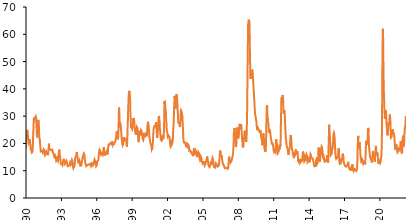
| Category | Series 0 |
|---|---|
| 1990-01-03 | 18.19 |
| 1990-01-04 | 18.705 |
| 1990-01-05 | 19.173 |
| 1990-01-06 | 19.173 |
| 1990-01-07 | 19.173 |
| 1990-01-08 | 19.445 |
| 1990-01-09 | 19.996 |
| 1990-01-10 | 20.403 |
| 1990-01-11 | 20.353 |
| 1990-01-12 | 20.889 |
| 1990-01-13 | 20.889 |
| 1990-01-14 | 20.889 |
| 1990-01-15 | 21.494 |
| 1990-01-16 | 21.763 |
| 1990-01-17 | 21.981 |
| 1990-01-18 | 22.178 |
| 1990-01-19 | 22.202 |
| 1990-01-20 | 22.202 |
| 1990-01-21 | 22.202 |
| 1990-01-22 | 22.524 |
| 1990-01-23 | 22.67 |
| 1990-01-24 | 22.84 |
| 1990-01-25 | 23.004 |
| 1990-01-26 | 23.186 |
| 1990-01-27 | 23.186 |
| 1990-01-28 | 23.186 |
| 1990-01-29 | 23.357 |
| 1990-01-30 | 23.552 |
| 1990-01-31 | 23.638 |
| 1990-02-01 | 23.694 |
| 1990-02-02 | 23.973 |
| 1990-02-03 | 24.199 |
| 1990-02-04 | 24.403 |
| 1990-02-05 | 24.41 |
| 1990-02-06 | 24.423 |
| 1990-02-07 | 24.606 |
| 1990-02-08 | 24.677 |
| 1990-02-09 | 24.734 |
| 1990-02-10 | 24.957 |
| 1990-02-11 | 24.973 |
| 1990-02-12 | 24.945 |
| 1990-02-13 | 24.891 |
| 1990-02-14 | 24.696 |
| 1990-02-15 | 24.493 |
| 1990-02-16 | 24.339 |
| 1990-02-17 | 24.339 |
| 1990-02-18 | 24.431 |
| 1990-02-19 | 24.431 |
| 1990-02-20 | 24.352 |
| 1990-02-21 | 24.219 |
| 1990-02-22 | 24.115 |
| 1990-02-23 | 24.034 |
| 1990-02-24 | 23.954 |
| 1990-02-25 | 23.832 |
| 1990-02-26 | 23.818 |
| 1990-02-27 | 23.764 |
| 1990-02-28 | 23.552 |
| 1990-03-01 | 23.298 |
| 1990-03-02 | 23.106 |
| 1990-03-03 | 23.018 |
| 1990-03-04 | 22.949 |
| 1990-03-05 | 22.904 |
| 1990-03-06 | 22.791 |
| 1990-03-07 | 22.532 |
| 1990-03-08 | 22.297 |
| 1990-03-09 | 22.107 |
| 1990-03-10 | 22.024 |
| 1990-03-11 | 21.936 |
| 1990-03-12 | 21.842 |
| 1990-03-13 | 21.805 |
| 1990-03-14 | 21.58 |
| 1990-03-15 | 21.344 |
| 1990-03-16 | 21.133 |
| 1990-03-17 | 21.204 |
| 1990-03-18 | 21.226 |
| 1990-03-19 | 21.08 |
| 1990-03-20 | 20.983 |
| 1990-03-21 | 20.943 |
| 1990-03-22 | 20.941 |
| 1990-03-23 | 20.785 |
| 1990-03-24 | 20.702 |
| 1990-03-25 | 20.553 |
| 1990-03-26 | 20.507 |
| 1990-03-27 | 20.53 |
| 1990-03-28 | 20.357 |
| 1990-03-29 | 20.165 |
| 1990-03-30 | 20.062 |
| 1990-03-31 | 19.975 |
| 1990-04-01 | 19.906 |
| 1990-04-02 | 20.046 |
| 1990-04-03 | 20.064 |
| 1990-04-04 | 20.064 |
| 1990-04-05 | 20.094 |
| 1990-04-06 | 20.215 |
| 1990-04-07 | 20.238 |
| 1990-04-08 | 20.234 |
| 1990-04-09 | 20.333 |
| 1990-04-10 | 20.395 |
| 1990-04-11 | 20.288 |
| 1990-04-12 | 20.231 |
| 1990-04-13 | 20.259 |
| 1990-04-14 | 20.332 |
| 1990-04-15 | 20.474 |
| 1990-04-16 | 20.488 |
| 1990-04-17 | 20.483 |
| 1990-04-18 | 20.691 |
| 1990-04-19 | 20.853 |
| 1990-04-20 | 21.007 |
| 1990-04-21 | 20.92 |
| 1990-04-22 | 20.945 |
| 1990-04-23 | 21.106 |
| 1990-04-24 | 21.134 |
| 1990-04-25 | 21.194 |
| 1990-04-26 | 21.158 |
| 1990-04-27 | 21.273 |
| 1990-04-28 | 21.414 |
| 1990-04-29 | 21.503 |
| 1990-04-30 | 21.404 |
| 1990-05-01 | 21.262 |
| 1990-05-02 | 21.094 |
| 1990-05-03 | 20.969 |
| 1990-05-04 | 20.743 |
| 1990-05-05 | 20.72 |
| 1990-05-06 | 20.665 |
| 1990-05-07 | 20.514 |
| 1990-05-08 | 20.418 |
| 1990-05-09 | 20.243 |
| 1990-05-10 | 20.096 |
| 1990-05-11 | 20.195 |
| 1990-05-12 | 20.214 |
| 1990-05-13 | 20.214 |
| 1990-05-14 | 20.211 |
| 1990-05-15 | 20.178 |
| 1990-05-16 | 20.04 |
| 1990-05-17 | 19.899 |
| 1990-05-18 | 19.65 |
| 1990-05-19 | 19.516 |
| 1990-05-20 | 19.325 |
| 1990-05-21 | 19.201 |
| 1990-05-22 | 19.14 |
| 1990-05-23 | 18.822 |
| 1990-05-24 | 18.64 |
| 1990-05-25 | 18.48 |
| 1990-05-26 | 18.395 |
| 1990-05-27 | 18.206 |
| 1990-05-28 | 18.206 |
| 1990-05-29 | 18.231 |
| 1990-05-30 | 18.132 |
| 1990-05-31 | 18.082 |
| 1990-06-01 | 17.976 |
| 1990-06-02 | 17.984 |
| 1990-06-03 | 18.021 |
| 1990-06-04 | 18.039 |
| 1990-06-05 | 18.084 |
| 1990-06-06 | 18.073 |
| 1990-06-07 | 17.996 |
| 1990-06-08 | 17.946 |
| 1990-06-09 | 17.914 |
| 1990-06-10 | 17.814 |
| 1990-06-11 | 17.74 |
| 1990-06-12 | 17.686 |
| 1990-06-13 | 17.554 |
| 1990-06-14 | 17.455 |
| 1990-06-15 | 17.369 |
| 1990-06-16 | 17.373 |
| 1990-06-17 | 17.383 |
| 1990-06-18 | 17.399 |
| 1990-06-19 | 17.296 |
| 1990-06-20 | 17.227 |
| 1990-06-21 | 17.078 |
| 1990-06-22 | 17.182 |
| 1990-06-23 | 17.156 |
| 1990-06-24 | 17.147 |
| 1990-06-25 | 17.143 |
| 1990-06-26 | 17.102 |
| 1990-06-27 | 17.052 |
| 1990-06-28 | 16.935 |
| 1990-06-29 | 16.847 |
| 1990-06-30 | 16.822 |
| 1990-07-01 | 16.809 |
| 1990-07-02 | 16.783 |
| 1990-07-03 | 16.752 |
| 1990-07-04 | 16.674 |
| 1990-07-05 | 16.592 |
| 1990-07-06 | 16.544 |
| 1990-07-07 | 16.528 |
| 1990-07-08 | 16.472 |
| 1990-07-09 | 16.482 |
| 1990-07-10 | 16.502 |
| 1990-07-11 | 16.519 |
| 1990-07-12 | 16.54 |
| 1990-07-13 | 16.527 |
| 1990-07-14 | 16.483 |
| 1990-07-15 | 16.514 |
| 1990-07-16 | 16.526 |
| 1990-07-17 | 16.532 |
| 1990-07-18 | 16.589 |
| 1990-07-19 | 16.747 |
| 1990-07-20 | 16.764 |
| 1990-07-21 | 16.867 |
| 1990-07-22 | 16.735 |
| 1990-07-23 | 17.082 |
| 1990-07-24 | 17.307 |
| 1990-07-25 | 17.456 |
| 1990-07-26 | 17.645 |
| 1990-07-27 | 17.889 |
| 1990-07-28 | 17.974 |
| 1990-07-29 | 18.104 |
| 1990-07-30 | 18.257 |
| 1990-07-31 | 18.393 |
| 1990-08-01 | 18.649 |
| 1990-08-02 | 18.855 |
| 1990-08-03 | 19.304 |
| 1990-08-04 | 19.402 |
| 1990-08-05 | 19.552 |
| 1990-08-06 | 20.33 |
| 1990-08-07 | 20.895 |
| 1990-08-08 | 21.423 |
| 1990-08-09 | 21.762 |
| 1990-08-10 | 22.175 |
| 1990-08-11 | 22.418 |
| 1990-08-12 | 22.684 |
| 1990-08-13 | 22.83 |
| 1990-08-14 | 22.891 |
| 1990-08-15 | 23.19 |
| 1990-08-16 | 23.667 |
| 1990-08-17 | 24.059 |
| 1990-08-18 | 24.321 |
| 1990-08-19 | 24.756 |
| 1990-08-20 | 24.837 |
| 1990-08-21 | 25.021 |
| 1990-08-22 | 25.334 |
| 1990-08-23 | 26.001 |
| 1990-08-24 | 26.625 |
| 1990-08-25 | 26.929 |
| 1990-08-26 | 27.219 |
| 1990-08-27 | 27.334 |
| 1990-08-28 | 27.415 |
| 1990-08-29 | 27.698 |
| 1990-08-30 | 28.097 |
| 1990-08-31 | 28.472 |
| 1990-09-01 | 28.855 |
| 1990-09-02 | 28.861 |
| 1990-09-03 | 28.861 |
| 1990-09-04 | 28.895 |
| 1990-09-05 | 28.543 |
| 1990-09-06 | 28.421 |
| 1990-09-07 | 28.443 |
| 1990-09-08 | 28.646 |
| 1990-09-09 | 28.798 |
| 1990-09-10 | 28.825 |
| 1990-09-11 | 28.804 |
| 1990-09-12 | 28.918 |
| 1990-09-13 | 29.163 |
| 1990-09-14 | 29.508 |
| 1990-09-15 | 29.625 |
| 1990-09-16 | 29.736 |
| 1990-09-17 | 29.726 |
| 1990-09-18 | 29.683 |
| 1990-09-19 | 29.751 |
| 1990-09-20 | 29.74 |
| 1990-09-21 | 29.715 |
| 1990-09-22 | 29.377 |
| 1990-09-23 | 29.138 |
| 1990-09-24 | 29.209 |
| 1990-09-25 | 29.19 |
| 1990-09-26 | 29.121 |
| 1990-09-27 | 29.1 |
| 1990-09-28 | 29.182 |
| 1990-09-29 | 29.147 |
| 1990-09-30 | 29.107 |
| 1990-10-01 | 29.055 |
| 1990-10-02 | 28.97 |
| 1990-10-03 | 28.922 |
| 1990-10-04 | 28.828 |
| 1990-10-05 | 28.797 |
| 1990-10-06 | 28.731 |
| 1990-10-07 | 28.731 |
| 1990-10-08 | 28.698 |
| 1990-10-09 | 28.79 |
| 1990-10-10 | 28.874 |
| 1990-10-11 | 29.128 |
| 1990-10-12 | 29.302 |
| 1990-10-13 | 29.3 |
| 1990-10-14 | 29.238 |
| 1990-10-15 | 29.352 |
| 1990-10-16 | 29.447 |
| 1990-10-17 | 29.53 |
| 1990-10-18 | 29.565 |
| 1990-10-19 | 29.565 |
| 1990-10-20 | 29.608 |
| 1990-10-21 | 29.586 |
| 1990-10-22 | 29.476 |
| 1990-10-23 | 29.389 |
| 1990-10-24 | 29.285 |
| 1990-10-25 | 29.296 |
| 1990-10-26 | 29.412 |
| 1990-10-27 | 29.448 |
| 1990-10-28 | 29.464 |
| 1990-10-29 | 29.563 |
| 1990-10-30 | 29.607 |
| 1990-10-31 | 29.697 |
| 1990-11-01 | 29.832 |
| 1990-11-02 | 29.929 |
| 1990-11-03 | 30.044 |
| 1990-11-04 | 30.153 |
| 1990-11-05 | 30.139 |
| 1990-11-06 | 30.092 |
| 1990-11-07 | 30.221 |
| 1990-11-08 | 30.225 |
| 1990-11-09 | 30.032 |
| 1990-11-10 | 29.844 |
| 1990-11-11 | 29.74 |
| 1990-11-12 | 29.542 |
| 1990-11-13 | 29.317 |
| 1990-11-14 | 28.919 |
| 1990-11-15 | 28.515 |
| 1990-11-16 | 28.06 |
| 1990-11-17 | 27.986 |
| 1990-11-18 | 27.993 |
| 1990-11-19 | 27.657 |
| 1990-11-20 | 27.313 |
| 1990-11-21 | 27.032 |
| 1990-11-22 | 27.007 |
| 1990-11-23 | 26.659 |
| 1990-11-24 | 26.54 |
| 1990-11-25 | 26.318 |
| 1990-11-26 | 26.14 |
| 1990-11-27 | 25.984 |
| 1990-11-28 | 25.576 |
| 1990-11-29 | 25.261 |
| 1990-11-30 | 24.886 |
| 1990-12-01 | 24.618 |
| 1990-12-02 | 24.333 |
| 1990-12-03 | 24.23 |
| 1990-12-04 | 24.126 |
| 1990-12-05 | 23.701 |
| 1990-12-06 | 23.392 |
| 1990-12-07 | 22.998 |
| 1990-12-08 | 22.608 |
| 1990-12-09 | 22.379 |
| 1990-12-10 | 22.44 |
| 1990-12-11 | 22.502 |
| 1990-12-12 | 22.296 |
| 1990-12-13 | 22.223 |
| 1990-12-14 | 22.269 |
| 1990-12-15 | 22.254 |
| 1990-12-16 | 22.302 |
| 1990-12-17 | 22.43 |
| 1990-12-18 | 22.462 |
| 1990-12-19 | 22.563 |
| 1990-12-20 | 22.708 |
| 1990-12-21 | 22.783 |
| 1990-12-22 | 22.783 |
| 1990-12-23 | 22.873 |
| 1990-12-24 | 22.928 |
| 1990-12-25 | 22.928 |
| 1990-12-26 | 22.996 |
| 1990-12-27 | 23.089 |
| 1990-12-28 | 23.188 |
| 1990-12-29 | 23.152 |
| 1990-12-30 | 23.204 |
| 1990-12-31 | 23.363 |
| 1991-01-01 | 23.363 |
| 1991-01-02 | 23.58 |
| 1991-01-03 | 23.874 |
| 1991-01-04 | 24.187 |
| 1991-01-05 | 24.269 |
| 1991-01-06 | 24.363 |
| 1991-01-07 | 24.604 |
| 1991-01-08 | 24.893 |
| 1991-01-09 | 25.379 |
| 1991-01-10 | 25.758 |
| 1991-01-11 | 26.325 |
| 1991-01-12 | 26.498 |
| 1991-01-13 | 26.645 |
| 1991-01-14 | 27.148 |
| 1991-01-15 | 27.598 |
| 1991-01-16 | 28.016 |
| 1991-01-17 | 28.233 |
| 1991-01-18 | 28.348 |
| 1991-01-19 | 28.623 |
| 1991-01-20 | 28.954 |
| 1991-01-21 | 28.711 |
| 1991-01-22 | 28.52 |
| 1991-01-23 | 28.515 |
| 1991-01-24 | 28.246 |
| 1991-01-25 | 28.151 |
| 1991-01-26 | 28.318 |
| 1991-01-27 | 28.491 |
| 1991-01-28 | 28.218 |
| 1991-01-29 | 27.978 |
| 1991-01-30 | 27.74 |
| 1991-01-31 | 27.429 |
| 1991-02-01 | 27.175 |
| 1991-02-02 | 27.14 |
| 1991-02-03 | 27.137 |
| 1991-02-04 | 26.886 |
| 1991-02-05 | 26.639 |
| 1991-02-06 | 26.354 |
| 1991-02-07 | 26.046 |
| 1991-02-08 | 25.595 |
| 1991-02-09 | 25.322 |
| 1991-02-10 | 24.957 |
| 1991-02-11 | 24.842 |
| 1991-02-12 | 24.725 |
| 1991-02-13 | 24.028 |
| 1991-02-14 | 23.36 |
| 1991-02-15 | 22.741 |
| 1991-02-16 | 22.517 |
| 1991-02-17 | 22.373 |
| 1991-02-18 | 22.373 |
| 1991-02-19 | 22.252 |
| 1991-02-20 | 22.154 |
| 1991-02-21 | 21.958 |
| 1991-02-22 | 21.819 |
| 1991-02-23 | 21.767 |
| 1991-02-24 | 21.744 |
| 1991-02-25 | 21.8 |
| 1991-02-26 | 21.732 |
| 1991-02-27 | 21.647 |
| 1991-02-28 | 21.555 |
| 1991-03-01 | 21.564 |
| 1991-03-02 | 21.598 |
| 1991-03-03 | 21.629 |
| 1991-03-04 | 21.589 |
| 1991-03-05 | 21.532 |
| 1991-03-06 | 21.467 |
| 1991-03-07 | 21.446 |
| 1991-03-08 | 21.352 |
| 1991-03-09 | 21.234 |
| 1991-03-10 | 21.115 |
| 1991-03-11 | 21.103 |
| 1991-03-12 | 20.989 |
| 1991-03-13 | 20.665 |
| 1991-03-14 | 20.299 |
| 1991-03-15 | 20.001 |
| 1991-03-16 | 19.923 |
| 1991-03-17 | 19.943 |
| 1991-03-18 | 19.724 |
| 1991-03-19 | 19.543 |
| 1991-03-20 | 19.377 |
| 1991-03-21 | 19.235 |
| 1991-03-22 | 18.96 |
| 1991-03-23 | 18.869 |
| 1991-03-24 | 18.756 |
| 1991-03-25 | 18.656 |
| 1991-03-26 | 18.545 |
| 1991-03-27 | 18.244 |
| 1991-03-28 | 18.078 |
| 1991-03-29 | 17.918 |
| 1991-03-30 | 17.744 |
| 1991-03-31 | 17.744 |
| 1991-04-01 | 17.728 |
| 1991-04-02 | 17.712 |
| 1991-04-03 | 17.558 |
| 1991-04-04 | 17.441 |
| 1991-04-05 | 17.302 |
| 1991-04-06 | 17.115 |
| 1991-04-07 | 16.921 |
| 1991-04-08 | 16.945 |
| 1991-04-09 | 17.096 |
| 1991-04-10 | 17.041 |
| 1991-04-11 | 16.966 |
| 1991-04-12 | 17.079 |
| 1991-04-13 | 17.186 |
| 1991-04-14 | 17.306 |
| 1991-04-15 | 17.265 |
| 1991-04-16 | 17.197 |
| 1991-04-17 | 17.181 |
| 1991-04-18 | 17.189 |
| 1991-04-19 | 17.171 |
| 1991-04-20 | 17.187 |
| 1991-04-21 | 17.224 |
| 1991-04-22 | 17.202 |
| 1991-04-23 | 17.193 |
| 1991-04-24 | 17.191 |
| 1991-04-25 | 17.231 |
| 1991-04-26 | 17.265 |
| 1991-04-27 | 17.284 |
| 1991-04-28 | 17.284 |
| 1991-04-29 | 17.331 |
| 1991-04-30 | 17.373 |
| 1991-05-01 | 17.389 |
| 1991-05-02 | 17.394 |
| 1991-05-03 | 17.377 |
| 1991-05-04 | 17.347 |
| 1991-05-05 | 17.333 |
| 1991-05-06 | 17.361 |
| 1991-05-07 | 17.365 |
| 1991-05-08 | 17.382 |
| 1991-05-09 | 17.248 |
| 1991-05-10 | 17.149 |
| 1991-05-11 | 17.144 |
| 1991-05-12 | 17.079 |
| 1991-05-13 | 17.107 |
| 1991-05-14 | 17.147 |
| 1991-05-15 | 17.233 |
| 1991-05-16 | 17.297 |
| 1991-05-17 | 17.35 |
| 1991-05-18 | 17.402 |
| 1991-05-19 | 17.489 |
| 1991-05-20 | 17.47 |
| 1991-05-21 | 17.406 |
| 1991-05-22 | 17.378 |
| 1991-05-23 | 17.337 |
| 1991-05-24 | 17.269 |
| 1991-05-25 | 17.275 |
| 1991-05-26 | 17.275 |
| 1991-05-27 | 17.275 |
| 1991-05-28 | 17.199 |
| 1991-05-29 | 17.086 |
| 1991-05-30 | 16.98 |
| 1991-05-31 | 16.892 |
| 1991-06-01 | 16.861 |
| 1991-06-02 | 16.841 |
| 1991-06-03 | 16.842 |
| 1991-06-04 | 16.81 |
| 1991-06-05 | 16.738 |
| 1991-06-06 | 16.713 |
| 1991-06-07 | 16.675 |
| 1991-06-08 | 16.65 |
| 1991-06-09 | 16.603 |
| 1991-06-10 | 16.646 |
| 1991-06-11 | 16.679 |
| 1991-06-12 | 16.681 |
| 1991-06-13 | 16.633 |
| 1991-06-14 | 16.519 |
| 1991-06-15 | 16.483 |
| 1991-06-16 | 16.475 |
| 1991-06-17 | 16.426 |
| 1991-06-18 | 16.412 |
| 1991-06-19 | 16.429 |
| 1991-06-20 | 16.461 |
| 1991-06-21 | 16.478 |
| 1991-06-22 | 16.496 |
| 1991-06-23 | 16.563 |
| 1991-06-24 | 16.649 |
| 1991-06-25 | 16.706 |
| 1991-06-26 | 16.764 |
| 1991-06-27 | 16.864 |
| 1991-06-28 | 17.03 |
| 1991-06-29 | 17.078 |
| 1991-06-30 | 17.135 |
| 1991-07-01 | 17.207 |
| 1991-07-02 | 17.226 |
| 1991-07-03 | 17.344 |
| 1991-07-04 | 17.4 |
| 1991-07-05 | 17.493 |
| 1991-07-06 | 17.521 |
| 1991-07-07 | 17.549 |
| 1991-07-08 | 17.686 |
| 1991-07-09 | 17.785 |
| 1991-07-10 | 17.867 |
| 1991-07-11 | 17.87 |
| 1991-07-12 | 17.898 |
| 1991-07-13 | 17.943 |
| 1991-07-14 | 18.046 |
| 1991-07-15 | 18.033 |
| 1991-07-16 | 18.007 |
| 1991-07-17 | 18.103 |
| 1991-07-18 | 18.086 |
| 1991-07-19 | 17.993 |
| 1991-07-20 | 18.056 |
| 1991-07-21 | 18.137 |
| 1991-07-22 | 18.075 |
| 1991-07-23 | 18.004 |
| 1991-07-24 | 17.915 |
| 1991-07-25 | 17.814 |
| 1991-07-26 | 17.694 |
| 1991-07-27 | 17.685 |
| 1991-07-28 | 17.587 |
| 1991-07-29 | 17.491 |
| 1991-07-30 | 17.395 |
| 1991-07-31 | 17.23 |
| 1991-08-01 | 17.127 |
| 1991-08-02 | 16.927 |
| 1991-08-03 | 16.927 |
| 1991-08-04 | 16.856 |
| 1991-08-05 | 16.811 |
| 1991-08-06 | 16.753 |
| 1991-08-07 | 16.538 |
| 1991-08-08 | 16.366 |
| 1991-08-09 | 16.196 |
| 1991-08-10 | 16.14 |
| 1991-08-11 | 16.032 |
| 1991-08-12 | 15.995 |
| 1991-08-13 | 15.938 |
| 1991-08-14 | 15.815 |
| 1991-08-15 | 15.711 |
| 1991-08-16 | 15.642 |
| 1991-08-17 | 15.636 |
| 1991-08-18 | 15.643 |
| 1991-08-19 | 15.907 |
| 1991-08-20 | 16.041 |
| 1991-08-21 | 15.983 |
| 1991-08-22 | 15.893 |
| 1991-08-23 | 15.802 |
| 1991-08-24 | 15.805 |
| 1991-08-25 | 15.822 |
| 1991-08-26 | 15.774 |
| 1991-08-27 | 15.76 |
| 1991-08-28 | 15.744 |
| 1991-08-29 | 15.714 |
| 1991-08-30 | 15.681 |
| 1991-08-31 | 15.691 |
| 1991-09-01 | 15.713 |
| 1991-09-02 | 15.713 |
| 1991-09-03 | 15.754 |
| 1991-09-04 | 15.814 |
| 1991-09-05 | 15.898 |
| 1991-09-06 | 15.955 |
| 1991-09-07 | 15.954 |
| 1991-09-08 | 15.981 |
| 1991-09-09 | 16.068 |
| 1991-09-10 | 16.17 |
| 1991-09-11 | 16.299 |
| 1991-09-12 | 16.37 |
| 1991-09-13 | 16.502 |
| 1991-09-14 | 16.568 |
| 1991-09-15 | 16.597 |
| 1991-09-16 | 16.658 |
| 1991-09-17 | 16.707 |
| 1991-09-18 | 16.534 |
| 1991-09-19 | 16.472 |
| 1991-09-20 | 16.542 |
| 1991-09-21 | 16.64 |
| 1991-09-22 | 16.757 |
| 1991-09-23 | 16.738 |
| 1991-09-24 | 16.705 |
| 1991-09-25 | 16.746 |
| 1991-09-26 | 16.741 |
| 1991-09-27 | 16.789 |
| 1991-09-28 | 16.887 |
| 1991-09-29 | 17.015 |
| 1991-09-30 | 16.957 |
| 1991-10-01 | 16.854 |
| 1991-10-02 | 16.807 |
| 1991-10-03 | 16.828 |
| 1991-10-04 | 16.758 |
| 1991-10-05 | 16.731 |
| 1991-10-06 | 16.73 |
| 1991-10-07 | 16.818 |
| 1991-10-08 | 16.863 |
| 1991-10-09 | 16.9 |
| 1991-10-10 | 16.881 |
| 1991-10-11 | 16.865 |
| 1991-10-12 | 16.896 |
| 1991-10-13 | 16.847 |
| 1991-10-14 | 16.84 |
| 1991-10-15 | 16.812 |
| 1991-10-16 | 16.677 |
| 1991-10-17 | 16.615 |
| 1991-10-18 | 16.538 |
| 1991-10-19 | 16.49 |
| 1991-10-20 | 16.46 |
| 1991-10-21 | 16.47 |
| 1991-10-22 | 16.473 |
| 1991-10-23 | 16.468 |
| 1991-10-24 | 16.449 |
| 1991-10-25 | 16.452 |
| 1991-10-26 | 16.504 |
| 1991-10-27 | 16.514 |
| 1991-10-28 | 16.463 |
| 1991-10-29 | 16.422 |
| 1991-10-30 | 16.404 |
| 1991-10-31 | 16.435 |
| 1991-11-01 | 16.425 |
| 1991-11-02 | 16.396 |
| 1991-11-03 | 16.434 |
| 1991-11-04 | 16.43 |
| 1991-11-05 | 16.432 |
| 1991-11-06 | 16.336 |
| 1991-11-07 | 16.253 |
| 1991-11-08 | 16.111 |
| 1991-11-09 | 16.031 |
| 1991-11-10 | 15.952 |
| 1991-11-11 | 15.902 |
| 1991-11-12 | 15.817 |
| 1991-11-13 | 15.692 |
| 1991-11-14 | 15.589 |
| 1991-11-15 | 15.877 |
| 1991-11-16 | 15.856 |
| 1991-11-17 | 15.855 |
| 1991-11-18 | 15.97 |
| 1991-11-19 | 16.169 |
| 1991-11-20 | 16.339 |
| 1991-11-21 | 16.455 |
| 1991-11-22 | 16.68 |
| 1991-11-23 | 16.73 |
| 1991-11-24 | 16.78 |
| 1991-11-25 | 17.024 |
| 1991-11-26 | 17.15 |
| 1991-11-27 | 17.35 |
| 1991-11-28 | 17.436 |
| 1991-11-29 | 17.664 |
| 1991-11-30 | 17.774 |
| 1991-12-01 | 17.888 |
| 1991-12-02 | 18.002 |
| 1991-12-03 | 18.083 |
| 1991-12-04 | 18.235 |
| 1991-12-05 | 18.412 |
| 1991-12-06 | 18.534 |
| 1991-12-07 | 18.663 |
| 1991-12-08 | 18.833 |
| 1991-12-09 | 18.878 |
| 1991-12-10 | 18.926 |
| 1991-12-11 | 19.197 |
| 1991-12-12 | 19.437 |
| 1991-12-13 | 19.624 |
| 1991-12-14 | 19.907 |
| 1991-12-15 | 19.84 |
| 1991-12-16 | 19.729 |
| 1991-12-17 | 19.652 |
| 1991-12-18 | 19.629 |
| 1991-12-19 | 19.515 |
| 1991-12-20 | 19.384 |
| 1991-12-21 | 19.398 |
| 1991-12-22 | 19.303 |
| 1991-12-23 | 19.168 |
| 1991-12-24 | 19.002 |
| 1991-12-25 | 18.856 |
| 1991-12-26 | 18.638 |
| 1991-12-27 | 18.431 |
| 1991-12-28 | 18.431 |
| 1991-12-29 | 18.335 |
| 1991-12-30 | 18.3 |
| 1991-12-31 | 18.348 |
| 1992-01-01 | 18.256 |
| 1992-01-02 | 18.218 |
| 1992-01-03 | 18.179 |
| 1992-01-04 | 18.073 |
| 1992-01-05 | 18.019 |
| 1992-01-06 | 18.069 |
| 1992-01-07 | 18.127 |
| 1992-01-08 | 18.076 |
| 1992-01-09 | 18.03 |
| 1992-01-10 | 17.923 |
| 1992-01-11 | 17.863 |
| 1992-01-12 | 17.862 |
| 1992-01-13 | 17.869 |
| 1992-01-14 | 17.826 |
| 1992-01-15 | 17.815 |
| 1992-01-16 | 17.791 |
| 1992-01-17 | 17.718 |
| 1992-01-18 | 17.705 |
| 1992-01-19 | 17.708 |
| 1992-01-20 | 17.641 |
| 1992-01-21 | 17.654 |
| 1992-01-22 | 17.661 |
| 1992-01-23 | 17.701 |
| 1992-01-24 | 17.631 |
| 1992-01-25 | 17.741 |
| 1992-01-26 | 17.848 |
| 1992-01-27 | 17.79 |
| 1992-01-28 | 17.784 |
| 1992-01-29 | 17.783 |
| 1992-01-30 | 17.697 |
| 1992-01-31 | 17.683 |
| 1992-02-01 | 17.623 |
| 1992-02-02 | 17.566 |
| 1992-02-03 | 17.597 |
| 1992-02-04 | 17.613 |
| 1992-02-05 | 17.58 |
| 1992-02-06 | 17.56 |
| 1992-02-07 | 17.55 |
| 1992-02-08 | 17.483 |
| 1992-02-09 | 17.434 |
| 1992-02-10 | 17.488 |
| 1992-02-11 | 17.498 |
| 1992-02-12 | 17.469 |
| 1992-02-13 | 17.489 |
| 1992-02-14 | 17.472 |
| 1992-02-15 | 17.464 |
| 1992-02-16 | 17.521 |
| 1992-02-17 | 17.521 |
| 1992-02-18 | 17.555 |
| 1992-02-19 | 17.59 |
| 1992-02-20 | 17.533 |
| 1992-02-21 | 17.539 |
| 1992-02-22 | 17.592 |
| 1992-02-23 | 17.664 |
| 1992-02-24 | 17.637 |
| 1992-02-25 | 17.576 |
| 1992-02-26 | 17.574 |
| 1992-02-27 | 17.519 |
| 1992-02-28 | 17.474 |
| 1992-02-29 | 17.473 |
| 1992-03-01 | 17.477 |
| 1992-03-02 | 17.447 |
| 1992-03-03 | 17.439 |
| 1992-03-04 | 17.424 |
| 1992-03-05 | 17.448 |
| 1992-03-06 | 17.521 |
| 1992-03-07 | 17.458 |
| 1992-03-08 | 17.402 |
| 1992-03-09 | 17.516 |
| 1992-03-10 | 17.571 |
| 1992-03-11 | 17.63 |
| 1992-03-12 | 17.726 |
| 1992-03-13 | 17.773 |
| 1992-03-14 | 17.789 |
| 1992-03-15 | 17.829 |
| 1992-03-16 | 17.86 |
| 1992-03-17 | 17.81 |
| 1992-03-18 | 17.759 |
| 1992-03-19 | 17.681 |
| 1992-03-20 | 17.666 |
| 1992-03-21 | 17.711 |
| 1992-03-22 | 17.753 |
| 1992-03-23 | 17.704 |
| 1992-03-24 | 17.641 |
| 1992-03-25 | 17.599 |
| 1992-03-26 | 17.596 |
| 1992-03-27 | 17.568 |
| 1992-03-28 | 17.618 |
| 1992-03-29 | 17.665 |
| 1992-03-30 | 17.584 |
| 1992-03-31 | 17.52 |
| 1992-04-01 | 17.502 |
| 1992-04-02 | 17.493 |
| 1992-04-03 | 17.44 |
| 1992-04-04 | 17.391 |
| 1992-04-05 | 17.273 |
| 1992-04-06 | 17.247 |
| 1992-04-07 | 17.318 |
| 1992-04-08 | 17.339 |
| 1992-04-09 | 17.303 |
| 1992-04-10 | 17.17 |
| 1992-04-11 | 17.048 |
| 1992-04-12 | 16.983 |
| 1992-04-13 | 16.983 |
| 1992-04-14 | 16.938 |
| 1992-04-15 | 16.787 |
| 1992-04-16 | 16.699 |
| 1992-04-17 | 16.7 |
| 1992-04-18 | 16.708 |
| 1992-04-19 | 16.703 |
| 1992-04-20 | 16.664 |
| 1992-04-21 | 16.658 |
| 1992-04-22 | 16.621 |
| 1992-04-23 | 16.598 |
| 1992-04-24 | 16.575 |
| 1992-04-25 | 16.589 |
| 1992-04-26 | 16.619 |
| 1992-04-27 | 16.612 |
| 1992-04-28 | 16.595 |
| 1992-04-29 | 16.594 |
| 1992-04-30 | 16.563 |
| 1992-05-01 | 16.569 |
| 1992-05-02 | 16.545 |
| 1992-05-03 | 16.535 |
| 1992-05-04 | 16.554 |
| 1992-05-05 | 16.56 |
| 1992-05-06 | 16.564 |
| 1992-05-07 | 16.456 |
| 1992-05-08 | 16.241 |
| 1992-05-09 | 16.159 |
| 1992-05-10 | 16.123 |
| 1992-05-11 | 16.075 |
| 1992-05-12 | 16.056 |
| 1992-05-13 | 15.97 |
| 1992-05-14 | 15.947 |
| 1992-05-15 | 15.931 |
| 1992-05-16 | 15.985 |
| 1992-05-17 | 15.985 |
| 1992-05-18 | 15.92 |
| 1992-05-19 | 15.814 |
| 1992-05-20 | 15.709 |
| 1992-05-21 | 15.59 |
| 1992-05-22 | 15.489 |
| 1992-05-23 | 15.472 |
| 1992-05-24 | 15.461 |
| 1992-05-25 | 15.461 |
| 1992-05-26 | 15.435 |
| 1992-05-27 | 15.316 |
| 1992-05-28 | 15.198 |
| 1992-05-29 | 15.099 |
| 1992-05-30 | 15.077 |
| 1992-05-31 | 14.996 |
| 1992-06-01 | 14.968 |
| 1992-06-02 | 14.949 |
| 1992-06-03 | 14.827 |
| 1992-06-04 | 14.684 |
| 1992-06-05 | 14.581 |
| 1992-06-06 | 14.483 |
| 1992-06-07 | 14.422 |
| 1992-06-08 | 14.46 |
| 1992-06-09 | 14.532 |
| 1992-06-10 | 14.601 |
| 1992-06-11 | 14.63 |
| 1992-06-12 | 14.619 |
| 1992-06-13 | 14.575 |
| 1992-06-14 | 14.562 |
| 1992-06-15 | 14.572 |
| 1992-06-16 | 14.603 |
| 1992-06-17 | 14.768 |
| 1992-06-18 | 14.988 |
| 1992-06-19 | 15.116 |
| 1992-06-20 | 15.176 |
| 1992-06-21 | 15.252 |
| 1992-06-22 | 15.322 |
| 1992-06-23 | 15.285 |
| 1992-06-24 | 15.245 |
| 1992-06-25 | 15.221 |
| 1992-06-26 | 15.252 |
| 1992-06-27 | 15.322 |
| 1992-06-28 | 15.395 |
| 1992-06-29 | 15.291 |
| 1992-06-30 | 15.203 |
| 1992-07-01 | 15.154 |
| 1992-07-02 | 15.122 |
| 1992-07-03 | 15.159 |
| 1992-07-04 | 15.234 |
| 1992-07-05 | 15.265 |
| 1992-07-06 | 15.245 |
| 1992-07-07 | 15.273 |
| 1992-07-08 | 15.289 |
| 1992-07-09 | 15.224 |
| 1992-07-10 | 15.085 |
| 1992-07-11 | 15.024 |
| 1992-07-12 | 15.028 |
| 1992-07-13 | 14.978 |
| 1992-07-14 | 14.907 |
| 1992-07-15 | 14.8 |
| 1992-07-16 | 14.66 |
| 1992-07-17 | 14.399 |
| 1992-07-18 | 14.209 |
| 1992-07-19 | 14.098 |
| 1992-07-20 | 14.027 |
| 1992-07-21 | 13.959 |
| 1992-07-22 | 13.811 |
| 1992-07-23 | 13.754 |
| 1992-07-24 | 13.705 |
| 1992-07-25 | 13.67 |
| 1992-07-26 | 13.618 |
| 1992-07-27 | 13.632 |
| 1992-07-28 | 13.604 |
| 1992-07-29 | 13.615 |
| 1992-07-30 | 13.622 |
| 1992-07-31 | 13.614 |
| 1992-08-01 | 13.601 |
| 1992-08-02 | 13.601 |
| 1992-08-03 | 13.612 |
| 1992-08-04 | 13.61 |
| 1992-08-05 | 13.563 |
| 1992-08-06 | 13.49 |
| 1992-08-07 | 13.418 |
| 1992-08-08 | 13.361 |
| 1992-08-09 | 13.344 |
| 1992-08-10 | 13.4 |
| 1992-08-11 | 13.477 |
| 1992-08-12 | 13.516 |
| 1992-08-13 | 13.6 |
| 1992-08-14 | 13.697 |
| 1992-08-15 | 13.765 |
| 1992-08-16 | 13.824 |
| 1992-08-17 | 13.861 |
| 1992-08-18 | 13.86 |
| 1992-08-19 | 13.937 |
| 1992-08-20 | 14.022 |
| 1992-08-21 | 14.088 |
| 1992-08-22 | 14.124 |
| 1992-08-23 | 14.162 |
| 1992-08-24 | 14.258 |
| 1992-08-25 | 14.32 |
| 1992-08-26 | 14.347 |
| 1992-08-27 | 14.375 |
| 1992-08-28 | 14.361 |
| 1992-08-29 | 14.402 |
| 1992-08-30 | 14.464 |
| 1992-08-31 | 14.422 |
| 1992-09-01 | 14.375 |
| 1992-09-02 | 14.325 |
| 1992-09-03 | 14.294 |
| 1992-09-04 | 14.255 |
| 1992-09-05 | 14.257 |
| 1992-09-06 | 14.273 |
| 1992-09-07 | 14.273 |
| 1992-09-08 | 14.243 |
| 1992-09-09 | 14.188 |
| 1992-09-10 | 14.085 |
| 1992-09-11 | 13.97 |
| 1992-09-12 | 13.902 |
| 1992-09-13 | 13.862 |
| 1992-09-14 | 13.818 |
| 1992-09-15 | 13.81 |
| 1992-09-16 | 13.815 |
| 1992-09-17 | 13.837 |
| 1992-09-18 | 13.808 |
| 1992-09-19 | 13.774 |
| 1992-09-20 | 13.709 |
| 1992-09-21 | 13.696 |
| 1992-09-22 | 13.705 |
| 1992-09-23 | 13.593 |
| 1992-09-24 | 13.489 |
| 1992-09-25 | 13.503 |
| 1992-09-26 | 13.496 |
| 1992-09-27 | 13.514 |
| 1992-09-28 | 13.598 |
| 1992-09-29 | 13.663 |
| 1992-09-30 | 13.697 |
| 1992-10-01 | 13.835 |
| 1992-10-02 | 14.076 |
| 1992-10-03 | 14.136 |
| 1992-10-04 | 14.197 |
| 1992-10-05 | 14.488 |
| 1992-10-06 | 14.748 |
| 1992-10-07 | 15.033 |
| 1992-10-08 | 15.288 |
| 1992-10-09 | 15.613 |
| 1992-10-10 | 15.741 |
| 1992-10-11 | 15.904 |
| 1992-10-12 | 16.075 |
| 1992-10-13 | 16.158 |
| 1992-10-14 | 16.405 |
| 1992-10-15 | 16.563 |
| 1992-10-16 | 16.667 |
| 1992-10-17 | 16.779 |
| 1992-10-18 | 16.931 |
| 1992-10-19 | 16.949 |
| 1992-10-20 | 16.945 |
| 1992-10-21 | 17.09 |
| 1992-10-22 | 17.179 |
| 1992-10-23 | 17.298 |
| 1992-10-24 | 17.482 |
| 1992-10-25 | 17.616 |
| 1992-10-26 | 17.554 |
| 1992-10-27 | 17.495 |
| 1992-10-28 | 17.529 |
| 1992-10-29 | 17.552 |
| 1992-10-30 | 17.637 |
| 1992-10-31 | 17.7 |
| 1992-11-01 | 17.696 |
| 1992-11-02 | 17.647 |
| 1992-11-03 | 17.632 |
| 1992-11-04 | 17.463 |
| 1992-11-05 | 17.255 |
| 1992-11-06 | 16.967 |
| 1992-11-07 | 16.858 |
| 1992-11-08 | 16.676 |
| 1992-11-09 | 16.559 |
| 1992-11-10 | 16.46 |
| 1992-11-11 | 16.21 |
| 1992-11-12 | 16.049 |
| 1992-11-13 | 15.876 |
| 1992-11-14 | 15.817 |
| 1992-11-15 | 15.757 |
| 1992-11-16 | 15.715 |
| 1992-11-17 | 15.683 |
| 1992-11-18 | 15.557 |
| 1992-11-19 | 15.442 |
| 1992-11-20 | 15.308 |
| 1992-11-21 | 15.282 |
| 1992-11-22 | 15.224 |
| 1992-11-23 | 15.137 |
| 1992-11-24 | 15.024 |
| 1992-11-25 | 14.85 |
| 1992-11-26 | 14.784 |
| 1992-11-27 | 14.624 |
| 1992-11-28 | 14.582 |
| 1992-11-29 | 14.499 |
| 1992-11-30 | 14.424 |
| 1992-12-01 | 14.347 |
| 1992-12-02 | 14.151 |
| 1992-12-03 | 13.899 |
| 1992-12-04 | 13.686 |
| 1992-12-05 | 13.602 |
| 1992-12-06 | 13.544 |
| 1992-12-07 | 13.467 |
| 1992-12-08 | 13.384 |
| 1992-12-09 | 13.306 |
| 1992-12-10 | 13.229 |
| 1992-12-11 | 13.15 |
| 1992-12-12 | 13.089 |
| 1992-12-13 | 13.009 |
| 1992-12-14 | 12.992 |
| 1992-12-15 | 12.964 |
| 1992-12-16 | 12.855 |
| 1992-12-17 | 12.719 |
| 1992-12-18 | 12.581 |
| 1992-12-19 | 12.494 |
| 1992-12-20 | 12.432 |
| 1992-12-21 | 12.393 |
| 1992-12-22 | 12.362 |
| 1992-12-23 | 12.272 |
| 1992-12-24 | 12.22 |
| 1992-12-25 | 12.206 |
| 1992-12-26 | 12.206 |
| 1992-12-27 | 12.186 |
| 1992-12-28 | 12.188 |
| 1992-12-29 | 12.193 |
| 1992-12-30 | 12.173 |
| 1992-12-31 | 12.162 |
| 1993-01-01 | 12.142 |
| 1993-01-02 | 12.148 |
| 1993-01-03 | 12.167 |
| 1993-01-04 | 12.23 |
| 1993-01-05 | 12.286 |
| 1993-01-06 | 12.354 |
| 1993-01-07 | 12.504 |
| 1993-01-08 | 12.564 |
| 1993-01-09 | 12.554 |
| 1993-01-10 | 12.566 |
| 1993-01-11 | 12.581 |
| 1993-01-12 | 12.591 |
| 1993-01-13 | 12.579 |
| 1993-01-14 | 12.558 |
| 1993-01-15 | 12.507 |
| 1993-01-16 | 12.527 |
| 1993-01-17 | 12.575 |
| 1993-01-18 | 12.518 |
| 1993-01-19 | 12.495 |
| 1993-01-20 | 12.52 |
| 1993-01-21 | 12.517 |
| 1993-01-22 | 12.506 |
| 1993-01-23 | 12.556 |
| 1993-01-24 | 12.556 |
| 1993-01-25 | 12.497 |
| 1993-01-26 | 12.447 |
| 1993-01-27 | 12.437 |
| 1993-01-28 | 12.425 |
| 1993-01-29 | 12.417 |
| 1993-01-30 | 12.409 |
| 1993-01-31 | 12.409 |
| 1993-02-01 | 12.405 |
| 1993-02-02 | 12.398 |
| 1993-02-03 | 12.342 |
| 1993-02-04 | 12.294 |
| 1993-02-05 | 12.272 |
| 1993-02-06 | 12.156 |
| 1993-02-07 | 12.075 |
| 1993-02-08 | 12.13 |
| 1993-02-09 | 12.191 |
| 1993-02-10 | 12.217 |
| 1993-02-11 | 12.213 |
| 1993-02-12 | 12.211 |
| 1993-02-13 | 12.221 |
| 1993-02-14 | 12.254 |
| 1993-02-15 | 12.254 |
| 1993-02-16 | 12.421 |
| 1993-02-17 | 12.631 |
| 1993-02-18 | 12.798 |
| 1993-02-19 | 12.934 |
| 1993-02-20 | 12.997 |
| 1993-02-21 | 13.086 |
| 1993-02-22 | 13.166 |
| 1993-02-23 | 13.256 |
| 1993-02-24 | 13.415 |
| 1993-02-25 | 13.525 |
| 1993-02-26 | 13.58 |
| 1993-02-27 | 13.656 |
| 1993-02-28 | 13.722 |
| 1993-03-01 | 13.716 |
| 1993-03-02 | 13.657 |
| 1993-03-03 | 13.695 |
| 1993-03-04 | 13.752 |
| 1993-03-05 | 13.845 |
| 1993-03-06 | 13.923 |
| 1993-03-07 | 13.977 |
| 1993-03-08 | 14.089 |
| 1993-03-09 | 14.093 |
| 1993-03-10 | 14.126 |
| 1993-03-11 | 14.163 |
| 1993-03-12 | 14.269 |
| 1993-03-13 | 14.348 |
| 1993-03-14 | 14.452 |
| 1993-03-15 | 14.466 |
| 1993-03-16 | 14.468 |
| 1993-03-17 | 14.471 |
| 1993-03-18 | 14.399 |
| 1993-03-19 | 14.277 |
| 1993-03-20 | 14.216 |
| 1993-03-21 | 14.176 |
| 1993-03-22 | 14.151 |
| 1993-03-23 | 14.1 |
| 1993-03-24 | 13.997 |
| 1993-03-25 | 13.863 |
| 1993-03-26 | 13.749 |
| 1993-03-27 | 13.748 |
| 1993-03-28 | 13.777 |
| 1993-03-29 | 13.723 |
| 1993-03-30 | 13.655 |
| 1993-03-31 | 13.606 |
| 1993-04-01 | 13.63 |
| 1993-04-02 | 13.693 |
| 1993-04-03 | 13.705 |
| 1993-04-04 | 13.686 |
| 1993-04-05 | 13.707 |
| 1993-04-06 | 13.731 |
| 1993-04-07 | 13.614 |
| 1993-04-08 | 13.553 |
| 1993-04-09 | 13.536 |
| 1993-04-10 | 13.5 |
| 1993-04-11 | 13.386 |
| 1993-04-12 | 13.313 |
| 1993-04-13 | 13.236 |
| 1993-04-14 | 13.094 |
| 1993-04-15 | 12.925 |
| 1993-04-16 | 12.771 |
| 1993-04-17 | 12.701 |
| 1993-04-18 | 12.673 |
| 1993-04-19 | 12.642 |
| 1993-04-20 | 12.609 |
| 1993-04-21 | 12.535 |
| 1993-04-22 | 12.519 |
| 1993-04-23 | 12.563 |
| 1993-04-24 | 12.587 |
| 1993-04-25 | 12.607 |
| 1993-04-26 | 12.739 |
| 1993-04-27 | 12.796 |
| 1993-04-28 | 12.819 |
| 1993-04-29 | 12.846 |
| 1993-04-30 | 12.841 |
| 1993-05-01 | 12.832 |
| 1993-05-02 | 12.744 |
| 1993-05-03 | 12.752 |
| 1993-05-04 | 12.723 |
| 1993-05-05 | 12.64 |
| 1993-05-06 | 12.591 |
| 1993-05-07 | 12.561 |
| 1993-05-08 | 12.548 |
| 1993-05-09 | 12.548 |
| 1993-05-10 | 12.604 |
| 1993-05-11 | 12.638 |
| 1993-05-12 | 12.712 |
| 1993-05-13 | 12.851 |
| 1993-05-14 | 12.97 |
| 1993-05-15 | 13.066 |
| 1993-05-16 | 13.155 |
| 1993-05-17 | 13.201 |
| 1993-05-18 | 13.246 |
| 1993-05-19 | 13.348 |
| 1993-05-20 | 13.44 |
| 1993-05-21 | 13.55 |
| 1993-05-22 | 13.591 |
| 1993-05-23 | 13.602 |
| 1993-05-24 | 13.626 |
| 1993-05-25 | 13.645 |
| 1993-05-26 | 13.537 |
| 1993-05-27 | 13.5 |
| 1993-05-28 | 13.515 |
| 1993-05-29 | 13.55 |
| 1993-05-30 | 13.606 |
| 1993-05-31 | 13.606 |
| 1993-06-01 | 13.609 |
| 1993-06-02 | 13.637 |
| 1993-06-03 | 13.703 |
| 1993-06-04 | 13.726 |
| 1993-06-05 | 13.751 |
| 1993-06-06 | 13.791 |
| 1993-06-07 | 13.804 |
| 1993-06-08 | 13.849 |
| 1993-06-09 | 13.86 |
| 1993-06-10 | 13.859 |
| 1993-06-11 | 13.818 |
| 1993-06-12 | 13.771 |
| 1993-06-13 | 13.738 |
| 1993-06-14 | 13.668 |
| 1993-06-15 | 13.588 |
| 1993-06-16 | 13.48 |
| 1993-06-17 | 13.36 |
| 1993-06-18 | 13.262 |
| 1993-06-19 | 13.227 |
| 1993-06-20 | 13.159 |
| 1993-06-21 | 13.114 |
| 1993-06-22 | 13.044 |
| 1993-06-23 | 12.946 |
| 1993-06-24 | 12.86 |
| 1993-06-25 | 12.783 |
| 1993-06-26 | 12.767 |
| 1993-06-27 | 12.73 |
| 1993-06-28 | 12.649 |
| 1993-06-29 | 12.584 |
| 1993-06-30 | 12.524 |
| 1993-07-01 | 12.426 |
| 1993-07-02 | 12.328 |
| 1993-07-03 | 12.27 |
| 1993-07-04 | 12.241 |
| 1993-07-05 | 12.241 |
| 1993-07-06 | 12.319 |
| 1993-07-07 | 12.27 |
| 1993-07-08 | 12.151 |
| 1993-07-09 | 12 |
| 1993-07-10 | 11.935 |
| 1993-07-11 | 11.894 |
| 1993-07-12 | 11.842 |
| 1993-07-13 | 11.803 |
| 1993-07-14 | 11.729 |
| 1993-07-15 | 11.663 |
| 1993-07-16 | 11.62 |
| 1993-07-17 | 11.618 |
| 1993-07-18 | 11.585 |
| 1993-07-19 | 11.579 |
| 1993-07-20 | 11.553 |
| 1993-07-21 | 11.54 |
| 1993-07-22 | 11.542 |
| 1993-07-23 | 11.508 |
| 1993-07-24 | 11.471 |
| 1993-07-25 | 11.482 |
| 1993-07-26 | 11.474 |
| 1993-07-27 | 11.468 |
| 1993-07-28 | 11.48 |
| 1993-07-29 | 11.478 |
| 1993-07-30 | 11.5 |
| 1993-07-31 | 11.5 |
| 1993-08-01 | 11.509 |
| 1993-08-02 | 11.507 |
| 1993-08-03 | 11.506 |
| 1993-08-04 | 11.515 |
| 1993-08-05 | 11.432 |
| 1993-08-06 | 11.399 |
| 1993-08-07 | 11.359 |
| 1993-08-08 | 11.387 |
| 1993-08-09 | 11.435 |
| 1993-08-10 | 11.475 |
| 1993-08-11 | 11.53 |
| 1993-08-12 | 11.592 |
| 1993-08-13 | 11.656 |
| 1993-08-14 | 11.706 |
| 1993-08-15 | 11.744 |
| 1993-08-16 | 11.756 |
| 1993-08-17 | 11.749 |
| 1993-08-18 | 11.751 |
| 1993-08-19 | 11.778 |
| 1993-08-20 | 11.762 |
| 1993-08-21 | 11.765 |
| 1993-08-22 | 11.788 |
| 1993-08-23 | 11.805 |
| 1993-08-24 | 11.805 |
| 1993-08-25 | 11.84 |
| 1993-08-26 | 11.876 |
| 1993-08-27 | 11.901 |
| 1993-08-28 | 11.932 |
| 1993-08-29 | 11.942 |
| 1993-08-30 | 11.932 |
| 1993-08-31 | 11.929 |
| 1993-09-01 | 11.929 |
| 1993-09-02 | 11.946 |
| 1993-09-03 | 11.921 |
| 1993-09-04 | 11.916 |
| 1993-09-05 | 11.896 |
| 1993-09-06 | 11.896 |
| 1993-09-07 | 11.943 |
| 1993-09-08 | 11.984 |
| 1993-09-09 | 12.001 |
| 1993-09-10 | 11.983 |
| 1993-09-11 | 11.964 |
| 1993-09-12 | 11.952 |
| 1993-09-13 | 11.962 |
| 1993-09-14 | 12.019 |
| 1993-09-15 | 12.051 |
| 1993-09-16 | 12.136 |
| 1993-09-17 | 12.225 |
| 1993-09-18 | 12.254 |
| 1993-09-19 | 12.288 |
| 1993-09-20 | 12.403 |
| 1993-09-21 | 12.637 |
| 1993-09-22 | 12.713 |
| 1993-09-23 | 12.787 |
| 1993-09-24 | 12.805 |
| 1993-09-25 | 12.838 |
| 1993-09-26 | 12.887 |
| 1993-09-27 | 12.867 |
| 1993-09-28 | 12.835 |
| 1993-09-29 | 12.877 |
| 1993-09-30 | 12.931 |
| 1993-10-01 | 12.948 |
| 1993-10-02 | 13.002 |
| 1993-10-03 | 13.099 |
| 1993-10-04 | 13.087 |
| 1993-10-05 | 13.081 |
| 1993-10-06 | 13.063 |
| 1993-10-07 | 13.074 |
| 1993-10-08 | 13.019 |
| 1993-10-09 | 13.036 |
| 1993-10-10 | 13.103 |
| 1993-10-11 | 13.062 |
| 1993-10-12 | 13.033 |
| 1993-10-13 | 12.997 |
| 1993-10-14 | 12.9 |
| 1993-10-15 | 12.816 |
| 1993-10-16 | 12.79 |
| 1993-10-17 | 12.76 |
| 1993-10-18 | 12.692 |
| 1993-10-19 | 12.643 |
| 1993-10-20 | 12.494 |
| 1993-10-21 | 12.217 |
| 1993-10-22 | 12.114 |
| 1993-10-23 | 12.054 |
| 1993-10-24 | 12.034 |
| 1993-10-25 | 12.024 |
| 1993-10-26 | 12.015 |
| 1993-10-27 | 11.993 |
| 1993-10-28 | 11.979 |
| 1993-10-29 | 11.926 |
| 1993-10-30 | 11.875 |
| 1993-10-31 | 11.878 |
| 1993-11-01 | 11.873 |
| 1993-11-02 | 11.867 |
| 1993-11-03 | 11.885 |
| 1993-11-04 | 11.963 |
| 1993-11-05 | 12.067 |
| 1993-11-06 | 12.016 |
| 1993-11-07 | 12.015 |
| 1993-11-08 | 12.124 |
| 1993-11-09 | 12.207 |
| 1993-11-10 | 12.273 |
| 1993-11-11 | 12.34 |
| 1993-11-12 | 12.429 |
| 1993-11-13 | 12.497 |
| 1993-11-14 | 12.578 |
| 1993-11-15 | 12.668 |
| 1993-11-16 | 12.779 |
| 1993-11-17 | 12.971 |
| 1993-11-18 | 13.11 |
| 1993-11-19 | 13.278 |
| 1993-11-20 | 13.377 |
| 1993-11-21 | 13.472 |
| 1993-11-22 | 13.588 |
| 1993-11-23 | 13.619 |
| 1993-11-24 | 13.695 |
| 1993-11-25 | 13.784 |
| 1993-11-26 | 13.868 |
| 1993-11-27 | 13.967 |
| 1993-11-28 | 14.099 |
| 1993-11-29 | 14.1 |
| 1993-11-30 | 14.084 |
| 1993-12-01 | 14.181 |
| 1993-12-02 | 14.266 |
| 1993-12-03 | 14.239 |
| 1993-12-04 | 14.216 |
| 1993-12-05 | 14.177 |
| 1993-12-06 | 14.11 |
| 1993-12-07 | 14.029 |
| 1993-12-08 | 13.941 |
| 1993-12-09 | 13.869 |
| 1993-12-10 | 13.816 |
| 1993-12-11 | 13.813 |
| 1993-12-12 | 13.838 |
| 1993-12-13 | 13.695 |
| 1993-12-14 | 13.573 |
| 1993-12-15 | 13.41 |
| 1993-12-16 | 13.209 |
| 1993-12-17 | 12.995 |
| 1993-12-18 | 12.912 |
| 1993-12-19 | 12.801 |
| 1993-12-20 | 12.699 |
| 1993-12-21 | 12.574 |
| 1993-12-22 | 12.26 |
| 1993-12-23 | 12.032 |
| 1993-12-24 | 11.958 |
| 1993-12-25 | 11.958 |
| 1993-12-26 | 11.863 |
| 1993-12-27 | 11.754 |
| 1993-12-28 | 11.662 |
| 1993-12-29 | 11.488 |
| 1993-12-30 | 11.342 |
| 1993-12-31 | 11.239 |
| 1994-01-01 | 11.125 |
| 1994-01-02 | 11.043 |
| 1994-01-03 | 11.119 |
| 1994-01-04 | 11.157 |
| 1994-01-05 | 11.066 |
| 1994-01-06 | 11.012 |
| 1994-01-07 | 10.94 |
| 1994-01-08 | 10.866 |
| 1994-01-09 | 10.775 |
| 1994-01-10 | 10.773 |
| 1994-01-11 | 10.798 |
| 1994-01-12 | 10.83 |
| 1994-01-13 | 10.875 |
| 1994-01-14 | 10.88 |
| 1994-01-15 | 10.88 |
| 1994-01-16 | 10.869 |
| 1994-01-17 | 10.92 |
| 1994-01-18 | 10.953 |
| 1994-01-19 | 11.001 |
| 1994-01-20 | 11.053 |
| 1994-01-21 | 11.138 |
| 1994-01-22 | 11.22 |
| 1994-01-23 | 11.22 |
| 1994-01-24 | 11.239 |
| 1994-01-25 | 11.245 |
| 1994-01-26 | 11.312 |
| 1994-01-27 | 11.334 |
| 1994-01-28 | 11.31 |
| 1994-01-29 | 11.34 |
| 1994-01-30 | 11.324 |
| 1994-01-31 | 11.29 |
| 1994-02-01 | 11.261 |
| 1994-02-02 | 11.172 |
| 1994-02-03 | 11.12 |
| 1994-02-04 | 11.315 |
| 1994-02-05 | 11.318 |
| 1994-02-06 | 11.336 |
| 1994-02-07 | 11.46 |
| 1994-02-08 | 11.56 |
| 1994-02-09 | 11.677 |
| 1994-02-10 | 11.811 |
| 1994-02-11 | 11.939 |
| 1994-02-12 | 11.932 |
| 1994-02-13 | 11.971 |
| 1994-02-14 | 12.081 |
| 1994-02-15 | 12.141 |
| 1994-02-16 | 12.198 |
| 1994-02-17 | 12.296 |
| 1994-02-18 | 12.43 |
| 1994-02-19 | 12.49 |
| 1994-02-20 | 12.56 |
| 1994-02-21 | 12.56 |
| 1994-02-22 | 12.606 |
| 1994-02-23 | 12.716 |
| 1994-02-24 | 12.934 |
| 1994-02-25 | 13.107 |
| 1994-02-26 | 13.247 |
| 1994-02-27 | 13.421 |
| 1994-02-28 | 13.494 |
| 1994-03-01 | 13.605 |
| 1994-03-02 | 13.864 |
| 1994-03-03 | 14.136 |
| 1994-03-04 | 14.393 |
| 1994-03-05 | 14.575 |
| 1994-03-06 | 14.539 |
| 1994-03-07 | 14.526 |
| 1994-03-08 | 14.607 |
| 1994-03-09 | 14.628 |
| 1994-03-10 | 14.766 |
| 1994-03-11 | 14.84 |
| 1994-03-12 | 14.871 |
| 1994-03-13 | 14.892 |
| 1994-03-14 | 14.978 |
| 1994-03-15 | 14.969 |
| 1994-03-16 | 14.98 |
| 1994-03-17 | 14.949 |
| 1994-03-18 | 14.958 |
| 1994-03-19 | 15.016 |
| 1994-03-20 | 15.033 |
| 1994-03-21 | 14.998 |
| 1994-03-22 | 14.922 |
| 1994-03-23 | 14.803 |
| 1994-03-24 | 14.799 |
| 1994-03-25 | 14.788 |
| 1994-03-26 | 14.732 |
| 1994-03-27 | 14.729 |
| 1994-03-28 | 14.737 |
| 1994-03-29 | 14.817 |
| 1994-03-30 | 14.986 |
| 1994-03-31 | 15.196 |
| 1994-04-01 | 15.154 |
| 1994-04-02 | 15.093 |
| 1994-04-03 | 15.046 |
| 1994-04-04 | 15.487 |
| 1994-04-05 | 15.613 |
| 1994-04-06 | 15.761 |
| 1994-04-07 | 15.797 |
| 1994-04-08 | 15.917 |
| 1994-04-09 | 15.885 |
| 1994-04-10 | 15.938 |
| 1994-04-11 | 15.972 |
| 1994-04-12 | 15.993 |
| 1994-04-13 | 16.013 |
| 1994-04-14 | 16.084 |
| 1994-04-15 | 16.154 |
| 1994-04-16 | 16.324 |
| 1994-04-17 | 16.482 |
| 1994-04-18 | 16.518 |
| 1994-04-19 | 16.538 |
| 1994-04-20 | 16.665 |
| 1994-04-21 | 16.739 |
| 1994-04-22 | 16.864 |
| 1994-04-23 | 17.036 |
| 1994-04-24 | 17.213 |
| 1994-04-25 | 17.065 |
| 1994-04-26 | 16.91 |
| 1994-04-27 | 17.01 |
| 1994-04-28 | 16.911 |
| 1994-04-29 | 16.67 |
| 1994-04-30 | 16.471 |
| 1994-05-01 | 16.471 |
| 1994-05-02 | 16.353 |
| 1994-05-03 | 16.232 |
| 1994-05-04 | 15.776 |
| 1994-05-05 | 15.606 |
| 1994-05-06 | 15.496 |
| 1994-05-07 | 15.422 |
| 1994-05-08 | 15.343 |
| 1994-05-09 | 15.384 |
| 1994-05-10 | 15.375 |
| 1994-05-11 | 15.324 |
| 1994-05-12 | 15.279 |
| 1994-05-13 | 15.16 |
| 1994-05-14 | 15.105 |
| 1994-05-15 | 15.059 |
| 1994-05-16 | 15.04 |
| 1994-05-17 | 14.994 |
| 1994-05-18 | 14.771 |
| 1994-05-19 | 14.552 |
| 1994-05-20 | 14.351 |
| 1994-05-21 | 14.323 |
| 1994-05-22 | 14.29 |
| 1994-05-23 | 14.25 |
| 1994-05-24 | 14.178 |
| 1994-05-25 | 14.09 |
| 1994-05-26 | 14.029 |
| 1994-05-27 | 13.959 |
| 1994-05-28 | 13.932 |
| 1994-05-29 | 13.941 |
| 1994-05-30 | 13.941 |
| 1994-05-31 | 13.897 |
| 1994-06-01 | 13.831 |
| 1994-06-02 | 13.78 |
| 1994-06-03 | 13.68 |
| 1994-06-04 | 13.636 |
| 1994-06-05 | 13.559 |
| 1994-06-06 | 13.533 |
| 1994-06-07 | 13.51 |
| 1994-06-08 | 13.375 |
| 1994-06-09 | 13.28 |
| 1994-06-10 | 13.144 |
| 1994-06-11 | 13.029 |
| 1994-06-12 | 12.949 |
| 1994-06-13 | 12.897 |
| 1994-06-14 | 12.836 |
| 1994-06-15 | 12.686 |
| 1994-06-16 | 12.55 |
| 1994-06-17 | 12.538 |
| 1994-06-18 | 12.548 |
| 1994-06-19 | 12.536 |
| 1994-06-20 | 12.607 |
| 1994-06-21 | 12.707 |
| 1994-06-22 | 12.732 |
| 1994-06-23 | 12.798 |
| 1994-06-24 | 13.002 |
| 1994-06-25 | 13.028 |
| 1994-06-26 | 13.056 |
| 1994-06-27 | 13.18 |
| 1994-06-28 | 13.268 |
| 1994-06-29 | 13.32 |
| 1994-06-30 | 13.409 |
| 1994-07-01 | 13.483 |
| 1994-07-02 | 13.519 |
| 1994-07-03 | 13.586 |
| 1994-07-04 | 13.586 |
| 1994-07-05 | 13.649 |
| 1994-07-06 | 13.729 |
| 1994-07-07 | 13.774 |
| 1994-07-08 | 13.771 |
| 1994-07-09 | 13.799 |
| 1994-07-10 | 13.858 |
| 1994-07-11 | 13.856 |
| 1994-07-12 | 13.835 |
| 1994-07-13 | 13.859 |
| 1994-07-14 | 13.86 |
| 1994-07-15 | 13.849 |
| 1994-07-16 | 13.98 |
| 1994-07-17 | 14.068 |
| 1994-07-18 | 13.937 |
| 1994-07-19 | 13.828 |
| 1994-07-20 | 13.72 |
| 1994-07-21 | 13.575 |
| 1994-07-22 | 13.442 |
| 1994-07-23 | 13.408 |
| 1994-07-24 | 13.234 |
| 1994-07-25 | 13.145 |
| 1994-07-26 | 13.074 |
| 1994-07-27 | 12.903 |
| 1994-07-28 | 12.76 |
| 1994-07-29 | 12.603 |
| 1994-07-30 | 12.484 |
| 1994-07-31 | 12.386 |
| 1994-08-01 | 12.325 |
| 1994-08-02 | 12.275 |
| 1994-08-03 | 12.233 |
| 1994-08-04 | 12.108 |
| 1994-08-05 | 12.001 |
| 1994-08-06 | 11.905 |
| 1994-08-07 | 11.838 |
| 1994-08-08 | 11.865 |
| 1994-08-09 | 11.895 |
| 1994-08-10 | 11.808 |
| 1994-08-11 | 11.75 |
| 1994-08-12 | 11.69 |
| 1994-08-13 | 11.692 |
| 1994-08-14 | 11.713 |
| 1994-08-15 | 11.73 |
| 1994-08-16 | 11.714 |
| 1994-08-17 | 11.719 |
| 1994-08-18 | 11.738 |
| 1994-08-19 | 11.789 |
| 1994-08-20 | 11.796 |
| 1994-08-21 | 11.824 |
| 1994-08-22 | 11.862 |
| 1994-08-23 | 11.857 |
| 1994-08-24 | 11.862 |
| 1994-08-25 | 11.879 |
| 1994-08-26 | 11.89 |
| 1994-08-27 | 11.884 |
| 1994-08-28 | 11.921 |
| 1994-08-29 | 11.917 |
| 1994-08-30 | 11.885 |
| 1994-08-31 | 11.922 |
| 1994-09-01 | 11.949 |
| 1994-09-02 | 11.951 |
| 1994-09-03 | 11.94 |
| 1994-09-04 | 11.92 |
| 1994-09-05 | 11.92 |
| 1994-09-06 | 11.909 |
| 1994-09-07 | 11.88 |
| 1994-09-08 | 11.848 |
| 1994-09-09 | 11.906 |
| 1994-09-10 | 11.894 |
| 1994-09-11 | 11.937 |
| 1994-09-12 | 12.04 |
| 1994-09-13 | 12.123 |
| 1994-09-14 | 12.172 |
| 1994-09-15 | 12.195 |
| 1994-09-16 | 12.255 |
| 1994-09-17 | 12.265 |
| 1994-09-18 | 12.235 |
| 1994-09-19 | 12.276 |
| 1994-09-20 | 12.38 |
| 1994-09-21 | 12.469 |
| 1994-09-22 | 12.57 |
| 1994-09-23 | 12.711 |
| 1994-09-24 | 12.746 |
| 1994-09-25 | 12.775 |
| 1994-09-26 | 12.865 |
| 1994-09-27 | 12.925 |
| 1994-09-28 | 12.993 |
| 1994-09-29 | 13.123 |
| 1994-09-30 | 13.233 |
| 1994-10-01 | 13.302 |
| 1994-10-02 | 13.402 |
| 1994-10-03 | 13.504 |
| 1994-10-04 | 13.654 |
| 1994-10-05 | 13.757 |
| 1994-10-06 | 13.964 |
| 1994-10-07 | 14.105 |
| 1994-10-08 | 14.212 |
| 1994-10-09 | 14.267 |
| 1994-10-10 | 14.289 |
| 1994-10-11 | 14.255 |
| 1994-10-12 | 14.278 |
| 1994-10-13 | 14.329 |
| 1994-10-14 | 14.34 |
| 1994-10-15 | 14.457 |
| 1994-10-16 | 14.539 |
| 1994-10-17 | 14.55 |
| 1994-10-18 | 14.552 |
| 1994-10-19 | 14.646 |
| 1994-10-20 | 14.716 |
| 1994-10-21 | 14.78 |
| 1994-10-22 | 14.823 |
| 1994-10-23 | 14.838 |
| 1994-10-24 | 14.939 |
| 1994-10-25 | 14.993 |
| 1994-10-26 | 15.045 |
| 1994-10-27 | 15.115 |
| 1994-10-28 | 15.175 |
| 1994-10-29 | 15.232 |
| 1994-10-30 | 15.28 |
| 1994-10-31 | 15.245 |
| 1994-11-01 | 15.227 |
| 1994-11-02 | 15.222 |
| 1994-11-03 | 15.173 |
| 1994-11-04 | 15.211 |
| 1994-11-05 | 15.162 |
| 1994-11-06 | 15.174 |
| 1994-11-07 | 15.279 |
| 1994-11-08 | 15.325 |
| 1994-11-09 | 15.402 |
| 1994-11-10 | 15.514 |
| 1994-11-11 | 15.604 |
| 1994-11-12 | 15.638 |
| 1994-11-13 | 15.754 |
| 1994-11-14 | 15.798 |
| 1994-11-15 | 15.837 |
| 1994-11-16 | 15.873 |
| 1994-11-17 | 15.933 |
| 1994-11-18 | 15.973 |
| 1994-11-19 | 15.972 |
| 1994-11-20 | 15.975 |
| 1994-11-21 | 15.982 |
| 1994-11-22 | 16.04 |
| 1994-11-23 | 16.105 |
| 1994-11-24 | 16.104 |
| 1994-11-25 | 16.187 |
| 1994-11-26 | 16.213 |
| 1994-11-27 | 16.299 |
| 1994-11-28 | 16.326 |
| 1994-11-29 | 16.318 |
| 1994-11-30 | 16.384 |
| 1994-12-01 | 16.472 |
| 1994-12-02 | 16.53 |
| 1994-12-03 | 16.577 |
| 1994-12-04 | 16.568 |
| 1994-12-05 | 16.544 |
| 1994-12-06 | 16.521 |
| 1994-12-07 | 16.469 |
| 1994-12-08 | 16.557 |
| 1994-12-09 | 16.539 |
| 1994-12-10 | 16.566 |
| 1994-12-11 | 16.569 |
| 1994-12-12 | 16.514 |
| 1994-12-13 | 16.417 |
| 1994-12-14 | 16.243 |
| 1994-12-15 | 16.063 |
| 1994-12-16 | 15.931 |
| 1994-12-17 | 15.932 |
| 1994-12-18 | 15.928 |
| 1994-12-19 | 15.783 |
| 1994-12-20 | 15.65 |
| 1994-12-21 | 15.455 |
| 1994-12-22 | 15.226 |
| 1994-12-23 | 14.912 |
| 1994-12-24 | 14.912 |
| 1994-12-25 | 14.785 |
| 1994-12-26 | 14.785 |
| 1994-12-27 | 14.656 |
| 1994-12-28 | 14.465 |
| 1994-12-29 | 14.308 |
| 1994-12-30 | 14.177 |
| 1994-12-31 | 14.051 |
| 1995-01-01 | 13.92 |
| 1995-01-02 | 13.92 |
| 1995-01-03 | 13.936 |
| 1995-01-04 | 13.808 |
| 1995-01-05 | 13.68 |
| 1995-01-06 | 13.523 |
| 1995-01-07 | 13.279 |
| 1995-01-08 | 13.126 |
| 1995-01-09 | 13.137 |
| 1995-01-10 | 13.106 |
| 1995-01-11 | 12.94 |
| 1995-01-12 | 12.858 |
| 1995-01-13 | 12.762 |
| 1995-01-14 | 12.756 |
| 1995-01-15 | 12.754 |
| 1995-01-16 | 12.669 |
| 1995-01-17 | 12.625 |
| 1995-01-18 | 12.553 |
| 1995-01-19 | 12.497 |
| 1995-01-20 | 12.502 |
| 1995-01-21 | 12.506 |
| 1995-01-22 | 12.544 |
| 1995-01-23 | 12.557 |
| 1995-01-24 | 12.526 |
| 1995-01-25 | 12.475 |
| 1995-01-26 | 12.436 |
| 1995-01-27 | 12.362 |
| 1995-01-28 | 12.337 |
| 1995-01-29 | 12.292 |
| 1995-01-30 | 12.29 |
| 1995-01-31 | 12.274 |
| 1995-02-01 | 12.25 |
| 1995-02-02 | 12.108 |
| 1995-02-03 | 11.992 |
| 1995-02-04 | 11.92 |
| 1995-02-05 | 11.859 |
| 1995-02-06 | 11.829 |
| 1995-02-07 | 11.799 |
| 1995-02-08 | 11.712 |
| 1995-02-09 | 11.672 |
| 1995-02-10 | 11.632 |
| 1995-02-11 | 11.575 |
| 1995-02-12 | 11.599 |
| 1995-02-13 | 11.59 |
| 1995-02-14 | 11.583 |
| 1995-02-15 | 11.6 |
| 1995-02-16 | 11.592 |
| 1995-02-17 | 11.598 |
| 1995-02-18 | 11.586 |
| 1995-02-19 | 11.558 |
| 1995-02-20 | 11.558 |
| 1995-02-21 | 11.581 |
| 1995-02-22 | 11.514 |
| 1995-02-23 | 11.477 |
| 1995-02-24 | 11.447 |
| 1995-02-25 | 11.457 |
| 1995-02-26 | 11.468 |
| 1995-02-27 | 11.52 |
| 1995-02-28 | 11.531 |
| 1995-03-01 | 11.502 |
| 1995-03-02 | 11.505 |
| 1995-03-03 | 11.491 |
| 1995-03-04 | 11.51 |
| 1995-03-05 | 11.537 |
| 1995-03-06 | 11.569 |
| 1995-03-07 | 11.695 |
| 1995-03-08 | 11.814 |
| 1995-03-09 | 11.919 |
| 1995-03-10 | 11.964 |
| 1995-03-11 | 11.981 |
| 1995-03-12 | 12.018 |
| 1995-03-13 | 12.024 |
| 1995-03-14 | 12.028 |
| 1995-03-15 | 12.076 |
| 1995-03-16 | 12.101 |
| 1995-03-17 | 12.114 |
| 1995-03-18 | 12.14 |
| 1995-03-19 | 12.162 |
| 1995-03-20 | 12.121 |
| 1995-03-21 | 12.093 |
| 1995-03-22 | 12.056 |
| 1995-03-23 | 12.028 |
| 1995-03-24 | 12.019 |
| 1995-03-25 | 12.06 |
| 1995-03-26 | 12.122 |
| 1995-03-27 | 12.108 |
| 1995-03-28 | 12.072 |
| 1995-03-29 | 12.072 |
| 1995-03-30 | 12.112 |
| 1995-03-31 | 12.19 |
| 1995-04-01 | 12.198 |
| 1995-04-02 | 12.236 |
| 1995-04-03 | 12.296 |
| 1995-04-04 | 12.31 |
| 1995-04-05 | 12.346 |
| 1995-04-06 | 12.282 |
| 1995-04-07 | 12.243 |
| 1995-04-08 | 12.19 |
| 1995-04-09 | 12.18 |
| 1995-04-10 | 12.209 |
| 1995-04-11 | 12.233 |
| 1995-04-12 | 12.228 |
| 1995-04-13 | 12.2 |
| 1995-04-14 | 12.189 |
| 1995-04-15 | 12.201 |
| 1995-04-16 | 12.222 |
| 1995-04-17 | 12.228 |
| 1995-04-18 | 12.262 |
| 1995-04-19 | 12.346 |
| 1995-04-20 | 12.373 |
| 1995-04-21 | 12.4 |
| 1995-04-22 | 12.448 |
| 1995-04-23 | 12.515 |
| 1995-04-24 | 12.485 |
| 1995-04-25 | 12.481 |
| 1995-04-26 | 12.503 |
| 1995-04-27 | 12.531 |
| 1995-04-28 | 12.495 |
| 1995-04-29 | 12.489 |
| 1995-04-30 | 12.443 |
| 1995-05-01 | 12.428 |
| 1995-05-02 | 12.401 |
| 1995-05-03 | 12.315 |
| 1995-05-04 | 12.316 |
| 1995-05-05 | 12.273 |
| 1995-05-06 | 12.247 |
| 1995-05-07 | 12.215 |
| 1995-05-08 | 12.215 |
| 1995-05-09 | 12.24 |
| 1995-05-10 | 12.254 |
| 1995-05-11 | 12.266 |
| 1995-05-12 | 12.257 |
| 1995-05-13 | 12.295 |
| 1995-05-14 | 12.295 |
| 1995-05-15 | 12.3 |
| 1995-05-16 | 12.295 |
| 1995-05-17 | 12.296 |
| 1995-05-18 | 12.304 |
| 1995-05-19 | 12.291 |
| 1995-05-20 | 12.3 |
| 1995-05-21 | 12.322 |
| 1995-05-22 | 12.292 |
| 1995-05-23 | 12.258 |
| 1995-05-24 | 12.228 |
| 1995-05-25 | 12.193 |
| 1995-05-26 | 12.189 |
| 1995-05-27 | 12.201 |
| 1995-05-28 | 12.224 |
| 1995-05-29 | 12.224 |
| 1995-05-30 | 12.238 |
| 1995-05-31 | 12.272 |
| 1995-06-01 | 12.288 |
| 1995-06-02 | 12.349 |
| 1995-06-03 | 12.334 |
| 1995-06-04 | 12.349 |
| 1995-06-05 | 12.404 |
| 1995-06-06 | 12.432 |
| 1995-06-07 | 12.462 |
| 1995-06-08 | 12.469 |
| 1995-06-09 | 12.453 |
| 1995-06-10 | 12.427 |
| 1995-06-11 | 12.458 |
| 1995-06-12 | 12.43 |
| 1995-06-13 | 12.376 |
| 1995-06-14 | 12.324 |
| 1995-06-15 | 12.278 |
| 1995-06-16 | 12.201 |
| 1995-06-17 | 12.155 |
| 1995-06-18 | 12.121 |
| 1995-06-19 | 12.075 |
| 1995-06-20 | 12.031 |
| 1995-06-21 | 12.014 |
| 1995-06-22 | 12.009 |
| 1995-06-23 | 12.002 |
| 1995-06-24 | 12.021 |
| 1995-06-25 | 12.012 |
| 1995-06-26 | 12.001 |
| 1995-06-27 | 12.019 |
| 1995-06-28 | 12.006 |
| 1995-06-29 | 11.964 |
| 1995-06-30 | 11.897 |
| 1995-07-01 | 11.882 |
| 1995-07-02 | 11.827 |
| 1995-07-03 | 11.815 |
| 1995-07-04 | 11.815 |
| 1995-07-05 | 11.75 |
| 1995-07-06 | 11.68 |
| 1995-07-07 | 11.629 |
| 1995-07-08 | 11.566 |
| 1995-07-09 | 11.503 |
| 1995-07-10 | 11.538 |
| 1995-07-11 | 11.571 |
| 1995-07-12 | 11.59 |
| 1995-07-13 | 11.651 |
| 1995-07-14 | 11.689 |
| 1995-07-15 | 11.712 |
| 1995-07-16 | 11.762 |
| 1995-07-17 | 11.787 |
| 1995-07-18 | 11.83 |
| 1995-07-19 | 11.938 |
| 1995-07-20 | 12.015 |
| 1995-07-21 | 12.065 |
| 1995-07-22 | 12.096 |
| 1995-07-23 | 12.148 |
| 1995-07-24 | 12.168 |
| 1995-07-25 | 12.197 |
| 1995-07-26 | 12.262 |
| 1995-07-27 | 12.301 |
| 1995-07-28 | 12.37 |
| 1995-07-29 | 12.409 |
| 1995-07-30 | 12.463 |
| 1995-07-31 | 12.514 |
| 1995-08-01 | 12.564 |
| 1995-08-02 | 12.663 |
| 1995-08-03 | 12.714 |
| 1995-08-04 | 12.765 |
| 1995-08-05 | 12.824 |
| 1995-08-06 | 12.877 |
| 1995-08-07 | 12.887 |
| 1995-08-08 | 12.895 |
| 1995-08-09 | 12.92 |
| 1995-08-10 | 12.955 |
| 1995-08-11 | 12.981 |
| 1995-08-12 | 13.001 |
| 1995-08-13 | 13.048 |
| 1995-08-14 | 13.057 |
| 1995-08-15 | 13.025 |
| 1995-08-16 | 13.033 |
| 1995-08-17 | 13.008 |
| 1995-08-18 | 12.942 |
| 1995-08-19 | 12.95 |
| 1995-08-20 | 12.978 |
| 1995-08-21 | 13 |
| 1995-08-22 | 12.981 |
| 1995-08-23 | 13.01 |
| 1995-08-24 | 13.017 |
| 1995-08-25 | 12.979 |
| 1995-08-26 | 12.969 |
| 1995-08-27 | 12.958 |
| 1995-08-28 | 12.936 |
| 1995-08-29 | 12.923 |
| 1995-08-30 | 12.856 |
| 1995-08-31 | 12.764 |
| 1995-09-01 | 12.656 |
| 1995-09-02 | 12.602 |
| 1995-09-03 | 12.572 |
| 1995-09-04 | 12.572 |
| 1995-09-05 | 12.528 |
| 1995-09-06 | 12.459 |
| 1995-09-07 | 12.401 |
| 1995-09-08 | 12.326 |
| 1995-09-09 | 12.292 |
| 1995-09-10 | 12.26 |
| 1995-09-11 | 12.222 |
| 1995-09-12 | 12.186 |
| 1995-09-13 | 12.096 |
| 1995-09-14 | 12.037 |
| 1995-09-15 | 11.995 |
| 1995-09-16 | 11.988 |
| 1995-09-17 | 11.986 |
| 1995-09-18 | 12.004 |
| 1995-09-19 | 12.036 |
| 1995-09-20 | 11.985 |
| 1995-09-21 | 11.98 |
| 1995-09-22 | 11.946 |
| 1995-09-23 | 11.896 |
| 1995-09-24 | 11.874 |
| 1995-09-25 | 11.941 |
| 1995-09-26 | 11.987 |
| 1995-09-27 | 12.007 |
| 1995-09-28 | 11.998 |
| 1995-09-29 | 12.031 |
| 1995-09-30 | 12.057 |
| 1995-10-01 | 12.097 |
| 1995-10-02 | 12.19 |
| 1995-10-03 | 12.3 |
| 1995-10-04 | 12.416 |
| 1995-10-05 | 12.602 |
| 1995-10-06 | 12.708 |
| 1995-10-07 | 12.749 |
| 1995-10-08 | 12.829 |
| 1995-10-09 | 12.925 |
| 1995-10-10 | 13.018 |
| 1995-10-11 | 13.157 |
| 1995-10-12 | 13.283 |
| 1995-10-13 | 13.389 |
| 1995-10-14 | 13.498 |
| 1995-10-15 | 13.594 |
| 1995-10-16 | 13.642 |
| 1995-10-17 | 13.66 |
| 1995-10-18 | 13.738 |
| 1995-10-19 | 13.778 |
| 1995-10-20 | 13.828 |
| 1995-10-21 | 13.891 |
| 1995-10-22 | 13.963 |
| 1995-10-23 | 13.973 |
| 1995-10-24 | 13.967 |
| 1995-10-25 | 14.025 |
| 1995-10-26 | 14.147 |
| 1995-10-27 | 14.226 |
| 1995-10-28 | 14.31 |
| 1995-10-29 | 14.388 |
| 1995-10-30 | 14.382 |
| 1995-10-31 | 14.357 |
| 1995-11-01 | 14.333 |
| 1995-11-02 | 14.273 |
| 1995-11-03 | 14.155 |
| 1995-11-04 | 14.08 |
| 1995-11-05 | 14.084 |
| 1995-11-06 | 14.02 |
| 1995-11-07 | 13.976 |
| 1995-11-08 | 13.854 |
| 1995-11-09 | 13.74 |
| 1995-11-10 | 13.667 |
| 1995-11-11 | 13.64 |
| 1995-11-12 | 13.639 |
| 1995-11-13 | 13.618 |
| 1995-11-14 | 13.607 |
| 1995-11-15 | 13.531 |
| 1995-11-16 | 13.465 |
| 1995-11-17 | 13.394 |
| 1995-11-18 | 13.386 |
| 1995-11-19 | 13.382 |
| 1995-11-20 | 13.334 |
| 1995-11-21 | 13.262 |
| 1995-11-22 | 13.155 |
| 1995-11-23 | 13.121 |
| 1995-11-24 | 12.997 |
| 1995-11-25 | 12.867 |
| 1995-11-26 | 12.774 |
| 1995-11-27 | 12.757 |
| 1995-11-28 | 12.7 |
| 1995-11-29 | 12.576 |
| 1995-11-30 | 12.469 |
| 1995-12-01 | 12.36 |
| 1995-12-02 | 12.318 |
| 1995-12-03 | 12.321 |
| 1995-12-04 | 12.238 |
| 1995-12-05 | 12.21 |
| 1995-12-06 | 12.208 |
| 1995-12-07 | 12.193 |
| 1995-12-08 | 12.144 |
| 1995-12-09 | 12.128 |
| 1995-12-10 | 12.084 |
| 1995-12-11 | 12.033 |
| 1995-12-12 | 11.966 |
| 1995-12-13 | 11.83 |
| 1995-12-14 | 11.72 |
| 1995-12-15 | 11.649 |
| 1995-12-16 | 11.603 |
| 1995-12-17 | 11.556 |
| 1995-12-18 | 11.706 |
| 1995-12-19 | 11.775 |
| 1995-12-20 | 11.767 |
| 1995-12-21 | 11.72 |
| 1995-12-22 | 11.706 |
| 1995-12-23 | 11.706 |
| 1995-12-24 | 11.698 |
| 1995-12-25 | 11.698 |
| 1995-12-26 | 11.688 |
| 1995-12-27 | 11.667 |
| 1995-12-28 | 11.699 |
| 1995-12-29 | 11.74 |
| 1995-12-30 | 11.748 |
| 1995-12-31 | 11.782 |
| 1996-01-01 | 11.782 |
| 1996-01-02 | 11.802 |
| 1996-01-03 | 11.875 |
| 1996-01-04 | 11.981 |
| 1996-01-05 | 12.025 |
| 1996-01-06 | 11.987 |
| 1996-01-07 | 12.036 |
| 1996-01-08 | 12.092 |
| 1996-01-09 | 12.248 |
| 1996-01-10 | 12.515 |
| 1996-01-11 | 12.718 |
| 1996-01-12 | 12.912 |
| 1996-01-13 | 13.008 |
| 1996-01-14 | 13.096 |
| 1996-01-15 | 13.195 |
| 1996-01-16 | 13.24 |
| 1996-01-17 | 13.225 |
| 1996-01-18 | 13.246 |
| 1996-01-19 | 13.271 |
| 1996-01-20 | 13.403 |
| 1996-01-21 | 13.508 |
| 1996-01-22 | 13.499 |
| 1996-01-23 | 13.502 |
| 1996-01-24 | 13.456 |
| 1996-01-25 | 13.525 |
| 1996-01-26 | 13.526 |
| 1996-01-27 | 13.59 |
| 1996-01-28 | 13.646 |
| 1996-01-29 | 13.574 |
| 1996-01-30 | 13.519 |
| 1996-01-31 | 13.474 |
| 1996-02-01 | 13.495 |
| 1996-02-02 | 13.546 |
| 1996-02-03 | 13.535 |
| 1996-02-04 | 13.532 |
| 1996-02-05 | 13.529 |
| 1996-02-06 | 13.577 |
| 1996-02-07 | 13.623 |
| 1996-02-08 | 13.563 |
| 1996-02-09 | 13.482 |
| 1996-02-10 | 13.425 |
| 1996-02-11 | 13.384 |
| 1996-02-12 | 13.447 |
| 1996-02-13 | 13.515 |
| 1996-02-14 | 13.542 |
| 1996-02-15 | 13.635 |
| 1996-02-16 | 13.685 |
| 1996-02-17 | 13.69 |
| 1996-02-18 | 13.74 |
| 1996-02-19 | 13.74 |
| 1996-02-20 | 13.886 |
| 1996-02-21 | 13.94 |
| 1996-02-22 | 13.987 |
| 1996-02-23 | 14.094 |
| 1996-02-24 | 14.151 |
| 1996-02-25 | 14.265 |
| 1996-02-26 | 14.37 |
| 1996-02-27 | 14.478 |
| 1996-02-28 | 14.694 |
| 1996-02-29 | 14.914 |
| 1996-03-01 | 15.113 |
| 1996-03-02 | 15.237 |
| 1996-03-03 | 15.342 |
| 1996-03-04 | 15.408 |
| 1996-03-05 | 15.441 |
| 1996-03-06 | 15.589 |
| 1996-03-07 | 15.68 |
| 1996-03-08 | 15.993 |
| 1996-03-09 | 16.098 |
| 1996-03-10 | 16.176 |
| 1996-03-11 | 16.337 |
| 1996-03-12 | 16.468 |
| 1996-03-13 | 16.632 |
| 1996-03-14 | 16.727 |
| 1996-03-15 | 16.772 |
| 1996-03-16 | 16.804 |
| 1996-03-17 | 16.879 |
| 1996-03-18 | 16.901 |
| 1996-03-19 | 16.97 |
| 1996-03-20 | 17.047 |
| 1996-03-21 | 17.09 |
| 1996-03-22 | 17.207 |
| 1996-03-23 | 17.333 |
| 1996-03-24 | 17.461 |
| 1996-03-25 | 17.479 |
| 1996-03-26 | 17.493 |
| 1996-03-27 | 17.562 |
| 1996-03-28 | 17.631 |
| 1996-03-29 | 17.73 |
| 1996-03-30 | 17.762 |
| 1996-03-31 | 17.814 |
| 1996-04-01 | 17.819 |
| 1996-04-02 | 17.756 |
| 1996-04-03 | 17.741 |
| 1996-04-04 | 17.745 |
| 1996-04-05 | 17.801 |
| 1996-04-06 | 17.866 |
| 1996-04-07 | 17.717 |
| 1996-04-08 | 17.768 |
| 1996-04-09 | 17.746 |
| 1996-04-10 | 17.785 |
| 1996-04-11 | 17.812 |
| 1996-04-12 | 17.776 |
| 1996-04-13 | 17.818 |
| 1996-04-14 | 17.886 |
| 1996-04-15 | 17.833 |
| 1996-04-16 | 17.767 |
| 1996-04-17 | 17.756 |
| 1996-04-18 | 17.663 |
| 1996-04-19 | 17.495 |
| 1996-04-20 | 17.482 |
| 1996-04-21 | 17.505 |
| 1996-04-22 | 17.399 |
| 1996-04-23 | 17.285 |
| 1996-04-24 | 17.146 |
| 1996-04-25 | 16.999 |
| 1996-04-26 | 16.85 |
| 1996-04-27 | 16.784 |
| 1996-04-28 | 16.674 |
| 1996-04-29 | 16.612 |
| 1996-04-30 | 16.575 |
| 1996-05-01 | 16.488 |
| 1996-05-02 | 16.591 |
| 1996-05-03 | 16.609 |
| 1996-05-04 | 16.63 |
| 1996-05-05 | 16.63 |
| 1996-05-06 | 16.644 |
| 1996-05-07 | 16.655 |
| 1996-05-08 | 16.521 |
| 1996-05-09 | 16.506 |
| 1996-05-10 | 16.296 |
| 1996-05-11 | 16.137 |
| 1996-05-12 | 16.074 |
| 1996-05-13 | 16.031 |
| 1996-05-14 | 15.98 |
| 1996-05-15 | 15.923 |
| 1996-05-16 | 15.89 |
| 1996-05-17 | 15.801 |
| 1996-05-18 | 15.772 |
| 1996-05-19 | 15.805 |
| 1996-05-20 | 15.805 |
| 1996-05-21 | 15.814 |
| 1996-05-22 | 15.819 |
| 1996-05-23 | 15.872 |
| 1996-05-24 | 15.9 |
| 1996-05-25 | 15.957 |
| 1996-05-26 | 16.017 |
| 1996-05-27 | 16.017 |
| 1996-05-28 | 16.06 |
| 1996-05-29 | 16.141 |
| 1996-05-30 | 16.15 |
| 1996-05-31 | 16.15 |
| 1996-06-01 | 16.026 |
| 1996-06-02 | 15.991 |
| 1996-06-03 | 16.034 |
| 1996-06-04 | 16.041 |
| 1996-06-05 | 16 |
| 1996-06-06 | 15.998 |
| 1996-06-07 | 16.013 |
| 1996-06-08 | 15.965 |
| 1996-06-09 | 15.983 |
| 1996-06-10 | 16.023 |
| 1996-06-11 | 16.054 |
| 1996-06-12 | 16.142 |
| 1996-06-13 | 16.248 |
| 1996-06-14 | 16.393 |
| 1996-06-15 | 16.427 |
| 1996-06-16 | 16.495 |
| 1996-06-17 | 16.543 |
| 1996-06-18 | 16.587 |
| 1996-06-19 | 16.67 |
| 1996-06-20 | 16.716 |
| 1996-06-21 | 16.73 |
| 1996-06-22 | 16.758 |
| 1996-06-23 | 16.822 |
| 1996-06-24 | 16.777 |
| 1996-06-25 | 16.712 |
| 1996-06-26 | 16.645 |
| 1996-06-27 | 16.521 |
| 1996-06-28 | 16.363 |
| 1996-06-29 | 16.38 |
| 1996-06-30 | 16.395 |
| 1996-07-01 | 16.27 |
| 1996-07-02 | 16.176 |
| 1996-07-03 | 16.055 |
| 1996-07-04 | 16.05 |
| 1996-07-05 | 16.052 |
| 1996-07-06 | 16.012 |
| 1996-07-07 | 16.008 |
| 1996-07-08 | 16.029 |
| 1996-07-09 | 16.003 |
| 1996-07-10 | 15.942 |
| 1996-07-11 | 15.996 |
| 1996-07-12 | 16 |
| 1996-07-13 | 15.944 |
| 1996-07-14 | 15.803 |
| 1996-07-15 | 16.018 |
| 1996-07-16 | 16.212 |
| 1996-07-17 | 16.296 |
| 1996-07-18 | 16.319 |
| 1996-07-19 | 16.306 |
| 1996-07-20 | 16.272 |
| 1996-07-21 | 16.297 |
| 1996-07-22 | 16.503 |
| 1996-07-23 | 16.743 |
| 1996-07-24 | 17.007 |
| 1996-07-25 | 17.195 |
| 1996-07-26 | 17.301 |
| 1996-07-27 | 17.456 |
| 1996-07-28 | 17.655 |
| 1996-07-29 | 17.777 |
| 1996-07-30 | 17.908 |
| 1996-07-31 | 18.179 |
| 1996-08-01 | 18.396 |
| 1996-08-02 | 18.49 |
| 1996-08-03 | 18.49 |
| 1996-08-04 | 18.61 |
| 1996-08-05 | 18.551 |
| 1996-08-06 | 18.477 |
| 1996-08-07 | 18.469 |
| 1996-08-08 | 18.494 |
| 1996-08-09 | 18.506 |
| 1996-08-10 | 18.539 |
| 1996-08-11 | 18.612 |
| 1996-08-12 | 18.467 |
| 1996-08-13 | 18.373 |
| 1996-08-14 | 18.185 |
| 1996-08-15 | 17.974 |
| 1996-08-16 | 17.773 |
| 1996-08-17 | 17.766 |
| 1996-08-18 | 17.791 |
| 1996-08-19 | 17.671 |
| 1996-08-20 | 17.537 |
| 1996-08-21 | 17.27 |
| 1996-08-22 | 16.913 |
| 1996-08-23 | 16.583 |
| 1996-08-24 | 16.45 |
| 1996-08-25 | 16.4 |
| 1996-08-26 | 16.351 |
| 1996-08-27 | 16.295 |
| 1996-08-28 | 16.068 |
| 1996-08-29 | 15.872 |
| 1996-08-30 | 15.76 |
| 1996-08-31 | 15.618 |
| 1996-09-01 | 15.589 |
| 1996-09-02 | 15.589 |
| 1996-09-03 | 15.726 |
| 1996-09-04 | 15.787 |
| 1996-09-05 | 15.958 |
| 1996-09-06 | 15.999 |
| 1996-09-07 | 15.996 |
| 1996-09-08 | 16.008 |
| 1996-09-09 | 16.026 |
| 1996-09-10 | 16.037 |
| 1996-09-11 | 16.06 |
| 1996-09-12 | 16.039 |
| 1996-09-13 | 16.003 |
| 1996-09-14 | 16.03 |
| 1996-09-15 | 16.094 |
| 1996-09-16 | 16.061 |
| 1996-09-17 | 16.046 |
| 1996-09-18 | 16.074 |
| 1996-09-19 | 16.136 |
| 1996-09-20 | 16.19 |
| 1996-09-21 | 16.313 |
| 1996-09-22 | 16.426 |
| 1996-09-23 | 16.427 |
| 1996-09-24 | 16.429 |
| 1996-09-25 | 16.469 |
| 1996-09-26 | 16.516 |
| 1996-09-27 | 16.564 |
| 1996-09-28 | 16.581 |
| 1996-09-29 | 16.558 |
| 1996-09-30 | 16.578 |
| 1996-10-01 | 16.6 |
| 1996-10-02 | 16.609 |
| 1996-10-03 | 16.531 |
| 1996-10-04 | 16.357 |
| 1996-10-05 | 16.159 |
| 1996-10-06 | 16.112 |
| 1996-10-07 | 16.064 |
| 1996-10-08 | 16.042 |
| 1996-10-09 | 16.03 |
| 1996-10-10 | 16.03 |
| 1996-10-11 | 15.985 |
| 1996-10-12 | 15.986 |
| 1996-10-13 | 16.026 |
| 1996-10-14 | 15.983 |
| 1996-10-15 | 15.976 |
| 1996-10-16 | 15.984 |
| 1996-10-17 | 15.969 |
| 1996-10-18 | 15.933 |
| 1996-10-19 | 15.929 |
| 1996-10-20 | 15.942 |
| 1996-10-21 | 15.944 |
| 1996-10-22 | 15.965 |
| 1996-10-23 | 15.965 |
| 1996-10-24 | 15.985 |
| 1996-10-25 | 16.033 |
| 1996-10-26 | 16.03 |
| 1996-10-27 | 16.026 |
| 1996-10-28 | 16.136 |
| 1996-10-29 | 16.234 |
| 1996-10-30 | 16.303 |
| 1996-10-31 | 16.351 |
| 1996-11-01 | 16.402 |
| 1996-11-02 | 16.384 |
| 1996-11-03 | 16.464 |
| 1996-11-04 | 16.539 |
| 1996-11-05 | 16.589 |
| 1996-11-06 | 16.674 |
| 1996-11-07 | 16.748 |
| 1996-11-08 | 16.734 |
| 1996-11-09 | 16.756 |
| 1996-11-10 | 16.84 |
| 1996-11-11 | 16.707 |
| 1996-11-12 | 16.646 |
| 1996-11-13 | 16.635 |
| 1996-11-14 | 16.542 |
| 1996-11-15 | 16.486 |
| 1996-11-16 | 16.537 |
| 1996-11-17 | 16.61 |
| 1996-11-18 | 16.539 |
| 1996-11-19 | 16.48 |
| 1996-11-20 | 16.478 |
| 1996-11-21 | 16.449 |
| 1996-11-22 | 16.38 |
| 1996-11-23 | 16.355 |
| 1996-11-24 | 16.309 |
| 1996-11-25 | 16.29 |
| 1996-11-26 | 16.32 |
| 1996-11-27 | 16.258 |
| 1996-11-28 | 16.161 |
| 1996-11-29 | 16.098 |
| 1996-11-30 | 15.997 |
| 1996-12-01 | 15.897 |
| 1996-12-02 | 15.999 |
| 1996-12-03 | 16.127 |
| 1996-12-04 | 16.121 |
| 1996-12-05 | 16.145 |
| 1996-12-06 | 16.233 |
| 1996-12-07 | 16.184 |
| 1996-12-08 | 16.205 |
| 1996-12-09 | 16.282 |
| 1996-12-10 | 16.359 |
| 1996-12-11 | 16.627 |
| 1996-12-12 | 16.87 |
| 1996-12-13 | 17.165 |
| 1996-12-14 | 17.333 |
| 1996-12-15 | 17.49 |
| 1996-12-16 | 17.715 |
| 1996-12-17 | 17.86 |
| 1996-12-18 | 18.065 |
| 1996-12-19 | 18.234 |
| 1996-12-20 | 18.372 |
| 1996-12-21 | 18.502 |
| 1996-12-22 | 18.691 |
| 1996-12-23 | 18.732 |
| 1996-12-24 | 18.729 |
| 1996-12-25 | 18.87 |
| 1996-12-26 | 18.951 |
| 1996-12-27 | 19.06 |
| 1996-12-28 | 19.06 |
| 1996-12-29 | 19.161 |
| 1996-12-30 | 19.178 |
| 1996-12-31 | 19.261 |
| 1997-01-01 | 19.328 |
| 1997-01-02 | 19.45 |
| 1997-01-03 | 19.51 |
| 1997-01-04 | 19.583 |
| 1997-01-05 | 19.625 |
| 1997-01-06 | 19.639 |
| 1997-01-07 | 19.624 |
| 1997-01-08 | 19.749 |
| 1997-01-09 | 19.9 |
| 1997-01-10 | 19.898 |
| 1997-01-11 | 19.869 |
| 1997-01-12 | 19.801 |
| 1997-01-13 | 19.803 |
| 1997-01-14 | 19.776 |
| 1997-01-15 | 19.647 |
| 1997-01-16 | 19.589 |
| 1997-01-17 | 19.549 |
| 1997-01-18 | 19.591 |
| 1997-01-19 | 19.632 |
| 1997-01-20 | 19.577 |
| 1997-01-21 | 19.489 |
| 1997-01-22 | 19.368 |
| 1997-01-23 | 19.358 |
| 1997-01-24 | 19.357 |
| 1997-01-25 | 19.395 |
| 1997-01-26 | 19.409 |
| 1997-01-27 | 19.447 |
| 1997-01-28 | 19.508 |
| 1997-01-29 | 19.542 |
| 1997-01-30 | 19.473 |
| 1997-01-31 | 19.473 |
| 1997-02-01 | 19.39 |
| 1997-02-02 | 19.404 |
| 1997-02-03 | 19.412 |
| 1997-02-04 | 19.413 |
| 1997-02-05 | 19.469 |
| 1997-02-06 | 19.508 |
| 1997-02-07 | 19.444 |
| 1997-02-08 | 19.37 |
| 1997-02-09 | 19.357 |
| 1997-02-10 | 19.422 |
| 1997-02-11 | 19.448 |
| 1997-02-12 | 19.43 |
| 1997-02-13 | 19.429 |
| 1997-02-14 | 19.418 |
| 1997-02-15 | 19.408 |
| 1997-02-16 | 19.449 |
| 1997-02-17 | 19.449 |
| 1997-02-18 | 19.462 |
| 1997-02-19 | 19.562 |
| 1997-02-20 | 19.743 |
| 1997-02-21 | 19.916 |
| 1997-02-22 | 19.992 |
| 1997-02-23 | 20.028 |
| 1997-02-24 | 20.018 |
| 1997-02-25 | 20.016 |
| 1997-02-26 | 20.046 |
| 1997-02-27 | 20.063 |
| 1997-02-28 | 20.106 |
| 1997-03-01 | 20.139 |
| 1997-03-02 | 20.139 |
| 1997-03-03 | 20.177 |
| 1997-03-04 | 20.198 |
| 1997-03-05 | 20.194 |
| 1997-03-06 | 20.244 |
| 1997-03-07 | 20.161 |
| 1997-03-08 | 20.161 |
| 1997-03-09 | 20.227 |
| 1997-03-10 | 20.166 |
| 1997-03-11 | 20.122 |
| 1997-03-12 | 20.073 |
| 1997-03-13 | 20.064 |
| 1997-03-14 | 20.08 |
| 1997-03-15 | 20.123 |
| 1997-03-16 | 20.172 |
| 1997-03-17 | 20.211 |
| 1997-03-18 | 20.261 |
| 1997-03-19 | 20.328 |
| 1997-03-20 | 20.397 |
| 1997-03-21 | 20.355 |
| 1997-03-22 | 20.305 |
| 1997-03-23 | 20.293 |
| 1997-03-24 | 20.282 |
| 1997-03-25 | 20.235 |
| 1997-03-26 | 20.166 |
| 1997-03-27 | 20.19 |
| 1997-03-28 | 20.164 |
| 1997-03-29 | 20.118 |
| 1997-03-30 | 20.066 |
| 1997-03-31 | 20.17 |
| 1997-04-01 | 20.202 |
| 1997-04-02 | 20.221 |
| 1997-04-03 | 20.249 |
| 1997-04-04 | 20.236 |
| 1997-04-05 | 20.224 |
| 1997-04-06 | 20.272 |
| 1997-04-07 | 20.184 |
| 1997-04-08 | 20.1 |
| 1997-04-09 | 20.08 |
| 1997-04-10 | 20.068 |
| 1997-04-11 | 20.075 |
| 1997-04-12 | 20.089 |
| 1997-04-13 | 20.104 |
| 1997-04-14 | 20.054 |
| 1997-04-15 | 19.968 |
| 1997-04-16 | 19.81 |
| 1997-04-17 | 19.689 |
| 1997-04-18 | 19.546 |
| 1997-04-19 | 19.462 |
| 1997-04-20 | 19.451 |
| 1997-04-21 | 19.483 |
| 1997-04-22 | 19.485 |
| 1997-04-23 | 19.505 |
| 1997-04-24 | 19.58 |
| 1997-04-25 | 19.714 |
| 1997-04-26 | 19.675 |
| 1997-04-27 | 19.675 |
| 1997-04-28 | 19.754 |
| 1997-04-29 | 19.757 |
| 1997-04-30 | 19.662 |
| 1997-05-01 | 19.618 |
| 1997-05-02 | 19.446 |
| 1997-05-03 | 19.363 |
| 1997-05-04 | 19.369 |
| 1997-05-05 | 19.406 |
| 1997-05-06 | 19.471 |
| 1997-05-07 | 19.6 |
| 1997-05-08 | 19.728 |
| 1997-05-09 | 19.799 |
| 1997-05-10 | 19.836 |
| 1997-05-11 | 19.84 |
| 1997-05-12 | 19.86 |
| 1997-05-13 | 19.903 |
| 1997-05-14 | 19.994 |
| 1997-05-15 | 20.069 |
| 1997-05-16 | 20.248 |
| 1997-05-17 | 20.321 |
| 1997-05-18 | 20.4 |
| 1997-05-19 | 20.451 |
| 1997-05-20 | 20.397 |
| 1997-05-21 | 20.36 |
| 1997-05-22 | 20.325 |
| 1997-05-23 | 20.216 |
| 1997-05-24 | 20.187 |
| 1997-05-25 | 20.139 |
| 1997-05-26 | 20.139 |
| 1997-05-27 | 20.102 |
| 1997-05-28 | 20.004 |
| 1997-05-29 | 19.966 |
| 1997-05-30 | 19.925 |
| 1997-05-31 | 19.928 |
| 1997-06-01 | 20.055 |
| 1997-06-02 | 20.094 |
| 1997-06-03 | 20.09 |
| 1997-06-04 | 20.089 |
| 1997-06-05 | 20.066 |
| 1997-06-06 | 19.951 |
| 1997-06-07 | 19.886 |
| 1997-06-08 | 19.874 |
| 1997-06-09 | 19.854 |
| 1997-06-10 | 19.815 |
| 1997-06-11 | 19.748 |
| 1997-06-12 | 19.639 |
| 1997-06-13 | 19.552 |
| 1997-06-14 | 19.534 |
| 1997-06-15 | 19.427 |
| 1997-06-16 | 19.444 |
| 1997-06-17 | 19.479 |
| 1997-06-18 | 19.43 |
| 1997-06-19 | 19.47 |
| 1997-06-20 | 19.513 |
| 1997-06-21 | 19.55 |
| 1997-06-22 | 19.628 |
| 1997-06-23 | 19.706 |
| 1997-06-24 | 19.755 |
| 1997-06-25 | 19.835 |
| 1997-06-26 | 19.946 |
| 1997-06-27 | 20.035 |
| 1997-06-28 | 20.083 |
| 1997-06-29 | 20.127 |
| 1997-06-30 | 20.194 |
| 1997-07-01 | 20.231 |
| 1997-07-02 | 20.179 |
| 1997-07-03 | 20.079 |
| 1997-07-04 | 20.078 |
| 1997-07-05 | 20.064 |
| 1997-07-06 | 20.123 |
| 1997-07-07 | 20.073 |
| 1997-07-08 | 20.011 |
| 1997-07-09 | 20.056 |
| 1997-07-10 | 20.098 |
| 1997-07-11 | 20.108 |
| 1997-07-12 | 20.188 |
| 1997-07-13 | 20.236 |
| 1997-07-14 | 20.203 |
| 1997-07-15 | 20.146 |
| 1997-07-16 | 20.126 |
| 1997-07-17 | 20.144 |
| 1997-07-18 | 20.231 |
| 1997-07-19 | 20.238 |
| 1997-07-20 | 20.239 |
| 1997-07-21 | 20.403 |
| 1997-07-22 | 20.468 |
| 1997-07-23 | 20.473 |
| 1997-07-24 | 20.484 |
| 1997-07-25 | 20.451 |
| 1997-07-26 | 20.383 |
| 1997-07-27 | 20.339 |
| 1997-07-28 | 20.414 |
| 1997-07-29 | 20.49 |
| 1997-07-30 | 20.484 |
| 1997-07-31 | 20.507 |
| 1997-08-01 | 20.63 |
| 1997-08-02 | 20.77 |
| 1997-08-03 | 20.77 |
| 1997-08-04 | 20.826 |
| 1997-08-05 | 20.818 |
| 1997-08-06 | 20.86 |
| 1997-08-07 | 20.905 |
| 1997-08-08 | 20.999 |
| 1997-08-09 | 21.05 |
| 1997-08-10 | 21.15 |
| 1997-08-11 | 21.227 |
| 1997-08-12 | 21.342 |
| 1997-08-13 | 21.566 |
| 1997-08-14 | 21.753 |
| 1997-08-15 | 21.985 |
| 1997-08-16 | 22.053 |
| 1997-08-17 | 22.042 |
| 1997-08-18 | 22.153 |
| 1997-08-19 | 22.175 |
| 1997-08-20 | 22.065 |
| 1997-08-21 | 22.159 |
| 1997-08-22 | 22.315 |
| 1997-08-23 | 22.38 |
| 1997-08-24 | 22.458 |
| 1997-08-25 | 22.536 |
| 1997-08-26 | 22.635 |
| 1997-08-27 | 22.745 |
| 1997-08-28 | 22.859 |
| 1997-08-29 | 23.012 |
| 1997-08-30 | 23.085 |
| 1997-08-31 | 23.124 |
| 1997-09-01 | 23.124 |
| 1997-09-02 | 23.191 |
| 1997-09-03 | 23.335 |
| 1997-09-04 | 23.555 |
| 1997-09-05 | 23.758 |
| 1997-09-06 | 23.958 |
| 1997-09-07 | 24.036 |
| 1997-09-08 | 24.054 |
| 1997-09-09 | 24.047 |
| 1997-09-10 | 24.136 |
| 1997-09-11 | 24.242 |
| 1997-09-12 | 24.273 |
| 1997-09-13 | 24.332 |
| 1997-09-14 | 24.325 |
| 1997-09-15 | 24.396 |
| 1997-09-16 | 24.366 |
| 1997-09-17 | 24.353 |
| 1997-09-18 | 24.393 |
| 1997-09-19 | 24.472 |
| 1997-09-20 | 24.504 |
| 1997-09-21 | 24.492 |
| 1997-09-22 | 24.371 |
| 1997-09-23 | 24.258 |
| 1997-09-24 | 24.189 |
| 1997-09-25 | 24.104 |
| 1997-09-26 | 24.009 |
| 1997-09-27 | 23.984 |
| 1997-09-28 | 23.943 |
| 1997-09-29 | 23.858 |
| 1997-09-30 | 23.812 |
| 1997-10-01 | 23.745 |
| 1997-10-02 | 23.642 |
| 1997-10-03 | 23.487 |
| 1997-10-04 | 23.402 |
| 1997-10-05 | 23.356 |
| 1997-10-06 | 23.273 |
| 1997-10-07 | 23.138 |
| 1997-10-08 | 22.973 |
| 1997-10-09 | 22.901 |
| 1997-10-10 | 22.679 |
| 1997-10-11 | 22.521 |
| 1997-10-12 | 22.388 |
| 1997-10-13 | 22.287 |
| 1997-10-14 | 22.183 |
| 1997-10-15 | 21.924 |
| 1997-10-16 | 21.777 |
| 1997-10-17 | 21.667 |
| 1997-10-18 | 21.581 |
| 1997-10-19 | 21.523 |
| 1997-10-20 | 21.485 |
| 1997-10-21 | 21.396 |
| 1997-10-22 | 21.295 |
| 1997-10-23 | 21.34 |
| 1997-10-24 | 21.364 |
| 1997-10-25 | 21.288 |
| 1997-10-26 | 21.24 |
| 1997-10-27 | 21.71 |
| 1997-10-28 | 22.142 |
| 1997-10-29 | 22.666 |
| 1997-10-30 | 23.361 |
| 1997-10-31 | 23.941 |
| 1997-11-01 | 24.021 |
| 1997-11-02 | 24.145 |
| 1997-11-03 | 24.523 |
| 1997-11-04 | 24.874 |
| 1997-11-05 | 25.355 |
| 1997-11-06 | 25.913 |
| 1997-11-07 | 26.617 |
| 1997-11-08 | 26.822 |
| 1997-11-09 | 27.176 |
| 1997-11-10 | 27.626 |
| 1997-11-11 | 28.024 |
| 1997-11-12 | 28.823 |
| 1997-11-13 | 29.58 |
| 1997-11-14 | 30.199 |
| 1997-11-15 | 30.659 |
| 1997-11-16 | 31.107 |
| 1997-11-17 | 31.13 |
| 1997-11-18 | 31.149 |
| 1997-11-19 | 31.568 |
| 1997-11-20 | 31.922 |
| 1997-11-21 | 32.23 |
| 1997-11-22 | 32.67 |
| 1997-11-23 | 33.146 |
| 1997-11-24 | 32.986 |
| 1997-11-25 | 32.803 |
| 1997-11-26 | 32.883 |
| 1997-11-27 | 32.966 |
| 1997-11-28 | 32.65 |
| 1997-11-29 | 32.358 |
| 1997-11-30 | 32.206 |
| 1997-12-01 | 31.88 |
| 1997-12-02 | 31.569 |
| 1997-12-03 | 31.16 |
| 1997-12-04 | 30.74 |
| 1997-12-05 | 30.264 |
| 1997-12-06 | 30.143 |
| 1997-12-07 | 29.802 |
| 1997-12-08 | 29.456 |
| 1997-12-09 | 29.151 |
| 1997-12-10 | 28.547 |
| 1997-12-11 | 28.109 |
| 1997-12-12 | 27.614 |
| 1997-12-13 | 27.138 |
| 1997-12-14 | 26.776 |
| 1997-12-15 | 26.807 |
| 1997-12-16 | 26.772 |
| 1997-12-17 | 26.51 |
| 1997-12-18 | 26.292 |
| 1997-12-19 | 26.254 |
| 1997-12-20 | 26.198 |
| 1997-12-21 | 26.173 |
| 1997-12-22 | 26.299 |
| 1997-12-23 | 26.477 |
| 1997-12-24 | 26.501 |
| 1997-12-25 | 26.372 |
| 1997-12-26 | 26.516 |
| 1997-12-27 | 26.516 |
| 1997-12-28 | 26.468 |
| 1997-12-29 | 26.485 |
| 1997-12-30 | 26.384 |
| 1997-12-31 | 26.289 |
| 1998-01-01 | 26.32 |
| 1998-01-02 | 26.295 |
| 1998-01-03 | 26.425 |
| 1998-01-04 | 26.634 |
| 1998-01-05 | 26.515 |
| 1998-01-06 | 26.472 |
| 1998-01-07 | 26.565 |
| 1998-01-08 | 26.697 |
| 1998-01-09 | 26.904 |
| 1998-01-10 | 26.866 |
| 1998-01-11 | 26.807 |
| 1998-01-12 | 26.871 |
| 1998-01-13 | 26.786 |
| 1998-01-14 | 26.605 |
| 1998-01-15 | 26.472 |
| 1998-01-16 | 26.238 |
| 1998-01-17 | 26.188 |
| 1998-01-18 | 26.022 |
| 1998-01-19 | 26.022 |
| 1998-01-20 | 25.792 |
| 1998-01-21 | 25.474 |
| 1998-01-22 | 25.122 |
| 1998-01-23 | 24.756 |
| 1998-01-24 | 24.756 |
| 1998-01-25 | 24.505 |
| 1998-01-26 | 24.477 |
| 1998-01-27 | 24.366 |
| 1998-01-28 | 24.13 |
| 1998-01-29 | 23.993 |
| 1998-01-30 | 23.866 |
| 1998-01-31 | 23.866 |
| 1998-02-01 | 23.89 |
| 1998-02-02 | 23.764 |
| 1998-02-03 | 23.616 |
| 1998-02-04 | 23.435 |
| 1998-02-05 | 23.227 |
| 1998-02-06 | 23.01 |
| 1998-02-07 | 22.86 |
| 1998-02-08 | 22.553 |
| 1998-02-09 | 22.503 |
| 1998-02-10 | 22.415 |
| 1998-02-11 | 22.051 |
| 1998-02-12 | 21.792 |
| 1998-02-13 | 21.606 |
| 1998-02-14 | 21.514 |
| 1998-02-15 | 21.506 |
| 1998-02-16 | 21.506 |
| 1998-02-17 | 21.469 |
| 1998-02-18 | 21.383 |
| 1998-02-19 | 21.299 |
| 1998-02-20 | 21.13 |
| 1998-02-21 | 21.029 |
| 1998-02-22 | 20.908 |
| 1998-02-23 | 20.812 |
| 1998-02-24 | 20.743 |
| 1998-02-25 | 20.488 |
| 1998-02-26 | 20.315 |
| 1998-02-27 | 20.148 |
| 1998-02-28 | 20.072 |
| 1998-03-01 | 19.999 |
| 1998-03-02 | 19.958 |
| 1998-03-03 | 19.915 |
| 1998-03-04 | 19.83 |
| 1998-03-05 | 19.842 |
| 1998-03-06 | 19.775 |
| 1998-03-07 | 19.7 |
| 1998-03-08 | 19.657 |
| 1998-03-09 | 19.686 |
| 1998-03-10 | 19.673 |
| 1998-03-11 | 19.547 |
| 1998-03-12 | 19.432 |
| 1998-03-13 | 19.352 |
| 1998-03-14 | 19.333 |
| 1998-03-15 | 19.307 |
| 1998-03-16 | 19.267 |
| 1998-03-17 | 19.238 |
| 1998-03-18 | 19.195 |
| 1998-03-19 | 19.059 |
| 1998-03-20 | 19.015 |
| 1998-03-21 | 18.973 |
| 1998-03-22 | 18.972 |
| 1998-03-23 | 19.02 |
| 1998-03-24 | 19.088 |
| 1998-03-25 | 19.249 |
| 1998-03-26 | 19.406 |
| 1998-03-27 | 19.627 |
| 1998-03-28 | 19.674 |
| 1998-03-29 | 19.73 |
| 1998-03-30 | 19.965 |
| 1998-03-31 | 20.159 |
| 1998-04-01 | 20.349 |
| 1998-04-02 | 20.482 |
| 1998-04-03 | 20.584 |
| 1998-04-04 | 20.568 |
| 1998-04-05 | 20.639 |
| 1998-04-06 | 20.726 |
| 1998-04-07 | 20.86 |
| 1998-04-08 | 20.993 |
| 1998-04-09 | 21.088 |
| 1998-04-10 | 21.192 |
| 1998-04-11 | 21.339 |
| 1998-04-12 | 21.478 |
| 1998-04-13 | 21.542 |
| 1998-04-14 | 21.546 |
| 1998-04-15 | 21.659 |
| 1998-04-16 | 21.821 |
| 1998-04-17 | 21.939 |
| 1998-04-18 | 22.148 |
| 1998-04-19 | 22.329 |
| 1998-04-20 | 22.232 |
| 1998-04-21 | 22.122 |
| 1998-04-22 | 22.096 |
| 1998-04-23 | 22.1 |
| 1998-04-24 | 22.073 |
| 1998-04-25 | 22.036 |
| 1998-04-26 | 21.961 |
| 1998-04-27 | 22.167 |
| 1998-04-28 | 22.263 |
| 1998-04-29 | 22.173 |
| 1998-04-30 | 22.029 |
| 1998-05-01 | 21.837 |
| 1998-05-02 | 21.829 |
| 1998-05-03 | 21.83 |
| 1998-05-04 | 21.754 |
| 1998-05-05 | 21.74 |
| 1998-05-06 | 21.756 |
| 1998-05-07 | 21.743 |
| 1998-05-08 | 21.619 |
| 1998-05-09 | 21.624 |
| 1998-05-10 | 21.624 |
| 1998-05-11 | 21.597 |
| 1998-05-12 | 21.569 |
| 1998-05-13 | 21.463 |
| 1998-05-14 | 21.374 |
| 1998-05-15 | 21.353 |
| 1998-05-16 | 21.32 |
| 1998-05-17 | 21.348 |
| 1998-05-18 | 21.364 |
| 1998-05-19 | 21.32 |
| 1998-05-20 | 21.297 |
| 1998-05-21 | 21.273 |
| 1998-05-22 | 21.252 |
| 1998-05-23 | 21.283 |
| 1998-05-24 | 21.249 |
| 1998-05-25 | 21.249 |
| 1998-05-26 | 21.288 |
| 1998-05-27 | 21.121 |
| 1998-05-28 | 20.958 |
| 1998-05-29 | 20.889 |
| 1998-05-30 | 20.874 |
| 1998-05-31 | 20.955 |
| 1998-06-01 | 21.048 |
| 1998-06-02 | 21.094 |
| 1998-06-03 | 21.214 |
| 1998-06-04 | 21.203 |
| 1998-06-05 | 21.06 |
| 1998-06-06 | 20.943 |
| 1998-06-07 | 20.963 |
| 1998-06-08 | 20.943 |
| 1998-06-09 | 20.923 |
| 1998-06-10 | 20.944 |
| 1998-06-11 | 21.067 |
| 1998-06-12 | 21.179 |
| 1998-06-13 | 21.255 |
| 1998-06-14 | 21.298 |
| 1998-06-15 | 21.53 |
| 1998-06-16 | 21.686 |
| 1998-06-17 | 21.743 |
| 1998-06-18 | 21.839 |
| 1998-06-19 | 21.936 |
| 1998-06-20 | 22.064 |
| 1998-06-21 | 22.225 |
| 1998-06-22 | 22.211 |
| 1998-06-23 | 22.114 |
| 1998-06-24 | 22.019 |
| 1998-06-25 | 21.936 |
| 1998-06-26 | 21.789 |
| 1998-06-27 | 21.839 |
| 1998-06-28 | 21.865 |
| 1998-06-29 | 21.756 |
| 1998-06-30 | 21.663 |
| 1998-07-01 | 21.443 |
| 1998-07-02 | 21.246 |
| 1998-07-03 | 21.17 |
| 1998-07-04 | 21.168 |
| 1998-07-05 | 21.241 |
| 1998-07-06 | 21.11 |
| 1998-07-07 | 20.991 |
| 1998-07-08 | 20.86 |
| 1998-07-09 | 20.748 |
| 1998-07-10 | 20.578 |
| 1998-07-11 | 20.429 |
| 1998-07-12 | 20.305 |
| 1998-07-13 | 20.202 |
| 1998-07-14 | 20.092 |
| 1998-07-15 | 19.709 |
| 1998-07-16 | 19.336 |
| 1998-07-17 | 19.019 |
| 1998-07-18 | 18.85 |
| 1998-07-19 | 18.688 |
| 1998-07-20 | 18.62 |
| 1998-07-21 | 18.691 |
| 1998-07-22 | 18.614 |
| 1998-07-23 | 18.749 |
| 1998-07-24 | 18.891 |
| 1998-07-25 | 18.823 |
| 1998-07-26 | 18.795 |
| 1998-07-27 | 19.012 |
| 1998-07-28 | 19.309 |
| 1998-07-29 | 19.558 |
| 1998-07-30 | 19.698 |
| 1998-07-31 | 20.022 |
| 1998-08-01 | 20.14 |
| 1998-08-02 | 20.14 |
| 1998-08-03 | 20.418 |
| 1998-08-04 | 20.901 |
| 1998-08-05 | 21.41 |
| 1998-08-06 | 21.846 |
| 1998-08-07 | 22.264 |
| 1998-08-08 | 22.46 |
| 1998-08-09 | 22.687 |
| 1998-08-10 | 22.975 |
| 1998-08-11 | 23.381 |
| 1998-08-12 | 23.849 |
| 1998-08-13 | 24.396 |
| 1998-08-14 | 25.144 |
| 1998-08-15 | 25.533 |
| 1998-08-16 | 25.998 |
| 1998-08-17 | 26.278 |
| 1998-08-18 | 26.374 |
| 1998-08-19 | 26.89 |
| 1998-08-20 | 27.34 |
| 1998-08-21 | 27.923 |
| 1998-08-22 | 28.157 |
| 1998-08-23 | 28.414 |
| 1998-08-24 | 28.575 |
| 1998-08-25 | 28.655 |
| 1998-08-26 | 29.019 |
| 1998-08-27 | 29.624 |
| 1998-08-28 | 30.297 |
| 1998-08-29 | 30.66 |
| 1998-08-30 | 30.954 |
| 1998-08-31 | 31.588 |
| 1998-09-01 | 31.81 |
| 1998-09-02 | 32.3 |
| 1998-09-03 | 32.772 |
| 1998-09-04 | 33.385 |
| 1998-09-05 | 33.631 |
| 1998-09-06 | 33.962 |
| 1998-09-07 | 33.962 |
| 1998-09-08 | 34.15 |
| 1998-09-09 | 34.669 |
| 1998-09-10 | 35.306 |
| 1998-09-11 | 36.03 |
| 1998-09-12 | 36.335 |
| 1998-09-13 | 36.44 |
| 1998-09-14 | 36.546 |
| 1998-09-15 | 36.548 |
| 1998-09-16 | 36.742 |
| 1998-09-17 | 37.258 |
| 1998-09-18 | 37.731 |
| 1998-09-19 | 38.118 |
| 1998-09-20 | 38.38 |
| 1998-09-21 | 38.39 |
| 1998-09-22 | 38.306 |
| 1998-09-23 | 38.338 |
| 1998-09-24 | 38.544 |
| 1998-09-25 | 38.706 |
| 1998-09-26 | 38.714 |
| 1998-09-27 | 38.667 |
| 1998-09-28 | 38.478 |
| 1998-09-29 | 38.363 |
| 1998-09-30 | 38.205 |
| 1998-10-01 | 38.538 |
| 1998-10-02 | 38.715 |
| 1998-10-03 | 38.579 |
| 1998-10-04 | 38.33 |
| 1998-10-05 | 38.554 |
| 1998-10-06 | 38.68 |
| 1998-10-07 | 38.9 |
| 1998-10-08 | 39.256 |
| 1998-10-09 | 39.371 |
| 1998-10-10 | 39.09 |
| 1998-10-11 | 38.857 |
| 1998-10-12 | 38.915 |
| 1998-10-13 | 38.975 |
| 1998-10-14 | 38.992 |
| 1998-10-15 | 38.845 |
| 1998-10-16 | 38.794 |
| 1998-10-17 | 38.773 |
| 1998-10-18 | 38.781 |
| 1998-10-19 | 38.511 |
| 1998-10-20 | 38.266 |
| 1998-10-21 | 38.022 |
| 1998-10-22 | 37.79 |
| 1998-10-23 | 37.781 |
| 1998-10-24 | 37.93 |
| 1998-10-25 | 38.099 |
| 1998-10-26 | 37.827 |
| 1998-10-27 | 37.605 |
| 1998-10-28 | 37.494 |
| 1998-10-29 | 37.195 |
| 1998-10-30 | 36.608 |
| 1998-10-31 | 36.281 |
| 1998-11-01 | 36.072 |
| 1998-11-02 | 35.652 |
| 1998-11-03 | 35.293 |
| 1998-11-04 | 34.591 |
| 1998-11-05 | 33.901 |
| 1998-11-06 | 33.091 |
| 1998-11-07 | 32.489 |
| 1998-11-08 | 32.004 |
| 1998-11-09 | 31.817 |
| 1998-11-10 | 31.651 |
| 1998-11-11 | 31.124 |
| 1998-11-12 | 30.626 |
| 1998-11-13 | 30.175 |
| 1998-11-14 | 30.024 |
| 1998-11-15 | 29.784 |
| 1998-11-16 | 29.742 |
| 1998-11-17 | 29.661 |
| 1998-11-18 | 29.388 |
| 1998-11-19 | 29.042 |
| 1998-11-20 | 28.554 |
| 1998-11-21 | 28.412 |
| 1998-11-22 | 28.22 |
| 1998-11-23 | 27.916 |
| 1998-11-24 | 27.705 |
| 1998-11-25 | 27.24 |
| 1998-11-26 | 26.968 |
| 1998-11-27 | 26.476 |
| 1998-11-28 | 26.325 |
| 1998-11-29 | 26.234 |
| 1998-11-30 | 26.223 |
| 1998-12-01 | 26.163 |
| 1998-12-02 | 26.076 |
| 1998-12-03 | 26.121 |
| 1998-12-04 | 26.023 |
| 1998-12-05 | 26.023 |
| 1998-12-06 | 26.041 |
| 1998-12-07 | 25.984 |
| 1998-12-08 | 25.964 |
| 1998-12-09 | 25.849 |
| 1998-12-10 | 25.784 |
| 1998-12-11 | 25.748 |
| 1998-12-12 | 25.572 |
| 1998-12-13 | 25.389 |
| 1998-12-14 | 25.685 |
| 1998-12-15 | 25.863 |
| 1998-12-16 | 25.914 |
| 1998-12-17 | 25.914 |
| 1998-12-18 | 25.815 |
| 1998-12-19 | 25.83 |
| 1998-12-20 | 26.007 |
| 1998-12-21 | 25.9 |
| 1998-12-22 | 25.751 |
| 1998-12-23 | 25.674 |
| 1998-12-24 | 25.588 |
| 1998-12-25 | 25.76 |
| 1998-12-26 | 25.76 |
| 1998-12-27 | 25.953 |
| 1998-12-28 | 25.83 |
| 1998-12-29 | 25.657 |
| 1998-12-30 | 25.53 |
| 1998-12-31 | 25.503 |
| 1999-01-01 | 25.507 |
| 1999-01-02 | 25.339 |
| 1999-01-03 | 25.341 |
| 1999-01-04 | 25.384 |
| 1999-01-05 | 25.338 |
| 1999-01-06 | 25.26 |
| 1999-01-07 | 25.199 |
| 1999-01-08 | 25.08 |
| 1999-01-09 | 24.989 |
| 1999-01-10 | 24.838 |
| 1999-01-11 | 24.871 |
| 1999-01-12 | 25.032 |
| 1999-01-13 | 24.972 |
| 1999-01-14 | 25.15 |
| 1999-01-15 | 25.114 |
| 1999-01-16 | 24.964 |
| 1999-01-17 | 24.96 |
| 1999-01-18 | 24.96 |
| 1999-01-19 | 25.185 |
| 1999-01-20 | 25.435 |
| 1999-01-21 | 25.863 |
| 1999-01-22 | 26.481 |
| 1999-01-23 | 26.759 |
| 1999-01-24 | 26.759 |
| 1999-01-25 | 26.989 |
| 1999-01-26 | 27.101 |
| 1999-01-27 | 27.413 |
| 1999-01-28 | 27.709 |
| 1999-01-29 | 27.855 |
| 1999-01-30 | 28.035 |
| 1999-01-31 | 28.035 |
| 1999-02-01 | 28.017 |
| 1999-02-02 | 28.024 |
| 1999-02-03 | 28.105 |
| 1999-02-04 | 28.344 |
| 1999-02-05 | 28.646 |
| 1999-02-06 | 28.86 |
| 1999-02-07 | 29.153 |
| 1999-02-08 | 29.209 |
| 1999-02-09 | 29.311 |
| 1999-02-10 | 29.549 |
| 1999-02-11 | 29.517 |
| 1999-02-12 | 29.5 |
| 1999-02-13 | 29.326 |
| 1999-02-14 | 29.331 |
| 1999-02-15 | 29.331 |
| 1999-02-16 | 29.346 |
| 1999-02-17 | 29.409 |
| 1999-02-18 | 29.466 |
| 1999-02-19 | 29.5 |
| 1999-02-20 | 29.429 |
| 1999-02-21 | 29.296 |
| 1999-02-22 | 29.124 |
| 1999-02-23 | 28.999 |
| 1999-02-24 | 28.812 |
| 1999-02-25 | 28.754 |
| 1999-02-26 | 28.666 |
| 1999-02-27 | 28.694 |
| 1999-02-28 | 28.823 |
| 1999-03-01 | 28.8 |
| 1999-03-02 | 28.82 |
| 1999-03-03 | 28.885 |
| 1999-03-04 | 28.814 |
| 1999-03-05 | 28.633 |
| 1999-03-06 | 28.591 |
| 1999-03-07 | 28.534 |
| 1999-03-08 | 28.335 |
| 1999-03-09 | 28.177 |
| 1999-03-10 | 27.916 |
| 1999-03-11 | 27.583 |
| 1999-03-12 | 27.316 |
| 1999-03-13 | 27.31 |
| 1999-03-14 | 27.182 |
| 1999-03-15 | 27.085 |
| 1999-03-16 | 26.992 |
| 1999-03-17 | 26.928 |
| 1999-03-18 | 26.677 |
| 1999-03-19 | 26.389 |
| 1999-03-20 | 26.196 |
| 1999-03-21 | 26.04 |
| 1999-03-22 | 25.991 |
| 1999-03-23 | 26.049 |
| 1999-03-24 | 26.082 |
| 1999-03-25 | 25.984 |
| 1999-03-26 | 25.84 |
| 1999-03-27 | 25.737 |
| 1999-03-28 | 25.629 |
| 1999-03-29 | 25.53 |
| 1999-03-30 | 25.403 |
| 1999-03-31 | 25.17 |
| 1999-04-01 | 24.845 |
| 1999-04-02 | 24.645 |
| 1999-04-03 | 24.544 |
| 1999-04-04 | 24.568 |
| 1999-04-05 | 24.45 |
| 1999-04-06 | 24.364 |
| 1999-04-07 | 24.281 |
| 1999-04-08 | 24.166 |
| 1999-04-09 | 24.022 |
| 1999-04-10 | 24.004 |
| 1999-04-11 | 23.961 |
| 1999-04-12 | 23.859 |
| 1999-04-13 | 23.805 |
| 1999-04-14 | 23.791 |
| 1999-04-15 | 23.733 |
| 1999-04-16 | 23.653 |
| 1999-04-17 | 23.629 |
| 1999-04-18 | 23.593 |
| 1999-04-19 | 23.734 |
| 1999-04-20 | 23.796 |
| 1999-04-21 | 23.715 |
| 1999-04-22 | 23.494 |
| 1999-04-23 | 23.311 |
| 1999-04-24 | 23.26 |
| 1999-04-25 | 23.219 |
| 1999-04-26 | 23.235 |
| 1999-04-27 | 23.24 |
| 1999-04-28 | 23.281 |
| 1999-04-29 | 23.392 |
| 1999-04-30 | 23.479 |
| 1999-05-01 | 23.55 |
| 1999-05-02 | 23.55 |
| 1999-05-03 | 23.578 |
| 1999-05-04 | 23.671 |
| 1999-05-05 | 23.807 |
| 1999-05-06 | 24.025 |
| 1999-05-07 | 24.141 |
| 1999-05-08 | 24.215 |
| 1999-05-09 | 24.337 |
| 1999-05-10 | 24.446 |
| 1999-05-11 | 24.499 |
| 1999-05-12 | 24.69 |
| 1999-05-13 | 24.794 |
| 1999-05-14 | 24.881 |
| 1999-05-15 | 24.927 |
| 1999-05-16 | 24.978 |
| 1999-05-17 | 25.088 |
| 1999-05-18 | 25.186 |
| 1999-05-19 | 25.125 |
| 1999-05-20 | 25.1 |
| 1999-05-21 | 25.15 |
| 1999-05-22 | 25.27 |
| 1999-05-23 | 25.396 |
| 1999-05-24 | 25.501 |
| 1999-05-25 | 25.656 |
| 1999-05-26 | 25.84 |
| 1999-05-27 | 26.056 |
| 1999-05-28 | 26.101 |
| 1999-05-29 | 26.15 |
| 1999-05-30 | 26.204 |
| 1999-05-31 | 26.204 |
| 1999-06-01 | 26.224 |
| 1999-06-02 | 26.322 |
| 1999-06-03 | 26.35 |
| 1999-06-04 | 26.266 |
| 1999-06-05 | 26.207 |
| 1999-06-06 | 26.252 |
| 1999-06-07 | 26.128 |
| 1999-06-08 | 26.028 |
| 1999-06-09 | 25.899 |
| 1999-06-10 | 25.884 |
| 1999-06-11 | 25.873 |
| 1999-06-12 | 25.916 |
| 1999-06-13 | 25.866 |
| 1999-06-14 | 25.899 |
| 1999-06-15 | 25.899 |
| 1999-06-16 | 25.667 |
| 1999-06-17 | 25.414 |
| 1999-06-18 | 25.255 |
| 1999-06-19 | 25.295 |
| 1999-06-20 | 25.342 |
| 1999-06-21 | 25.165 |
| 1999-06-22 | 25 |
| 1999-06-23 | 24.7 |
| 1999-06-24 | 24.422 |
| 1999-06-25 | 24.146 |
| 1999-06-26 | 23.947 |
| 1999-06-27 | 23.871 |
| 1999-06-28 | 23.809 |
| 1999-06-29 | 23.747 |
| 1999-06-30 | 23.626 |
| 1999-07-01 | 23.311 |
| 1999-07-02 | 22.968 |
| 1999-07-03 | 22.814 |
| 1999-07-04 | 22.783 |
| 1999-07-05 | 22.783 |
| 1999-07-06 | 22.686 |
| 1999-07-07 | 22.522 |
| 1999-07-08 | 22.342 |
| 1999-07-09 | 22.06 |
| 1999-07-10 | 21.896 |
| 1999-07-11 | 21.686 |
| 1999-07-12 | 21.588 |
| 1999-07-13 | 21.51 |
| 1999-07-14 | 21.186 |
| 1999-07-15 | 20.842 |
| 1999-07-16 | 20.605 |
| 1999-07-17 | 20.538 |
| 1999-07-18 | 20.474 |
| 1999-07-19 | 20.403 |
| 1999-07-20 | 20.47 |
| 1999-07-21 | 20.453 |
| 1999-07-22 | 20.517 |
| 1999-07-23 | 20.612 |
| 1999-07-24 | 20.49 |
| 1999-07-25 | 20.423 |
| 1999-07-26 | 20.651 |
| 1999-07-27 | 20.774 |
| 1999-07-28 | 20.784 |
| 1999-07-29 | 20.88 |
| 1999-07-30 | 21.049 |
| 1999-07-31 | 21.117 |
| 1999-08-01 | 21.246 |
| 1999-08-02 | 21.464 |
| 1999-08-03 | 21.692 |
| 1999-08-04 | 21.952 |
| 1999-08-05 | 22.237 |
| 1999-08-06 | 22.521 |
| 1999-08-07 | 22.63 |
| 1999-08-08 | 22.863 |
| 1999-08-09 | 23.092 |
| 1999-08-10 | 23.335 |
| 1999-08-11 | 23.593 |
| 1999-08-12 | 23.824 |
| 1999-08-13 | 23.942 |
| 1999-08-14 | 24.192 |
| 1999-08-15 | 24.531 |
| 1999-08-16 | 24.461 |
| 1999-08-17 | 24.335 |
| 1999-08-18 | 24.527 |
| 1999-08-19 | 24.645 |
| 1999-08-20 | 24.713 |
| 1999-08-21 | 24.792 |
| 1999-08-22 | 24.866 |
| 1999-08-23 | 24.755 |
| 1999-08-24 | 24.648 |
| 1999-08-25 | 24.465 |
| 1999-08-26 | 24.374 |
| 1999-08-27 | 24.327 |
| 1999-08-28 | 24.318 |
| 1999-08-29 | 24.302 |
| 1999-08-30 | 24.318 |
| 1999-08-31 | 24.324 |
| 1999-09-01 | 24.203 |
| 1999-09-02 | 24.124 |
| 1999-09-03 | 23.832 |
| 1999-09-04 | 23.68 |
| 1999-09-05 | 23.534 |
| 1999-09-06 | 23.534 |
| 1999-09-07 | 23.53 |
| 1999-09-08 | 23.347 |
| 1999-09-09 | 23.088 |
| 1999-09-10 | 22.928 |
| 1999-09-11 | 22.823 |
| 1999-09-12 | 22.85 |
| 1999-09-13 | 22.852 |
| 1999-09-14 | 22.896 |
| 1999-09-15 | 22.967 |
| 1999-09-16 | 23.137 |
| 1999-09-17 | 23.137 |
| 1999-09-18 | 23.074 |
| 1999-09-19 | 23.081 |
| 1999-09-20 | 23.128 |
| 1999-09-21 | 23.249 |
| 1999-09-22 | 23.374 |
| 1999-09-23 | 23.633 |
| 1999-09-24 | 23.959 |
| 1999-09-25 | 24.096 |
| 1999-09-26 | 24.215 |
| 1999-09-27 | 24.324 |
| 1999-09-28 | 24.407 |
| 1999-09-29 | 24.496 |
| 1999-09-30 | 24.541 |
| 1999-10-01 | 24.637 |
| 1999-10-02 | 24.642 |
| 1999-10-03 | 24.835 |
| 1999-10-04 | 24.816 |
| 1999-10-05 | 24.815 |
| 1999-10-06 | 24.69 |
| 1999-10-07 | 24.696 |
| 1999-10-08 | 24.545 |
| 1999-10-09 | 24.618 |
| 1999-10-10 | 24.747 |
| 1999-10-11 | 24.551 |
| 1999-10-12 | 24.473 |
| 1999-10-13 | 24.613 |
| 1999-10-14 | 24.716 |
| 1999-10-15 | 24.907 |
| 1999-10-16 | 24.89 |
| 1999-10-17 | 24.97 |
| 1999-10-18 | 25.123 |
| 1999-10-19 | 25.189 |
| 1999-10-20 | 25.183 |
| 1999-10-21 | 25.109 |
| 1999-10-22 | 24.947 |
| 1999-10-23 | 24.81 |
| 1999-10-24 | 24.66 |
| 1999-10-25 | 24.61 |
| 1999-10-26 | 24.594 |
| 1999-10-27 | 24.494 |
| 1999-10-28 | 24.28 |
| 1999-10-29 | 24.085 |
| 1999-10-30 | 24.021 |
| 1999-10-31 | 23.976 |
| 1999-11-01 | 23.886 |
| 1999-11-02 | 23.85 |
| 1999-11-03 | 23.791 |
| 1999-11-04 | 23.71 |
| 1999-11-05 | 23.692 |
| 1999-11-06 | 23.697 |
| 1999-11-07 | 23.858 |
| 1999-11-08 | 23.763 |
| 1999-11-09 | 23.715 |
| 1999-11-10 | 23.789 |
| 1999-11-11 | 23.754 |
| 1999-11-12 | 23.558 |
| 1999-11-13 | 23.439 |
| 1999-11-14 | 23.173 |
| 1999-11-15 | 23.153 |
| 1999-11-16 | 23.043 |
| 1999-11-17 | 22.714 |
| 1999-11-18 | 22.405 |
| 1999-11-19 | 22.187 |
| 1999-11-20 | 22.1 |
| 1999-11-21 | 22.123 |
| 1999-11-22 | 22.021 |
| 1999-11-23 | 21.975 |
| 1999-11-24 | 21.823 |
| 1999-11-25 | 21.707 |
| 1999-11-26 | 21.618 |
| 1999-11-27 | 21.632 |
| 1999-11-28 | 21.602 |
| 1999-11-29 | 21.7 |
| 1999-11-30 | 21.818 |
| 1999-12-01 | 21.825 |
| 1999-12-02 | 21.761 |
| 1999-12-03 | 21.579 |
| 1999-12-04 | 21.508 |
| 1999-12-05 | 21.499 |
| 1999-12-06 | 21.454 |
| 1999-12-07 | 21.436 |
| 1999-12-08 | 21.407 |
| 1999-12-09 | 21.335 |
| 1999-12-10 | 21.298 |
| 1999-12-11 | 21.259 |
| 1999-12-12 | 21.238 |
| 1999-12-13 | 21.262 |
| 1999-12-14 | 21.348 |
| 1999-12-15 | 21.314 |
| 1999-12-16 | 21.37 |
| 1999-12-17 | 21.389 |
| 1999-12-18 | 21.47 |
| 1999-12-19 | 21.595 |
| 1999-12-20 | 21.704 |
| 1999-12-21 | 21.75 |
| 1999-12-22 | 21.866 |
| 1999-12-23 | 21.872 |
| 1999-12-24 | 21.953 |
| 1999-12-25 | 21.953 |
| 1999-12-26 | 21.933 |
| 1999-12-27 | 21.99 |
| 1999-12-28 | 22.036 |
| 1999-12-29 | 22.013 |
| 1999-12-30 | 22.041 |
| 1999-12-31 | 22.156 |
| 2000-01-01 | 22.175 |
| 2000-01-02 | 22.325 |
| 2000-01-03 | 22.42 |
| 2000-01-04 | 22.638 |
| 2000-01-05 | 22.916 |
| 2000-01-06 | 23.137 |
| 2000-01-07 | 23.159 |
| 2000-01-08 | 23.258 |
| 2000-01-09 | 23.351 |
| 2000-01-10 | 23.269 |
| 2000-01-11 | 23.232 |
| 2000-01-12 | 23.286 |
| 2000-01-13 | 23.221 |
| 2000-01-14 | 23.109 |
| 2000-01-15 | 23.168 |
| 2000-01-16 | 23.264 |
| 2000-01-17 | 23.264 |
| 2000-01-18 | 23.176 |
| 2000-01-19 | 23.073 |
| 2000-01-20 | 23.027 |
| 2000-01-21 | 22.947 |
| 2000-01-22 | 23.043 |
| 2000-01-23 | 23.043 |
| 2000-01-24 | 23.094 |
| 2000-01-25 | 23.091 |
| 2000-01-26 | 23.089 |
| 2000-01-27 | 23.116 |
| 2000-01-28 | 23.261 |
| 2000-01-29 | 23.186 |
| 2000-01-30 | 23.11 |
| 2000-01-31 | 23.202 |
| 2000-02-01 | 23.214 |
| 2000-02-02 | 23.162 |
| 2000-02-03 | 22.924 |
| 2000-02-04 | 22.692 |
| 2000-02-05 | 22.54 |
| 2000-02-06 | 22.583 |
| 2000-02-07 | 22.594 |
| 2000-02-08 | 22.53 |
| 2000-02-09 | 22.586 |
| 2000-02-10 | 22.613 |
| 2000-02-11 | 22.689 |
| 2000-02-12 | 22.738 |
| 2000-02-13 | 22.899 |
| 2000-02-14 | 22.973 |
| 2000-02-15 | 22.971 |
| 2000-02-16 | 22.995 |
| 2000-02-17 | 23.071 |
| 2000-02-18 | 23.266 |
| 2000-02-19 | 23.338 |
| 2000-02-20 | 23.464 |
| 2000-02-21 | 23.464 |
| 2000-02-22 | 23.578 |
| 2000-02-23 | 23.57 |
| 2000-02-24 | 23.634 |
| 2000-02-25 | 23.738 |
| 2000-02-26 | 23.748 |
| 2000-02-27 | 23.622 |
| 2000-02-28 | 23.675 |
| 2000-02-29 | 23.66 |
| 2000-03-01 | 23.502 |
| 2000-03-02 | 23.389 |
| 2000-03-03 | 23.202 |
| 2000-03-04 | 23.262 |
| 2000-03-05 | 23.353 |
| 2000-03-06 | 23.26 |
| 2000-03-07 | 23.31 |
| 2000-03-08 | 23.359 |
| 2000-03-09 | 23.405 |
| 2000-03-10 | 23.326 |
| 2000-03-11 | 23.338 |
| 2000-03-12 | 23.282 |
| 2000-03-13 | 23.26 |
| 2000-03-14 | 23.315 |
| 2000-03-15 | 23.218 |
| 2000-03-16 | 23.115 |
| 2000-03-17 | 23.061 |
| 2000-03-18 | 23.056 |
| 2000-03-19 | 22.901 |
| 2000-03-20 | 22.904 |
| 2000-03-21 | 22.846 |
| 2000-03-22 | 22.785 |
| 2000-03-23 | 22.621 |
| 2000-03-24 | 22.595 |
| 2000-03-25 | 22.51 |
| 2000-03-26 | 22.375 |
| 2000-03-27 | 22.478 |
| 2000-03-28 | 22.586 |
| 2000-03-29 | 22.56 |
| 2000-03-30 | 22.655 |
| 2000-03-31 | 22.767 |
| 2000-04-01 | 22.849 |
| 2000-04-02 | 23.031 |
| 2000-04-03 | 23.078 |
| 2000-04-04 | 23.262 |
| 2000-04-05 | 23.576 |
| 2000-04-06 | 23.705 |
| 2000-04-07 | 23.731 |
| 2000-04-08 | 23.803 |
| 2000-04-09 | 23.932 |
| 2000-04-10 | 24.03 |
| 2000-04-11 | 24.176 |
| 2000-04-12 | 24.455 |
| 2000-04-13 | 24.681 |
| 2000-04-14 | 25.188 |
| 2000-04-15 | 25.399 |
| 2000-04-16 | 25.55 |
| 2000-04-17 | 25.712 |
| 2000-04-18 | 25.73 |
| 2000-04-19 | 25.915 |
| 2000-04-20 | 26.104 |
| 2000-04-21 | 26.323 |
| 2000-04-22 | 26.526 |
| 2000-04-23 | 26.696 |
| 2000-04-24 | 26.73 |
| 2000-04-25 | 26.659 |
| 2000-04-26 | 26.775 |
| 2000-04-27 | 26.838 |
| 2000-04-28 | 26.938 |
| 2000-04-29 | 27.012 |
| 2000-04-30 | 27.164 |
| 2000-05-01 | 27.1 |
| 2000-05-02 | 27.167 |
| 2000-05-03 | 27.529 |
| 2000-05-04 | 27.702 |
| 2000-05-05 | 27.66 |
| 2000-05-06 | 27.686 |
| 2000-05-07 | 27.859 |
| 2000-05-08 | 27.876 |
| 2000-05-09 | 27.927 |
| 2000-05-10 | 28.111 |
| 2000-05-11 | 28.136 |
| 2000-05-12 | 27.996 |
| 2000-05-13 | 27.926 |
| 2000-05-14 | 27.633 |
| 2000-05-15 | 27.494 |
| 2000-05-16 | 27.344 |
| 2000-05-17 | 27.108 |
| 2000-05-18 | 27.005 |
| 2000-05-19 | 26.93 |
| 2000-05-20 | 26.984 |
| 2000-05-21 | 26.984 |
| 2000-05-22 | 26.937 |
| 2000-05-23 | 26.888 |
| 2000-05-24 | 26.75 |
| 2000-05-25 | 26.72 |
| 2000-05-26 | 26.606 |
| 2000-05-27 | 26.626 |
| 2000-05-28 | 26.647 |
| 2000-05-29 | 26.647 |
| 2000-05-30 | 26.503 |
| 2000-05-31 | 26.397 |
| 2000-06-01 | 26.104 |
| 2000-06-02 | 25.621 |
| 2000-06-03 | 25.364 |
| 2000-06-04 | 25.249 |
| 2000-06-05 | 25.122 |
| 2000-06-06 | 25.024 |
| 2000-06-07 | 24.751 |
| 2000-06-08 | 24.458 |
| 2000-06-09 | 24.09 |
| 2000-06-10 | 23.906 |
| 2000-06-11 | 23.794 |
| 2000-06-12 | 23.72 |
| 2000-06-13 | 23.622 |
| 2000-06-14 | 23.461 |
| 2000-06-15 | 23.287 |
| 2000-06-16 | 23.121 |
| 2000-06-17 | 23.08 |
| 2000-06-18 | 22.955 |
| 2000-06-19 | 22.839 |
| 2000-06-20 | 22.746 |
| 2000-06-21 | 22.489 |
| 2000-06-22 | 22.305 |
| 2000-06-23 | 22.21 |
| 2000-06-24 | 22.092 |
| 2000-06-25 | 21.967 |
| 2000-06-26 | 21.991 |
| 2000-06-27 | 21.982 |
| 2000-06-28 | 21.905 |
| 2000-06-29 | 21.727 |
| 2000-06-30 | 21.54 |
| 2000-07-01 | 21.501 |
| 2000-07-02 | 21.502 |
| 2000-07-03 | 21.422 |
| 2000-07-04 | 21.422 |
| 2000-07-05 | 21.349 |
| 2000-07-06 | 21.248 |
| 2000-07-07 | 21.093 |
| 2000-07-08 | 21.009 |
| 2000-07-09 | 20.949 |
| 2000-07-10 | 20.918 |
| 2000-07-11 | 20.88 |
| 2000-07-12 | 20.771 |
| 2000-07-13 | 20.693 |
| 2000-07-14 | 20.59 |
| 2000-07-15 | 20.586 |
| 2000-07-16 | 20.59 |
| 2000-07-17 | 20.533 |
| 2000-07-18 | 20.496 |
| 2000-07-19 | 20.449 |
| 2000-07-20 | 20.357 |
| 2000-07-21 | 20.277 |
| 2000-07-22 | 20.191 |
| 2000-07-23 | 20.078 |
| 2000-07-24 | 20.07 |
| 2000-07-25 | 20.038 |
| 2000-07-26 | 19.905 |
| 2000-07-27 | 19.8 |
| 2000-07-28 | 19.827 |
| 2000-07-29 | 19.833 |
| 2000-07-30 | 19.848 |
| 2000-07-31 | 19.893 |
| 2000-08-01 | 19.924 |
| 2000-08-02 | 19.932 |
| 2000-08-03 | 19.935 |
| 2000-08-04 | 19.82 |
| 2000-08-05 | 19.766 |
| 2000-08-06 | 19.794 |
| 2000-08-07 | 19.757 |
| 2000-08-08 | 19.713 |
| 2000-08-09 | 19.661 |
| 2000-08-10 | 19.619 |
| 2000-08-11 | 19.552 |
| 2000-08-12 | 19.529 |
| 2000-08-13 | 19.54 |
| 2000-08-14 | 19.46 |
| 2000-08-15 | 19.393 |
| 2000-08-16 | 19.328 |
| 2000-08-17 | 19.225 |
| 2000-08-18 | 19.107 |
| 2000-08-19 | 19.115 |
| 2000-08-20 | 19.124 |
| 2000-08-21 | 19.039 |
| 2000-08-22 | 18.968 |
| 2000-08-23 | 18.852 |
| 2000-08-24 | 18.745 |
| 2000-08-25 | 18.603 |
| 2000-08-26 | 18.555 |
| 2000-08-27 | 18.441 |
| 2000-08-28 | 18.35 |
| 2000-08-29 | 18.284 |
| 2000-08-30 | 18.145 |
| 2000-08-31 | 17.977 |
| 2000-09-01 | 17.865 |
| 2000-09-02 | 17.763 |
| 2000-09-03 | 17.72 |
| 2000-09-04 | 17.72 |
| 2000-09-05 | 17.82 |
| 2000-09-06 | 17.904 |
| 2000-09-07 | 17.934 |
| 2000-09-08 | 17.9 |
| 2000-09-09 | 17.835 |
| 2000-09-10 | 17.798 |
| 2000-09-11 | 17.828 |
| 2000-09-12 | 17.864 |
| 2000-09-13 | 17.885 |
| 2000-09-14 | 17.899 |
| 2000-09-15 | 17.922 |
| 2000-09-16 | 17.944 |
| 2000-09-17 | 17.992 |
| 2000-09-18 | 18.104 |
| 2000-09-19 | 18.173 |
| 2000-09-20 | 18.296 |
| 2000-09-21 | 18.425 |
| 2000-09-22 | 18.585 |
| 2000-09-23 | 18.662 |
| 2000-09-24 | 18.774 |
| 2000-09-25 | 18.906 |
| 2000-09-26 | 19.048 |
| 2000-09-27 | 19.292 |
| 2000-09-28 | 19.415 |
| 2000-09-29 | 19.552 |
| 2000-09-30 | 19.688 |
| 2000-10-01 | 19.801 |
| 2000-10-02 | 19.873 |
| 2000-10-03 | 19.967 |
| 2000-10-04 | 20.038 |
| 2000-10-05 | 20.093 |
| 2000-10-06 | 20.18 |
| 2000-10-07 | 20.217 |
| 2000-10-08 | 20.304 |
| 2000-10-09 | 20.481 |
| 2000-10-10 | 20.68 |
| 2000-10-11 | 21.052 |
| 2000-10-12 | 21.594 |
| 2000-10-13 | 22.015 |
| 2000-10-14 | 22.194 |
| 2000-10-15 | 22.378 |
| 2000-10-16 | 22.588 |
| 2000-10-17 | 22.827 |
| 2000-10-18 | 23.212 |
| 2000-10-19 | 23.464 |
| 2000-10-20 | 23.66 |
| 2000-10-21 | 23.826 |
| 2000-10-22 | 23.98 |
| 2000-10-23 | 24.014 |
| 2000-10-24 | 24.026 |
| 2000-10-25 | 24.264 |
| 2000-10-26 | 24.57 |
| 2000-10-27 | 24.789 |
| 2000-10-28 | 25.042 |
| 2000-10-29 | 25.265 |
| 2000-10-30 | 25.275 |
| 2000-10-31 | 25.2 |
| 2000-11-01 | 25.339 |
| 2000-11-02 | 25.433 |
| 2000-11-03 | 25.53 |
| 2000-11-04 | 25.744 |
| 2000-11-05 | 25.896 |
| 2000-11-06 | 25.83 |
| 2000-11-07 | 25.788 |
| 2000-11-08 | 25.863 |
| 2000-11-09 | 25.969 |
| 2000-11-10 | 26.058 |
| 2000-11-11 | 25.846 |
| 2000-11-12 | 25.759 |
| 2000-11-13 | 25.916 |
| 2000-11-14 | 25.956 |
| 2000-11-15 | 25.927 |
| 2000-11-16 | 25.8 |
| 2000-11-17 | 25.623 |
| 2000-11-18 | 25.648 |
| 2000-11-19 | 25.718 |
| 2000-11-20 | 25.8 |
| 2000-11-21 | 25.837 |
| 2000-11-22 | 25.975 |
| 2000-11-23 | 26.055 |
| 2000-11-24 | 26.024 |
| 2000-11-25 | 25.894 |
| 2000-11-26 | 25.864 |
| 2000-11-27 | 25.917 |
| 2000-11-28 | 26 |
| 2000-11-29 | 26.096 |
| 2000-11-30 | 26.383 |
| 2000-12-01 | 26.535 |
| 2000-12-02 | 26.666 |
| 2000-12-03 | 26.824 |
| 2000-12-04 | 26.871 |
| 2000-12-05 | 26.782 |
| 2000-12-06 | 26.808 |
| 2000-12-07 | 26.829 |
| 2000-12-08 | 26.674 |
| 2000-12-09 | 26.648 |
| 2000-12-10 | 26.548 |
| 2000-12-11 | 26.397 |
| 2000-12-12 | 26.324 |
| 2000-12-13 | 26.066 |
| 2000-12-14 | 25.973 |
| 2000-12-15 | 25.992 |
| 2000-12-16 | 26.039 |
| 2000-12-17 | 26.104 |
| 2000-12-18 | 26.184 |
| 2000-12-19 | 26.23 |
| 2000-12-20 | 26.436 |
| 2000-12-21 | 26.58 |
| 2000-12-22 | 26.573 |
| 2000-12-23 | 26.573 |
| 2000-12-24 | 26.602 |
| 2000-12-25 | 26.602 |
| 2000-12-26 | 26.703 |
| 2000-12-27 | 26.76 |
| 2000-12-28 | 26.71 |
| 2000-12-29 | 26.679 |
| 2000-12-30 | 26.53 |
| 2000-12-31 | 26.481 |
| 2001-01-01 | 26.481 |
| 2001-01-02 | 26.656 |
| 2001-01-03 | 26.597 |
| 2001-01-04 | 26.696 |
| 2001-01-05 | 26.876 |
| 2001-01-06 | 26.957 |
| 2001-01-07 | 27.209 |
| 2001-01-08 | 27.348 |
| 2001-01-09 | 27.38 |
| 2001-01-10 | 27.544 |
| 2001-01-11 | 27.59 |
| 2001-01-12 | 27.636 |
| 2001-01-13 | 27.783 |
| 2001-01-14 | 27.851 |
| 2001-01-15 | 27.851 |
| 2001-01-16 | 27.716 |
| 2001-01-17 | 27.57 |
| 2001-01-18 | 27.37 |
| 2001-01-19 | 26.923 |
| 2001-01-20 | 26.771 |
| 2001-01-21 | 26.725 |
| 2001-01-22 | 26.532 |
| 2001-01-23 | 26.271 |
| 2001-01-24 | 26.058 |
| 2001-01-25 | 25.754 |
| 2001-01-26 | 25.475 |
| 2001-01-27 | 25.418 |
| 2001-01-28 | 25.338 |
| 2001-01-29 | 25.195 |
| 2001-01-30 | 25.063 |
| 2001-01-31 | 24.919 |
| 2001-02-01 | 24.522 |
| 2001-02-02 | 24.3 |
| 2001-02-03 | 24.167 |
| 2001-02-04 | 23.93 |
| 2001-02-05 | 23.843 |
| 2001-02-06 | 23.754 |
| 2001-02-07 | 23.365 |
| 2001-02-08 | 23.054 |
| 2001-02-09 | 22.827 |
| 2001-02-10 | 22.679 |
| 2001-02-11 | 22.58 |
| 2001-02-12 | 22.547 |
| 2001-02-13 | 22.491 |
| 2001-02-14 | 22.447 |
| 2001-02-15 | 22.219 |
| 2001-02-16 | 22.091 |
| 2001-02-17 | 22.03 |
| 2001-02-18 | 21.97 |
| 2001-02-19 | 21.97 |
| 2001-02-20 | 22.1 |
| 2001-02-21 | 22.219 |
| 2001-02-22 | 22.466 |
| 2001-02-23 | 22.712 |
| 2001-02-24 | 22.716 |
| 2001-02-25 | 22.724 |
| 2001-02-26 | 22.859 |
| 2001-02-27 | 23.032 |
| 2001-02-28 | 23.305 |
| 2001-03-01 | 23.568 |
| 2001-03-02 | 23.825 |
| 2001-03-03 | 23.934 |
| 2001-03-04 | 24.038 |
| 2001-03-05 | 24.192 |
| 2001-03-06 | 24.273 |
| 2001-03-07 | 24.365 |
| 2001-03-08 | 24.475 |
| 2001-03-09 | 24.663 |
| 2001-03-10 | 24.823 |
| 2001-03-11 | 24.97 |
| 2001-03-12 | 25.238 |
| 2001-03-13 | 25.348 |
| 2001-03-14 | 25.714 |
| 2001-03-15 | 26.056 |
| 2001-03-16 | 26.456 |
| 2001-03-17 | 26.765 |
| 2001-03-18 | 27.009 |
| 2001-03-19 | 27.148 |
| 2001-03-20 | 27.33 |
| 2001-03-21 | 27.539 |
| 2001-03-22 | 27.909 |
| 2001-03-23 | 28.123 |
| 2001-03-24 | 28.188 |
| 2001-03-25 | 28.237 |
| 2001-03-26 | 28.275 |
| 2001-03-27 | 28.219 |
| 2001-03-28 | 28.362 |
| 2001-03-29 | 28.484 |
| 2001-03-30 | 28.497 |
| 2001-03-31 | 28.517 |
| 2001-04-01 | 28.571 |
| 2001-04-02 | 28.697 |
| 2001-04-03 | 28.97 |
| 2001-04-04 | 29.286 |
| 2001-04-05 | 29.47 |
| 2001-04-06 | 29.815 |
| 2001-04-07 | 30.078 |
| 2001-04-08 | 30.301 |
| 2001-04-09 | 30.377 |
| 2001-04-10 | 30.335 |
| 2001-04-11 | 30.25 |
| 2001-04-12 | 30.185 |
| 2001-04-13 | 30.212 |
| 2001-04-14 | 30.295 |
| 2001-04-15 | 30.315 |
| 2001-04-16 | 30.116 |
| 2001-04-17 | 29.901 |
| 2001-04-18 | 29.632 |
| 2001-04-19 | 29.309 |
| 2001-04-20 | 28.997 |
| 2001-04-21 | 28.804 |
| 2001-04-22 | 28.718 |
| 2001-04-23 | 28.69 |
| 2001-04-24 | 28.68 |
| 2001-04-25 | 28.602 |
| 2001-04-26 | 28.551 |
| 2001-04-27 | 28.334 |
| 2001-04-28 | 28.292 |
| 2001-04-29 | 28.274 |
| 2001-04-30 | 28.134 |
| 2001-05-01 | 27.947 |
| 2001-05-02 | 27.614 |
| 2001-05-03 | 27.189 |
| 2001-05-04 | 26.705 |
| 2001-05-05 | 26.543 |
| 2001-05-06 | 26.272 |
| 2001-05-07 | 26.202 |
| 2001-05-08 | 26.118 |
| 2001-05-09 | 25.758 |
| 2001-05-10 | 25.499 |
| 2001-05-11 | 25.264 |
| 2001-05-12 | 25.222 |
| 2001-05-13 | 25.222 |
| 2001-05-14 | 25.176 |
| 2001-05-15 | 25.109 |
| 2001-05-16 | 24.907 |
| 2001-05-17 | 24.719 |
| 2001-05-18 | 24.587 |
| 2001-05-19 | 24.608 |
| 2001-05-20 | 24.569 |
| 2001-05-21 | 24.388 |
| 2001-05-22 | 24.25 |
| 2001-05-23 | 23.973 |
| 2001-05-24 | 23.613 |
| 2001-05-25 | 23.304 |
| 2001-05-26 | 23.178 |
| 2001-05-27 | 23.135 |
| 2001-05-28 | 23.135 |
| 2001-05-29 | 23.088 |
| 2001-05-30 | 22.959 |
| 2001-05-31 | 22.884 |
| 2001-06-01 | 22.759 |
| 2001-06-02 | 22.607 |
| 2001-06-03 | 22.539 |
| 2001-06-04 | 22.481 |
| 2001-06-05 | 22.343 |
| 2001-06-06 | 22.13 |
| 2001-06-07 | 21.903 |
| 2001-06-08 | 21.692 |
| 2001-06-09 | 21.576 |
| 2001-06-10 | 21.473 |
| 2001-06-11 | 21.434 |
| 2001-06-12 | 21.4 |
| 2001-06-13 | 21.266 |
| 2001-06-14 | 21.238 |
| 2001-06-15 | 21.281 |
| 2001-06-16 | 21.272 |
| 2001-06-17 | 21.274 |
| 2001-06-18 | 21.369 |
| 2001-06-19 | 21.415 |
| 2001-06-20 | 21.46 |
| 2001-06-21 | 21.367 |
| 2001-06-22 | 21.269 |
| 2001-06-23 | 21.303 |
| 2001-06-24 | 21.341 |
| 2001-06-25 | 21.307 |
| 2001-06-26 | 21.302 |
| 2001-06-27 | 21.283 |
| 2001-06-28 | 21.186 |
| 2001-06-29 | 21.018 |
| 2001-06-30 | 20.94 |
| 2001-07-01 | 20.908 |
| 2001-07-02 | 20.806 |
| 2001-07-03 | 20.72 |
| 2001-07-04 | 20.689 |
| 2001-07-05 | 20.713 |
| 2001-07-06 | 20.772 |
| 2001-07-07 | 20.827 |
| 2001-07-08 | 20.875 |
| 2001-07-09 | 20.955 |
| 2001-07-10 | 21.064 |
| 2001-07-11 | 21.222 |
| 2001-07-12 | 21.288 |
| 2001-07-13 | 21.273 |
| 2001-07-14 | 21.181 |
| 2001-07-15 | 21.095 |
| 2001-07-16 | 21.186 |
| 2001-07-17 | 21.254 |
| 2001-07-18 | 21.274 |
| 2001-07-19 | 21.282 |
| 2001-07-20 | 21.312 |
| 2001-07-21 | 21.409 |
| 2001-07-22 | 21.482 |
| 2001-07-23 | 21.595 |
| 2001-07-24 | 21.769 |
| 2001-07-25 | 21.927 |
| 2001-07-26 | 22.013 |
| 2001-07-27 | 22.067 |
| 2001-07-28 | 22.17 |
| 2001-07-29 | 22.333 |
| 2001-07-30 | 22.351 |
| 2001-07-31 | 22.316 |
| 2001-08-01 | 22.402 |
| 2001-08-02 | 22.458 |
| 2001-08-03 | 22.341 |
| 2001-08-04 | 22.448 |
| 2001-08-05 | 22.489 |
| 2001-08-06 | 22.46 |
| 2001-08-07 | 22.395 |
| 2001-08-08 | 22.387 |
| 2001-08-09 | 22.319 |
| 2001-08-10 | 22.162 |
| 2001-08-11 | 22.165 |
| 2001-08-12 | 22.216 |
| 2001-08-13 | 22.131 |
| 2001-08-14 | 22.056 |
| 2001-08-15 | 21.965 |
| 2001-08-16 | 21.916 |
| 2001-08-17 | 21.927 |
| 2001-08-18 | 21.9 |
| 2001-08-19 | 21.878 |
| 2001-08-20 | 21.925 |
| 2001-08-21 | 22.037 |
| 2001-08-22 | 21.978 |
| 2001-08-23 | 21.841 |
| 2001-08-24 | 21.646 |
| 2001-08-25 | 21.581 |
| 2001-08-26 | 21.56 |
| 2001-08-27 | 21.513 |
| 2001-08-28 | 21.535 |
| 2001-08-29 | 21.55 |
| 2001-08-30 | 21.723 |
| 2001-08-31 | 21.921 |
| 2001-09-01 | 22.008 |
| 2001-09-02 | 22.114 |
| 2001-09-03 | 22.114 |
| 2001-09-04 | 22.292 |
| 2001-09-05 | 22.504 |
| 2001-09-06 | 22.866 |
| 2001-09-07 | 23.279 |
| 2001-09-08 | 23.356 |
| 2001-09-09 | 23.503 |
| 2001-09-10 | 23.92 |
| 2001-09-11 | 23.92 |
| 2001-09-12 | 24.104 |
| 2001-09-13 | 24.306 |
| 2001-09-14 | 24.505 |
| 2001-09-15 | 24.691 |
| 2001-09-16 | 24.747 |
| 2001-09-17 | 25.811 |
| 2001-09-18 | 26.579 |
| 2001-09-19 | 27.619 |
| 2001-09-20 | 28.757 |
| 2001-09-21 | 29.946 |
| 2001-09-22 | 30.429 |
| 2001-09-23 | 31.143 |
| 2001-09-24 | 31.556 |
| 2001-09-25 | 31.806 |
| 2001-09-26 | 32.671 |
| 2001-09-27 | 33.377 |
| 2001-09-28 | 33.901 |
| 2001-09-29 | 34.431 |
| 2001-09-30 | 35.065 |
| 2001-10-01 | 34.894 |
| 2001-10-02 | 34.675 |
| 2001-10-03 | 34.49 |
| 2001-10-04 | 34.83 |
| 2001-10-05 | 35.221 |
| 2001-10-06 | 35.61 |
| 2001-10-07 | 35.899 |
| 2001-10-08 | 35.853 |
| 2001-10-09 | 35.796 |
| 2001-10-10 | 35.783 |
| 2001-10-11 | 35.557 |
| 2001-10-12 | 35.543 |
| 2001-10-13 | 35.543 |
| 2001-10-14 | 35.543 |
| 2001-10-15 | 35.532 |
| 2001-10-16 | 35.411 |
| 2001-10-17 | 35.108 |
| 2001-10-18 | 34.93 |
| 2001-10-19 | 34.636 |
| 2001-10-20 | 34.203 |
| 2001-10-21 | 33.78 |
| 2001-10-22 | 33.707 |
| 2001-10-23 | 33.63 |
| 2001-10-24 | 33.32 |
| 2001-10-25 | 33.032 |
| 2001-10-26 | 32.721 |
| 2001-10-27 | 32.66 |
| 2001-10-28 | 32.696 |
| 2001-10-29 | 32.646 |
| 2001-10-30 | 32.683 |
| 2001-10-31 | 32.74 |
| 2001-11-01 | 32.791 |
| 2001-11-02 | 32.762 |
| 2001-11-03 | 32.8 |
| 2001-11-04 | 32.771 |
| 2001-11-05 | 32.662 |
| 2001-11-06 | 32.487 |
| 2001-11-07 | 32.215 |
| 2001-11-08 | 31.932 |
| 2001-11-09 | 31.743 |
| 2001-11-10 | 31.755 |
| 2001-11-11 | 31.579 |
| 2001-11-12 | 31.473 |
| 2001-11-13 | 31.245 |
| 2001-11-14 | 30.848 |
| 2001-11-15 | 30.515 |
| 2001-11-16 | 30.06 |
| 2001-11-17 | 29.827 |
| 2001-11-18 | 29.613 |
| 2001-11-19 | 29.368 |
| 2001-11-20 | 29.129 |
| 2001-11-21 | 28.763 |
| 2001-11-22 | 28.609 |
| 2001-11-23 | 28.242 |
| 2001-11-24 | 28.181 |
| 2001-11-25 | 28.168 |
| 2001-11-26 | 27.95 |
| 2001-11-27 | 27.761 |
| 2001-11-28 | 27.488 |
| 2001-11-29 | 27.094 |
| 2001-11-30 | 26.631 |
| 2001-12-01 | 26.347 |
| 2001-12-02 | 26.117 |
| 2001-12-03 | 26.1 |
| 2001-12-04 | 26.004 |
| 2001-12-05 | 25.648 |
| 2001-12-06 | 25.405 |
| 2001-12-07 | 25.137 |
| 2001-12-08 | 24.962 |
| 2001-12-09 | 24.832 |
| 2001-12-10 | 24.871 |
| 2001-12-11 | 24.892 |
| 2001-12-12 | 24.679 |
| 2001-12-13 | 24.652 |
| 2001-12-14 | 24.56 |
| 2001-12-15 | 24.51 |
| 2001-12-16 | 24.481 |
| 2001-12-17 | 24.47 |
| 2001-12-18 | 24.413 |
| 2001-12-19 | 24.324 |
| 2001-12-20 | 24.302 |
| 2001-12-21 | 24.222 |
| 2001-12-22 | 24.222 |
| 2001-12-23 | 24.271 |
| 2001-12-24 | 24.192 |
| 2001-12-25 | 24.192 |
| 2001-12-26 | 24.12 |
| 2001-12-27 | 24.006 |
| 2001-12-28 | 23.791 |
| 2001-12-29 | 23.722 |
| 2001-12-30 | 23.716 |
| 2001-12-31 | 23.72 |
| 2002-01-01 | 23.72 |
| 2002-01-02 | 23.567 |
| 2002-01-03 | 23.43 |
| 2002-01-04 | 23.301 |
| 2002-01-05 | 23.28 |
| 2002-01-06 | 23.268 |
| 2002-01-07 | 23.198 |
| 2002-01-08 | 23.13 |
| 2002-01-09 | 22.955 |
| 2002-01-10 | 22.808 |
| 2002-01-11 | 22.695 |
| 2002-01-12 | 22.526 |
| 2002-01-13 | 22.409 |
| 2002-01-14 | 22.471 |
| 2002-01-15 | 22.482 |
| 2002-01-16 | 22.441 |
| 2002-01-17 | 22.39 |
| 2002-01-18 | 22.386 |
| 2002-01-19 | 22.319 |
| 2002-01-20 | 22.309 |
| 2002-01-21 | 22.309 |
| 2002-01-22 | 22.377 |
| 2002-01-23 | 22.338 |
| 2002-01-24 | 22.279 |
| 2002-01-25 | 22.215 |
| 2002-01-26 | 22.248 |
| 2002-01-27 | 22.295 |
| 2002-01-28 | 22.234 |
| 2002-01-29 | 22.34 |
| 2002-01-30 | 22.311 |
| 2002-01-31 | 22.253 |
| 2002-02-01 | 22.177 |
| 2002-02-02 | 22.219 |
| 2002-02-03 | 22.312 |
| 2002-02-04 | 22.44 |
| 2002-02-05 | 22.583 |
| 2002-02-06 | 22.781 |
| 2002-02-07 | 22.937 |
| 2002-02-08 | 22.991 |
| 2002-02-09 | 23.022 |
| 2002-02-10 | 23.045 |
| 2002-02-11 | 22.982 |
| 2002-02-12 | 22.917 |
| 2002-02-13 | 22.787 |
| 2002-02-14 | 22.742 |
| 2002-02-15 | 22.691 |
| 2002-02-16 | 22.713 |
| 2002-02-17 | 22.723 |
| 2002-02-18 | 22.723 |
| 2002-02-19 | 22.809 |
| 2002-02-20 | 22.801 |
| 2002-02-21 | 22.81 |
| 2002-02-22 | 22.857 |
| 2002-02-23 | 22.943 |
| 2002-02-24 | 23.044 |
| 2002-02-25 | 22.984 |
| 2002-02-26 | 22.922 |
| 2002-02-27 | 22.939 |
| 2002-02-28 | 22.807 |
| 2002-03-01 | 22.652 |
| 2002-03-02 | 22.73 |
| 2002-03-03 | 22.815 |
| 2002-03-04 | 22.699 |
| 2002-03-05 | 22.585 |
| 2002-03-06 | 22.35 |
| 2002-03-07 | 22.092 |
| 2002-03-08 | 21.768 |
| 2002-03-09 | 21.6 |
| 2002-03-10 | 21.513 |
| 2002-03-11 | 21.429 |
| 2002-03-12 | 21.342 |
| 2002-03-13 | 21.231 |
| 2002-03-14 | 21.116 |
| 2002-03-15 | 21 |
| 2002-03-16 | 20.962 |
| 2002-03-17 | 20.888 |
| 2002-03-18 | 20.79 |
| 2002-03-19 | 20.665 |
| 2002-03-20 | 20.565 |
| 2002-03-21 | 20.279 |
| 2002-03-22 | 20.057 |
| 2002-03-23 | 19.879 |
| 2002-03-24 | 19.729 |
| 2002-03-25 | 19.67 |
| 2002-03-26 | 19.6 |
| 2002-03-27 | 19.412 |
| 2002-03-28 | 19.217 |
| 2002-03-29 | 19.109 |
| 2002-03-30 | 18.985 |
| 2002-03-31 | 18.934 |
| 2002-04-01 | 18.923 |
| 2002-04-02 | 18.935 |
| 2002-04-03 | 18.92 |
| 2002-04-04 | 18.896 |
| 2002-04-05 | 18.857 |
| 2002-04-06 | 18.798 |
| 2002-04-07 | 18.773 |
| 2002-04-08 | 18.815 |
| 2002-04-09 | 18.846 |
| 2002-04-10 | 18.768 |
| 2002-04-11 | 18.801 |
| 2002-04-12 | 18.8 |
| 2002-04-13 | 18.78 |
| 2002-04-14 | 18.798 |
| 2002-04-15 | 18.85 |
| 2002-04-16 | 18.814 |
| 2002-04-17 | 18.79 |
| 2002-04-18 | 18.844 |
| 2002-04-19 | 18.837 |
| 2002-04-20 | 18.871 |
| 2002-04-21 | 18.929 |
| 2002-04-22 | 18.971 |
| 2002-04-23 | 19.033 |
| 2002-04-24 | 19.142 |
| 2002-04-25 | 19.277 |
| 2002-04-26 | 19.488 |
| 2002-04-27 | 19.592 |
| 2002-04-28 | 19.592 |
| 2002-04-29 | 19.805 |
| 2002-04-30 | 19.9 |
| 2002-05-01 | 19.961 |
| 2002-05-02 | 20.002 |
| 2002-05-03 | 20.002 |
| 2002-05-04 | 20.012 |
| 2002-05-05 | 20.057 |
| 2002-05-06 | 20.176 |
| 2002-05-07 | 20.256 |
| 2002-05-08 | 20.291 |
| 2002-05-09 | 20.386 |
| 2002-05-10 | 20.578 |
| 2002-05-11 | 20.591 |
| 2002-05-12 | 20.65 |
| 2002-05-13 | 20.653 |
| 2002-05-14 | 20.594 |
| 2002-05-15 | 20.565 |
| 2002-05-16 | 20.583 |
| 2002-05-17 | 20.55 |
| 2002-05-18 | 20.61 |
| 2002-05-19 | 20.726 |
| 2002-05-20 | 20.655 |
| 2002-05-21 | 20.627 |
| 2002-05-22 | 20.619 |
| 2002-05-23 | 20.525 |
| 2002-05-24 | 20.44 |
| 2002-05-25 | 20.416 |
| 2002-05-26 | 20.33 |
| 2002-05-27 | 20.33 |
| 2002-05-28 | 20.329 |
| 2002-05-29 | 20.155 |
| 2002-05-30 | 20.093 |
| 2002-05-31 | 20.089 |
| 2002-06-01 | 20.09 |
| 2002-06-02 | 20.085 |
| 2002-06-03 | 20.249 |
| 2002-06-04 | 20.422 |
| 2002-06-05 | 20.425 |
| 2002-06-06 | 20.53 |
| 2002-06-07 | 20.679 |
| 2002-06-08 | 20.635 |
| 2002-06-09 | 20.542 |
| 2002-06-10 | 20.7 |
| 2002-06-11 | 20.879 |
| 2002-06-12 | 21.042 |
| 2002-06-13 | 21.312 |
| 2002-06-14 | 21.635 |
| 2002-06-15 | 21.791 |
| 2002-06-16 | 22.007 |
| 2002-06-17 | 22.138 |
| 2002-06-18 | 22.239 |
| 2002-06-19 | 22.563 |
| 2002-06-20 | 22.917 |
| 2002-06-21 | 23.281 |
| 2002-06-22 | 23.534 |
| 2002-06-23 | 23.778 |
| 2002-06-24 | 23.938 |
| 2002-06-25 | 24.124 |
| 2002-06-26 | 24.319 |
| 2002-06-27 | 24.591 |
| 2002-06-28 | 24.819 |
| 2002-06-29 | 25.019 |
| 2002-06-30 | 25.271 |
| 2002-07-01 | 25.359 |
| 2002-07-02 | 25.522 |
| 2002-07-03 | 25.797 |
| 2002-07-04 | 25.888 |
| 2002-07-05 | 26.102 |
| 2002-07-06 | 26.2 |
| 2002-07-07 | 26.341 |
| 2002-07-08 | 26.437 |
| 2002-07-09 | 26.617 |
| 2002-07-10 | 27.111 |
| 2002-07-11 | 27.559 |
| 2002-07-12 | 27.977 |
| 2002-07-13 | 28.125 |
| 2002-07-14 | 28.239 |
| 2002-07-15 | 28.578 |
| 2002-07-16 | 28.963 |
| 2002-07-17 | 29.478 |
| 2002-07-18 | 29.996 |
| 2002-07-19 | 30.572 |
| 2002-07-20 | 30.727 |
| 2002-07-21 | 30.911 |
| 2002-07-22 | 31.459 |
| 2002-07-23 | 32.1 |
| 2002-07-24 | 32.713 |
| 2002-07-25 | 33.258 |
| 2002-07-26 | 33.595 |
| 2002-07-27 | 33.96 |
| 2002-07-28 | 34.411 |
| 2002-07-29 | 34.257 |
| 2002-07-30 | 34.146 |
| 2002-07-31 | 34.38 |
| 2002-08-01 | 34.76 |
| 2002-08-02 | 35.326 |
| 2002-08-03 | 35.326 |
| 2002-08-04 | 35.736 |
| 2002-08-05 | 36.181 |
| 2002-08-06 | 36.447 |
| 2002-08-07 | 36.924 |
| 2002-08-08 | 37.201 |
| 2002-08-09 | 37.257 |
| 2002-08-10 | 37.42 |
| 2002-08-11 | 37.644 |
| 2002-08-12 | 37.615 |
| 2002-08-13 | 37.534 |
| 2002-08-14 | 37.412 |
| 2002-08-15 | 37.084 |
| 2002-08-16 | 36.782 |
| 2002-08-17 | 36.861 |
| 2002-08-18 | 36.796 |
| 2002-08-19 | 36.406 |
| 2002-08-20 | 36.096 |
| 2002-08-21 | 35.476 |
| 2002-08-22 | 34.696 |
| 2002-08-23 | 34.217 |
| 2002-08-24 | 33.976 |
| 2002-08-25 | 33.9 |
| 2002-08-26 | 33.709 |
| 2002-08-27 | 33.545 |
| 2002-08-28 | 33.635 |
| 2002-08-29 | 33.715 |
| 2002-08-30 | 33.743 |
| 2002-08-31 | 33.59 |
| 2002-09-01 | 33.205 |
| 2002-09-02 | 33.205 |
| 2002-09-03 | 33.527 |
| 2002-09-04 | 33.163 |
| 2002-09-05 | 33.012 |
| 2002-09-06 | 32.898 |
| 2002-09-07 | 32.726 |
| 2002-09-08 | 32.589 |
| 2002-09-09 | 32.783 |
| 2002-09-10 | 32.892 |
| 2002-09-11 | 32.785 |
| 2002-09-12 | 32.865 |
| 2002-09-13 | 33.03 |
| 2002-09-14 | 33.21 |
| 2002-09-15 | 33.442 |
| 2002-09-16 | 33.606 |
| 2002-09-17 | 33.816 |
| 2002-09-18 | 34.24 |
| 2002-09-19 | 34.767 |
| 2002-09-20 | 35.279 |
| 2002-09-21 | 35.656 |
| 2002-09-22 | 35.989 |
| 2002-09-23 | 36.173 |
| 2002-09-24 | 36.38 |
| 2002-09-25 | 36.735 |
| 2002-09-26 | 36.949 |
| 2002-09-27 | 37.122 |
| 2002-09-28 | 37.295 |
| 2002-09-29 | 37.54 |
| 2002-09-30 | 37.648 |
| 2002-10-01 | 37.48 |
| 2002-10-02 | 37.45 |
| 2002-10-03 | 37.329 |
| 2002-10-04 | 37.421 |
| 2002-10-05 | 37.352 |
| 2002-10-06 | 37.403 |
| 2002-10-07 | 37.653 |
| 2002-10-08 | 37.806 |
| 2002-10-09 | 38.064 |
| 2002-10-10 | 38.176 |
| 2002-10-11 | 38.217 |
| 2002-10-12 | 38.251 |
| 2002-10-13 | 38.372 |
| 2002-10-14 | 38.261 |
| 2002-10-15 | 38.069 |
| 2002-10-16 | 38.035 |
| 2002-10-17 | 37.857 |
| 2002-10-18 | 37.676 |
| 2002-10-19 | 37.534 |
| 2002-10-20 | 37.462 |
| 2002-10-21 | 37.255 |
| 2002-10-22 | 37.111 |
| 2002-10-23 | 36.816 |
| 2002-10-24 | 36.521 |
| 2002-10-25 | 36.188 |
| 2002-10-26 | 36.264 |
| 2002-10-27 | 36.229 |
| 2002-10-28 | 35.983 |
| 2002-10-29 | 35.814 |
| 2002-10-30 | 35.43 |
| 2002-10-31 | 35.294 |
| 2002-11-01 | 34.952 |
| 2002-11-02 | 34.84 |
| 2002-11-03 | 34.609 |
| 2002-11-04 | 34.428 |
| 2002-11-05 | 34.283 |
| 2002-11-06 | 33.741 |
| 2002-11-07 | 33.305 |
| 2002-11-08 | 32.727 |
| 2002-11-09 | 32.497 |
| 2002-11-10 | 32.337 |
| 2002-11-11 | 32.288 |
| 2002-11-12 | 32.21 |
| 2002-11-13 | 31.992 |
| 2002-11-14 | 31.749 |
| 2002-11-15 | 31.324 |
| 2002-11-16 | 31.191 |
| 2002-11-17 | 31.074 |
| 2002-11-18 | 30.912 |
| 2002-11-19 | 30.753 |
| 2002-11-20 | 30.399 |
| 2002-11-21 | 29.931 |
| 2002-11-22 | 29.475 |
| 2002-11-23 | 29.258 |
| 2002-11-24 | 29.221 |
| 2002-11-25 | 28.976 |
| 2002-11-26 | 28.839 |
| 2002-11-27 | 28.665 |
| 2002-11-28 | 28.494 |
| 2002-11-29 | 28.316 |
| 2002-11-30 | 28.175 |
| 2002-12-01 | 28.116 |
| 2002-12-02 | 28.083 |
| 2002-12-03 | 28.095 |
| 2002-12-04 | 28.004 |
| 2002-12-05 | 27.95 |
| 2002-12-06 | 27.862 |
| 2002-12-07 | 27.684 |
| 2002-12-08 | 27.594 |
| 2002-12-09 | 27.753 |
| 2002-12-10 | 27.801 |
| 2002-12-11 | 27.632 |
| 2002-12-12 | 27.476 |
| 2002-12-13 | 27.33 |
| 2002-12-14 | 27.263 |
| 2002-12-15 | 27.295 |
| 2002-12-16 | 27.242 |
| 2002-12-17 | 27.215 |
| 2002-12-18 | 27.245 |
| 2002-12-19 | 27.378 |
| 2002-12-20 | 27.444 |
| 2002-12-21 | 27.626 |
| 2002-12-22 | 27.861 |
| 2002-12-23 | 27.778 |
| 2002-12-24 | 27.717 |
| 2002-12-25 | 27.899 |
| 2002-12-26 | 27.969 |
| 2002-12-27 | 28.084 |
| 2002-12-28 | 28.084 |
| 2002-12-29 | 28.115 |
| 2002-12-30 | 28.19 |
| 2002-12-31 | 28.21 |
| 2003-01-01 | 28.248 |
| 2003-01-02 | 28.101 |
| 2003-01-03 | 27.889 |
| 2003-01-04 | 27.773 |
| 2003-01-05 | 27.711 |
| 2003-01-06 | 27.564 |
| 2003-01-07 | 27.442 |
| 2003-01-08 | 27.18 |
| 2003-01-09 | 26.954 |
| 2003-01-10 | 26.782 |
| 2003-01-11 | 26.755 |
| 2003-01-12 | 26.676 |
| 2003-01-13 | 26.583 |
| 2003-01-14 | 26.482 |
| 2003-01-15 | 26.446 |
| 2003-01-16 | 26.363 |
| 2003-01-17 | 26.234 |
| 2003-01-18 | 26.024 |
| 2003-01-19 | 25.986 |
| 2003-01-20 | 25.986 |
| 2003-01-21 | 26.071 |
| 2003-01-22 | 26.218 |
| 2003-01-23 | 26.273 |
| 2003-01-24 | 26.535 |
| 2003-01-25 | 26.491 |
| 2003-01-26 | 26.321 |
| 2003-01-27 | 26.762 |
| 2003-01-28 | 27.02 |
| 2003-01-29 | 27.102 |
| 2003-01-30 | 27.237 |
| 2003-01-31 | 27.424 |
| 2003-02-01 | 27.526 |
| 2003-02-02 | 27.676 |
| 2003-02-03 | 27.843 |
| 2003-02-04 | 28.077 |
| 2003-02-05 | 28.464 |
| 2003-02-06 | 28.856 |
| 2003-02-07 | 29.26 |
| 2003-02-08 | 29.51 |
| 2003-02-09 | 29.783 |
| 2003-02-10 | 29.994 |
| 2003-02-11 | 30.169 |
| 2003-02-12 | 30.618 |
| 2003-02-13 | 31.053 |
| 2003-02-14 | 31.391 |
| 2003-02-15 | 31.711 |
| 2003-02-16 | 32.027 |
| 2003-02-17 | 32.027 |
| 2003-02-18 | 31.981 |
| 2003-02-19 | 31.949 |
| 2003-02-20 | 32.119 |
| 2003-02-21 | 32.178 |
| 2003-02-22 | 32.41 |
| 2003-02-23 | 32.458 |
| 2003-02-24 | 32.434 |
| 2003-02-25 | 32.401 |
| 2003-02-26 | 32.27 |
| 2003-02-27 | 32.203 |
| 2003-02-28 | 32.126 |
| 2003-03-01 | 32.166 |
| 2003-03-02 | 32.218 |
| 2003-03-03 | 32.129 |
| 2003-03-04 | 32.115 |
| 2003-03-05 | 32.084 |
| 2003-03-06 | 32.018 |
| 2003-03-07 | 31.925 |
| 2003-03-08 | 31.854 |
| 2003-03-09 | 31.74 |
| 2003-03-10 | 31.819 |
| 2003-03-11 | 31.904 |
| 2003-03-12 | 31.881 |
| 2003-03-13 | 31.79 |
| 2003-03-14 | 31.63 |
| 2003-03-15 | 31.526 |
| 2003-03-16 | 31.469 |
| 2003-03-17 | 31.483 |
| 2003-03-18 | 31.433 |
| 2003-03-19 | 31.438 |
| 2003-03-20 | 31.407 |
| 2003-03-21 | 31.287 |
| 2003-03-22 | 31.293 |
| 2003-03-23 | 31.345 |
| 2003-03-24 | 31.3 |
| 2003-03-25 | 31.184 |
| 2003-03-26 | 31.014 |
| 2003-03-27 | 30.842 |
| 2003-03-28 | 30.651 |
| 2003-03-29 | 30.657 |
| 2003-03-30 | 30.709 |
| 2003-03-31 | 30.634 |
| 2003-04-01 | 30.531 |
| 2003-04-02 | 30.421 |
| 2003-04-03 | 30.257 |
| 2003-04-04 | 30.2 |
| 2003-04-05 | 30.144 |
| 2003-04-06 | 30.097 |
| 2003-04-07 | 30.019 |
| 2003-04-08 | 29.888 |
| 2003-04-09 | 29.606 |
| 2003-04-10 | 29.242 |
| 2003-04-11 | 28.83 |
| 2003-04-12 | 28.69 |
| 2003-04-13 | 28.575 |
| 2003-04-14 | 28.33 |
| 2003-04-15 | 28.067 |
| 2003-04-16 | 27.648 |
| 2003-04-17 | 27.242 |
| 2003-04-18 | 27.037 |
| 2003-04-19 | 26.867 |
| 2003-04-20 | 26.772 |
| 2003-04-21 | 26.531 |
| 2003-04-22 | 26.253 |
| 2003-04-23 | 25.797 |
| 2003-04-24 | 25.396 |
| 2003-04-25 | 25.042 |
| 2003-04-26 | 24.896 |
| 2003-04-27 | 24.746 |
| 2003-04-28 | 24.55 |
| 2003-04-29 | 24.37 |
| 2003-04-30 | 23.992 |
| 2003-05-01 | 23.67 |
| 2003-05-02 | 23.318 |
| 2003-05-03 | 23.073 |
| 2003-05-04 | 22.754 |
| 2003-05-05 | 22.673 |
| 2003-05-06 | 22.584 |
| 2003-05-07 | 22.229 |
| 2003-05-08 | 21.949 |
| 2003-05-09 | 21.595 |
| 2003-05-10 | 21.395 |
| 2003-05-11 | 21.235 |
| 2003-05-12 | 21.149 |
| 2003-05-13 | 21.09 |
| 2003-05-14 | 20.928 |
| 2003-05-15 | 20.77 |
| 2003-05-16 | 20.573 |
| 2003-05-17 | 20.527 |
| 2003-05-18 | 20.527 |
| 2003-05-19 | 20.526 |
| 2003-05-20 | 20.561 |
| 2003-05-21 | 20.527 |
| 2003-05-22 | 20.485 |
| 2003-05-23 | 20.411 |
| 2003-05-24 | 20.415 |
| 2003-05-25 | 20.396 |
| 2003-05-26 | 20.396 |
| 2003-05-27 | 20.377 |
| 2003-05-28 | 20.338 |
| 2003-05-29 | 20.322 |
| 2003-05-30 | 20.24 |
| 2003-05-31 | 20.172 |
| 2003-06-01 | 20.148 |
| 2003-06-02 | 20.183 |
| 2003-06-03 | 20.214 |
| 2003-06-04 | 20.19 |
| 2003-06-05 | 20.191 |
| 2003-06-06 | 20.203 |
| 2003-06-07 | 20.152 |
| 2003-06-08 | 20.176 |
| 2003-06-09 | 20.274 |
| 2003-06-10 | 20.292 |
| 2003-06-11 | 20.325 |
| 2003-06-12 | 20.349 |
| 2003-06-13 | 20.38 |
| 2003-06-14 | 20.437 |
| 2003-06-15 | 20.544 |
| 2003-06-16 | 20.528 |
| 2003-06-17 | 20.503 |
| 2003-06-18 | 20.468 |
| 2003-06-19 | 20.397 |
| 2003-06-20 | 20.298 |
| 2003-06-21 | 20.324 |
| 2003-06-22 | 20.385 |
| 2003-06-23 | 20.394 |
| 2003-06-24 | 20.411 |
| 2003-06-25 | 20.43 |
| 2003-06-26 | 20.403 |
| 2003-06-27 | 20.363 |
| 2003-06-28 | 20.36 |
| 2003-06-29 | 20.404 |
| 2003-06-30 | 20.362 |
| 2003-07-01 | 20.321 |
| 2003-07-02 | 20.239 |
| 2003-07-03 | 20.173 |
| 2003-07-04 | 20.151 |
| 2003-07-05 | 20.117 |
| 2003-07-06 | 20.058 |
| 2003-07-07 | 20.058 |
| 2003-07-08 | 20.03 |
| 2003-07-09 | 19.877 |
| 2003-07-10 | 19.808 |
| 2003-07-11 | 19.725 |
| 2003-07-12 | 19.691 |
| 2003-07-13 | 19.64 |
| 2003-07-14 | 19.637 |
| 2003-07-15 | 19.633 |
| 2003-07-16 | 19.611 |
| 2003-07-17 | 19.621 |
| 2003-07-18 | 19.59 |
| 2003-07-19 | 19.58 |
| 2003-07-20 | 19.603 |
| 2003-07-21 | 19.612 |
| 2003-07-22 | 19.591 |
| 2003-07-23 | 19.499 |
| 2003-07-24 | 19.396 |
| 2003-07-25 | 19.25 |
| 2003-07-26 | 19.243 |
| 2003-07-27 | 19.247 |
| 2003-07-28 | 19.203 |
| 2003-07-29 | 19.178 |
| 2003-07-30 | 19.146 |
| 2003-07-31 | 19.147 |
| 2003-08-01 | 19.229 |
| 2003-08-02 | 19.221 |
| 2003-08-03 | 19.221 |
| 2003-08-04 | 19.319 |
| 2003-08-05 | 19.471 |
| 2003-08-06 | 19.537 |
| 2003-08-07 | 19.572 |
| 2003-08-08 | 19.602 |
| 2003-08-09 | 19.622 |
| 2003-08-10 | 19.679 |
| 2003-08-11 | 19.683 |
| 2003-08-12 | 19.604 |
| 2003-08-13 | 19.566 |
| 2003-08-14 | 19.517 |
| 2003-08-15 | 19.45 |
| 2003-08-16 | 19.413 |
| 2003-08-17 | 19.428 |
| 2003-08-18 | 19.369 |
| 2003-08-19 | 19.3 |
| 2003-08-20 | 19.211 |
| 2003-08-21 | 19.15 |
| 2003-08-22 | 19.146 |
| 2003-08-23 | 19.172 |
| 2003-08-24 | 19.244 |
| 2003-08-25 | 19.257 |
| 2003-08-26 | 19.268 |
| 2003-08-27 | 19.303 |
| 2003-08-28 | 19.294 |
| 2003-08-29 | 19.284 |
| 2003-08-30 | 19.274 |
| 2003-08-31 | 19.2 |
| 2003-09-01 | 19.2 |
| 2003-09-02 | 19.192 |
| 2003-09-03 | 19.105 |
| 2003-09-04 | 18.916 |
| 2003-09-05 | 18.757 |
| 2003-09-06 | 18.682 |
| 2003-09-07 | 18.634 |
| 2003-09-08 | 18.616 |
| 2003-09-09 | 18.627 |
| 2003-09-10 | 18.639 |
| 2003-09-11 | 18.701 |
| 2003-09-12 | 18.697 |
| 2003-09-13 | 18.708 |
| 2003-09-14 | 18.732 |
| 2003-09-15 | 18.759 |
| 2003-09-16 | 18.724 |
| 2003-09-17 | 18.723 |
| 2003-09-18 | 18.709 |
| 2003-09-19 | 18.696 |
| 2003-09-20 | 18.738 |
| 2003-09-21 | 18.748 |
| 2003-09-22 | 18.793 |
| 2003-09-23 | 18.826 |
| 2003-09-24 | 18.906 |
| 2003-09-25 | 19.038 |
| 2003-09-26 | 19.186 |
| 2003-09-27 | 19.221 |
| 2003-09-28 | 19.252 |
| 2003-09-29 | 19.373 |
| 2003-09-30 | 19.532 |
| 2003-10-01 | 19.602 |
| 2003-10-02 | 19.683 |
| 2003-10-03 | 19.686 |
| 2003-10-04 | 19.732 |
| 2003-10-05 | 19.81 |
| 2003-10-06 | 19.796 |
| 2003-10-07 | 19.779 |
| 2003-10-08 | 19.82 |
| 2003-10-09 | 19.819 |
| 2003-10-10 | 19.748 |
| 2003-10-11 | 19.772 |
| 2003-10-12 | 19.827 |
| 2003-10-13 | 19.718 |
| 2003-10-14 | 19.611 |
| 2003-10-15 | 19.539 |
| 2003-10-16 | 19.501 |
| 2003-10-17 | 19.477 |
| 2003-10-18 | 19.568 |
| 2003-10-19 | 19.669 |
| 2003-10-20 | 19.544 |
| 2003-10-21 | 19.408 |
| 2003-10-22 | 19.318 |
| 2003-10-23 | 19.236 |
| 2003-10-24 | 19.077 |
| 2003-10-25 | 18.925 |
| 2003-10-26 | 18.76 |
| 2003-10-27 | 18.726 |
| 2003-10-28 | 18.64 |
| 2003-10-29 | 18.401 |
| 2003-10-30 | 18.111 |
| 2003-10-31 | 17.885 |
| 2003-11-01 | 17.746 |
| 2003-11-02 | 17.658 |
| 2003-11-03 | 17.606 |
| 2003-11-04 | 17.558 |
| 2003-11-05 | 17.437 |
| 2003-11-06 | 17.316 |
| 2003-11-07 | 17.214 |
| 2003-11-08 | 17.137 |
| 2003-11-09 | 17.072 |
| 2003-11-10 | 17.098 |
| 2003-11-11 | 17.118 |
| 2003-11-12 | 17.081 |
| 2003-11-13 | 17.04 |
| 2003-11-14 | 17.006 |
| 2003-11-15 | 16.998 |
| 2003-11-16 | 16.967 |
| 2003-11-17 | 17.044 |
| 2003-11-18 | 17.138 |
| 2003-11-19 | 17.218 |
| 2003-11-20 | 17.351 |
| 2003-11-21 | 17.411 |
| 2003-11-22 | 17.398 |
| 2003-11-23 | 17.383 |
| 2003-11-24 | 17.385 |
| 2003-11-25 | 17.355 |
| 2003-11-26 | 17.272 |
| 2003-11-27 | 17.293 |
| 2003-11-28 | 17.288 |
| 2003-11-29 | 17.336 |
| 2003-11-30 | 17.401 |
| 2003-12-01 | 17.369 |
| 2003-12-02 | 17.317 |
| 2003-12-03 | 17.321 |
| 2003-12-04 | 17.309 |
| 2003-12-05 | 17.32 |
| 2003-12-06 | 17.349 |
| 2003-12-07 | 17.371 |
| 2003-12-08 | 17.329 |
| 2003-12-09 | 17.344 |
| 2003-12-10 | 17.356 |
| 2003-12-11 | 17.317 |
| 2003-12-12 | 17.301 |
| 2003-12-13 | 17.343 |
| 2003-12-14 | 17.364 |
| 2003-12-15 | 17.357 |
| 2003-12-16 | 17.289 |
| 2003-12-17 | 17.145 |
| 2003-12-18 | 17.005 |
| 2003-12-19 | 16.891 |
| 2003-12-20 | 16.762 |
| 2003-12-21 | 16.645 |
| 2003-12-22 | 16.66 |
| 2003-12-23 | 16.652 |
| 2003-12-24 | 16.615 |
| 2003-12-25 | 16.61 |
| 2003-12-26 | 16.671 |
| 2003-12-27 | 16.671 |
| 2003-12-28 | 16.689 |
| 2003-12-29 | 16.71 |
| 2003-12-30 | 16.756 |
| 2003-12-31 | 16.829 |
| 2004-01-01 | 16.857 |
| 2004-01-02 | 16.937 |
| 2004-01-03 | 16.97 |
| 2004-01-04 | 16.963 |
| 2004-01-05 | 16.991 |
| 2004-01-06 | 16.978 |
| 2004-01-07 | 16.926 |
| 2004-01-08 | 16.825 |
| 2004-01-09 | 16.769 |
| 2004-01-10 | 16.771 |
| 2004-01-11 | 16.791 |
| 2004-01-12 | 16.793 |
| 2004-01-13 | 16.855 |
| 2004-01-14 | 16.831 |
| 2004-01-15 | 16.812 |
| 2004-01-16 | 16.784 |
| 2004-01-17 | 16.816 |
| 2004-01-18 | 16.838 |
| 2004-01-19 | 16.838 |
| 2004-01-20 | 16.753 |
| 2004-01-21 | 16.616 |
| 2004-01-22 | 16.522 |
| 2004-01-23 | 16.426 |
| 2004-01-24 | 16.426 |
| 2004-01-25 | 16.369 |
| 2004-01-26 | 16.274 |
| 2004-01-27 | 16.228 |
| 2004-01-28 | 16.212 |
| 2004-01-29 | 16.185 |
| 2004-01-30 | 16.101 |
| 2004-01-31 | 16.101 |
| 2004-02-01 | 15.989 |
| 2004-02-02 | 16.046 |
| 2004-02-03 | 16.107 |
| 2004-02-04 | 16.125 |
| 2004-02-05 | 16.172 |
| 2004-02-06 | 16.196 |
| 2004-02-07 | 16.225 |
| 2004-02-08 | 16.197 |
| 2004-02-09 | 16.207 |
| 2004-02-10 | 16.194 |
| 2004-02-11 | 16.126 |
| 2004-02-12 | 15.996 |
| 2004-02-13 | 15.94 |
| 2004-02-14 | 15.959 |
| 2004-02-15 | 16.01 |
| 2004-02-16 | 16.01 |
| 2004-02-17 | 15.979 |
| 2004-02-18 | 15.961 |
| 2004-02-19 | 15.989 |
| 2004-02-20 | 16.07 |
| 2004-02-21 | 16.138 |
| 2004-02-22 | 16.206 |
| 2004-02-23 | 16.211 |
| 2004-02-24 | 16.196 |
| 2004-02-25 | 16.214 |
| 2004-02-26 | 16.189 |
| 2004-02-27 | 16.083 |
| 2004-02-28 | 16.03 |
| 2004-02-29 | 15.998 |
| 2004-03-01 | 15.92 |
| 2004-03-02 | 15.87 |
| 2004-03-03 | 15.748 |
| 2004-03-04 | 15.608 |
| 2004-03-05 | 15.447 |
| 2004-03-06 | 15.334 |
| 2004-03-07 | 15.298 |
| 2004-03-08 | 15.323 |
| 2004-03-09 | 15.384 |
| 2004-03-10 | 15.492 |
| 2004-03-11 | 15.718 |
| 2004-03-12 | 15.856 |
| 2004-03-13 | 15.884 |
| 2004-03-14 | 15.899 |
| 2004-03-15 | 16.161 |
| 2004-03-16 | 16.36 |
| 2004-03-17 | 16.44 |
| 2004-03-18 | 16.582 |
| 2004-03-19 | 16.744 |
| 2004-03-20 | 16.789 |
| 2004-03-21 | 16.826 |
| 2004-03-22 | 17.052 |
| 2004-03-23 | 17.217 |
| 2004-03-24 | 17.377 |
| 2004-03-25 | 17.467 |
| 2004-03-26 | 17.576 |
| 2004-03-27 | 17.707 |
| 2004-03-28 | 17.864 |
| 2004-03-29 | 17.8 |
| 2004-03-30 | 17.73 |
| 2004-03-31 | 17.835 |
| 2004-04-01 | 17.916 |
| 2004-04-02 | 17.966 |
| 2004-04-03 | 18.136 |
| 2004-04-04 | 18.318 |
| 2004-04-05 | 18.159 |
| 2004-04-06 | 18.03 |
| 2004-04-07 | 18.029 |
| 2004-04-08 | 18.013 |
| 2004-04-09 | 17.982 |
| 2004-04-10 | 17.847 |
| 2004-04-11 | 17.824 |
| 2004-04-12 | 17.696 |
| 2004-04-13 | 17.676 |
| 2004-04-14 | 17.413 |
| 2004-04-15 | 17.194 |
| 2004-04-16 | 17.043 |
| 2004-04-17 | 16.969 |
| 2004-04-18 | 16.854 |
| 2004-04-19 | 16.783 |
| 2004-04-20 | 16.777 |
| 2004-04-21 | 16.492 |
| 2004-04-22 | 16.204 |
| 2004-04-23 | 15.928 |
| 2004-04-24 | 15.83 |
| 2004-04-25 | 15.751 |
| 2004-04-26 | 15.702 |
| 2004-04-27 | 15.672 |
| 2004-04-28 | 15.662 |
| 2004-04-29 | 15.677 |
| 2004-04-30 | 15.699 |
| 2004-05-01 | 15.651 |
| 2004-05-02 | 15.652 |
| 2004-05-03 | 15.7 |
| 2004-05-04 | 15.74 |
| 2004-05-05 | 15.779 |
| 2004-05-06 | 15.861 |
| 2004-05-07 | 15.974 |
| 2004-05-08 | 15.959 |
| 2004-05-09 | 15.959 |
| 2004-05-10 | 16.141 |
| 2004-05-11 | 16.251 |
| 2004-05-12 | 16.381 |
| 2004-05-13 | 16.454 |
| 2004-05-14 | 16.584 |
| 2004-05-15 | 16.624 |
| 2004-05-16 | 16.708 |
| 2004-05-17 | 16.863 |
| 2004-05-18 | 16.975 |
| 2004-05-19 | 17.135 |
| 2004-05-20 | 17.225 |
| 2004-05-21 | 17.357 |
| 2004-05-22 | 17.488 |
| 2004-05-23 | 17.662 |
| 2004-05-24 | 17.681 |
| 2004-05-25 | 17.603 |
| 2004-05-26 | 17.658 |
| 2004-05-27 | 17.667 |
| 2004-05-28 | 17.631 |
| 2004-05-29 | 17.68 |
| 2004-05-30 | 17.705 |
| 2004-05-31 | 17.705 |
| 2004-06-01 | 17.638 |
| 2004-06-02 | 17.612 |
| 2004-06-03 | 17.635 |
| 2004-06-04 | 17.683 |
| 2004-06-05 | 17.715 |
| 2004-06-06 | 17.693 |
| 2004-06-07 | 17.578 |
| 2004-06-08 | 17.456 |
| 2004-06-09 | 17.247 |
| 2004-06-10 | 17.079 |
| 2004-06-11 | 17.026 |
| 2004-06-12 | 16.929 |
| 2004-06-13 | 16.844 |
| 2004-06-14 | 16.803 |
| 2004-06-15 | 16.716 |
| 2004-06-16 | 16.457 |
| 2004-06-17 | 16.248 |
| 2004-06-18 | 16.051 |
| 2004-06-19 | 15.913 |
| 2004-06-20 | 15.77 |
| 2004-06-21 | 15.743 |
| 2004-06-22 | 15.671 |
| 2004-06-23 | 15.466 |
| 2004-06-24 | 15.409 |
| 2004-06-25 | 15.37 |
| 2004-06-26 | 15.375 |
| 2004-06-27 | 15.368 |
| 2004-06-28 | 15.405 |
| 2004-06-29 | 15.408 |
| 2004-06-30 | 15.357 |
| 2004-07-01 | 15.305 |
| 2004-07-02 | 15.257 |
| 2004-07-03 | 15.168 |
| 2004-07-04 | 15.084 |
| 2004-07-05 | 15.084 |
| 2004-07-06 | 15.142 |
| 2004-07-07 | 15.163 |
| 2004-07-08 | 15.222 |
| 2004-07-09 | 15.242 |
| 2004-07-10 | 15.253 |
| 2004-07-11 | 15.253 |
| 2004-07-12 | 15.238 |
| 2004-07-13 | 15.201 |
| 2004-07-14 | 15.091 |
| 2004-07-15 | 15.075 |
| 2004-07-16 | 15.053 |
| 2004-07-17 | 15.048 |
| 2004-07-18 | 15.052 |
| 2004-07-19 | 15.058 |
| 2004-07-20 | 15.015 |
| 2004-07-21 | 15.07 |
| 2004-07-22 | 15.139 |
| 2004-07-23 | 15.259 |
| 2004-07-24 | 15.281 |
| 2004-07-25 | 15.286 |
| 2004-07-26 | 15.387 |
| 2004-07-27 | 15.442 |
| 2004-07-28 | 15.446 |
| 2004-07-29 | 15.456 |
| 2004-07-30 | 15.502 |
| 2004-07-31 | 15.517 |
| 2004-08-01 | 15.541 |
| 2004-08-02 | 15.532 |
| 2004-08-03 | 15.556 |
| 2004-08-04 | 15.585 |
| 2004-08-05 | 15.68 |
| 2004-08-06 | 15.84 |
| 2004-08-07 | 15.823 |
| 2004-08-08 | 15.825 |
| 2004-08-09 | 15.971 |
| 2004-08-10 | 16.039 |
| 2004-08-11 | 16.179 |
| 2004-08-12 | 16.389 |
| 2004-08-13 | 16.581 |
| 2004-08-14 | 16.67 |
| 2004-08-15 | 16.786 |
| 2004-08-16 | 16.824 |
| 2004-08-17 | 16.833 |
| 2004-08-18 | 16.881 |
| 2004-08-19 | 17.008 |
| 2004-08-20 | 16.989 |
| 2004-08-21 | 17.048 |
| 2004-08-22 | 17.075 |
| 2004-08-23 | 17.019 |
| 2004-08-24 | 16.942 |
| 2004-08-25 | 16.836 |
| 2004-08-26 | 16.762 |
| 2004-08-27 | 16.696 |
| 2004-08-28 | 16.745 |
| 2004-08-29 | 16.816 |
| 2004-08-30 | 16.75 |
| 2004-08-31 | 16.684 |
| 2004-09-01 | 16.663 |
| 2004-09-02 | 16.584 |
| 2004-09-03 | 16.479 |
| 2004-09-04 | 16.391 |
| 2004-09-05 | 16.244 |
| 2004-09-06 | 16.244 |
| 2004-09-07 | 16.14 |
| 2004-09-08 | 15.91 |
| 2004-09-09 | 15.746 |
| 2004-09-10 | 15.542 |
| 2004-09-11 | 15.365 |
| 2004-09-12 | 15.227 |
| 2004-09-13 | 15.124 |
| 2004-09-14 | 15.05 |
| 2004-09-15 | 14.91 |
| 2004-09-16 | 14.785 |
| 2004-09-17 | 14.68 |
| 2004-09-18 | 14.566 |
| 2004-09-19 | 14.491 |
| 2004-09-20 | 14.488 |
| 2004-09-21 | 14.449 |
| 2004-09-22 | 14.394 |
| 2004-09-23 | 14.369 |
| 2004-09-24 | 14.336 |
| 2004-09-25 | 14.307 |
| 2004-09-26 | 14.286 |
| 2004-09-27 | 14.302 |
| 2004-09-28 | 14.28 |
| 2004-09-29 | 14.174 |
| 2004-09-30 | 14.081 |
| 2004-10-01 | 13.978 |
| 2004-10-02 | 13.963 |
| 2004-10-03 | 13.966 |
| 2004-10-04 | 13.938 |
| 2004-10-05 | 13.939 |
| 2004-10-06 | 13.909 |
| 2004-10-07 | 13.928 |
| 2004-10-08 | 13.973 |
| 2004-10-09 | 13.971 |
| 2004-10-10 | 13.982 |
| 2004-10-11 | 14.017 |
| 2004-10-12 | 14.064 |
| 2004-10-13 | 14.166 |
| 2004-10-14 | 14.296 |
| 2004-10-15 | 14.315 |
| 2004-10-16 | 14.311 |
| 2004-10-17 | 14.325 |
| 2004-10-18 | 14.343 |
| 2004-10-19 | 14.379 |
| 2004-10-20 | 14.398 |
| 2004-10-21 | 14.438 |
| 2004-10-22 | 14.463 |
| 2004-10-23 | 14.447 |
| 2004-10-24 | 14.455 |
| 2004-10-25 | 14.556 |
| 2004-10-26 | 14.64 |
| 2004-10-27 | 14.69 |
| 2004-10-28 | 14.76 |
| 2004-10-29 | 14.9 |
| 2004-10-30 | 14.974 |
| 2004-10-31 | 15.085 |
| 2004-11-01 | 15.141 |
| 2004-11-02 | 15.189 |
| 2004-11-03 | 15.217 |
| 2004-11-04 | 15.218 |
| 2004-11-05 | 15.244 |
| 2004-11-06 | 15.279 |
| 2004-11-07 | 15.291 |
| 2004-11-08 | 15.22 |
| 2004-11-09 | 15.146 |
| 2004-11-10 | 15.072 |
| 2004-11-11 | 14.981 |
| 2004-11-12 | 14.886 |
| 2004-11-13 | 14.812 |
| 2004-11-14 | 14.801 |
| 2004-11-15 | 14.733 |
| 2004-11-16 | 14.664 |
| 2004-11-17 | 14.596 |
| 2004-11-18 | 14.498 |
| 2004-11-19 | 14.437 |
| 2004-11-20 | 14.432 |
| 2004-11-21 | 14.39 |
| 2004-11-22 | 14.322 |
| 2004-11-23 | 14.247 |
| 2004-11-24 | 14.071 |
| 2004-11-25 | 13.961 |
| 2004-11-26 | 13.821 |
| 2004-11-27 | 13.742 |
| 2004-11-28 | 13.609 |
| 2004-11-29 | 13.594 |
| 2004-11-30 | 13.577 |
| 2004-12-01 | 13.42 |
| 2004-12-02 | 13.268 |
| 2004-12-03 | 13.216 |
| 2004-12-04 | 13.178 |
| 2004-12-05 | 13.144 |
| 2004-12-06 | 13.146 |
| 2004-12-07 | 13.171 |
| 2004-12-08 | 13.142 |
| 2004-12-09 | 13.107 |
| 2004-12-10 | 13.092 |
| 2004-12-11 | 13.094 |
| 2004-12-12 | 13.082 |
| 2004-12-13 | 13.055 |
| 2004-12-14 | 13.04 |
| 2004-12-15 | 12.99 |
| 2004-12-16 | 12.946 |
| 2004-12-17 | 12.886 |
| 2004-12-18 | 12.881 |
| 2004-12-19 | 12.848 |
| 2004-12-20 | 12.797 |
| 2004-12-21 | 12.738 |
| 2004-12-22 | 12.666 |
| 2004-12-23 | 12.597 |
| 2004-12-24 | 12.591 |
| 2004-12-25 | 12.591 |
| 2004-12-26 | 12.581 |
| 2004-12-27 | 12.559 |
| 2004-12-28 | 12.532 |
| 2004-12-29 | 12.452 |
| 2004-12-30 | 12.42 |
| 2004-12-31 | 12.435 |
| 2005-01-01 | 12.408 |
| 2005-01-02 | 12.379 |
| 2005-01-03 | 12.464 |
| 2005-01-04 | 12.536 |
| 2005-01-05 | 12.579 |
| 2005-01-06 | 12.575 |
| 2005-01-07 | 12.589 |
| 2005-01-08 | 12.575 |
| 2005-01-09 | 12.565 |
| 2005-01-10 | 12.598 |
| 2005-01-11 | 12.626 |
| 2005-01-12 | 12.627 |
| 2005-01-13 | 12.632 |
| 2005-01-14 | 12.636 |
| 2005-01-15 | 12.655 |
| 2005-01-16 | 12.692 |
| 2005-01-17 | 12.692 |
| 2005-01-18 | 12.681 |
| 2005-01-19 | 12.748 |
| 2005-01-20 | 12.862 |
| 2005-01-21 | 13.008 |
| 2005-01-22 | 13.101 |
| 2005-01-23 | 13.101 |
| 2005-01-24 | 13.178 |
| 2005-01-25 | 13.22 |
| 2005-01-26 | 13.282 |
| 2005-01-27 | 13.341 |
| 2005-01-28 | 13.419 |
| 2005-01-29 | 13.462 |
| 2005-01-30 | 13.471 |
| 2005-01-31 | 13.438 |
| 2005-02-01 | 13.371 |
| 2005-02-02 | 13.256 |
| 2005-02-03 | 13.151 |
| 2005-02-04 | 13.014 |
| 2005-02-05 | 12.986 |
| 2005-02-06 | 12.959 |
| 2005-02-07 | 12.898 |
| 2005-02-08 | 12.836 |
| 2005-02-09 | 12.778 |
| 2005-02-10 | 12.698 |
| 2005-02-11 | 12.644 |
| 2005-02-12 | 12.634 |
| 2005-02-13 | 12.645 |
| 2005-02-14 | 12.588 |
| 2005-02-15 | 12.526 |
| 2005-02-16 | 12.461 |
| 2005-02-17 | 12.429 |
| 2005-02-18 | 12.338 |
| 2005-02-19 | 12.267 |
| 2005-02-20 | 12.162 |
| 2005-02-21 | 12.162 |
| 2005-02-22 | 12.209 |
| 2005-02-23 | 12.101 |
| 2005-02-24 | 11.983 |
| 2005-02-25 | 11.89 |
| 2005-02-26 | 11.823 |
| 2005-02-27 | 11.748 |
| 2005-02-28 | 11.765 |
| 2005-03-01 | 11.778 |
| 2005-03-02 | 11.762 |
| 2005-03-03 | 11.805 |
| 2005-03-04 | 11.819 |
| 2005-03-05 | 11.82 |
| 2005-03-06 | 11.852 |
| 2005-03-07 | 11.872 |
| 2005-03-08 | 11.898 |
| 2005-03-09 | 11.944 |
| 2005-03-10 | 11.986 |
| 2005-03-11 | 12.024 |
| 2005-03-12 | 12.05 |
| 2005-03-13 | 12.083 |
| 2005-03-14 | 12.098 |
| 2005-03-15 | 12.148 |
| 2005-03-16 | 12.242 |
| 2005-03-17 | 12.338 |
| 2005-03-18 | 12.435 |
| 2005-03-19 | 12.468 |
| 2005-03-20 | 12.536 |
| 2005-03-21 | 12.59 |
| 2005-03-22 | 12.67 |
| 2005-03-23 | 12.733 |
| 2005-03-24 | 12.746 |
| 2005-03-25 | 12.763 |
| 2005-03-26 | 12.823 |
| 2005-03-27 | 12.893 |
| 2005-03-28 | 12.936 |
| 2005-03-29 | 13.01 |
| 2005-03-30 | 13.084 |
| 2005-03-31 | 13.178 |
| 2005-04-01 | 13.254 |
| 2005-04-02 | 13.27 |
| 2005-04-03 | 13.34 |
| 2005-04-04 | 13.379 |
| 2005-04-05 | 13.393 |
| 2005-04-06 | 13.435 |
| 2005-04-07 | 13.432 |
| 2005-04-08 | 13.428 |
| 2005-04-09 | 13.475 |
| 2005-04-10 | 13.511 |
| 2005-04-11 | 13.434 |
| 2005-04-12 | 13.332 |
| 2005-04-13 | 13.376 |
| 2005-04-14 | 13.442 |
| 2005-04-15 | 13.644 |
| 2005-04-16 | 13.662 |
| 2005-04-17 | 13.689 |
| 2005-04-18 | 13.833 |
| 2005-04-19 | 13.887 |
| 2005-04-20 | 14.044 |
| 2005-04-21 | 14.051 |
| 2005-04-22 | 14.114 |
| 2005-04-23 | 14.149 |
| 2005-04-24 | 14.149 |
| 2005-04-25 | 14.171 |
| 2005-04-26 | 14.205 |
| 2005-04-27 | 14.255 |
| 2005-04-28 | 14.363 |
| 2005-04-29 | 14.439 |
| 2005-04-30 | 14.459 |
| 2005-05-01 | 14.478 |
| 2005-05-02 | 14.508 |
| 2005-05-03 | 14.509 |
| 2005-05-04 | 14.497 |
| 2005-05-05 | 14.511 |
| 2005-05-06 | 14.552 |
| 2005-05-07 | 14.658 |
| 2005-05-08 | 14.76 |
| 2005-05-09 | 14.711 |
| 2005-05-10 | 14.72 |
| 2005-05-11 | 14.833 |
| 2005-05-12 | 15.052 |
| 2005-05-13 | 15.189 |
| 2005-05-14 | 15.22 |
| 2005-05-15 | 15.094 |
| 2005-05-16 | 15.122 |
| 2005-05-17 | 15.097 |
| 2005-05-18 | 14.964 |
| 2005-05-19 | 14.889 |
| 2005-05-20 | 14.717 |
| 2005-05-21 | 14.732 |
| 2005-05-22 | 14.699 |
| 2005-05-23 | 14.616 |
| 2005-05-24 | 14.529 |
| 2005-05-25 | 14.436 |
| 2005-05-26 | 14.315 |
| 2005-05-27 | 14.191 |
| 2005-05-28 | 14.064 |
| 2005-05-29 | 14.001 |
| 2005-05-30 | 14.001 |
| 2005-05-31 | 13.968 |
| 2005-06-01 | 13.836 |
| 2005-06-02 | 13.708 |
| 2005-06-03 | 13.627 |
| 2005-06-04 | 13.609 |
| 2005-06-05 | 13.586 |
| 2005-06-06 | 13.521 |
| 2005-06-07 | 13.467 |
| 2005-06-08 | 13.417 |
| 2005-06-09 | 13.282 |
| 2005-06-10 | 13.164 |
| 2005-06-11 | 13.016 |
| 2005-06-12 | 12.842 |
| 2005-06-13 | 12.782 |
| 2005-06-14 | 12.735 |
| 2005-06-15 | 12.534 |
| 2005-06-16 | 12.371 |
| 2005-06-17 | 12.269 |
| 2005-06-18 | 12.216 |
| 2005-06-19 | 12.168 |
| 2005-06-20 | 12.133 |
| 2005-06-21 | 12.083 |
| 2005-06-22 | 11.992 |
| 2005-06-23 | 11.966 |
| 2005-06-24 | 11.947 |
| 2005-06-25 | 11.932 |
| 2005-06-26 | 11.921 |
| 2005-06-27 | 11.951 |
| 2005-06-28 | 11.933 |
| 2005-06-29 | 11.925 |
| 2005-06-30 | 11.869 |
| 2005-07-01 | 11.825 |
| 2005-07-02 | 11.824 |
| 2005-07-03 | 11.808 |
| 2005-07-04 | 11.808 |
| 2005-07-05 | 11.802 |
| 2005-07-06 | 11.801 |
| 2005-07-07 | 11.806 |
| 2005-07-08 | 11.747 |
| 2005-07-09 | 11.73 |
| 2005-07-10 | 11.718 |
| 2005-07-11 | 11.696 |
| 2005-07-12 | 11.66 |
| 2005-07-13 | 11.622 |
| 2005-07-14 | 11.575 |
| 2005-07-15 | 11.521 |
| 2005-07-16 | 11.54 |
| 2005-07-17 | 11.543 |
| 2005-07-18 | 11.505 |
| 2005-07-19 | 11.454 |
| 2005-07-20 | 11.395 |
| 2005-07-21 | 11.39 |
| 2005-07-22 | 11.365 |
| 2005-07-23 | 11.326 |
| 2005-07-24 | 11.282 |
| 2005-07-25 | 11.272 |
| 2005-07-26 | 11.259 |
| 2005-07-27 | 11.156 |
| 2005-07-28 | 11.106 |
| 2005-07-29 | 11.096 |
| 2005-07-30 | 11.049 |
| 2005-07-31 | 11.031 |
| 2005-08-01 | 11.083 |
| 2005-08-02 | 11.115 |
| 2005-08-03 | 11.147 |
| 2005-08-04 | 11.185 |
| 2005-08-05 | 11.195 |
| 2005-08-06 | 11.133 |
| 2005-08-07 | 11.118 |
| 2005-08-08 | 11.217 |
| 2005-08-09 | 11.271 |
| 2005-08-10 | 11.321 |
| 2005-08-11 | 11.388 |
| 2005-08-12 | 11.474 |
| 2005-08-13 | 11.506 |
| 2005-08-14 | 11.564 |
| 2005-08-15 | 11.598 |
| 2005-08-16 | 11.685 |
| 2005-08-17 | 11.8 |
| 2005-08-18 | 11.935 |
| 2005-08-19 | 12.08 |
| 2005-08-20 | 12.133 |
| 2005-08-21 | 12.214 |
| 2005-08-22 | 12.271 |
| 2005-08-23 | 12.32 |
| 2005-08-24 | 12.459 |
| 2005-08-25 | 12.584 |
| 2005-08-26 | 12.736 |
| 2005-08-27 | 12.842 |
| 2005-08-28 | 12.905 |
| 2005-08-29 | 12.935 |
| 2005-08-30 | 12.967 |
| 2005-08-31 | 12.991 |
| 2005-09-01 | 13.055 |
| 2005-09-02 | 13.134 |
| 2005-09-03 | 13.163 |
| 2005-09-04 | 13.197 |
| 2005-09-05 | 13.197 |
| 2005-09-06 | 13.184 |
| 2005-09-07 | 13.151 |
| 2005-09-08 | 13.177 |
| 2005-09-09 | 13.158 |
| 2005-09-10 | 13.195 |
| 2005-09-11 | 13.218 |
| 2005-09-12 | 13.14 |
| 2005-09-13 | 13.104 |
| 2005-09-14 | 13.135 |
| 2005-09-15 | 13.086 |
| 2005-09-16 | 12.987 |
| 2005-09-17 | 12.966 |
| 2005-09-18 | 12.942 |
| 2005-09-19 | 12.902 |
| 2005-09-20 | 12.889 |
| 2005-09-21 | 12.907 |
| 2005-09-22 | 12.906 |
| 2005-09-23 | 12.849 |
| 2005-09-24 | 12.804 |
| 2005-09-25 | 12.756 |
| 2005-09-26 | 12.77 |
| 2005-09-27 | 12.77 |
| 2005-09-28 | 12.728 |
| 2005-09-29 | 12.66 |
| 2005-09-30 | 12.628 |
| 2005-10-01 | 12.602 |
| 2005-10-02 | 12.551 |
| 2005-10-03 | 12.546 |
| 2005-10-04 | 12.578 |
| 2005-10-05 | 12.667 |
| 2005-10-06 | 12.76 |
| 2005-10-07 | 12.854 |
| 2005-10-08 | 12.85 |
| 2005-10-09 | 12.894 |
| 2005-10-10 | 13.02 |
| 2005-10-11 | 13.139 |
| 2005-10-12 | 13.346 |
| 2005-10-13 | 13.532 |
| 2005-10-14 | 13.621 |
| 2005-10-15 | 13.675 |
| 2005-10-16 | 13.798 |
| 2005-10-17 | 13.839 |
| 2005-10-18 | 13.907 |
| 2005-10-19 | 13.969 |
| 2005-10-20 | 14.126 |
| 2005-10-21 | 14.233 |
| 2005-10-22 | 14.276 |
| 2005-10-23 | 14.342 |
| 2005-10-24 | 14.36 |
| 2005-10-25 | 14.368 |
| 2005-10-26 | 14.439 |
| 2005-10-27 | 14.587 |
| 2005-10-28 | 14.66 |
| 2005-10-29 | 14.776 |
| 2005-10-30 | 14.918 |
| 2005-10-31 | 14.938 |
| 2005-11-01 | 14.934 |
| 2005-11-02 | 14.98 |
| 2005-11-03 | 14.971 |
| 2005-11-04 | 14.908 |
| 2005-11-05 | 14.906 |
| 2005-11-06 | 14.922 |
| 2005-11-07 | 14.835 |
| 2005-11-08 | 14.755 |
| 2005-11-09 | 14.63 |
| 2005-11-10 | 14.46 |
| 2005-11-11 | 14.252 |
| 2005-11-12 | 14.146 |
| 2005-11-13 | 14.11 |
| 2005-11-14 | 14.018 |
| 2005-11-15 | 13.937 |
| 2005-11-16 | 13.827 |
| 2005-11-17 | 13.642 |
| 2005-11-18 | 13.534 |
| 2005-11-19 | 13.411 |
| 2005-11-20 | 13.275 |
| 2005-11-21 | 13.158 |
| 2005-11-22 | 13.042 |
| 2005-11-23 | 12.87 |
| 2005-11-24 | 12.791 |
| 2005-11-25 | 12.614 |
| 2005-11-26 | 12.444 |
| 2005-11-27 | 12.349 |
| 2005-11-28 | 12.324 |
| 2005-11-29 | 12.303 |
| 2005-11-30 | 12.148 |
| 2005-12-01 | 11.976 |
| 2005-12-02 | 11.858 |
| 2005-12-03 | 11.801 |
| 2005-12-04 | 11.729 |
| 2005-12-05 | 11.722 |
| 2005-12-06 | 11.713 |
| 2005-12-07 | 11.669 |
| 2005-12-08 | 11.628 |
| 2005-12-09 | 11.575 |
| 2005-12-10 | 11.559 |
| 2005-12-11 | 11.555 |
| 2005-12-12 | 11.55 |
| 2005-12-13 | 11.53 |
| 2005-12-14 | 11.449 |
| 2005-12-15 | 11.377 |
| 2005-12-16 | 11.302 |
| 2005-12-17 | 11.304 |
| 2005-12-18 | 11.314 |
| 2005-12-19 | 11.317 |
| 2005-12-20 | 11.311 |
| 2005-12-21 | 11.311 |
| 2005-12-22 | 11.296 |
| 2005-12-23 | 11.263 |
| 2005-12-24 | 11.263 |
| 2005-12-25 | 11.282 |
| 2005-12-26 | 11.282 |
| 2005-12-27 | 11.296 |
| 2005-12-28 | 11.273 |
| 2005-12-29 | 11.26 |
| 2005-12-30 | 11.26 |
| 2005-12-31 | 11.261 |
| 2006-01-01 | 11.274 |
| 2006-01-02 | 11.274 |
| 2006-01-03 | 11.267 |
| 2006-01-04 | 11.256 |
| 2006-01-05 | 11.245 |
| 2006-01-06 | 11.186 |
| 2006-01-07 | 11.133 |
| 2006-01-08 | 11.102 |
| 2006-01-09 | 11.103 |
| 2006-01-10 | 11.091 |
| 2006-01-11 | 11.064 |
| 2006-01-12 | 11.069 |
| 2006-01-13 | 11.106 |
| 2006-01-14 | 11.126 |
| 2006-01-15 | 11.151 |
| 2006-01-16 | 11.151 |
| 2006-01-17 | 11.191 |
| 2006-01-18 | 11.237 |
| 2006-01-19 | 11.278 |
| 2006-01-20 | 11.476 |
| 2006-01-21 | 11.542 |
| 2006-01-22 | 11.616 |
| 2006-01-23 | 11.745 |
| 2006-01-24 | 11.827 |
| 2006-01-25 | 11.879 |
| 2006-01-26 | 11.922 |
| 2006-01-27 | 11.953 |
| 2006-01-28 | 11.971 |
| 2006-01-29 | 11.966 |
| 2006-01-30 | 11.988 |
| 2006-01-31 | 12.036 |
| 2006-02-01 | 12.051 |
| 2006-02-02 | 12.151 |
| 2006-02-03 | 12.227 |
| 2006-02-04 | 12.272 |
| 2006-02-05 | 12.339 |
| 2006-02-06 | 12.374 |
| 2006-02-07 | 12.432 |
| 2006-02-08 | 12.513 |
| 2006-02-09 | 12.621 |
| 2006-02-10 | 12.713 |
| 2006-02-11 | 12.788 |
| 2006-02-12 | 12.871 |
| 2006-02-13 | 12.894 |
| 2006-02-14 | 12.864 |
| 2006-02-15 | 12.839 |
| 2006-02-16 | 12.819 |
| 2006-02-17 | 12.808 |
| 2006-02-18 | 12.848 |
| 2006-02-19 | 12.762 |
| 2006-02-20 | 12.762 |
| 2006-02-21 | 12.745 |
| 2006-02-22 | 12.648 |
| 2006-02-23 | 12.579 |
| 2006-02-24 | 12.512 |
| 2006-02-25 | 12.516 |
| 2006-02-26 | 12.545 |
| 2006-02-27 | 12.497 |
| 2006-02-28 | 12.49 |
| 2006-03-01 | 12.45 |
| 2006-03-02 | 12.391 |
| 2006-03-03 | 12.372 |
| 2006-03-04 | 12.329 |
| 2006-03-05 | 12.296 |
| 2006-03-06 | 12.318 |
| 2006-03-07 | 12.334 |
| 2006-03-08 | 12.3 |
| 2006-03-09 | 12.257 |
| 2006-03-10 | 12.21 |
| 2006-03-11 | 12.164 |
| 2006-03-12 | 12.127 |
| 2006-03-13 | 12.09 |
| 2006-03-14 | 12.025 |
| 2006-03-15 | 11.93 |
| 2006-03-16 | 11.917 |
| 2006-03-17 | 11.908 |
| 2006-03-18 | 11.93 |
| 2006-03-19 | 11.925 |
| 2006-03-20 | 11.918 |
| 2006-03-21 | 11.904 |
| 2006-03-22 | 11.873 |
| 2006-03-23 | 11.816 |
| 2006-03-24 | 11.785 |
| 2006-03-25 | 11.781 |
| 2006-03-26 | 11.797 |
| 2006-03-27 | 11.781 |
| 2006-03-28 | 11.772 |
| 2006-03-29 | 11.743 |
| 2006-03-30 | 11.708 |
| 2006-03-31 | 11.701 |
| 2006-04-01 | 11.7 |
| 2006-04-02 | 11.687 |
| 2006-04-03 | 11.681 |
| 2006-04-04 | 11.657 |
| 2006-04-05 | 11.584 |
| 2006-04-06 | 11.529 |
| 2006-04-07 | 11.526 |
| 2006-04-08 | 11.471 |
| 2006-04-09 | 11.452 |
| 2006-04-10 | 11.487 |
| 2006-04-11 | 11.556 |
| 2006-04-12 | 11.619 |
| 2006-04-13 | 11.694 |
| 2006-04-14 | 11.71 |
| 2006-04-15 | 11.696 |
| 2006-04-16 | 11.674 |
| 2006-04-17 | 11.719 |
| 2006-04-18 | 11.704 |
| 2006-04-19 | 11.682 |
| 2006-04-20 | 11.683 |
| 2006-04-21 | 11.701 |
| 2006-04-22 | 11.728 |
| 2006-04-23 | 11.756 |
| 2006-04-24 | 11.756 |
| 2006-04-25 | 11.755 |
| 2006-04-26 | 11.77 |
| 2006-04-27 | 11.782 |
| 2006-04-28 | 11.812 |
| 2006-04-29 | 11.825 |
| 2006-04-30 | 11.847 |
| 2006-05-01 | 11.882 |
| 2006-05-02 | 11.887 |
| 2006-05-03 | 11.907 |
| 2006-05-04 | 11.941 |
| 2006-05-05 | 11.965 |
| 2006-05-06 | 11.99 |
| 2006-05-07 | 11.976 |
| 2006-05-08 | 11.978 |
| 2006-05-09 | 11.978 |
| 2006-05-10 | 11.959 |
| 2006-05-11 | 11.934 |
| 2006-05-12 | 12.002 |
| 2006-05-13 | 11.984 |
| 2006-05-14 | 11.984 |
| 2006-05-15 | 12.059 |
| 2006-05-16 | 12.118 |
| 2006-05-17 | 12.285 |
| 2006-05-18 | 12.539 |
| 2006-05-19 | 12.805 |
| 2006-05-20 | 12.861 |
| 2006-05-21 | 12.924 |
| 2006-05-22 | 13.153 |
| 2006-05-23 | 13.385 |
| 2006-05-24 | 13.64 |
| 2006-05-25 | 13.81 |
| 2006-05-26 | 13.924 |
| 2006-05-27 | 14.023 |
| 2006-05-28 | 14.145 |
| 2006-05-29 | 14.145 |
| 2006-05-30 | 14.36 |
| 2006-05-31 | 14.546 |
| 2006-06-01 | 14.666 |
| 2006-06-02 | 14.777 |
| 2006-06-03 | 14.923 |
| 2006-06-04 | 15.097 |
| 2006-06-05 | 15.174 |
| 2006-06-06 | 15.278 |
| 2006-06-07 | 15.554 |
| 2006-06-08 | 15.857 |
| 2006-06-09 | 16.159 |
| 2006-06-10 | 16.342 |
| 2006-06-11 | 16.455 |
| 2006-06-12 | 16.681 |
| 2006-06-13 | 17.02 |
| 2006-06-14 | 17.396 |
| 2006-06-15 | 17.517 |
| 2006-06-16 | 17.564 |
| 2006-06-17 | 17.593 |
| 2006-06-18 | 17.615 |
| 2006-06-19 | 17.625 |
| 2006-06-20 | 17.581 |
| 2006-06-21 | 17.476 |
| 2006-06-22 | 17.363 |
| 2006-06-23 | 17.293 |
| 2006-06-24 | 17.382 |
| 2006-06-25 | 17.547 |
| 2006-06-26 | 17.45 |
| 2006-06-27 | 17.4 |
| 2006-06-28 | 17.327 |
| 2006-06-29 | 17.071 |
| 2006-06-30 | 16.919 |
| 2006-07-01 | 17.033 |
| 2006-07-02 | 17.168 |
| 2006-07-03 | 16.972 |
| 2006-07-04 | 16.972 |
| 2006-07-05 | 16.853 |
| 2006-07-06 | 16.678 |
| 2006-07-07 | 16.495 |
| 2006-07-08 | 16.402 |
| 2006-07-09 | 16.312 |
| 2006-07-10 | 16.197 |
| 2006-07-11 | 16.052 |
| 2006-07-12 | 15.744 |
| 2006-07-13 | 15.457 |
| 2006-07-14 | 15.295 |
| 2006-07-15 | 15.265 |
| 2006-07-16 | 15.16 |
| 2006-07-17 | 15.334 |
| 2006-07-18 | 15.449 |
| 2006-07-19 | 15.34 |
| 2006-07-20 | 15.317 |
| 2006-07-21 | 15.407 |
| 2006-07-22 | 15.383 |
| 2006-07-23 | 15.356 |
| 2006-07-24 | 15.338 |
| 2006-07-25 | 15.314 |
| 2006-07-26 | 15.267 |
| 2006-07-27 | 15.197 |
| 2006-07-28 | 15.128 |
| 2006-07-29 | 15.233 |
| 2006-07-30 | 15.346 |
| 2006-07-31 | 15.326 |
| 2006-08-01 | 15.313 |
| 2006-08-02 | 15.374 |
| 2006-08-03 | 15.333 |
| 2006-08-04 | 15.341 |
| 2006-08-05 | 15.422 |
| 2006-08-06 | 15.494 |
| 2006-08-07 | 15.482 |
| 2006-08-08 | 15.47 |
| 2006-08-09 | 15.524 |
| 2006-08-10 | 15.584 |
| 2006-08-11 | 15.575 |
| 2006-08-12 | 15.47 |
| 2006-08-13 | 15.341 |
| 2006-08-14 | 15.29 |
| 2006-08-15 | 15.205 |
| 2006-08-16 | 14.921 |
| 2006-08-17 | 14.671 |
| 2006-08-18 | 14.494 |
| 2006-08-19 | 14.412 |
| 2006-08-20 | 14.262 |
| 2006-08-21 | 14.165 |
| 2006-08-22 | 14.075 |
| 2006-08-23 | 13.958 |
| 2006-08-24 | 13.847 |
| 2006-08-25 | 13.742 |
| 2006-08-26 | 13.685 |
| 2006-08-27 | 13.652 |
| 2006-08-28 | 13.582 |
| 2006-08-29 | 13.523 |
| 2006-08-30 | 13.399 |
| 2006-08-31 | 13.275 |
| 2006-09-01 | 13.166 |
| 2006-09-02 | 13.105 |
| 2006-09-03 | 13.043 |
| 2006-09-04 | 13.043 |
| 2006-09-05 | 13.023 |
| 2006-09-06 | 12.952 |
| 2006-09-07 | 12.888 |
| 2006-09-08 | 12.791 |
| 2006-09-09 | 12.708 |
| 2006-09-10 | 12.624 |
| 2006-09-11 | 12.642 |
| 2006-09-12 | 12.608 |
| 2006-09-13 | 12.461 |
| 2006-09-14 | 12.372 |
| 2006-09-15 | 12.341 |
| 2006-09-16 | 12.346 |
| 2006-09-17 | 12.383 |
| 2006-09-18 | 12.353 |
| 2006-09-19 | 12.335 |
| 2006-09-20 | 12.296 |
| 2006-09-21 | 12.299 |
| 2006-09-22 | 12.308 |
| 2006-09-23 | 12.303 |
| 2006-09-24 | 12.303 |
| 2006-09-25 | 12.293 |
| 2006-09-26 | 12.257 |
| 2006-09-27 | 12.229 |
| 2006-09-28 | 12.202 |
| 2006-09-29 | 12.19 |
| 2006-09-30 | 12.185 |
| 2006-10-01 | 12.196 |
| 2006-10-02 | 12.215 |
| 2006-10-03 | 12.216 |
| 2006-10-04 | 12.2 |
| 2006-10-05 | 12.17 |
| 2006-10-06 | 12.071 |
| 2006-10-07 | 11.985 |
| 2006-10-08 | 11.926 |
| 2006-10-09 | 11.915 |
| 2006-10-10 | 11.897 |
| 2006-10-11 | 11.835 |
| 2006-10-12 | 11.797 |
| 2006-10-13 | 11.777 |
| 2006-10-14 | 11.788 |
| 2006-10-15 | 11.79 |
| 2006-10-16 | 11.756 |
| 2006-10-17 | 11.755 |
| 2006-10-18 | 11.735 |
| 2006-10-19 | 11.686 |
| 2006-10-20 | 11.651 |
| 2006-10-21 | 11.623 |
| 2006-10-22 | 11.574 |
| 2006-10-23 | 11.551 |
| 2006-10-24 | 11.516 |
| 2006-10-25 | 11.45 |
| 2006-10-26 | 11.405 |
| 2006-10-27 | 11.37 |
| 2006-10-28 | 11.353 |
| 2006-10-29 | 11.322 |
| 2006-10-30 | 11.316 |
| 2006-10-31 | 11.306 |
| 2006-11-01 | 11.258 |
| 2006-11-02 | 11.221 |
| 2006-11-03 | 11.189 |
| 2006-11-04 | 11.151 |
| 2006-11-05 | 11.131 |
| 2006-11-06 | 11.132 |
| 2006-11-07 | 11.13 |
| 2006-11-08 | 11.088 |
| 2006-11-09 | 11.065 |
| 2006-11-10 | 11.027 |
| 2006-11-11 | 11.024 |
| 2006-11-12 | 11.038 |
| 2006-11-13 | 11.03 |
| 2006-11-14 | 11.005 |
| 2006-11-15 | 10.97 |
| 2006-11-16 | 10.899 |
| 2006-11-17 | 10.84 |
| 2006-11-18 | 10.837 |
| 2006-11-19 | 10.847 |
| 2006-11-20 | 10.806 |
| 2006-11-21 | 10.765 |
| 2006-11-22 | 10.722 |
| 2006-11-23 | 10.719 |
| 2006-11-24 | 10.722 |
| 2006-11-25 | 10.731 |
| 2006-11-26 | 10.727 |
| 2006-11-27 | 10.806 |
| 2006-11-28 | 10.844 |
| 2006-11-29 | 10.827 |
| 2006-11-30 | 10.818 |
| 2006-12-01 | 10.825 |
| 2006-12-02 | 10.795 |
| 2006-12-03 | 10.776 |
| 2006-12-04 | 10.798 |
| 2006-12-05 | 10.821 |
| 2006-12-06 | 10.829 |
| 2006-12-07 | 10.904 |
| 2006-12-08 | 10.967 |
| 2006-12-09 | 10.965 |
| 2006-12-10 | 10.974 |
| 2006-12-11 | 10.961 |
| 2006-12-12 | 10.946 |
| 2006-12-13 | 10.914 |
| 2006-12-14 | 10.889 |
| 2006-12-15 | 10.876 |
| 2006-12-16 | 10.912 |
| 2006-12-17 | 10.957 |
| 2006-12-18 | 10.94 |
| 2006-12-19 | 10.909 |
| 2006-12-20 | 10.923 |
| 2006-12-21 | 10.953 |
| 2006-12-22 | 11.011 |
| 2006-12-23 | 11.011 |
| 2006-12-24 | 11.025 |
| 2006-12-25 | 11.025 |
| 2006-12-26 | 11.036 |
| 2006-12-27 | 10.957 |
| 2006-12-28 | 10.927 |
| 2006-12-29 | 10.962 |
| 2006-12-30 | 10.965 |
| 2006-12-31 | 10.928 |
| 2007-01-01 | 10.928 |
| 2007-01-02 | 10.928 |
| 2007-01-03 | 10.971 |
| 2007-01-04 | 10.983 |
| 2007-01-05 | 11.026 |
| 2007-01-06 | 10.934 |
| 2007-01-07 | 10.868 |
| 2007-01-08 | 10.931 |
| 2007-01-09 | 10.982 |
| 2007-01-10 | 11.022 |
| 2007-01-11 | 11.034 |
| 2007-01-12 | 11.032 |
| 2007-01-13 | 11.091 |
| 2007-01-14 | 11.152 |
| 2007-01-15 | 11.152 |
| 2007-01-16 | 11.129 |
| 2007-01-17 | 11.129 |
| 2007-01-18 | 11.159 |
| 2007-01-19 | 11.167 |
| 2007-01-20 | 11.205 |
| 2007-01-21 | 11.195 |
| 2007-01-22 | 11.17 |
| 2007-01-23 | 11.124 |
| 2007-01-24 | 11.059 |
| 2007-01-25 | 11.057 |
| 2007-01-26 | 11.083 |
| 2007-01-27 | 11.088 |
| 2007-01-28 | 11.06 |
| 2007-01-29 | 11.082 |
| 2007-01-30 | 11.075 |
| 2007-01-31 | 11.042 |
| 2007-02-01 | 11.008 |
| 2007-02-02 | 10.914 |
| 2007-02-03 | 10.884 |
| 2007-02-04 | 10.818 |
| 2007-02-05 | 10.805 |
| 2007-02-06 | 10.798 |
| 2007-02-07 | 10.718 |
| 2007-02-08 | 10.648 |
| 2007-02-09 | 10.63 |
| 2007-02-10 | 10.618 |
| 2007-02-11 | 10.643 |
| 2007-02-12 | 10.691 |
| 2007-02-13 | 10.674 |
| 2007-02-14 | 10.654 |
| 2007-02-15 | 10.63 |
| 2007-02-16 | 10.605 |
| 2007-02-17 | 10.593 |
| 2007-02-18 | 10.603 |
| 2007-02-19 | 10.603 |
| 2007-02-20 | 10.585 |
| 2007-02-21 | 10.558 |
| 2007-02-22 | 10.55 |
| 2007-02-23 | 10.583 |
| 2007-02-24 | 10.552 |
| 2007-02-25 | 10.521 |
| 2007-02-26 | 10.552 |
| 2007-02-27 | 10.922 |
| 2007-02-28 | 11.111 |
| 2007-03-01 | 11.342 |
| 2007-03-02 | 11.732 |
| 2007-03-03 | 11.804 |
| 2007-03-04 | 11.894 |
| 2007-03-05 | 12.281 |
| 2007-03-06 | 12.456 |
| 2007-03-07 | 12.68 |
| 2007-03-08 | 12.853 |
| 2007-03-09 | 13.032 |
| 2007-03-10 | 13.162 |
| 2007-03-11 | 13.271 |
| 2007-03-12 | 13.306 |
| 2007-03-13 | 13.536 |
| 2007-03-14 | 13.806 |
| 2007-03-15 | 14.096 |
| 2007-03-16 | 14.408 |
| 2007-03-17 | 14.618 |
| 2007-03-18 | 14.859 |
| 2007-03-19 | 14.846 |
| 2007-03-20 | 14.771 |
| 2007-03-21 | 14.654 |
| 2007-03-22 | 14.776 |
| 2007-03-23 | 14.901 |
| 2007-03-24 | 15.126 |
| 2007-03-25 | 15.353 |
| 2007-03-26 | 15.249 |
| 2007-03-27 | 15.168 |
| 2007-03-28 | 15.342 |
| 2007-03-29 | 15.198 |
| 2007-03-30 | 15.163 |
| 2007-03-31 | 15.131 |
| 2007-04-01 | 14.958 |
| 2007-04-02 | 14.937 |
| 2007-04-03 | 14.87 |
| 2007-04-04 | 14.58 |
| 2007-04-05 | 14.455 |
| 2007-04-06 | 14.418 |
| 2007-04-07 | 14.424 |
| 2007-04-08 | 14.442 |
| 2007-04-09 | 14.377 |
| 2007-04-10 | 14.296 |
| 2007-04-11 | 14.272 |
| 2007-04-12 | 14.014 |
| 2007-04-13 | 13.773 |
| 2007-04-14 | 13.64 |
| 2007-04-15 | 13.474 |
| 2007-04-16 | 13.4 |
| 2007-04-17 | 13.34 |
| 2007-04-18 | 13.236 |
| 2007-04-19 | 13.201 |
| 2007-04-20 | 13.196 |
| 2007-04-21 | 13.209 |
| 2007-04-22 | 13.223 |
| 2007-04-23 | 13.214 |
| 2007-04-24 | 13.209 |
| 2007-04-25 | 13.211 |
| 2007-04-26 | 13.179 |
| 2007-04-27 | 13.058 |
| 2007-04-28 | 12.954 |
| 2007-04-29 | 12.865 |
| 2007-04-30 | 12.933 |
| 2007-05-01 | 12.96 |
| 2007-05-02 | 12.891 |
| 2007-05-03 | 12.874 |
| 2007-05-04 | 12.858 |
| 2007-05-05 | 12.84 |
| 2007-05-06 | 12.84 |
| 2007-05-07 | 12.854 |
| 2007-05-08 | 12.87 |
| 2007-05-09 | 12.859 |
| 2007-05-10 | 12.9 |
| 2007-05-11 | 12.876 |
| 2007-05-12 | 12.884 |
| 2007-05-13 | 12.918 |
| 2007-05-14 | 12.968 |
| 2007-05-15 | 13.015 |
| 2007-05-16 | 13.084 |
| 2007-05-17 | 13.146 |
| 2007-05-18 | 13.162 |
| 2007-05-19 | 13.191 |
| 2007-05-20 | 13.247 |
| 2007-05-21 | 13.25 |
| 2007-05-22 | 13.241 |
| 2007-05-23 | 13.25 |
| 2007-05-24 | 13.294 |
| 2007-05-25 | 13.3 |
| 2007-05-26 | 13.324 |
| 2007-05-27 | 13.368 |
| 2007-05-28 | 13.368 |
| 2007-05-29 | 13.376 |
| 2007-05-30 | 13.31 |
| 2007-05-31 | 13.288 |
| 2007-06-01 | 13.273 |
| 2007-06-02 | 13.283 |
| 2007-06-03 | 13.302 |
| 2007-06-04 | 13.302 |
| 2007-06-05 | 13.317 |
| 2007-06-06 | 13.399 |
| 2007-06-07 | 13.582 |
| 2007-06-08 | 13.676 |
| 2007-06-09 | 13.68 |
| 2007-06-10 | 13.718 |
| 2007-06-11 | 13.767 |
| 2007-06-12 | 13.906 |
| 2007-06-13 | 13.942 |
| 2007-06-14 | 13.925 |
| 2007-06-15 | 13.946 |
| 2007-06-16 | 13.968 |
| 2007-06-17 | 14.031 |
| 2007-06-18 | 14.001 |
| 2007-06-19 | 13.946 |
| 2007-06-20 | 14.011 |
| 2007-06-21 | 14.066 |
| 2007-06-22 | 14.185 |
| 2007-06-23 | 14.19 |
| 2007-06-24 | 14.235 |
| 2007-06-25 | 14.356 |
| 2007-06-26 | 14.572 |
| 2007-06-27 | 14.615 |
| 2007-06-28 | 14.707 |
| 2007-06-29 | 14.861 |
| 2007-06-30 | 14.948 |
| 2007-07-01 | 15.056 |
| 2007-07-02 | 15.072 |
| 2007-07-03 | 15.065 |
| 2007-07-04 | 15.15 |
| 2007-07-05 | 15.238 |
| 2007-07-06 | 15.231 |
| 2007-07-07 | 15.14 |
| 2007-07-08 | 15.155 |
| 2007-07-09 | 15.156 |
| 2007-07-10 | 15.27 |
| 2007-07-11 | 15.362 |
| 2007-07-12 | 15.309 |
| 2007-07-13 | 15.329 |
| 2007-07-14 | 15.413 |
| 2007-07-15 | 15.491 |
| 2007-07-16 | 15.495 |
| 2007-07-17 | 15.502 |
| 2007-07-18 | 15.625 |
| 2007-07-19 | 15.738 |
| 2007-07-20 | 15.847 |
| 2007-07-21 | 15.928 |
| 2007-07-22 | 15.938 |
| 2007-07-23 | 15.982 |
| 2007-07-24 | 16.104 |
| 2007-07-25 | 16.173 |
| 2007-07-26 | 16.261 |
| 2007-07-27 | 16.672 |
| 2007-07-28 | 16.729 |
| 2007-07-29 | 16.755 |
| 2007-07-30 | 16.961 |
| 2007-07-31 | 17.273 |
| 2007-08-01 | 17.667 |
| 2007-08-02 | 17.967 |
| 2007-08-03 | 18.294 |
| 2007-08-04 | 18.428 |
| 2007-08-05 | 18.614 |
| 2007-08-06 | 18.82 |
| 2007-08-07 | 18.944 |
| 2007-08-08 | 19.23 |
| 2007-08-09 | 19.635 |
| 2007-08-10 | 20.165 |
| 2007-08-11 | 20.385 |
| 2007-08-12 | 20.647 |
| 2007-08-13 | 20.929 |
| 2007-08-14 | 21.236 |
| 2007-08-15 | 21.921 |
| 2007-08-16 | 22.612 |
| 2007-08-17 | 23.248 |
| 2007-08-18 | 23.63 |
| 2007-08-19 | 23.964 |
| 2007-08-20 | 24.077 |
| 2007-08-21 | 24.13 |
| 2007-08-22 | 24.406 |
| 2007-08-23 | 24.591 |
| 2007-08-24 | 24.71 |
| 2007-08-25 | 24.9 |
| 2007-08-26 | 24.936 |
| 2007-08-27 | 24.83 |
| 2007-08-28 | 24.897 |
| 2007-08-29 | 25.031 |
| 2007-08-30 | 25.101 |
| 2007-08-31 | 25.088 |
| 2007-09-01 | 25.272 |
| 2007-09-02 | 25.278 |
| 2007-09-03 | 25.278 |
| 2007-09-04 | 25.159 |
| 2007-09-05 | 25.237 |
| 2007-09-06 | 25.352 |
| 2007-09-07 | 25.58 |
| 2007-09-08 | 25.535 |
| 2007-09-09 | 25.389 |
| 2007-09-10 | 25.489 |
| 2007-09-11 | 25.479 |
| 2007-09-12 | 25.402 |
| 2007-09-13 | 25.263 |
| 2007-09-14 | 24.989 |
| 2007-09-15 | 24.697 |
| 2007-09-16 | 24.418 |
| 2007-09-17 | 24.522 |
| 2007-09-18 | 24.323 |
| 2007-09-19 | 24.023 |
| 2007-09-20 | 23.794 |
| 2007-09-21 | 23.609 |
| 2007-09-22 | 23.658 |
| 2007-09-23 | 23.813 |
| 2007-09-24 | 23.591 |
| 2007-09-25 | 23.353 |
| 2007-09-26 | 23.111 |
| 2007-09-27 | 22.668 |
| 2007-09-28 | 22.391 |
| 2007-09-29 | 22.258 |
| 2007-09-30 | 22.199 |
| 2007-10-01 | 21.981 |
| 2007-10-02 | 21.815 |
| 2007-10-03 | 21.678 |
| 2007-10-04 | 21.48 |
| 2007-10-05 | 21.132 |
| 2007-10-06 | 20.996 |
| 2007-10-07 | 20.734 |
| 2007-10-08 | 20.578 |
| 2007-10-09 | 20.375 |
| 2007-10-10 | 19.889 |
| 2007-10-11 | 19.598 |
| 2007-10-12 | 19.27 |
| 2007-10-13 | 19.008 |
| 2007-10-14 | 18.713 |
| 2007-10-15 | 18.738 |
| 2007-10-16 | 18.796 |
| 2007-10-17 | 18.435 |
| 2007-10-18 | 18.351 |
| 2007-10-19 | 18.485 |
| 2007-10-20 | 18.391 |
| 2007-10-21 | 18.36 |
| 2007-10-22 | 18.517 |
| 2007-10-23 | 18.603 |
| 2007-10-24 | 18.668 |
| 2007-10-25 | 18.785 |
| 2007-10-26 | 18.872 |
| 2007-10-27 | 18.961 |
| 2007-10-28 | 19.01 |
| 2007-10-29 | 19.05 |
| 2007-10-30 | 19.142 |
| 2007-10-31 | 19.174 |
| 2007-11-01 | 19.388 |
| 2007-11-02 | 19.58 |
| 2007-11-03 | 19.634 |
| 2007-11-04 | 19.77 |
| 2007-11-05 | 19.986 |
| 2007-11-06 | 20.05 |
| 2007-11-07 | 20.46 |
| 2007-11-08 | 20.917 |
| 2007-11-09 | 21.455 |
| 2007-11-10 | 21.577 |
| 2007-11-11 | 21.77 |
| 2007-11-12 | 22.213 |
| 2007-11-13 | 22.299 |
| 2007-11-14 | 22.603 |
| 2007-11-15 | 22.969 |
| 2007-11-16 | 23.285 |
| 2007-11-17 | 23.512 |
| 2007-11-18 | 23.54 |
| 2007-11-19 | 23.658 |
| 2007-11-20 | 23.713 |
| 2007-11-21 | 23.95 |
| 2007-11-22 | 24.118 |
| 2007-11-23 | 24.347 |
| 2007-11-24 | 24.506 |
| 2007-11-25 | 24.766 |
| 2007-11-26 | 24.974 |
| 2007-11-27 | 25.036 |
| 2007-11-28 | 25.238 |
| 2007-11-29 | 25.376 |
| 2007-11-30 | 25.582 |
| 2007-12-01 | 25.701 |
| 2007-12-02 | 25.843 |
| 2007-12-03 | 25.731 |
| 2007-12-04 | 25.639 |
| 2007-12-05 | 25.554 |
| 2007-12-06 | 25.533 |
| 2007-12-07 | 25.265 |
| 2007-12-08 | 25.22 |
| 2007-12-09 | 25.047 |
| 2007-12-10 | 24.832 |
| 2007-12-11 | 24.773 |
| 2007-12-12 | 24.362 |
| 2007-12-13 | 24.289 |
| 2007-12-14 | 24.162 |
| 2007-12-15 | 23.967 |
| 2007-12-16 | 23.887 |
| 2007-12-17 | 23.918 |
| 2007-12-18 | 23.858 |
| 2007-12-19 | 23.651 |
| 2007-12-20 | 23.447 |
| 2007-12-21 | 23.048 |
| 2007-12-22 | 23.048 |
| 2007-12-23 | 22.92 |
| 2007-12-24 | 22.714 |
| 2007-12-25 | 22.714 |
| 2007-12-26 | 22.226 |
| 2007-12-27 | 21.94 |
| 2007-12-28 | 21.779 |
| 2007-12-29 | 21.67 |
| 2007-12-30 | 21.606 |
| 2007-12-31 | 21.651 |
| 2008-01-01 | 21.651 |
| 2008-01-02 | 21.629 |
| 2008-01-03 | 21.564 |
| 2008-01-04 | 21.635 |
| 2008-01-05 | 21.67 |
| 2008-01-06 | 21.716 |
| 2008-01-07 | 21.825 |
| 2008-01-08 | 22.005 |
| 2008-01-09 | 22.174 |
| 2008-01-10 | 22.167 |
| 2008-01-11 | 22.228 |
| 2008-01-12 | 22.21 |
| 2008-01-13 | 22.151 |
| 2008-01-14 | 22.191 |
| 2008-01-15 | 22.248 |
| 2008-01-16 | 22.241 |
| 2008-01-17 | 22.532 |
| 2008-01-18 | 22.807 |
| 2008-01-19 | 22.924 |
| 2008-01-20 | 23.172 |
| 2008-01-21 | 23.172 |
| 2008-01-22 | 23.584 |
| 2008-01-23 | 24.133 |
| 2008-01-24 | 24.315 |
| 2008-01-25 | 24.836 |
| 2008-01-26 | 25.077 |
| 2008-01-27 | 25.318 |
| 2008-01-28 | 25.447 |
| 2008-01-29 | 25.541 |
| 2008-01-30 | 25.797 |
| 2008-01-31 | 25.816 |
| 2008-02-01 | 25.857 |
| 2008-02-02 | 26.025 |
| 2008-02-03 | 26.135 |
| 2008-02-04 | 26.127 |
| 2008-02-05 | 26.228 |
| 2008-02-06 | 26.475 |
| 2008-02-07 | 26.581 |
| 2008-02-08 | 26.766 |
| 2008-02-09 | 26.932 |
| 2008-02-10 | 27.103 |
| 2008-02-11 | 27.128 |
| 2008-02-12 | 27.09 |
| 2008-02-13 | 27.184 |
| 2008-02-14 | 27.289 |
| 2008-02-15 | 27.32 |
| 2008-02-16 | 27.262 |
| 2008-02-17 | 27.267 |
| 2008-02-18 | 27.267 |
| 2008-02-19 | 27.183 |
| 2008-02-20 | 27.05 |
| 2008-02-21 | 26.77 |
| 2008-02-22 | 26.534 |
| 2008-02-23 | 26.472 |
| 2008-02-24 | 26.334 |
| 2008-02-25 | 26.169 |
| 2008-02-26 | 25.966 |
| 2008-02-27 | 25.723 |
| 2008-02-28 | 25.543 |
| 2008-02-29 | 25.491 |
| 2008-03-01 | 25.456 |
| 2008-03-02 | 25.532 |
| 2008-03-03 | 25.569 |
| 2008-03-04 | 25.567 |
| 2008-03-05 | 25.5 |
| 2008-03-06 | 25.468 |
| 2008-03-07 | 25.397 |
| 2008-03-08 | 25.284 |
| 2008-03-09 | 25.141 |
| 2008-03-10 | 25.353 |
| 2008-03-11 | 25.4 |
| 2008-03-12 | 25.382 |
| 2008-03-13 | 25.428 |
| 2008-03-14 | 25.727 |
| 2008-03-15 | 25.736 |
| 2008-03-16 | 25.774 |
| 2008-03-17 | 26.098 |
| 2008-03-18 | 26.083 |
| 2008-03-19 | 26.254 |
| 2008-03-20 | 26.3 |
| 2008-03-21 | 26.391 |
| 2008-03-22 | 26.455 |
| 2008-03-23 | 26.581 |
| 2008-03-24 | 26.538 |
| 2008-03-25 | 26.499 |
| 2008-03-26 | 26.644 |
| 2008-03-27 | 26.834 |
| 2008-03-28 | 26.978 |
| 2008-03-29 | 27.15 |
| 2008-03-30 | 27.182 |
| 2008-03-31 | 27.104 |
| 2008-04-01 | 26.893 |
| 2008-04-02 | 26.757 |
| 2008-04-03 | 26.647 |
| 2008-04-04 | 26.545 |
| 2008-04-05 | 26.494 |
| 2008-04-06 | 26.442 |
| 2008-04-07 | 26.241 |
| 2008-04-08 | 26.056 |
| 2008-04-09 | 25.743 |
| 2008-04-10 | 25.535 |
| 2008-04-11 | 25.356 |
| 2008-04-12 | 25.259 |
| 2008-04-13 | 24.948 |
| 2008-04-14 | 24.892 |
| 2008-04-15 | 24.791 |
| 2008-04-16 | 24.234 |
| 2008-04-17 | 23.976 |
| 2008-04-18 | 23.513 |
| 2008-04-19 | 23.358 |
| 2008-04-20 | 23.358 |
| 2008-04-21 | 23.222 |
| 2008-04-22 | 23.115 |
| 2008-04-23 | 22.866 |
| 2008-04-24 | 22.609 |
| 2008-04-25 | 22.314 |
| 2008-04-26 | 22.144 |
| 2008-04-27 | 21.966 |
| 2008-04-28 | 21.855 |
| 2008-04-29 | 21.782 |
| 2008-04-30 | 21.563 |
| 2008-05-01 | 21.39 |
| 2008-05-02 | 21.151 |
| 2008-05-03 | 21.053 |
| 2008-05-04 | 20.984 |
| 2008-05-05 | 20.884 |
| 2008-05-06 | 20.763 |
| 2008-05-07 | 20.64 |
| 2008-05-08 | 20.506 |
| 2008-05-09 | 20.351 |
| 2008-05-10 | 20.274 |
| 2008-05-11 | 20.114 |
| 2008-05-12 | 20.004 |
| 2008-05-13 | 19.912 |
| 2008-05-14 | 19.632 |
| 2008-05-15 | 19.337 |
| 2008-05-16 | 19.153 |
| 2008-05-17 | 19.095 |
| 2008-05-18 | 19.043 |
| 2008-05-19 | 18.946 |
| 2008-05-20 | 18.884 |
| 2008-05-21 | 18.797 |
| 2008-05-22 | 18.669 |
| 2008-05-23 | 18.637 |
| 2008-05-24 | 18.569 |
| 2008-05-25 | 18.518 |
| 2008-05-26 | 18.518 |
| 2008-05-27 | 18.571 |
| 2008-05-28 | 18.544 |
| 2008-05-29 | 18.444 |
| 2008-05-30 | 18.303 |
| 2008-05-31 | 18.274 |
| 2008-06-01 | 18.279 |
| 2008-06-02 | 18.357 |
| 2008-06-03 | 18.447 |
| 2008-06-04 | 18.537 |
| 2008-06-05 | 18.557 |
| 2008-06-06 | 18.74 |
| 2008-06-07 | 18.706 |
| 2008-06-08 | 18.669 |
| 2008-06-09 | 18.892 |
| 2008-06-10 | 19.096 |
| 2008-06-11 | 19.398 |
| 2008-06-12 | 19.652 |
| 2008-06-13 | 19.822 |
| 2008-06-14 | 19.998 |
| 2008-06-15 | 20.184 |
| 2008-06-16 | 20.222 |
| 2008-06-17 | 20.265 |
| 2008-06-18 | 20.514 |
| 2008-06-19 | 20.705 |
| 2008-06-20 | 20.909 |
| 2008-06-21 | 21.051 |
| 2008-06-22 | 21.131 |
| 2008-06-23 | 21.206 |
| 2008-06-24 | 21.264 |
| 2008-06-25 | 21.258 |
| 2008-06-26 | 21.453 |
| 2008-06-27 | 21.652 |
| 2008-06-28 | 21.819 |
| 2008-06-29 | 22.018 |
| 2008-06-30 | 22.11 |
| 2008-07-01 | 22.18 |
| 2008-07-02 | 22.457 |
| 2008-07-03 | 22.664 |
| 2008-07-04 | 22.752 |
| 2008-07-05 | 22.958 |
| 2008-07-06 | 22.927 |
| 2008-07-07 | 23.069 |
| 2008-07-08 | 23.073 |
| 2008-07-09 | 23.174 |
| 2008-07-10 | 23.289 |
| 2008-07-11 | 23.449 |
| 2008-07-12 | 23.455 |
| 2008-07-13 | 23.573 |
| 2008-07-14 | 23.818 |
| 2008-07-15 | 24.043 |
| 2008-07-16 | 24.24 |
| 2008-07-17 | 24.425 |
| 2008-07-18 | 24.511 |
| 2008-07-19 | 24.658 |
| 2008-07-20 | 24.752 |
| 2008-07-21 | 24.667 |
| 2008-07-22 | 24.501 |
| 2008-07-23 | 24.438 |
| 2008-07-24 | 24.486 |
| 2008-07-25 | 24.57 |
| 2008-07-26 | 24.603 |
| 2008-07-27 | 24.664 |
| 2008-07-28 | 24.642 |
| 2008-07-29 | 24.518 |
| 2008-07-30 | 24.387 |
| 2008-07-31 | 24.353 |
| 2008-08-01 | 24.194 |
| 2008-08-02 | 24.164 |
| 2008-08-03 | 24.164 |
| 2008-08-04 | 24.132 |
| 2008-08-05 | 23.996 |
| 2008-08-06 | 23.744 |
| 2008-08-07 | 23.653 |
| 2008-08-08 | 23.445 |
| 2008-08-09 | 23.343 |
| 2008-08-10 | 23.136 |
| 2008-08-11 | 22.992 |
| 2008-08-12 | 22.91 |
| 2008-08-13 | 22.595 |
| 2008-08-14 | 22.222 |
| 2008-08-15 | 21.971 |
| 2008-08-16 | 21.826 |
| 2008-08-17 | 21.715 |
| 2008-08-18 | 21.68 |
| 2008-08-19 | 21.662 |
| 2008-08-20 | 21.542 |
| 2008-08-21 | 21.48 |
| 2008-08-22 | 21.367 |
| 2008-08-23 | 21.268 |
| 2008-08-24 | 21.186 |
| 2008-08-25 | 21.176 |
| 2008-08-26 | 21.145 |
| 2008-08-27 | 20.941 |
| 2008-08-28 | 20.823 |
| 2008-08-29 | 20.798 |
| 2008-08-30 | 20.696 |
| 2008-08-31 | 20.602 |
| 2008-09-01 | 20.602 |
| 2008-09-02 | 20.668 |
| 2008-09-03 | 20.57 |
| 2008-09-04 | 20.708 |
| 2008-09-05 | 20.842 |
| 2008-09-06 | 20.827 |
| 2008-09-07 | 20.836 |
| 2008-09-08 | 20.926 |
| 2008-09-09 | 21.142 |
| 2008-09-10 | 21.352 |
| 2008-09-11 | 21.505 |
| 2008-09-12 | 21.701 |
| 2008-09-13 | 21.769 |
| 2008-09-14 | 21.884 |
| 2008-09-15 | 22.375 |
| 2008-09-16 | 22.752 |
| 2008-09-17 | 23.478 |
| 2008-09-18 | 24.041 |
| 2008-09-19 | 24.596 |
| 2008-09-20 | 24.834 |
| 2008-09-21 | 25.152 |
| 2008-09-22 | 25.587 |
| 2008-09-23 | 26.069 |
| 2008-09-24 | 26.746 |
| 2008-09-25 | 27.333 |
| 2008-09-26 | 28.047 |
| 2008-09-27 | 28.478 |
| 2008-09-28 | 28.889 |
| 2008-09-29 | 29.781 |
| 2008-09-30 | 30.239 |
| 2008-10-01 | 30.674 |
| 2008-10-02 | 31.731 |
| 2008-10-03 | 32.809 |
| 2008-10-04 | 33.227 |
| 2008-10-05 | 33.735 |
| 2008-10-06 | 34.608 |
| 2008-10-07 | 35.475 |
| 2008-10-08 | 37.06 |
| 2008-10-09 | 38.808 |
| 2008-10-10 | 40.873 |
| 2008-10-11 | 41.658 |
| 2008-10-12 | 42.458 |
| 2008-10-13 | 43.055 |
| 2008-10-14 | 43.604 |
| 2008-10-15 | 45.31 |
| 2008-10-16 | 47.006 |
| 2008-10-17 | 48.557 |
| 2008-10-18 | 49.293 |
| 2008-10-19 | 50.154 |
| 2008-10-20 | 50.288 |
| 2008-10-21 | 50.416 |
| 2008-10-22 | 52.044 |
| 2008-10-23 | 53.502 |
| 2008-10-24 | 55.499 |
| 2008-10-25 | 56.579 |
| 2008-10-26 | 57.671 |
| 2008-10-27 | 58.737 |
| 2008-10-28 | 59.111 |
| 2008-10-29 | 60.167 |
| 2008-10-30 | 61.236 |
| 2008-10-31 | 62.149 |
| 2008-11-01 | 62.953 |
| 2008-11-02 | 63.844 |
| 2008-11-03 | 63.36 |
| 2008-11-04 | 62.649 |
| 2008-11-05 | 62.763 |
| 2008-11-06 | 63.218 |
| 2008-11-07 | 63.153 |
| 2008-11-08 | 63.116 |
| 2008-11-09 | 62.774 |
| 2008-11-10 | 62.641 |
| 2008-11-11 | 62.587 |
| 2008-11-12 | 63.108 |
| 2008-11-13 | 63.322 |
| 2008-11-14 | 63.188 |
| 2008-11-15 | 62.978 |
| 2008-11-16 | 62.61 |
| 2008-11-17 | 62.921 |
| 2008-11-18 | 63.136 |
| 2008-11-19 | 64.104 |
| 2008-11-20 | 65.365 |
| 2008-11-21 | 65.502 |
| 2008-11-22 | 65.393 |
| 2008-11-23 | 64.706 |
| 2008-11-24 | 64.706 |
| 2008-11-25 | 64.533 |
| 2008-11-26 | 63.39 |
| 2008-11-27 | 63.22 |
| 2008-11-28 | 62.521 |
| 2008-11-29 | 62.502 |
| 2008-11-30 | 62.639 |
| 2008-12-01 | 62.933 |
| 2008-12-02 | 62.935 |
| 2008-12-03 | 63.27 |
| 2008-12-04 | 64.028 |
| 2008-12-05 | 64.284 |
| 2008-12-06 | 64.314 |
| 2008-12-07 | 64.746 |
| 2008-12-08 | 64.434 |
| 2008-12-09 | 64.17 |
| 2008-12-10 | 63.968 |
| 2008-12-11 | 63.699 |
| 2008-12-12 | 63.119 |
| 2008-12-13 | 63.283 |
| 2008-12-14 | 63.124 |
| 2008-12-15 | 62.805 |
| 2008-12-16 | 62.309 |
| 2008-12-17 | 61.389 |
| 2008-12-18 | 60.422 |
| 2008-12-19 | 59.026 |
| 2008-12-20 | 57.934 |
| 2008-12-21 | 57.158 |
| 2008-12-22 | 56.528 |
| 2008-12-23 | 55.98 |
| 2008-12-24 | 55.005 |
| 2008-12-25 | 54.71 |
| 2008-12-26 | 54.133 |
| 2008-12-27 | 54.133 |
| 2008-12-28 | 54.073 |
| 2008-12-29 | 53.564 |
| 2008-12-30 | 52.996 |
| 2008-12-31 | 51.638 |
| 2009-01-01 | 51.071 |
| 2009-01-02 | 49.994 |
| 2009-01-03 | 49.276 |
| 2009-01-04 | 48.684 |
| 2009-01-05 | 48.179 |
| 2009-01-06 | 47.698 |
| 2009-01-07 | 46.943 |
| 2009-01-08 | 46.126 |
| 2009-01-09 | 45.48 |
| 2009-01-10 | 44.938 |
| 2009-01-11 | 44.419 |
| 2009-01-12 | 44.494 |
| 2009-01-13 | 44.433 |
| 2009-01-14 | 44.052 |
| 2009-01-15 | 43.983 |
| 2009-01-16 | 43.796 |
| 2009-01-17 | 43.61 |
| 2009-01-18 | 43.537 |
| 2009-01-19 | 43.537 |
| 2009-01-20 | 44.227 |
| 2009-01-21 | 44.325 |
| 2009-01-22 | 44.444 |
| 2009-01-23 | 44.605 |
| 2009-01-24 | 44.605 |
| 2009-01-25 | 44.673 |
| 2009-01-26 | 44.727 |
| 2009-01-27 | 44.603 |
| 2009-01-28 | 44.391 |
| 2009-01-29 | 44.441 |
| 2009-01-30 | 44.683 |
| 2009-01-31 | 44.683 |
| 2009-02-01 | 44.972 |
| 2009-02-02 | 45 |
| 2009-02-03 | 44.907 |
| 2009-02-04 | 45.134 |
| 2009-02-05 | 45.38 |
| 2009-02-06 | 45.38 |
| 2009-02-07 | 45.521 |
| 2009-02-08 | 45.663 |
| 2009-02-09 | 45.562 |
| 2009-02-10 | 45.614 |
| 2009-02-11 | 45.552 |
| 2009-02-12 | 45.456 |
| 2009-02-13 | 45.16 |
| 2009-02-14 | 44.868 |
| 2009-02-15 | 44.803 |
| 2009-02-16 | 44.803 |
| 2009-02-17 | 44.995 |
| 2009-02-18 | 45.16 |
| 2009-02-19 | 44.705 |
| 2009-02-20 | 44.842 |
| 2009-02-21 | 44.72 |
| 2009-02-22 | 44.585 |
| 2009-02-23 | 44.987 |
| 2009-02-24 | 45.011 |
| 2009-02-25 | 44.962 |
| 2009-02-26 | 45.077 |
| 2009-02-27 | 45.396 |
| 2009-02-28 | 45.534 |
| 2009-03-01 | 45.571 |
| 2009-03-02 | 45.924 |
| 2009-03-03 | 46.163 |
| 2009-03-04 | 46.26 |
| 2009-03-05 | 46.599 |
| 2009-03-06 | 46.86 |
| 2009-03-07 | 47.016 |
| 2009-03-08 | 47.208 |
| 2009-03-09 | 47.331 |
| 2009-03-10 | 47.19 |
| 2009-03-11 | 47.189 |
| 2009-03-12 | 46.928 |
| 2009-03-13 | 46.824 |
| 2009-03-14 | 47.103 |
| 2009-03-15 | 47.323 |
| 2009-03-16 | 47.144 |
| 2009-03-17 | 46.841 |
| 2009-03-18 | 46.533 |
| 2009-03-19 | 46.307 |
| 2009-03-20 | 46.19 |
| 2009-03-21 | 46.148 |
| 2009-03-22 | 45.99 |
| 2009-03-23 | 45.859 |
| 2009-03-24 | 45.725 |
| 2009-03-25 | 45.254 |
| 2009-03-26 | 45.021 |
| 2009-03-27 | 44.856 |
| 2009-03-28 | 44.865 |
| 2009-03-29 | 44.791 |
| 2009-03-30 | 44.827 |
| 2009-03-31 | 44.795 |
| 2009-04-01 | 44.324 |
| 2009-04-02 | 43.92 |
| 2009-04-03 | 43.563 |
| 2009-04-04 | 43.248 |
| 2009-04-05 | 42.944 |
| 2009-04-06 | 42.848 |
| 2009-04-07 | 42.736 |
| 2009-04-08 | 42.244 |
| 2009-04-09 | 41.888 |
| 2009-04-10 | 41.806 |
| 2009-04-11 | 41.837 |
| 2009-04-12 | 41.809 |
| 2009-04-13 | 41.61 |
| 2009-04-14 | 41.422 |
| 2009-04-15 | 41.061 |
| 2009-04-16 | 40.823 |
| 2009-04-17 | 40.531 |
| 2009-04-18 | 40.374 |
| 2009-04-19 | 40.084 |
| 2009-04-20 | 40.038 |
| 2009-04-21 | 39.9 |
| 2009-04-22 | 39.656 |
| 2009-04-23 | 39.381 |
| 2009-04-24 | 39.122 |
| 2009-04-25 | 39.06 |
| 2009-04-26 | 38.956 |
| 2009-04-27 | 38.924 |
| 2009-04-28 | 38.878 |
| 2009-04-29 | 38.428 |
| 2009-04-30 | 38.064 |
| 2009-05-01 | 37.731 |
| 2009-05-02 | 37.516 |
| 2009-05-03 | 37.401 |
| 2009-05-04 | 37.258 |
| 2009-05-05 | 37.072 |
| 2009-05-06 | 36.668 |
| 2009-05-07 | 36.337 |
| 2009-05-08 | 36.013 |
| 2009-05-09 | 35.987 |
| 2009-05-10 | 35.987 |
| 2009-05-11 | 35.839 |
| 2009-05-12 | 35.655 |
| 2009-05-13 | 35.466 |
| 2009-05-14 | 35.18 |
| 2009-05-15 | 35.041 |
| 2009-05-16 | 35.006 |
| 2009-05-17 | 35.059 |
| 2009-05-18 | 34.83 |
| 2009-05-19 | 34.555 |
| 2009-05-20 | 34.094 |
| 2009-05-21 | 33.831 |
| 2009-05-22 | 33.582 |
| 2009-05-23 | 33.412 |
| 2009-05-24 | 33.242 |
| 2009-05-25 | 33.242 |
| 2009-05-26 | 33.117 |
| 2009-05-27 | 32.833 |
| 2009-05-28 | 32.534 |
| 2009-05-29 | 32.193 |
| 2009-05-30 | 31.978 |
| 2009-05-31 | 31.803 |
| 2009-06-01 | 31.715 |
| 2009-06-02 | 31.616 |
| 2009-06-03 | 31.449 |
| 2009-06-04 | 31.297 |
| 2009-06-05 | 31.162 |
| 2009-06-06 | 31.048 |
| 2009-06-07 | 30.996 |
| 2009-06-08 | 30.935 |
| 2009-06-09 | 30.808 |
| 2009-06-10 | 30.598 |
| 2009-06-11 | 30.422 |
| 2009-06-12 | 30.16 |
| 2009-06-13 | 30.1 |
| 2009-06-14 | 29.941 |
| 2009-06-15 | 29.984 |
| 2009-06-16 | 30.112 |
| 2009-06-17 | 30.174 |
| 2009-06-18 | 30.233 |
| 2009-06-19 | 30.183 |
| 2009-06-20 | 30.125 |
| 2009-06-21 | 29.993 |
| 2009-06-22 | 30.052 |
| 2009-06-23 | 30.077 |
| 2009-06-24 | 30.03 |
| 2009-06-25 | 29.837 |
| 2009-06-26 | 29.545 |
| 2009-06-27 | 29.443 |
| 2009-06-28 | 29.47 |
| 2009-06-29 | 29.273 |
| 2009-06-30 | 29.14 |
| 2009-07-01 | 28.967 |
| 2009-07-02 | 28.89 |
| 2009-07-03 | 28.789 |
| 2009-07-04 | 28.72 |
| 2009-07-05 | 28.672 |
| 2009-07-06 | 28.689 |
| 2009-07-07 | 28.791 |
| 2009-07-08 | 28.864 |
| 2009-07-09 | 28.936 |
| 2009-07-10 | 28.963 |
| 2009-07-11 | 29.006 |
| 2009-07-12 | 29.051 |
| 2009-07-13 | 28.914 |
| 2009-07-14 | 28.728 |
| 2009-07-15 | 28.494 |
| 2009-07-16 | 28.148 |
| 2009-07-17 | 27.805 |
| 2009-07-18 | 27.694 |
| 2009-07-19 | 27.678 |
| 2009-07-20 | 27.514 |
| 2009-07-21 | 27.341 |
| 2009-07-22 | 26.974 |
| 2009-07-23 | 26.634 |
| 2009-07-24 | 26.35 |
| 2009-07-25 | 26.349 |
| 2009-07-26 | 26.372 |
| 2009-07-27 | 26.267 |
| 2009-07-28 | 26.207 |
| 2009-07-29 | 26.22 |
| 2009-07-30 | 26.174 |
| 2009-07-31 | 26.16 |
| 2009-08-01 | 26.07 |
| 2009-08-02 | 26.07 |
| 2009-08-03 | 26.046 |
| 2009-08-04 | 25.994 |
| 2009-08-05 | 25.807 |
| 2009-08-06 | 25.572 |
| 2009-08-07 | 25.275 |
| 2009-08-08 | 25.06 |
| 2009-08-09 | 24.862 |
| 2009-08-10 | 24.868 |
| 2009-08-11 | 24.919 |
| 2009-08-12 | 24.88 |
| 2009-08-13 | 24.866 |
| 2009-08-14 | 24.792 |
| 2009-08-15 | 24.762 |
| 2009-08-16 | 24.783 |
| 2009-08-17 | 24.931 |
| 2009-08-18 | 24.988 |
| 2009-08-19 | 25.073 |
| 2009-08-20 | 25.128 |
| 2009-08-21 | 25.198 |
| 2009-08-22 | 25.282 |
| 2009-08-23 | 25.392 |
| 2009-08-24 | 25.38 |
| 2009-08-25 | 25.359 |
| 2009-08-26 | 25.39 |
| 2009-08-27 | 25.375 |
| 2009-08-28 | 25.336 |
| 2009-08-29 | 25.333 |
| 2009-08-30 | 25.304 |
| 2009-08-31 | 25.337 |
| 2009-09-01 | 25.51 |
| 2009-09-02 | 25.662 |
| 2009-09-03 | 25.763 |
| 2009-09-04 | 25.779 |
| 2009-09-05 | 25.784 |
| 2009-09-06 | 25.835 |
| 2009-09-07 | 25.835 |
| 2009-09-08 | 25.825 |
| 2009-09-09 | 25.793 |
| 2009-09-10 | 25.677 |
| 2009-09-11 | 25.615 |
| 2009-09-12 | 25.66 |
| 2009-09-13 | 25.734 |
| 2009-09-14 | 25.64 |
| 2009-09-15 | 25.534 |
| 2009-09-16 | 25.334 |
| 2009-09-17 | 25.214 |
| 2009-09-18 | 25.102 |
| 2009-09-19 | 25.103 |
| 2009-09-20 | 25.108 |
| 2009-09-21 | 25.056 |
| 2009-09-22 | 24.961 |
| 2009-09-23 | 24.883 |
| 2009-09-24 | 24.884 |
| 2009-09-25 | 24.916 |
| 2009-09-26 | 24.928 |
| 2009-09-27 | 24.936 |
| 2009-09-28 | 24.934 |
| 2009-09-29 | 24.946 |
| 2009-09-30 | 24.927 |
| 2009-10-01 | 24.885 |
| 2009-10-02 | 24.874 |
| 2009-10-03 | 24.763 |
| 2009-10-04 | 24.737 |
| 2009-10-05 | 24.842 |
| 2009-10-06 | 24.883 |
| 2009-10-07 | 24.874 |
| 2009-10-08 | 24.808 |
| 2009-10-09 | 24.754 |
| 2009-10-10 | 24.811 |
| 2009-10-11 | 24.844 |
| 2009-10-12 | 24.757 |
| 2009-10-13 | 24.676 |
| 2009-10-14 | 24.631 |
| 2009-10-15 | 24.554 |
| 2009-10-16 | 24.451 |
| 2009-10-17 | 24.489 |
| 2009-10-18 | 24.518 |
| 2009-10-19 | 24.373 |
| 2009-10-20 | 24.215 |
| 2009-10-21 | 24.132 |
| 2009-10-22 | 24.023 |
| 2009-10-23 | 23.968 |
| 2009-10-24 | 23.921 |
| 2009-10-25 | 23.836 |
| 2009-10-26 | 23.859 |
| 2009-10-27 | 23.903 |
| 2009-10-28 | 24.041 |
| 2009-10-29 | 24.021 |
| 2009-10-30 | 24.252 |
| 2009-10-31 | 24.061 |
| 2009-11-01 | 23.83 |
| 2009-11-02 | 24.113 |
| 2009-11-03 | 24.327 |
| 2009-11-04 | 24.367 |
| 2009-11-05 | 24.355 |
| 2009-11-06 | 24.332 |
| 2009-11-07 | 24.34 |
| 2009-11-08 | 24.4 |
| 2009-11-09 | 24.341 |
| 2009-11-10 | 24.273 |
| 2009-11-11 | 24.274 |
| 2009-11-12 | 24.331 |
| 2009-11-13 | 24.354 |
| 2009-11-14 | 24.479 |
| 2009-11-15 | 24.632 |
| 2009-11-16 | 24.549 |
| 2009-11-17 | 24.451 |
| 2009-11-18 | 24.458 |
| 2009-11-19 | 24.536 |
| 2009-11-20 | 24.535 |
| 2009-11-21 | 24.718 |
| 2009-11-22 | 24.84 |
| 2009-11-23 | 24.665 |
| 2009-11-24 | 24.475 |
| 2009-11-25 | 24.3 |
| 2009-11-26 | 24.275 |
| 2009-11-27 | 24.124 |
| 2009-11-28 | 24.092 |
| 2009-11-29 | 23.745 |
| 2009-11-30 | 23.784 |
| 2009-12-01 | 23.695 |
| 2009-12-02 | 23.282 |
| 2009-12-03 | 22.98 |
| 2009-12-04 | 22.672 |
| 2009-12-05 | 22.534 |
| 2009-12-06 | 22.447 |
| 2009-12-07 | 22.43 |
| 2009-12-08 | 22.49 |
| 2009-12-09 | 22.466 |
| 2009-12-10 | 22.441 |
| 2009-12-11 | 22.372 |
| 2009-12-12 | 22.279 |
| 2009-12-13 | 22.222 |
| 2009-12-14 | 22.168 |
| 2009-12-15 | 22.136 |
| 2009-12-16 | 22.024 |
| 2009-12-17 | 22.029 |
| 2009-12-18 | 22.031 |
| 2009-12-19 | 22.002 |
| 2009-12-20 | 21.992 |
| 2009-12-21 | 21.916 |
| 2009-12-22 | 21.803 |
| 2009-12-23 | 21.734 |
| 2009-12-24 | 21.687 |
| 2009-12-25 | 21.747 |
| 2009-12-26 | 21.747 |
| 2009-12-27 | 21.589 |
| 2009-12-28 | 21.507 |
| 2009-12-29 | 21.435 |
| 2009-12-30 | 21.219 |
| 2009-12-31 | 21.207 |
| 2010-01-01 | 21.211 |
| 2010-01-02 | 21.146 |
| 2010-01-03 | 21.14 |
| 2010-01-04 | 21.082 |
| 2010-01-05 | 20.996 |
| 2010-01-06 | 20.849 |
| 2010-01-07 | 20.617 |
| 2010-01-08 | 20.391 |
| 2010-01-09 | 20.289 |
| 2010-01-10 | 20.217 |
| 2010-01-11 | 20.076 |
| 2010-01-12 | 19.985 |
| 2010-01-13 | 19.82 |
| 2010-01-14 | 19.627 |
| 2010-01-15 | 19.496 |
| 2010-01-16 | 19.337 |
| 2010-01-17 | 19.207 |
| 2010-01-18 | 19.207 |
| 2010-01-19 | 19.121 |
| 2010-01-20 | 19.026 |
| 2010-01-21 | 19.169 |
| 2010-01-22 | 19.569 |
| 2010-01-23 | 19.575 |
| 2010-01-24 | 19.575 |
| 2010-01-25 | 19.882 |
| 2010-01-26 | 20.116 |
| 2010-01-27 | 20.276 |
| 2010-01-28 | 20.462 |
| 2010-01-29 | 20.695 |
| 2010-01-30 | 20.643 |
| 2010-01-31 | 20.643 |
| 2010-02-01 | 20.74 |
| 2010-02-02 | 20.776 |
| 2010-02-03 | 20.85 |
| 2010-02-04 | 21.17 |
| 2010-02-05 | 21.501 |
| 2010-02-06 | 21.624 |
| 2010-02-07 | 21.807 |
| 2010-02-08 | 22.042 |
| 2010-02-09 | 22.231 |
| 2010-02-10 | 22.605 |
| 2010-02-11 | 22.877 |
| 2010-02-12 | 23.109 |
| 2010-02-13 | 23.383 |
| 2010-02-14 | 23.671 |
| 2010-02-15 | 23.671 |
| 2010-02-16 | 23.6 |
| 2010-02-17 | 23.51 |
| 2010-02-18 | 23.656 |
| 2010-02-19 | 23.72 |
| 2010-02-20 | 23.792 |
| 2010-02-21 | 23.607 |
| 2010-02-22 | 23.423 |
| 2010-02-23 | 23.326 |
| 2010-02-24 | 23.081 |
| 2010-02-25 | 22.869 |
| 2010-02-26 | 22.696 |
| 2010-02-27 | 22.644 |
| 2010-02-28 | 22.54 |
| 2010-03-01 | 22.376 |
| 2010-03-02 | 22.218 |
| 2010-03-03 | 22.039 |
| 2010-03-04 | 21.908 |
| 2010-03-05 | 21.709 |
| 2010-03-06 | 21.49 |
| 2010-03-07 | 21.247 |
| 2010-03-08 | 21.074 |
| 2010-03-09 | 20.924 |
| 2010-03-10 | 20.546 |
| 2010-03-11 | 20.168 |
| 2010-03-12 | 19.795 |
| 2010-03-13 | 19.587 |
| 2010-03-14 | 19.422 |
| 2010-03-15 | 19.35 |
| 2010-03-16 | 19.271 |
| 2010-03-17 | 19.164 |
| 2010-03-18 | 18.908 |
| 2010-03-19 | 18.692 |
| 2010-03-20 | 18.6 |
| 2010-03-21 | 18.529 |
| 2010-03-22 | 18.45 |
| 2010-03-23 | 18.355 |
| 2010-03-24 | 18.246 |
| 2010-03-25 | 18.111 |
| 2010-03-26 | 17.997 |
| 2010-03-27 | 17.897 |
| 2010-03-28 | 17.817 |
| 2010-03-29 | 17.806 |
| 2010-03-30 | 17.775 |
| 2010-03-31 | 17.7 |
| 2010-04-01 | 17.627 |
| 2010-04-02 | 17.57 |
| 2010-04-03 | 17.512 |
| 2010-04-04 | 17.517 |
| 2010-04-05 | 17.492 |
| 2010-04-06 | 17.432 |
| 2010-04-07 | 17.377 |
| 2010-04-08 | 17.308 |
| 2010-04-09 | 17.192 |
| 2010-04-10 | 17.149 |
| 2010-04-11 | 17.126 |
| 2010-04-12 | 17.049 |
| 2010-04-13 | 17.009 |
| 2010-04-14 | 16.894 |
| 2010-04-15 | 16.808 |
| 2010-04-16 | 16.877 |
| 2010-04-17 | 16.89 |
| 2010-04-18 | 16.886 |
| 2010-04-19 | 16.908 |
| 2010-04-20 | 16.852 |
| 2010-04-21 | 16.826 |
| 2010-04-22 | 16.832 |
| 2010-04-23 | 16.788 |
| 2010-04-24 | 16.707 |
| 2010-04-25 | 16.651 |
| 2010-04-26 | 16.692 |
| 2010-04-27 | 16.983 |
| 2010-04-28 | 17.15 |
| 2010-04-29 | 17.212 |
| 2010-04-30 | 17.424 |
| 2010-05-01 | 17.422 |
| 2010-05-02 | 17.422 |
| 2010-05-03 | 17.554 |
| 2010-05-04 | 17.84 |
| 2010-05-05 | 18.198 |
| 2010-05-06 | 18.951 |
| 2010-05-07 | 20.057 |
| 2010-05-08 | 20.228 |
| 2010-05-09 | 20.432 |
| 2010-05-10 | 20.832 |
| 2010-05-11 | 21.173 |
| 2010-05-12 | 21.625 |
| 2010-05-13 | 22.101 |
| 2010-05-14 | 22.812 |
| 2010-05-15 | 23.142 |
| 2010-05-16 | 23.381 |
| 2010-05-17 | 23.736 |
| 2010-05-18 | 24.182 |
| 2010-05-19 | 25 |
| 2010-05-20 | 26.366 |
| 2010-05-21 | 27.447 |
| 2010-05-22 | 27.97 |
| 2010-05-23 | 28.537 |
| 2010-05-24 | 29.003 |
| 2010-05-25 | 29.258 |
| 2010-05-26 | 30.055 |
| 2010-05-27 | 30.368 |
| 2010-05-28 | 30.867 |
| 2010-05-29 | 31.459 |
| 2010-05-30 | 31.93 |
| 2010-05-31 | 31.93 |
| 2010-06-01 | 32.101 |
| 2010-06-02 | 32.577 |
| 2010-06-03 | 32.844 |
| 2010-06-04 | 33.348 |
| 2010-06-05 | 33.375 |
| 2010-06-06 | 32.976 |
| 2010-06-07 | 33.156 |
| 2010-06-08 | 33.182 |
| 2010-06-09 | 33.415 |
| 2010-06-10 | 33.522 |
| 2010-06-11 | 33.678 |
| 2010-06-12 | 34.028 |
| 2010-06-13 | 34.174 |
| 2010-06-14 | 33.895 |
| 2010-06-15 | 33.512 |
| 2010-06-16 | 33.278 |
| 2010-06-17 | 32.873 |
| 2010-06-18 | 32.332 |
| 2010-06-19 | 31.659 |
| 2010-06-20 | 31.215 |
| 2010-06-21 | 30.898 |
| 2010-06-22 | 30.715 |
| 2010-06-23 | 30.171 |
| 2010-06-24 | 29.94 |
| 2010-06-25 | 29.63 |
| 2010-06-26 | 29.628 |
| 2010-06-27 | 29.499 |
| 2010-06-28 | 29.474 |
| 2010-06-29 | 29.696 |
| 2010-06-30 | 29.916 |
| 2010-07-01 | 29.795 |
| 2010-07-02 | 29.792 |
| 2010-07-03 | 29.808 |
| 2010-07-04 | 29.524 |
| 2010-07-05 | 29.524 |
| 2010-07-06 | 29.53 |
| 2010-07-07 | 29.067 |
| 2010-07-08 | 28.687 |
| 2010-07-09 | 28.27 |
| 2010-07-10 | 28.155 |
| 2010-07-11 | 28.122 |
| 2010-07-12 | 27.937 |
| 2010-07-13 | 27.776 |
| 2010-07-14 | 27.6 |
| 2010-07-15 | 27.566 |
| 2010-07-16 | 27.581 |
| 2010-07-17 | 27.708 |
| 2010-07-18 | 27.906 |
| 2010-07-19 | 27.809 |
| 2010-07-20 | 27.624 |
| 2010-07-21 | 27.66 |
| 2010-07-22 | 27.545 |
| 2010-07-23 | 27.381 |
| 2010-07-24 | 27.264 |
| 2010-07-25 | 27.197 |
| 2010-07-26 | 26.974 |
| 2010-07-27 | 26.793 |
| 2010-07-28 | 26.567 |
| 2010-07-29 | 26.091 |
| 2010-07-30 | 25.565 |
| 2010-07-31 | 25.2 |
| 2010-08-01 | 24.942 |
| 2010-08-02 | 24.795 |
| 2010-08-03 | 24.692 |
| 2010-08-04 | 24.579 |
| 2010-08-05 | 24.236 |
| 2010-08-06 | 24.004 |
| 2010-08-07 | 23.923 |
| 2010-08-08 | 23.87 |
| 2010-08-09 | 23.788 |
| 2010-08-10 | 23.723 |
| 2010-08-11 | 23.767 |
| 2010-08-12 | 23.82 |
| 2010-08-13 | 23.881 |
| 2010-08-14 | 23.821 |
| 2010-08-15 | 23.7 |
| 2010-08-16 | 23.814 |
| 2010-08-17 | 23.838 |
| 2010-08-18 | 23.775 |
| 2010-08-19 | 23.889 |
| 2010-08-20 | 23.882 |
| 2010-08-21 | 23.847 |
| 2010-08-22 | 23.866 |
| 2010-08-23 | 23.951 |
| 2010-08-24 | 24.11 |
| 2010-08-25 | 24.291 |
| 2010-08-26 | 24.481 |
| 2010-08-27 | 24.49 |
| 2010-08-28 | 24.507 |
| 2010-08-29 | 24.557 |
| 2010-08-30 | 24.684 |
| 2010-08-31 | 24.746 |
| 2010-09-01 | 24.831 |
| 2010-09-02 | 24.857 |
| 2010-09-03 | 24.816 |
| 2010-09-04 | 24.945 |
| 2010-09-05 | 25.106 |
| 2010-09-06 | 25.106 |
| 2010-09-07 | 25.043 |
| 2010-09-08 | 25.096 |
| 2010-09-09 | 25.117 |
| 2010-09-10 | 24.955 |
| 2010-09-11 | 24.916 |
| 2010-09-12 | 24.847 |
| 2010-09-13 | 24.665 |
| 2010-09-14 | 24.517 |
| 2010-09-15 | 24.327 |
| 2010-09-16 | 24.202 |
| 2010-09-17 | 24.08 |
| 2010-09-18 | 23.962 |
| 2010-09-19 | 23.881 |
| 2010-09-20 | 23.762 |
| 2010-09-21 | 23.695 |
| 2010-09-22 | 23.545 |
| 2010-09-23 | 23.374 |
| 2010-09-24 | 23.136 |
| 2010-09-25 | 22.925 |
| 2010-09-26 | 22.844 |
| 2010-09-27 | 22.829 |
| 2010-09-28 | 22.818 |
| 2010-09-29 | 22.63 |
| 2010-09-30 | 22.518 |
| 2010-10-01 | 22.451 |
| 2010-10-02 | 22.414 |
| 2010-10-03 | 22.473 |
| 2010-10-04 | 22.526 |
| 2010-10-05 | 22.489 |
| 2010-10-06 | 22.444 |
| 2010-10-07 | 22.342 |
| 2010-10-08 | 22.226 |
| 2010-10-09 | 22.199 |
| 2010-10-10 | 22.209 |
| 2010-10-11 | 22.054 |
| 2010-10-12 | 21.912 |
| 2010-10-13 | 21.815 |
| 2010-10-14 | 21.739 |
| 2010-10-15 | 21.599 |
| 2010-10-16 | 21.593 |
| 2010-10-17 | 21.572 |
| 2010-10-18 | 21.454 |
| 2010-10-19 | 21.417 |
| 2010-10-20 | 21.339 |
| 2010-10-21 | 21.199 |
| 2010-10-22 | 21.03 |
| 2010-10-23 | 20.894 |
| 2010-10-24 | 20.853 |
| 2010-10-25 | 20.806 |
| 2010-10-26 | 20.779 |
| 2010-10-27 | 20.696 |
| 2010-10-28 | 20.618 |
| 2010-10-29 | 20.525 |
| 2010-10-30 | 20.373 |
| 2010-10-31 | 20.267 |
| 2010-11-01 | 20.341 |
| 2010-11-02 | 20.397 |
| 2010-11-03 | 20.217 |
| 2010-11-04 | 20.07 |
| 2010-11-05 | 19.923 |
| 2010-11-06 | 19.845 |
| 2010-11-07 | 19.801 |
| 2010-11-08 | 19.73 |
| 2010-11-09 | 19.7 |
| 2010-11-10 | 19.678 |
| 2010-11-11 | 19.665 |
| 2010-11-12 | 19.735 |
| 2010-11-13 | 19.728 |
| 2010-11-14 | 19.762 |
| 2010-11-15 | 19.783 |
| 2010-11-16 | 19.91 |
| 2010-11-17 | 20.032 |
| 2010-11-18 | 19.946 |
| 2010-11-19 | 19.867 |
| 2010-11-20 | 19.895 |
| 2010-11-21 | 19.951 |
| 2010-11-22 | 19.876 |
| 2010-11-23 | 19.91 |
| 2010-11-24 | 19.897 |
| 2010-11-25 | 19.881 |
| 2010-11-26 | 19.953 |
| 2010-11-27 | 19.907 |
| 2010-11-28 | 19.839 |
| 2010-11-29 | 19.924 |
| 2010-11-30 | 20.096 |
| 2010-12-01 | 20.073 |
| 2010-12-02 | 19.97 |
| 2010-12-03 | 19.896 |
| 2010-12-04 | 19.964 |
| 2010-12-05 | 20.054 |
| 2010-12-06 | 19.952 |
| 2010-12-07 | 19.859 |
| 2010-12-08 | 19.833 |
| 2010-12-09 | 19.746 |
| 2010-12-10 | 19.705 |
| 2010-12-11 | 19.758 |
| 2010-12-12 | 19.713 |
| 2010-12-13 | 19.605 |
| 2010-12-14 | 19.51 |
| 2010-12-15 | 19.402 |
| 2010-12-16 | 19.155 |
| 2010-12-17 | 18.886 |
| 2010-12-18 | 18.893 |
| 2010-12-19 | 18.938 |
| 2010-12-20 | 18.812 |
| 2010-12-21 | 18.701 |
| 2010-12-22 | 18.562 |
| 2010-12-23 | 18.364 |
| 2010-12-24 | 18.304 |
| 2010-12-25 | 18.304 |
| 2010-12-26 | 18.098 |
| 2010-12-27 | 18.077 |
| 2010-12-28 | 18.05 |
| 2010-12-29 | 17.848 |
| 2010-12-30 | 17.561 |
| 2010-12-31 | 17.389 |
| 2011-01-01 | 17.289 |
| 2011-01-02 | 17.251 |
| 2011-01-03 | 17.269 |
| 2011-01-04 | 17.274 |
| 2011-01-05 | 17.227 |
| 2011-01-06 | 17.199 |
| 2011-01-07 | 17.17 |
| 2011-01-08 | 17.166 |
| 2011-01-09 | 17.143 |
| 2011-01-10 | 17.162 |
| 2011-01-11 | 17.15 |
| 2011-01-12 | 17.087 |
| 2011-01-13 | 17.029 |
| 2011-01-14 | 16.911 |
| 2011-01-15 | 16.887 |
| 2011-01-16 | 16.928 |
| 2011-01-17 | 16.928 |
| 2011-01-18 | 16.875 |
| 2011-01-19 | 16.92 |
| 2011-01-20 | 16.995 |
| 2011-01-21 | 17.146 |
| 2011-01-22 | 17.182 |
| 2011-01-23 | 17.182 |
| 2011-01-24 | 17.205 |
| 2011-01-25 | 17.223 |
| 2011-01-26 | 17.174 |
| 2011-01-27 | 17.109 |
| 2011-01-28 | 17.24 |
| 2011-01-29 | 17.226 |
| 2011-01-30 | 17.199 |
| 2011-01-31 | 17.315 |
| 2011-02-01 | 17.33 |
| 2011-02-02 | 17.316 |
| 2011-02-03 | 17.283 |
| 2011-02-04 | 17.231 |
| 2011-02-05 | 17.222 |
| 2011-02-06 | 17.227 |
| 2011-02-07 | 17.18 |
| 2011-02-08 | 17.114 |
| 2011-02-09 | 17.035 |
| 2011-02-10 | 16.997 |
| 2011-02-11 | 16.97 |
| 2011-02-12 | 16.999 |
| 2011-02-13 | 17.081 |
| 2011-02-14 | 17.024 |
| 2011-02-15 | 16.993 |
| 2011-02-16 | 16.98 |
| 2011-02-17 | 17.013 |
| 2011-02-18 | 16.973 |
| 2011-02-19 | 16.925 |
| 2011-02-20 | 16.848 |
| 2011-02-21 | 16.848 |
| 2011-02-22 | 17.036 |
| 2011-02-23 | 17.249 |
| 2011-02-24 | 17.427 |
| 2011-02-25 | 17.55 |
| 2011-02-26 | 17.62 |
| 2011-02-27 | 17.492 |
| 2011-02-28 | 17.535 |
| 2011-03-01 | 17.7 |
| 2011-03-02 | 17.756 |
| 2011-03-03 | 17.802 |
| 2011-03-04 | 17.886 |
| 2011-03-05 | 17.946 |
| 2011-03-06 | 18.052 |
| 2011-03-07 | 18.182 |
| 2011-03-08 | 18.26 |
| 2011-03-09 | 18.448 |
| 2011-03-10 | 18.737 |
| 2011-03-11 | 18.938 |
| 2011-03-12 | 19.08 |
| 2011-03-13 | 19.258 |
| 2011-03-14 | 19.352 |
| 2011-03-15 | 19.589 |
| 2011-03-16 | 20.229 |
| 2011-03-17 | 20.705 |
| 2011-03-18 | 21.073 |
| 2011-03-19 | 21.297 |
| 2011-03-20 | 21.553 |
| 2011-03-21 | 21.506 |
| 2011-03-22 | 21.444 |
| 2011-03-23 | 21.341 |
| 2011-03-24 | 21.214 |
| 2011-03-25 | 21.022 |
| 2011-03-26 | 21.008 |
| 2011-03-27 | 21.097 |
| 2011-03-28 | 21.018 |
| 2011-03-29 | 20.888 |
| 2011-03-30 | 20.859 |
| 2011-03-31 | 20.71 |
| 2011-04-01 | 20.56 |
| 2011-04-02 | 20.654 |
| 2011-04-03 | 20.734 |
| 2011-04-04 | 20.58 |
| 2011-04-05 | 20.428 |
| 2011-04-06 | 20.257 |
| 2011-04-07 | 20.134 |
| 2011-04-08 | 20.027 |
| 2011-04-09 | 19.939 |
| 2011-04-10 | 19.932 |
| 2011-04-11 | 19.773 |
| 2011-04-12 | 19.651 |
| 2011-04-13 | 19.46 |
| 2011-04-14 | 19.094 |
| 2011-04-15 | 18.454 |
| 2011-04-16 | 18.077 |
| 2011-04-17 | 17.758 |
| 2011-04-18 | 17.72 |
| 2011-04-19 | 17.635 |
| 2011-04-20 | 17.383 |
| 2011-04-21 | 17.132 |
| 2011-04-22 | 17.035 |
| 2011-04-23 | 16.986 |
| 2011-04-24 | 16.938 |
| 2011-04-25 | 16.88 |
| 2011-04-26 | 16.82 |
| 2011-04-27 | 16.625 |
| 2011-04-28 | 16.456 |
| 2011-04-29 | 16.315 |
| 2011-04-30 | 16.244 |
| 2011-05-01 | 16.183 |
| 2011-05-02 | 16.174 |
| 2011-05-03 | 16.199 |
| 2011-05-04 | 16.179 |
| 2011-05-05 | 16.224 |
| 2011-05-06 | 16.295 |
| 2011-05-07 | 16.254 |
| 2011-05-08 | 16.169 |
| 2011-05-09 | 16.219 |
| 2011-05-10 | 16.204 |
| 2011-05-11 | 16.221 |
| 2011-05-12 | 16.171 |
| 2011-05-13 | 16.178 |
| 2011-05-14 | 16.173 |
| 2011-05-15 | 16.218 |
| 2011-05-16 | 16.32 |
| 2011-05-17 | 16.378 |
| 2011-05-18 | 16.343 |
| 2011-05-19 | 16.329 |
| 2011-05-20 | 16.441 |
| 2011-05-21 | 16.528 |
| 2011-05-22 | 16.528 |
| 2011-05-23 | 16.611 |
| 2011-05-24 | 16.666 |
| 2011-05-25 | 16.725 |
| 2011-05-26 | 16.747 |
| 2011-05-27 | 16.775 |
| 2011-05-28 | 16.878 |
| 2011-05-29 | 16.984 |
| 2011-05-30 | 16.984 |
| 2011-05-31 | 16.911 |
| 2011-06-01 | 17.021 |
| 2011-06-02 | 17.088 |
| 2011-06-03 | 17.129 |
| 2011-06-04 | 17.075 |
| 2011-06-05 | 17.006 |
| 2011-06-06 | 17.08 |
| 2011-06-07 | 17.127 |
| 2011-06-08 | 17.205 |
| 2011-06-09 | 17.293 |
| 2011-06-10 | 17.384 |
| 2011-06-11 | 17.452 |
| 2011-06-12 | 17.472 |
| 2011-06-13 | 17.579 |
| 2011-06-14 | 17.611 |
| 2011-06-15 | 17.758 |
| 2011-06-16 | 18.005 |
| 2011-06-17 | 18.272 |
| 2011-06-18 | 18.41 |
| 2011-06-19 | 18.462 |
| 2011-06-20 | 18.538 |
| 2011-06-21 | 18.553 |
| 2011-06-22 | 18.565 |
| 2011-06-23 | 18.635 |
| 2011-06-24 | 18.827 |
| 2011-06-25 | 18.964 |
| 2011-06-26 | 19.121 |
| 2011-06-27 | 19.193 |
| 2011-06-28 | 19.192 |
| 2011-06-29 | 19.105 |
| 2011-06-30 | 19.153 |
| 2011-07-01 | 19.043 |
| 2011-07-02 | 19.088 |
| 2011-07-03 | 19.145 |
| 2011-07-04 | 19.145 |
| 2011-07-05 | 18.998 |
| 2011-07-06 | 18.896 |
| 2011-07-07 | 18.795 |
| 2011-07-08 | 18.66 |
| 2011-07-09 | 18.704 |
| 2011-07-10 | 18.696 |
| 2011-07-11 | 18.68 |
| 2011-07-12 | 18.737 |
| 2011-07-13 | 18.751 |
| 2011-07-14 | 18.872 |
| 2011-07-15 | 18.787 |
| 2011-07-16 | 18.59 |
| 2011-07-17 | 18.418 |
| 2011-07-18 | 18.545 |
| 2011-07-19 | 18.577 |
| 2011-07-20 | 18.534 |
| 2011-07-21 | 18.472 |
| 2011-07-22 | 18.424 |
| 2011-07-23 | 18.381 |
| 2011-07-24 | 18.238 |
| 2011-07-25 | 18.293 |
| 2011-07-26 | 18.386 |
| 2011-07-27 | 18.501 |
| 2011-07-28 | 18.719 |
| 2011-07-29 | 19.099 |
| 2011-07-30 | 19.228 |
| 2011-07-31 | 19.404 |
| 2011-08-01 | 19.617 |
| 2011-08-02 | 19.863 |
| 2011-08-03 | 20.023 |
| 2011-08-04 | 20.732 |
| 2011-08-05 | 21.444 |
| 2011-08-06 | 21.706 |
| 2011-08-07 | 21.994 |
| 2011-08-08 | 23.232 |
| 2011-08-09 | 23.77 |
| 2011-08-10 | 24.888 |
| 2011-08-11 | 25.757 |
| 2011-08-12 | 26.505 |
| 2011-08-13 | 26.777 |
| 2011-08-14 | 27.139 |
| 2011-08-15 | 27.364 |
| 2011-08-16 | 27.614 |
| 2011-08-17 | 28.097 |
| 2011-08-18 | 29.163 |
| 2011-08-19 | 30.252 |
| 2011-08-20 | 30.857 |
| 2011-08-21 | 31.523 |
| 2011-08-22 | 32.043 |
| 2011-08-23 | 32.235 |
| 2011-08-24 | 32.988 |
| 2011-08-25 | 33.875 |
| 2011-08-26 | 34.449 |
| 2011-08-27 | 34.959 |
| 2011-08-28 | 35.444 |
| 2011-08-29 | 35.293 |
| 2011-08-30 | 35.184 |
| 2011-08-31 | 35.546 |
| 2011-09-01 | 35.865 |
| 2011-09-02 | 36.345 |
| 2011-09-03 | 36.568 |
| 2011-09-04 | 36.796 |
| 2011-09-05 | 36.796 |
| 2011-09-06 | 36.806 |
| 2011-09-07 | 36.11 |
| 2011-09-08 | 36.074 |
| 2011-09-09 | 35.861 |
| 2011-09-10 | 35.704 |
| 2011-09-11 | 35.67 |
| 2011-09-12 | 35.816 |
| 2011-09-13 | 35.868 |
| 2011-09-14 | 35.998 |
| 2011-09-15 | 35.956 |
| 2011-09-16 | 35.928 |
| 2011-09-17 | 35.591 |
| 2011-09-18 | 35.198 |
| 2011-09-19 | 35.074 |
| 2011-09-20 | 34.969 |
| 2011-09-21 | 34.725 |
| 2011-09-22 | 34.967 |
| 2011-09-23 | 35.222 |
| 2011-09-24 | 34.995 |
| 2011-09-25 | 34.964 |
| 2011-09-26 | 35.167 |
| 2011-09-27 | 35.288 |
| 2011-09-28 | 35.707 |
| 2011-09-29 | 35.99 |
| 2011-09-30 | 36.53 |
| 2011-10-01 | 36.766 |
| 2011-10-02 | 36.915 |
| 2011-10-03 | 37.342 |
| 2011-10-04 | 37.508 |
| 2011-10-05 | 37.521 |
| 2011-10-06 | 37.488 |
| 2011-10-07 | 37.616 |
| 2011-10-08 | 37.773 |
| 2011-10-09 | 37.736 |
| 2011-10-10 | 37.511 |
| 2011-10-11 | 37.3 |
| 2011-10-12 | 36.967 |
| 2011-10-13 | 36.685 |
| 2011-10-14 | 36.395 |
| 2011-10-15 | 36.606 |
| 2011-10-16 | 36.888 |
| 2011-10-17 | 36.721 |
| 2011-10-18 | 36.486 |
| 2011-10-19 | 36.564 |
| 2011-10-20 | 36.651 |
| 2011-10-21 | 36.379 |
| 2011-10-22 | 36.142 |
| 2011-10-23 | 35.886 |
| 2011-10-24 | 35.571 |
| 2011-10-25 | 35.419 |
| 2011-10-26 | 35.002 |
| 2011-10-27 | 34.445 |
| 2011-10-28 | 33.693 |
| 2011-10-29 | 33.448 |
| 2011-10-30 | 32.973 |
| 2011-10-31 | 32.829 |
| 2011-11-01 | 32.917 |
| 2011-11-02 | 32.34 |
| 2011-11-03 | 31.87 |
| 2011-11-04 | 31.523 |
| 2011-11-05 | 31.297 |
| 2011-11-06 | 31.051 |
| 2011-11-07 | 30.994 |
| 2011-11-08 | 30.835 |
| 2011-11-09 | 30.977 |
| 2011-11-10 | 30.975 |
| 2011-11-11 | 30.92 |
| 2011-11-12 | 30.93 |
| 2011-11-13 | 31.064 |
| 2011-11-14 | 31.068 |
| 2011-11-15 | 31.075 |
| 2011-11-16 | 31.08 |
| 2011-11-17 | 31.214 |
| 2011-11-18 | 31.103 |
| 2011-11-19 | 30.928 |
| 2011-11-20 | 30.909 |
| 2011-11-21 | 31.004 |
| 2011-11-22 | 31.048 |
| 2011-11-23 | 31.262 |
| 2011-11-24 | 31.217 |
| 2011-11-25 | 31.436 |
| 2011-11-26 | 31.735 |
| 2011-11-27 | 32.114 |
| 2011-11-28 | 32.115 |
| 2011-11-29 | 32.045 |
| 2011-11-30 | 31.942 |
| 2011-12-01 | 31.591 |
| 2011-12-02 | 31.343 |
| 2011-12-03 | 31.385 |
| 2011-12-04 | 31.449 |
| 2011-12-05 | 31.269 |
| 2011-12-06 | 31.12 |
| 2011-12-07 | 31.063 |
| 2011-12-08 | 31.211 |
| 2011-12-09 | 30.746 |
| 2011-12-10 | 30.643 |
| 2011-12-11 | 30.674 |
| 2011-12-12 | 30.424 |
| 2011-12-13 | 30.185 |
| 2011-12-14 | 29.943 |
| 2011-12-15 | 29.652 |
| 2011-12-16 | 29.213 |
| 2011-12-17 | 28.948 |
| 2011-12-18 | 28.787 |
| 2011-12-19 | 28.594 |
| 2011-12-20 | 28.338 |
| 2011-12-21 | 27.791 |
| 2011-12-22 | 27.277 |
| 2011-12-23 | 26.646 |
| 2011-12-24 | 26.646 |
| 2011-12-25 | 26.255 |
| 2011-12-26 | 26.255 |
| 2011-12-27 | 26.048 |
| 2011-12-28 | 25.638 |
| 2011-12-29 | 25.257 |
| 2011-12-30 | 25.048 |
| 2011-12-31 | 24.93 |
| 2012-01-01 | 24.793 |
| 2012-01-02 | 24.793 |
| 2012-01-03 | 24.702 |
| 2012-01-04 | 24.421 |
| 2012-01-05 | 24.088 |
| 2012-01-06 | 23.687 |
| 2012-01-07 | 23.323 |
| 2012-01-08 | 23.153 |
| 2012-01-09 | 23.044 |
| 2012-01-10 | 22.926 |
| 2012-01-11 | 22.695 |
| 2012-01-12 | 22.448 |
| 2012-01-13 | 22.191 |
| 2012-01-14 | 22.038 |
| 2012-01-15 | 21.913 |
| 2012-01-16 | 21.913 |
| 2012-01-17 | 21.928 |
| 2012-01-18 | 21.716 |
| 2012-01-19 | 21.539 |
| 2012-01-20 | 21.374 |
| 2012-01-21 | 21.386 |
| 2012-01-22 | 21.424 |
| 2012-01-23 | 21.271 |
| 2012-01-24 | 21.147 |
| 2012-01-25 | 21.005 |
| 2012-01-26 | 20.838 |
| 2012-01-27 | 20.588 |
| 2012-01-28 | 20.48 |
| 2012-01-29 | 20.318 |
| 2012-01-30 | 20.269 |
| 2012-01-31 | 20.228 |
| 2012-02-01 | 20.148 |
| 2012-02-02 | 19.91 |
| 2012-02-03 | 19.667 |
| 2012-02-04 | 19.576 |
| 2012-02-05 | 19.521 |
| 2012-02-06 | 19.433 |
| 2012-02-07 | 19.348 |
| 2012-02-08 | 19.209 |
| 2012-02-09 | 19.111 |
| 2012-02-10 | 19.099 |
| 2012-02-11 | 19.03 |
| 2012-02-12 | 18.931 |
| 2012-02-13 | 18.937 |
| 2012-02-14 | 18.965 |
| 2012-02-15 | 19.064 |
| 2012-02-16 | 18.929 |
| 2012-02-17 | 18.787 |
| 2012-02-18 | 18.736 |
| 2012-02-19 | 18.759 |
| 2012-02-20 | 18.759 |
| 2012-02-21 | 18.731 |
| 2012-02-22 | 18.709 |
| 2012-02-23 | 18.608 |
| 2012-02-24 | 18.56 |
| 2012-02-25 | 18.56 |
| 2012-02-26 | 18.562 |
| 2012-02-27 | 18.543 |
| 2012-02-28 | 18.515 |
| 2012-02-29 | 18.469 |
| 2012-03-01 | 18.365 |
| 2012-03-02 | 18.305 |
| 2012-03-03 | 18.322 |
| 2012-03-04 | 18.386 |
| 2012-03-05 | 18.369 |
| 2012-03-06 | 18.488 |
| 2012-03-07 | 18.55 |
| 2012-03-08 | 18.565 |
| 2012-03-09 | 18.515 |
| 2012-03-10 | 18.509 |
| 2012-03-11 | 18.389 |
| 2012-03-12 | 18.252 |
| 2012-03-13 | 18.087 |
| 2012-03-14 | 17.91 |
| 2012-03-15 | 17.713 |
| 2012-03-16 | 17.396 |
| 2012-03-17 | 17.304 |
| 2012-03-18 | 17.279 |
| 2012-03-19 | 17.168 |
| 2012-03-20 | 17.092 |
| 2012-03-21 | 17.003 |
| 2012-03-22 | 16.884 |
| 2012-03-23 | 16.73 |
| 2012-03-24 | 16.727 |
| 2012-03-25 | 16.698 |
| 2012-03-26 | 16.582 |
| 2012-03-27 | 16.537 |
| 2012-03-28 | 16.413 |
| 2012-03-29 | 16.3 |
| 2012-03-30 | 16.167 |
| 2012-03-31 | 16.115 |
| 2012-04-01 | 16.056 |
| 2012-04-02 | 16.037 |
| 2012-04-03 | 16.02 |
| 2012-04-04 | 15.946 |
| 2012-04-05 | 15.757 |
| 2012-04-06 | 15.599 |
| 2012-04-07 | 15.482 |
| 2012-04-08 | 15.396 |
| 2012-04-09 | 15.566 |
| 2012-04-10 | 15.796 |
| 2012-04-11 | 16.005 |
| 2012-04-12 | 16.119 |
| 2012-04-13 | 16.321 |
| 2012-04-14 | 16.366 |
| 2012-04-15 | 16.466 |
| 2012-04-16 | 16.62 |
| 2012-04-17 | 16.708 |
| 2012-04-18 | 16.879 |
| 2012-04-19 | 17.011 |
| 2012-04-20 | 17.121 |
| 2012-04-21 | 17.199 |
| 2012-04-22 | 17.324 |
| 2012-04-23 | 17.406 |
| 2012-04-24 | 17.44 |
| 2012-04-25 | 17.561 |
| 2012-04-26 | 17.592 |
| 2012-04-27 | 17.633 |
| 2012-04-28 | 17.741 |
| 2012-04-29 | 17.858 |
| 2012-04-30 | 17.823 |
| 2012-05-01 | 17.765 |
| 2012-05-02 | 17.824 |
| 2012-05-03 | 17.914 |
| 2012-05-04 | 18.044 |
| 2012-05-05 | 18.111 |
| 2012-05-06 | 18.111 |
| 2012-05-07 | 18.15 |
| 2012-05-08 | 18.191 |
| 2012-05-09 | 18.249 |
| 2012-05-10 | 18.178 |
| 2012-05-11 | 18.172 |
| 2012-05-12 | 18.219 |
| 2012-05-13 | 18.152 |
| 2012-05-14 | 18.329 |
| 2012-05-15 | 18.495 |
| 2012-05-16 | 18.618 |
| 2012-05-17 | 18.892 |
| 2012-05-18 | 19.186 |
| 2012-05-19 | 19.225 |
| 2012-05-20 | 19.314 |
| 2012-05-21 | 19.443 |
| 2012-05-22 | 19.581 |
| 2012-05-23 | 19.734 |
| 2012-05-24 | 19.89 |
| 2012-05-25 | 20.115 |
| 2012-05-26 | 20.299 |
| 2012-05-27 | 20.498 |
| 2012-05-28 | 20.498 |
| 2012-05-29 | 20.523 |
| 2012-05-30 | 20.856 |
| 2012-05-31 | 21.211 |
| 2012-06-01 | 21.677 |
| 2012-06-02 | 21.883 |
| 2012-06-03 | 22.026 |
| 2012-06-04 | 22.231 |
| 2012-06-05 | 22.348 |
| 2012-06-06 | 22.501 |
| 2012-06-07 | 22.628 |
| 2012-06-08 | 22.683 |
| 2012-06-09 | 22.876 |
| 2012-06-10 | 23.033 |
| 2012-06-11 | 23.059 |
| 2012-06-12 | 23.013 |
| 2012-06-13 | 23.127 |
| 2012-06-14 | 23.113 |
| 2012-06-15 | 23.058 |
| 2012-06-16 | 22.986 |
| 2012-06-17 | 22.875 |
| 2012-06-18 | 22.647 |
| 2012-06-19 | 22.444 |
| 2012-06-20 | 22.217 |
| 2012-06-21 | 22.103 |
| 2012-06-22 | 21.902 |
| 2012-06-23 | 21.92 |
| 2012-06-24 | 21.928 |
| 2012-06-25 | 21.851 |
| 2012-06-26 | 21.75 |
| 2012-06-27 | 21.645 |
| 2012-06-28 | 21.585 |
| 2012-06-29 | 21.264 |
| 2012-06-30 | 21.131 |
| 2012-07-01 | 20.854 |
| 2012-07-02 | 20.661 |
| 2012-07-03 | 20.48 |
| 2012-07-04 | 20.211 |
| 2012-07-05 | 19.869 |
| 2012-07-06 | 19.628 |
| 2012-07-07 | 19.524 |
| 2012-07-08 | 19.434 |
| 2012-07-09 | 19.361 |
| 2012-07-10 | 19.33 |
| 2012-07-11 | 19.063 |
| 2012-07-12 | 18.884 |
| 2012-07-13 | 18.526 |
| 2012-07-14 | 18.368 |
| 2012-07-15 | 18.224 |
| 2012-07-16 | 18.168 |
| 2012-07-17 | 18.088 |
| 2012-07-18 | 17.985 |
| 2012-07-19 | 17.845 |
| 2012-07-20 | 17.799 |
| 2012-07-21 | 17.685 |
| 2012-07-22 | 17.663 |
| 2012-07-23 | 17.71 |
| 2012-07-24 | 17.842 |
| 2012-07-25 | 17.792 |
| 2012-07-26 | 17.688 |
| 2012-07-27 | 17.557 |
| 2012-07-28 | 17.449 |
| 2012-07-29 | 17.469 |
| 2012-07-30 | 17.497 |
| 2012-07-31 | 17.565 |
| 2012-08-01 | 17.668 |
| 2012-08-02 | 17.711 |
| 2012-08-03 | 17.617 |
| 2012-08-04 | 17.623 |
| 2012-08-05 | 17.649 |
| 2012-08-06 | 17.568 |
| 2012-08-07 | 17.496 |
| 2012-08-08 | 17.375 |
| 2012-08-09 | 17.219 |
| 2012-08-10 | 17.073 |
| 2012-08-11 | 17.013 |
| 2012-08-12 | 17.027 |
| 2012-08-13 | 16.869 |
| 2012-08-14 | 16.777 |
| 2012-08-15 | 16.664 |
| 2012-08-16 | 16.565 |
| 2012-08-17 | 16.441 |
| 2012-08-18 | 16.489 |
| 2012-08-19 | 16.5 |
| 2012-08-20 | 16.381 |
| 2012-08-21 | 16.32 |
| 2012-08-22 | 16.16 |
| 2012-08-23 | 15.955 |
| 2012-08-24 | 15.766 |
| 2012-08-25 | 15.682 |
| 2012-08-26 | 15.631 |
| 2012-08-27 | 15.665 |
| 2012-08-28 | 15.703 |
| 2012-08-29 | 15.659 |
| 2012-08-30 | 15.609 |
| 2012-08-31 | 15.541 |
| 2012-09-01 | 15.444 |
| 2012-09-02 | 15.435 |
| 2012-09-03 | 15.435 |
| 2012-09-04 | 15.556 |
| 2012-09-05 | 15.641 |
| 2012-09-06 | 15.622 |
| 2012-09-07 | 15.578 |
| 2012-09-08 | 15.593 |
| 2012-09-09 | 15.637 |
| 2012-09-10 | 15.67 |
| 2012-09-11 | 15.705 |
| 2012-09-12 | 15.805 |
| 2012-09-13 | 15.767 |
| 2012-09-14 | 15.761 |
| 2012-09-15 | 15.834 |
| 2012-09-16 | 15.96 |
| 2012-09-17 | 15.891 |
| 2012-09-18 | 15.81 |
| 2012-09-19 | 15.803 |
| 2012-09-20 | 15.758 |
| 2012-09-21 | 15.704 |
| 2012-09-22 | 15.692 |
| 2012-09-23 | 15.718 |
| 2012-09-24 | 15.64 |
| 2012-09-25 | 15.63 |
| 2012-09-26 | 15.652 |
| 2012-09-27 | 15.573 |
| 2012-09-28 | 15.51 |
| 2012-09-29 | 15.394 |
| 2012-09-30 | 15.285 |
| 2012-10-01 | 15.336 |
| 2012-10-02 | 15.354 |
| 2012-10-03 | 15.358 |
| 2012-10-04 | 15.202 |
| 2012-10-05 | 15.047 |
| 2012-10-06 | 15.02 |
| 2012-10-07 | 15.052 |
| 2012-10-08 | 15.055 |
| 2012-10-09 | 15.115 |
| 2012-10-10 | 15.115 |
| 2012-10-11 | 15.078 |
| 2012-10-12 | 15.094 |
| 2012-10-13 | 15.143 |
| 2012-10-14 | 15.175 |
| 2012-10-15 | 15.18 |
| 2012-10-16 | 15.181 |
| 2012-10-17 | 15.203 |
| 2012-10-18 | 15.242 |
| 2012-10-19 | 15.386 |
| 2012-10-20 | 15.449 |
| 2012-10-21 | 15.522 |
| 2012-10-22 | 15.575 |
| 2012-10-23 | 15.723 |
| 2012-10-24 | 15.913 |
| 2012-10-25 | 16.035 |
| 2012-10-26 | 16.08 |
| 2012-10-27 | 16.14 |
| 2012-10-28 | 16.16 |
| 2012-10-29 | 16.16 |
| 2012-10-30 | 16.16 |
| 2012-10-31 | 16.274 |
| 2012-11-01 | 16.323 |
| 2012-11-02 | 16.431 |
| 2012-11-03 | 16.53 |
| 2012-11-04 | 16.652 |
| 2012-11-05 | 16.745 |
| 2012-11-06 | 16.787 |
| 2012-11-07 | 16.986 |
| 2012-11-08 | 17.092 |
| 2012-11-09 | 17.208 |
| 2012-11-10 | 17.293 |
| 2012-11-11 | 17.357 |
| 2012-11-12 | 17.321 |
| 2012-11-13 | 17.288 |
| 2012-11-14 | 17.42 |
| 2012-11-15 | 17.559 |
| 2012-11-16 | 17.626 |
| 2012-11-17 | 17.762 |
| 2012-11-18 | 17.801 |
| 2012-11-19 | 17.666 |
| 2012-11-20 | 17.537 |
| 2012-11-21 | 17.472 |
| 2012-11-22 | 17.4 |
| 2012-11-23 | 17.232 |
| 2012-11-24 | 17.183 |
| 2012-11-25 | 17.146 |
| 2012-11-26 | 17.054 |
| 2012-11-27 | 16.995 |
| 2012-11-28 | 16.92 |
| 2012-11-29 | 16.832 |
| 2012-11-30 | 16.702 |
| 2012-12-01 | 16.702 |
| 2012-12-02 | 16.656 |
| 2012-12-03 | 16.655 |
| 2012-12-04 | 16.677 |
| 2012-12-05 | 16.584 |
| 2012-12-06 | 16.536 |
| 2012-12-07 | 16.385 |
| 2012-12-08 | 16.279 |
| 2012-12-09 | 16.157 |
| 2012-12-10 | 16.151 |
| 2012-12-11 | 16.124 |
| 2012-12-12 | 16.089 |
| 2012-12-13 | 16.085 |
| 2012-12-14 | 16.041 |
| 2012-12-15 | 15.944 |
| 2012-12-16 | 15.919 |
| 2012-12-17 | 15.94 |
| 2012-12-18 | 15.922 |
| 2012-12-19 | 16.023 |
| 2012-12-20 | 16.147 |
| 2012-12-21 | 16.267 |
| 2012-12-22 | 16.267 |
| 2012-12-23 | 16.324 |
| 2012-12-24 | 16.396 |
| 2012-12-25 | 16.396 |
| 2012-12-26 | 16.585 |
| 2012-12-27 | 16.754 |
| 2012-12-28 | 17.098 |
| 2012-12-29 | 17.2 |
| 2012-12-30 | 17.269 |
| 2012-12-31 | 17.307 |
| 2013-01-01 | 17.307 |
| 2013-01-02 | 17.209 |
| 2013-01-03 | 17.081 |
| 2013-01-04 | 16.949 |
| 2013-01-05 | 16.969 |
| 2013-01-06 | 17.028 |
| 2013-01-07 | 16.858 |
| 2013-01-08 | 16.696 |
| 2013-01-09 | 16.584 |
| 2013-01-10 | 16.48 |
| 2013-01-11 | 16.351 |
| 2013-01-12 | 16.339 |
| 2013-01-13 | 16.303 |
| 2013-01-14 | 16.156 |
| 2013-01-15 | 16.026 |
| 2013-01-16 | 15.88 |
| 2013-01-17 | 15.78 |
| 2013-01-18 | 15.535 |
| 2013-01-19 | 15.423 |
| 2013-01-20 | 15.288 |
| 2013-01-21 | 15.288 |
| 2013-01-22 | 15.138 |
| 2013-01-23 | 14.855 |
| 2013-01-24 | 14.747 |
| 2013-01-25 | 14.417 |
| 2013-01-26 | 14.151 |
| 2013-01-27 | 13.675 |
| 2013-01-28 | 13.669 |
| 2013-01-29 | 13.652 |
| 2013-01-30 | 13.466 |
| 2013-01-31 | 13.505 |
| 2013-02-01 | 13.42 |
| 2013-02-02 | 13.363 |
| 2013-02-03 | 13.339 |
| 2013-02-04 | 13.406 |
| 2013-02-05 | 13.42 |
| 2013-02-06 | 13.402 |
| 2013-02-07 | 13.397 |
| 2013-02-08 | 13.359 |
| 2013-02-09 | 13.353 |
| 2013-02-10 | 13.352 |
| 2013-02-11 | 13.332 |
| 2013-02-12 | 13.299 |
| 2013-02-13 | 13.273 |
| 2013-02-14 | 13.23 |
| 2013-02-15 | 13.185 |
| 2013-02-16 | 13.165 |
| 2013-02-17 | 13.203 |
| 2013-02-18 | 13.203 |
| 2013-02-19 | 13.158 |
| 2013-02-20 | 13.23 |
| 2013-02-21 | 13.363 |
| 2013-02-22 | 13.445 |
| 2013-02-23 | 13.483 |
| 2013-02-24 | 13.514 |
| 2013-02-25 | 13.788 |
| 2013-02-26 | 13.934 |
| 2013-02-27 | 13.99 |
| 2013-02-28 | 14.094 |
| 2013-03-01 | 14.144 |
| 2013-03-02 | 14.137 |
| 2013-03-03 | 14.202 |
| 2013-03-04 | 14.192 |
| 2013-03-05 | 14.159 |
| 2013-03-06 | 14.104 |
| 2013-03-07 | 14.073 |
| 2013-03-08 | 14.034 |
| 2013-03-09 | 14.06 |
| 2013-03-10 | 14.115 |
| 2013-03-11 | 13.987 |
| 2013-03-12 | 13.906 |
| 2013-03-13 | 13.853 |
| 2013-03-14 | 13.789 |
| 2013-03-15 | 13.709 |
| 2013-03-16 | 13.762 |
| 2013-03-17 | 13.83 |
| 2013-03-18 | 13.807 |
| 2013-03-19 | 13.834 |
| 2013-03-20 | 13.781 |
| 2013-03-21 | 13.858 |
| 2013-03-22 | 13.807 |
| 2013-03-23 | 13.74 |
| 2013-03-24 | 13.718 |
| 2013-03-25 | 13.72 |
| 2013-03-26 | 13.676 |
| 2013-03-27 | 13.411 |
| 2013-03-28 | 13.221 |
| 2013-03-29 | 13.15 |
| 2013-03-30 | 13.032 |
| 2013-03-31 | 12.909 |
| 2013-04-01 | 12.942 |
| 2013-04-02 | 12.935 |
| 2013-04-03 | 12.944 |
| 2013-04-04 | 12.964 |
| 2013-04-05 | 12.982 |
| 2013-04-06 | 12.979 |
| 2013-04-07 | 12.999 |
| 2013-04-08 | 13.009 |
| 2013-04-09 | 13 |
| 2013-04-10 | 13.039 |
| 2013-04-11 | 13.037 |
| 2013-04-12 | 13.048 |
| 2013-04-13 | 13.136 |
| 2013-04-14 | 13.232 |
| 2013-04-15 | 13.434 |
| 2013-04-16 | 13.459 |
| 2013-04-17 | 13.609 |
| 2013-04-18 | 13.76 |
| 2013-04-19 | 13.87 |
| 2013-04-20 | 13.864 |
| 2013-04-21 | 13.879 |
| 2013-04-22 | 13.905 |
| 2013-04-23 | 13.884 |
| 2013-04-24 | 13.878 |
| 2013-04-25 | 13.919 |
| 2013-04-26 | 13.94 |
| 2013-04-27 | 14.003 |
| 2013-04-28 | 14.003 |
| 2013-04-29 | 13.989 |
| 2013-04-30 | 13.967 |
| 2013-05-01 | 14.009 |
| 2013-05-02 | 14.045 |
| 2013-05-03 | 13.984 |
| 2013-05-04 | 13.988 |
| 2013-05-05 | 13.992 |
| 2013-05-06 | 13.928 |
| 2013-05-07 | 13.878 |
| 2013-05-08 | 13.854 |
| 2013-05-09 | 13.867 |
| 2013-05-10 | 13.878 |
| 2013-05-11 | 13.956 |
| 2013-05-12 | 14.051 |
| 2013-05-13 | 13.979 |
| 2013-05-14 | 13.924 |
| 2013-05-15 | 13.721 |
| 2013-05-16 | 13.681 |
| 2013-05-17 | 13.496 |
| 2013-05-18 | 13.303 |
| 2013-05-19 | 13.22 |
| 2013-05-20 | 13.21 |
| 2013-05-21 | 13.217 |
| 2013-05-22 | 13.191 |
| 2013-05-23 | 13.218 |
| 2013-05-24 | 13.235 |
| 2013-05-25 | 13.217 |
| 2013-05-26 | 13.198 |
| 2013-05-27 | 13.198 |
| 2013-05-28 | 13.259 |
| 2013-05-29 | 13.312 |
| 2013-05-30 | 13.36 |
| 2013-05-31 | 13.446 |
| 2013-06-01 | 13.439 |
| 2013-06-02 | 13.47 |
| 2013-06-03 | 13.611 |
| 2013-06-04 | 13.737 |
| 2013-06-05 | 13.968 |
| 2013-06-06 | 14.149 |
| 2013-06-07 | 14.267 |
| 2013-06-08 | 14.324 |
| 2013-06-09 | 14.415 |
| 2013-06-10 | 14.466 |
| 2013-06-11 | 14.59 |
| 2013-06-12 | 14.878 |
| 2013-06-13 | 15.051 |
| 2013-06-14 | 15.258 |
| 2013-06-15 | 15.367 |
| 2013-06-16 | 15.521 |
| 2013-06-17 | 15.584 |
| 2013-06-18 | 15.633 |
| 2013-06-19 | 15.806 |
| 2013-06-20 | 16.145 |
| 2013-06-21 | 16.387 |
| 2013-06-22 | 16.502 |
| 2013-06-23 | 16.635 |
| 2013-06-24 | 16.808 |
| 2013-06-25 | 16.888 |
| 2013-06-26 | 16.902 |
| 2013-06-27 | 17.01 |
| 2013-06-28 | 17.103 |
| 2013-06-29 | 17.225 |
| 2013-06-30 | 17.272 |
| 2013-07-01 | 17.229 |
| 2013-07-02 | 17.193 |
| 2013-07-03 | 17.189 |
| 2013-07-04 | 17.233 |
| 2013-07-05 | 17.109 |
| 2013-07-06 | 17.132 |
| 2013-07-07 | 17.237 |
| 2013-07-08 | 17.114 |
| 2013-07-09 | 16.983 |
| 2013-07-10 | 16.924 |
| 2013-07-11 | 16.779 |
| 2013-07-12 | 16.552 |
| 2013-07-13 | 16.559 |
| 2013-07-14 | 16.528 |
| 2013-07-15 | 16.391 |
| 2013-07-16 | 16.298 |
| 2013-07-17 | 16.154 |
| 2013-07-18 | 16.019 |
| 2013-07-19 | 15.823 |
| 2013-07-20 | 15.59 |
| 2013-07-21 | 15.416 |
| 2013-07-22 | 15.26 |
| 2013-07-23 | 15.136 |
| 2013-07-24 | 14.806 |
| 2013-07-25 | 14.544 |
| 2013-07-26 | 14.33 |
| 2013-07-27 | 14.204 |
| 2013-07-28 | 14.064 |
| 2013-07-29 | 14.03 |
| 2013-07-30 | 14 |
| 2013-07-31 | 13.86 |
| 2013-08-01 | 13.694 |
| 2013-08-02 | 13.493 |
| 2013-08-03 | 13.493 |
| 2013-08-04 | 13.423 |
| 2013-08-05 | 13.348 |
| 2013-08-06 | 13.319 |
| 2013-08-07 | 13.237 |
| 2013-08-08 | 13.164 |
| 2013-08-09 | 13.127 |
| 2013-08-10 | 13.085 |
| 2013-08-11 | 13.047 |
| 2013-08-12 | 13.036 |
| 2013-08-13 | 13.003 |
| 2013-08-14 | 12.969 |
| 2013-08-15 | 12.983 |
| 2013-08-16 | 13.01 |
| 2013-08-17 | 12.974 |
| 2013-08-18 | 12.995 |
| 2013-08-19 | 13.096 |
| 2013-08-20 | 13.178 |
| 2013-08-21 | 13.344 |
| 2013-08-22 | 13.44 |
| 2013-08-23 | 13.476 |
| 2013-08-24 | 13.5 |
| 2013-08-25 | 13.539 |
| 2013-08-26 | 13.608 |
| 2013-08-27 | 13.752 |
| 2013-08-28 | 13.893 |
| 2013-08-29 | 14.048 |
| 2013-08-30 | 14.21 |
| 2013-08-31 | 14.27 |
| 2013-09-01 | 14.385 |
| 2013-09-02 | 14.385 |
| 2013-09-03 | 14.491 |
| 2013-09-04 | 14.683 |
| 2013-09-05 | 14.829 |
| 2013-09-06 | 14.965 |
| 2013-09-07 | 15.077 |
| 2013-09-08 | 15.165 |
| 2013-09-09 | 15.188 |
| 2013-09-10 | 15.157 |
| 2013-09-11 | 15.205 |
| 2013-09-12 | 15.299 |
| 2013-09-13 | 15.352 |
| 2013-09-14 | 15.384 |
| 2013-09-15 | 15.437 |
| 2013-09-16 | 15.384 |
| 2013-09-17 | 15.343 |
| 2013-09-18 | 15.271 |
| 2013-09-19 | 15.188 |
| 2013-09-20 | 15.054 |
| 2013-09-21 | 15.068 |
| 2013-09-22 | 15.126 |
| 2013-09-23 | 15.085 |
| 2013-09-24 | 15.037 |
| 2013-09-25 | 14.99 |
| 2013-09-26 | 14.861 |
| 2013-09-27 | 14.812 |
| 2013-09-28 | 14.712 |
| 2013-09-29 | 14.592 |
| 2013-09-30 | 14.692 |
| 2013-10-01 | 14.732 |
| 2013-10-02 | 14.817 |
| 2013-10-03 | 14.865 |
| 2013-10-04 | 14.905 |
| 2013-10-05 | 14.863 |
| 2013-10-06 | 14.814 |
| 2013-10-07 | 15.033 |
| 2013-10-08 | 15.274 |
| 2013-10-09 | 15.455 |
| 2013-10-10 | 15.543 |
| 2013-10-11 | 15.63 |
| 2013-10-12 | 15.693 |
| 2013-10-13 | 15.77 |
| 2013-10-14 | 15.784 |
| 2013-10-15 | 15.915 |
| 2013-10-16 | 15.93 |
| 2013-10-17 | 15.882 |
| 2013-10-18 | 15.857 |
| 2013-10-19 | 15.986 |
| 2013-10-20 | 16.129 |
| 2013-10-21 | 15.988 |
| 2013-10-22 | 15.867 |
| 2013-10-23 | 15.826 |
| 2013-10-24 | 15.786 |
| 2013-10-25 | 15.745 |
| 2013-10-26 | 15.825 |
| 2013-10-27 | 15.843 |
| 2013-10-28 | 15.722 |
| 2013-10-29 | 15.617 |
| 2013-10-30 | 15.483 |
| 2013-10-31 | 15.402 |
| 2013-11-01 | 15.251 |
| 2013-11-02 | 15.136 |
| 2013-11-03 | 15.055 |
| 2013-11-04 | 14.954 |
| 2013-11-05 | 14.878 |
| 2013-11-06 | 14.571 |
| 2013-11-07 | 14.279 |
| 2013-11-08 | 13.975 |
| 2013-11-09 | 13.855 |
| 2013-11-10 | 13.762 |
| 2013-11-11 | 13.703 |
| 2013-11-12 | 13.663 |
| 2013-11-13 | 13.502 |
| 2013-11-14 | 13.216 |
| 2013-11-15 | 13.101 |
| 2013-11-16 | 13.083 |
| 2013-11-17 | 13.086 |
| 2013-11-18 | 13.086 |
| 2013-11-19 | 13.1 |
| 2013-11-20 | 13.111 |
| 2013-11-21 | 13.08 |
| 2013-11-22 | 13.028 |
| 2013-11-23 | 13.02 |
| 2013-11-24 | 13.016 |
| 2013-11-25 | 13.005 |
| 2013-11-26 | 12.996 |
| 2013-11-27 | 12.981 |
| 2013-11-28 | 12.961 |
| 2013-11-29 | 12.963 |
| 2013-11-30 | 12.924 |
| 2013-12-01 | 12.905 |
| 2013-12-02 | 12.972 |
| 2013-12-03 | 13.047 |
| 2013-12-04 | 13.131 |
| 2013-12-05 | 13.217 |
| 2013-12-06 | 13.27 |
| 2013-12-07 | 13.238 |
| 2013-12-08 | 13.256 |
| 2013-12-09 | 13.268 |
| 2013-12-10 | 13.299 |
| 2013-12-11 | 13.436 |
| 2013-12-12 | 13.566 |
| 2013-12-13 | 13.72 |
| 2013-12-14 | 13.788 |
| 2013-12-15 | 13.872 |
| 2013-12-16 | 13.98 |
| 2013-12-17 | 14.086 |
| 2013-12-18 | 14.119 |
| 2013-12-19 | 14.155 |
| 2013-12-20 | 14.174 |
| 2013-12-21 | 14.25 |
| 2013-12-22 | 14.354 |
| 2013-12-23 | 14.289 |
| 2013-12-24 | 14.202 |
| 2013-12-25 | 14.273 |
| 2013-12-26 | 14.249 |
| 2013-12-27 | 14.223 |
| 2013-12-28 | 14.223 |
| 2013-12-29 | 14.251 |
| 2013-12-30 | 14.216 |
| 2013-12-31 | 14.192 |
| 2014-01-01 | 14.19 |
| 2014-01-02 | 14.175 |
| 2014-01-03 | 14.128 |
| 2014-01-04 | 14.077 |
| 2014-01-05 | 14.093 |
| 2014-01-06 | 14.065 |
| 2014-01-07 | 14.007 |
| 2014-01-08 | 13.977 |
| 2014-01-09 | 13.926 |
| 2014-01-10 | 13.761 |
| 2014-01-11 | 13.668 |
| 2014-01-12 | 13.552 |
| 2014-01-13 | 13.537 |
| 2014-01-14 | 13.474 |
| 2014-01-15 | 13.287 |
| 2014-01-16 | 13.103 |
| 2014-01-17 | 13.035 |
| 2014-01-18 | 12.976 |
| 2014-01-19 | 12.931 |
| 2014-01-20 | 12.931 |
| 2014-01-21 | 12.928 |
| 2014-01-22 | 12.917 |
| 2014-01-23 | 12.985 |
| 2014-01-24 | 13.243 |
| 2014-01-25 | 13.291 |
| 2014-01-26 | 13.337 |
| 2014-01-27 | 13.552 |
| 2014-01-28 | 13.665 |
| 2014-01-29 | 13.854 |
| 2014-01-30 | 14.033 |
| 2014-01-31 | 14.241 |
| 2014-02-01 | 14.242 |
| 2014-02-02 | 14.267 |
| 2014-02-03 | 14.626 |
| 2014-02-04 | 14.839 |
| 2014-02-05 | 15.144 |
| 2014-02-06 | 15.349 |
| 2014-02-07 | 15.464 |
| 2014-02-08 | 15.593 |
| 2014-02-09 | 15.775 |
| 2014-02-10 | 15.749 |
| 2014-02-11 | 15.69 |
| 2014-02-12 | 15.739 |
| 2014-02-13 | 15.827 |
| 2014-02-14 | 15.889 |
| 2014-02-15 | 16.056 |
| 2014-02-16 | 16.247 |
| 2014-02-17 | 16.247 |
| 2014-02-18 | 16.128 |
| 2014-02-19 | 16.098 |
| 2014-02-20 | 16.19 |
| 2014-02-21 | 16.277 |
| 2014-02-22 | 16.402 |
| 2014-02-23 | 16.311 |
| 2014-02-24 | 16.207 |
| 2014-02-25 | 16.086 |
| 2014-02-26 | 15.94 |
| 2014-02-27 | 15.856 |
| 2014-02-28 | 15.697 |
| 2014-03-01 | 15.617 |
| 2014-03-02 | 15.47 |
| 2014-03-03 | 15.497 |
| 2014-03-04 | 15.43 |
| 2014-03-05 | 15.07 |
| 2014-03-06 | 14.837 |
| 2014-03-07 | 14.559 |
| 2014-03-08 | 14.425 |
| 2014-03-09 | 14.38 |
| 2014-03-10 | 14.371 |
| 2014-03-11 | 14.391 |
| 2014-03-12 | 14.354 |
| 2014-03-13 | 14.435 |
| 2014-03-14 | 14.603 |
| 2014-03-15 | 14.626 |
| 2014-03-16 | 14.682 |
| 2014-03-17 | 14.729 |
| 2014-03-18 | 14.72 |
| 2014-03-19 | 14.738 |
| 2014-03-20 | 14.767 |
| 2014-03-21 | 14.745 |
| 2014-03-22 | 14.742 |
| 2014-03-23 | 14.745 |
| 2014-03-24 | 14.762 |
| 2014-03-25 | 14.728 |
| 2014-03-26 | 14.76 |
| 2014-03-27 | 14.803 |
| 2014-03-28 | 14.806 |
| 2014-03-29 | 14.842 |
| 2014-03-30 | 14.885 |
| 2014-03-31 | 14.837 |
| 2014-04-01 | 14.758 |
| 2014-04-02 | 14.625 |
| 2014-04-03 | 14.592 |
| 2014-04-04 | 14.595 |
| 2014-04-05 | 14.614 |
| 2014-04-06 | 14.639 |
| 2014-04-07 | 14.683 |
| 2014-04-08 | 14.693 |
| 2014-04-09 | 14.675 |
| 2014-04-10 | 14.725 |
| 2014-04-11 | 14.841 |
| 2014-04-12 | 14.776 |
| 2014-04-13 | 14.624 |
| 2014-04-14 | 14.694 |
| 2014-04-15 | 14.736 |
| 2014-04-16 | 14.67 |
| 2014-04-17 | 14.617 |
| 2014-04-18 | 14.593 |
| 2014-04-19 | 14.596 |
| 2014-04-20 | 14.575 |
| 2014-04-21 | 14.509 |
| 2014-04-22 | 14.446 |
| 2014-04-23 | 14.36 |
| 2014-04-24 | 14.326 |
| 2014-04-25 | 14.285 |
| 2014-04-26 | 14.268 |
| 2014-04-27 | 14.261 |
| 2014-04-28 | 14.246 |
| 2014-04-29 | 14.22 |
| 2014-04-30 | 14.198 |
| 2014-05-01 | 14.205 |
| 2014-05-02 | 14.197 |
| 2014-05-03 | 14.238 |
| 2014-05-04 | 14.253 |
| 2014-05-05 | 14.205 |
| 2014-05-06 | 14.185 |
| 2014-05-07 | 14.082 |
| 2014-05-08 | 14.012 |
| 2014-05-09 | 13.97 |
| 2014-05-10 | 13.874 |
| 2014-05-11 | 13.707 |
| 2014-05-12 | 13.634 |
| 2014-05-13 | 13.562 |
| 2014-05-14 | 13.374 |
| 2014-05-15 | 13.258 |
| 2014-05-16 | 13.175 |
| 2014-05-17 | 13.166 |
| 2014-05-18 | 13.166 |
| 2014-05-19 | 13.13 |
| 2014-05-20 | 13.123 |
| 2014-05-21 | 13.062 |
| 2014-05-22 | 13.009 |
| 2014-05-23 | 12.922 |
| 2014-05-24 | 12.903 |
| 2014-05-25 | 12.845 |
| 2014-05-26 | 12.845 |
| 2014-05-27 | 12.782 |
| 2014-05-28 | 12.673 |
| 2014-05-29 | 12.571 |
| 2014-05-30 | 12.475 |
| 2014-05-31 | 12.436 |
| 2014-06-01 | 12.412 |
| 2014-06-02 | 12.37 |
| 2014-06-03 | 12.346 |
| 2014-06-04 | 12.289 |
| 2014-06-05 | 12.188 |
| 2014-06-06 | 12.06 |
| 2014-06-07 | 11.992 |
| 2014-06-08 | 11.943 |
| 2014-06-09 | 11.904 |
| 2014-06-10 | 11.86 |
| 2014-06-11 | 11.83 |
| 2014-06-12 | 11.85 |
| 2014-06-13 | 11.851 |
| 2014-06-14 | 11.785 |
| 2014-06-15 | 11.751 |
| 2014-06-16 | 11.796 |
| 2014-06-17 | 11.808 |
| 2014-06-18 | 11.722 |
| 2014-06-19 | 11.61 |
| 2014-06-20 | 11.56 |
| 2014-06-21 | 11.536 |
| 2014-06-22 | 11.546 |
| 2014-06-23 | 11.518 |
| 2014-06-24 | 11.547 |
| 2014-06-25 | 11.549 |
| 2014-06-26 | 11.554 |
| 2014-06-27 | 11.535 |
| 2014-06-28 | 11.533 |
| 2014-06-29 | 11.54 |
| 2014-06-30 | 11.541 |
| 2014-07-01 | 11.524 |
| 2014-07-02 | 11.489 |
| 2014-07-03 | 11.419 |
| 2014-07-04 | 11.387 |
| 2014-07-05 | 11.372 |
| 2014-07-06 | 11.406 |
| 2014-07-07 | 11.402 |
| 2014-07-08 | 11.43 |
| 2014-07-09 | 11.454 |
| 2014-07-10 | 11.53 |
| 2014-07-11 | 11.553 |
| 2014-07-12 | 11.503 |
| 2014-07-13 | 11.467 |
| 2014-07-14 | 11.484 |
| 2014-07-15 | 11.507 |
| 2014-07-16 | 11.429 |
| 2014-07-17 | 11.547 |
| 2014-07-18 | 11.616 |
| 2014-07-19 | 11.666 |
| 2014-07-20 | 11.708 |
| 2014-07-21 | 11.764 |
| 2014-07-22 | 11.786 |
| 2014-07-23 | 11.812 |
| 2014-07-24 | 11.798 |
| 2014-07-25 | 11.85 |
| 2014-07-26 | 11.862 |
| 2014-07-27 | 11.893 |
| 2014-07-28 | 11.926 |
| 2014-07-29 | 11.991 |
| 2014-07-30 | 12.075 |
| 2014-07-31 | 12.351 |
| 2014-08-01 | 12.647 |
| 2014-08-02 | 12.763 |
| 2014-08-03 | 12.763 |
| 2014-08-04 | 12.875 |
| 2014-08-05 | 13.057 |
| 2014-08-06 | 13.286 |
| 2014-08-07 | 13.499 |
| 2014-08-08 | 13.686 |
| 2014-08-09 | 13.738 |
| 2014-08-10 | 13.821 |
| 2014-08-11 | 13.84 |
| 2014-08-12 | 13.854 |
| 2014-08-13 | 13.903 |
| 2014-08-14 | 13.924 |
| 2014-08-15 | 14.021 |
| 2014-08-16 | 13.997 |
| 2014-08-17 | 14.094 |
| 2014-08-18 | 14.009 |
| 2014-08-19 | 13.927 |
| 2014-08-20 | 13.88 |
| 2014-08-21 | 13.859 |
| 2014-08-22 | 13.856 |
| 2014-08-23 | 13.952 |
| 2014-08-24 | 14.016 |
| 2014-08-25 | 13.905 |
| 2014-08-26 | 13.802 |
| 2014-08-27 | 13.766 |
| 2014-08-28 | 13.71 |
| 2014-08-29 | 13.649 |
| 2014-08-30 | 13.492 |
| 2014-08-31 | 13.315 |
| 2014-09-01 | 13.315 |
| 2014-09-02 | 13.264 |
| 2014-09-03 | 13.133 |
| 2014-09-04 | 12.931 |
| 2014-09-05 | 12.728 |
| 2014-09-06 | 12.531 |
| 2014-09-07 | 12.361 |
| 2014-09-08 | 12.375 |
| 2014-09-09 | 12.429 |
| 2014-09-10 | 12.365 |
| 2014-09-11 | 12.301 |
| 2014-09-12 | 12.321 |
| 2014-09-13 | 12.316 |
| 2014-09-14 | 12.272 |
| 2014-09-15 | 12.365 |
| 2014-09-16 | 12.382 |
| 2014-09-17 | 12.398 |
| 2014-09-18 | 12.389 |
| 2014-09-19 | 12.405 |
| 2014-09-20 | 12.437 |
| 2014-09-21 | 12.488 |
| 2014-09-22 | 12.548 |
| 2014-09-23 | 12.661 |
| 2014-09-24 | 12.736 |
| 2014-09-25 | 12.927 |
| 2014-09-26 | 13.073 |
| 2014-09-27 | 13.125 |
| 2014-09-28 | 13.185 |
| 2014-09-29 | 13.324 |
| 2014-09-30 | 13.467 |
| 2014-10-01 | 13.614 |
| 2014-10-02 | 13.792 |
| 2014-10-03 | 13.891 |
| 2014-10-04 | 13.951 |
| 2014-10-05 | 14.044 |
| 2014-10-06 | 14.111 |
| 2014-10-07 | 14.252 |
| 2014-10-08 | 14.363 |
| 2014-10-09 | 14.602 |
| 2014-10-10 | 14.982 |
| 2014-10-11 | 15.086 |
| 2014-10-12 | 15.175 |
| 2014-10-13 | 15.626 |
| 2014-10-14 | 15.951 |
| 2014-10-15 | 16.503 |
| 2014-10-16 | 17.07 |
| 2014-10-17 | 17.494 |
| 2014-10-18 | 17.754 |
| 2014-10-19 | 18.036 |
| 2014-10-20 | 18.062 |
| 2014-10-21 | 17.972 |
| 2014-10-22 | 18.162 |
| 2014-10-23 | 18.235 |
| 2014-10-24 | 18.364 |
| 2014-10-25 | 18.493 |
| 2014-10-26 | 18.676 |
| 2014-10-27 | 18.55 |
| 2014-10-28 | 18.361 |
| 2014-10-29 | 18.323 |
| 2014-10-30 | 18.242 |
| 2014-10-31 | 18.12 |
| 2014-11-01 | 18.213 |
| 2014-11-02 | 18.396 |
| 2014-11-03 | 18.222 |
| 2014-11-04 | 18.07 |
| 2014-11-05 | 18.012 |
| 2014-11-06 | 17.851 |
| 2014-11-07 | 17.761 |
| 2014-11-08 | 17.713 |
| 2014-11-09 | 17.537 |
| 2014-11-10 | 17.305 |
| 2014-11-11 | 17.106 |
| 2014-11-12 | 16.578 |
| 2014-11-13 | 16.169 |
| 2014-11-14 | 15.58 |
| 2014-11-15 | 15.122 |
| 2014-11-16 | 14.779 |
| 2014-11-17 | 14.741 |
| 2014-11-18 | 14.701 |
| 2014-11-19 | 14.492 |
| 2014-11-20 | 14.378 |
| 2014-11-21 | 14.152 |
| 2014-11-22 | 14.039 |
| 2014-11-23 | 13.936 |
| 2014-11-24 | 13.873 |
| 2014-11-25 | 13.799 |
| 2014-11-26 | 13.619 |
| 2014-11-27 | 13.582 |
| 2014-11-28 | 13.495 |
| 2014-11-29 | 13.444 |
| 2014-11-30 | 13.413 |
| 2014-12-01 | 13.457 |
| 2014-12-02 | 13.428 |
| 2014-12-03 | 13.32 |
| 2014-12-04 | 13.201 |
| 2014-12-05 | 13.089 |
| 2014-12-06 | 13.06 |
| 2014-12-07 | 13.057 |
| 2014-12-08 | 13.114 |
| 2014-12-09 | 13.199 |
| 2014-12-10 | 13.478 |
| 2014-12-11 | 13.819 |
| 2014-12-12 | 14.203 |
| 2014-12-13 | 14.224 |
| 2014-12-14 | 14.272 |
| 2014-12-15 | 14.579 |
| 2014-12-16 | 15.007 |
| 2014-12-17 | 15.267 |
| 2014-12-18 | 15.407 |
| 2014-12-19 | 15.528 |
| 2014-12-20 | 15.625 |
| 2014-12-21 | 15.768 |
| 2014-12-22 | 15.743 |
| 2014-12-23 | 15.698 |
| 2014-12-24 | 15.781 |
| 2014-12-25 | 15.958 |
| 2014-12-26 | 16.079 |
| 2014-12-27 | 16.079 |
| 2014-12-28 | 16.224 |
| 2014-12-29 | 16.166 |
| 2014-12-30 | 16.154 |
| 2014-12-31 | 16.388 |
| 2015-01-01 | 16.565 |
| 2015-01-02 | 16.831 |
| 2015-01-03 | 17.065 |
| 2015-01-04 | 17.356 |
| 2015-01-05 | 17.491 |
| 2015-01-06 | 17.673 |
| 2015-01-07 | 17.928 |
| 2015-01-08 | 18.034 |
| 2015-01-09 | 17.985 |
| 2015-01-10 | 17.874 |
| 2015-01-11 | 17.696 |
| 2015-01-12 | 17.796 |
| 2015-01-13 | 17.934 |
| 2015-01-14 | 17.988 |
| 2015-01-15 | 17.928 |
| 2015-01-16 | 18.004 |
| 2015-01-17 | 18.067 |
| 2015-01-18 | 18.154 |
| 2015-01-19 | 18.154 |
| 2015-01-20 | 18.246 |
| 2015-01-21 | 18.435 |
| 2015-01-22 | 18.519 |
| 2015-01-23 | 18.64 |
| 2015-01-24 | 18.64 |
| 2015-01-25 | 18.87 |
| 2015-01-26 | 18.694 |
| 2015-01-27 | 18.62 |
| 2015-01-28 | 18.889 |
| 2015-01-29 | 19.031 |
| 2015-01-30 | 19.12 |
| 2015-01-31 | 19.12 |
| 2015-02-01 | 19.189 |
| 2015-02-02 | 19.201 |
| 2015-02-03 | 19.112 |
| 2015-02-04 | 19.037 |
| 2015-02-05 | 18.833 |
| 2015-02-06 | 18.737 |
| 2015-02-07 | 18.824 |
| 2015-02-08 | 18.891 |
| 2015-02-09 | 18.874 |
| 2015-02-10 | 18.795 |
| 2015-02-11 | 18.67 |
| 2015-02-12 | 18.421 |
| 2015-02-13 | 18.098 |
| 2015-02-14 | 17.883 |
| 2015-02-15 | 17.722 |
| 2015-02-16 | 17.722 |
| 2015-02-17 | 17.625 |
| 2015-02-18 | 17.522 |
| 2015-02-19 | 17.303 |
| 2015-02-20 | 17.086 |
| 2015-02-21 | 17.12 |
| 2015-02-22 | 17.145 |
| 2015-02-23 | 17.016 |
| 2015-02-24 | 16.857 |
| 2015-02-25 | 16.777 |
| 2015-02-26 | 16.62 |
| 2015-02-27 | 16.281 |
| 2015-02-28 | 16.157 |
| 2015-03-01 | 15.904 |
| 2015-03-02 | 15.761 |
| 2015-03-03 | 15.67 |
| 2015-03-04 | 15.423 |
| 2015-03-05 | 15.266 |
| 2015-03-06 | 15.117 |
| 2015-03-07 | 15.03 |
| 2015-03-08 | 14.912 |
| 2015-03-09 | 14.919 |
| 2015-03-10 | 15.003 |
| 2015-03-11 | 14.923 |
| 2015-03-12 | 14.837 |
| 2015-03-13 | 14.791 |
| 2015-03-14 | 14.764 |
| 2015-03-15 | 14.768 |
| 2015-03-16 | 14.81 |
| 2015-03-17 | 14.85 |
| 2015-03-18 | 14.81 |
| 2015-03-19 | 14.732 |
| 2015-03-20 | 14.621 |
| 2015-03-21 | 14.59 |
| 2015-03-22 | 14.604 |
| 2015-03-23 | 14.547 |
| 2015-03-24 | 14.505 |
| 2015-03-25 | 14.545 |
| 2015-03-26 | 14.641 |
| 2015-03-27 | 14.697 |
| 2015-03-28 | 14.734 |
| 2015-03-29 | 14.804 |
| 2015-03-30 | 14.79 |
| 2015-03-31 | 14.813 |
| 2015-04-01 | 14.907 |
| 2015-04-02 | 14.944 |
| 2015-04-03 | 14.978 |
| 2015-04-04 | 15.025 |
| 2015-04-05 | 15.015 |
| 2015-04-06 | 15.002 |
| 2015-04-07 | 14.991 |
| 2015-04-08 | 14.94 |
| 2015-04-09 | 14.768 |
| 2015-04-10 | 14.564 |
| 2015-04-11 | 14.521 |
| 2015-04-12 | 14.443 |
| 2015-04-13 | 14.418 |
| 2015-04-14 | 14.382 |
| 2015-04-15 | 14.25 |
| 2015-04-16 | 14.105 |
| 2015-04-17 | 14.101 |
| 2015-04-18 | 14.102 |
| 2015-04-19 | 14.159 |
| 2015-04-20 | 14.117 |
| 2015-04-21 | 14.075 |
| 2015-04-22 | 14.042 |
| 2015-04-23 | 13.988 |
| 2015-04-24 | 13.838 |
| 2015-04-25 | 13.74 |
| 2015-04-26 | 13.669 |
| 2015-04-27 | 13.642 |
| 2015-04-28 | 13.583 |
| 2015-04-29 | 13.53 |
| 2015-04-30 | 13.495 |
| 2015-05-01 | 13.38 |
| 2015-05-02 | 13.316 |
| 2015-05-03 | 13.316 |
| 2015-05-04 | 13.293 |
| 2015-05-05 | 13.34 |
| 2015-05-06 | 13.358 |
| 2015-05-07 | 13.374 |
| 2015-05-08 | 13.323 |
| 2015-05-09 | 13.334 |
| 2015-05-10 | 13.372 |
| 2015-05-11 | 13.395 |
| 2015-05-12 | 13.416 |
| 2015-05-13 | 13.408 |
| 2015-05-14 | 13.365 |
| 2015-05-15 | 13.345 |
| 2015-05-16 | 13.38 |
| 2015-05-17 | 13.354 |
| 2015-05-18 | 13.325 |
| 2015-05-19 | 13.303 |
| 2015-05-20 | 13.284 |
| 2015-05-21 | 13.232 |
| 2015-05-22 | 13.206 |
| 2015-05-23 | 13.24 |
| 2015-05-24 | 13.288 |
| 2015-05-25 | 13.288 |
| 2015-05-26 | 13.325 |
| 2015-05-27 | 13.332 |
| 2015-05-28 | 13.375 |
| 2015-05-29 | 13.396 |
| 2015-05-30 | 13.338 |
| 2015-05-31 | 13.372 |
| 2015-06-01 | 13.402 |
| 2015-06-02 | 13.442 |
| 2015-06-03 | 13.48 |
| 2015-06-04 | 13.5 |
| 2015-06-05 | 13.455 |
| 2015-06-06 | 13.371 |
| 2015-06-07 | 13.398 |
| 2015-06-08 | 13.493 |
| 2015-06-09 | 13.539 |
| 2015-06-10 | 13.509 |
| 2015-06-11 | 13.461 |
| 2015-06-12 | 13.462 |
| 2015-06-13 | 13.498 |
| 2015-06-14 | 13.557 |
| 2015-06-15 | 13.648 |
| 2015-06-16 | 13.704 |
| 2015-06-17 | 13.788 |
| 2015-06-18 | 13.804 |
| 2015-06-19 | 13.856 |
| 2015-06-20 | 13.943 |
| 2015-06-21 | 14.038 |
| 2015-06-22 | 13.973 |
| 2015-06-23 | 13.885 |
| 2015-06-24 | 13.856 |
| 2015-06-25 | 13.854 |
| 2015-06-26 | 13.888 |
| 2015-06-27 | 13.916 |
| 2015-06-28 | 13.92 |
| 2015-06-29 | 14.154 |
| 2015-06-30 | 14.34 |
| 2015-07-01 | 14.436 |
| 2015-07-02 | 14.552 |
| 2015-07-03 | 14.594 |
| 2015-07-04 | 14.588 |
| 2015-07-05 | 14.608 |
| 2015-07-06 | 14.728 |
| 2015-07-07 | 14.793 |
| 2015-07-08 | 15.001 |
| 2015-07-09 | 15.263 |
| 2015-07-10 | 15.435 |
| 2015-07-11 | 15.564 |
| 2015-07-12 | 15.658 |
| 2015-07-13 | 15.57 |
| 2015-07-14 | 15.466 |
| 2015-07-15 | 15.363 |
| 2015-07-16 | 15.234 |
| 2015-07-17 | 15.113 |
| 2015-07-18 | 15.209 |
| 2015-07-19 | 15.275 |
| 2015-07-20 | 15.124 |
| 2015-07-21 | 14.985 |
| 2015-07-22 | 14.956 |
| 2015-07-23 | 14.981 |
| 2015-07-24 | 15.004 |
| 2015-07-25 | 15.054 |
| 2015-07-26 | 15.108 |
| 2015-07-27 | 15.132 |
| 2015-07-28 | 15.052 |
| 2015-07-29 | 14.75 |
| 2015-07-30 | 14.459 |
| 2015-07-31 | 14.27 |
| 2015-08-01 | 14.144 |
| 2015-08-02 | 14.144 |
| 2015-08-03 | 14.069 |
| 2015-08-04 | 14.02 |
| 2015-08-05 | 13.815 |
| 2015-08-06 | 13.71 |
| 2015-08-07 | 13.425 |
| 2015-08-08 | 13.113 |
| 2015-08-09 | 12.928 |
| 2015-08-10 | 12.894 |
| 2015-08-11 | 12.931 |
| 2015-08-12 | 12.918 |
| 2015-08-13 | 12.924 |
| 2015-08-14 | 12.905 |
| 2015-08-15 | 12.943 |
| 2015-08-16 | 12.993 |
| 2015-08-17 | 12.994 |
| 2015-08-18 | 13.03 |
| 2015-08-19 | 13.167 |
| 2015-08-20 | 13.481 |
| 2015-08-21 | 14.205 |
| 2015-08-22 | 14.279 |
| 2015-08-23 | 14.306 |
| 2015-08-24 | 15.565 |
| 2015-08-25 | 16.495 |
| 2015-08-26 | 17.164 |
| 2015-08-27 | 17.739 |
| 2015-08-28 | 18.355 |
| 2015-08-29 | 18.651 |
| 2015-08-30 | 18.978 |
| 2015-08-31 | 19.428 |
| 2015-09-01 | 19.972 |
| 2015-09-02 | 20.587 |
| 2015-09-03 | 21.16 |
| 2015-09-04 | 21.855 |
| 2015-09-05 | 22.24 |
| 2015-09-06 | 22.683 |
| 2015-09-07 | 22.683 |
| 2015-09-08 | 22.789 |
| 2015-09-09 | 23.455 |
| 2015-09-10 | 23.963 |
| 2015-09-11 | 24.42 |
| 2015-09-12 | 24.966 |
| 2015-09-13 | 25.605 |
| 2015-09-14 | 25.537 |
| 2015-09-15 | 25.394 |
| 2015-09-16 | 25.791 |
| 2015-09-17 | 26.141 |
| 2015-09-18 | 26.476 |
| 2015-09-19 | 26.842 |
| 2015-09-20 | 26.78 |
| 2015-09-21 | 26.448 |
| 2015-09-22 | 26.257 |
| 2015-09-23 | 25.371 |
| 2015-09-24 | 24.773 |
| 2015-09-25 | 24.454 |
| 2015-09-26 | 24.372 |
| 2015-09-27 | 24.284 |
| 2015-09-28 | 24.451 |
| 2015-09-29 | 24.564 |
| 2015-09-30 | 24.377 |
| 2015-10-01 | 23.956 |
| 2015-10-02 | 23.71 |
| 2015-10-03 | 23.616 |
| 2015-10-04 | 23.395 |
| 2015-10-05 | 23.203 |
| 2015-10-06 | 23.021 |
| 2015-10-07 | 22.811 |
| 2015-10-08 | 22.471 |
| 2015-10-09 | 22.055 |
| 2015-10-10 | 21.945 |
| 2015-10-11 | 21.882 |
| 2015-10-12 | 21.61 |
| 2015-10-13 | 21.431 |
| 2015-10-14 | 21.149 |
| 2015-10-15 | 20.854 |
| 2015-10-16 | 20.567 |
| 2015-10-17 | 20.54 |
| 2015-10-18 | 20.453 |
| 2015-10-19 | 20.192 |
| 2015-10-20 | 19.99 |
| 2015-10-21 | 19.834 |
| 2015-10-22 | 19.471 |
| 2015-10-23 | 19.122 |
| 2015-10-24 | 18.915 |
| 2015-10-25 | 18.68 |
| 2015-10-26 | 18.519 |
| 2015-10-27 | 18.378 |
| 2015-10-28 | 17.774 |
| 2015-10-29 | 17.218 |
| 2015-10-30 | 16.79 |
| 2015-10-31 | 16.515 |
| 2015-11-01 | 16.294 |
| 2015-11-02 | 16.192 |
| 2015-11-03 | 16.117 |
| 2015-11-04 | 15.934 |
| 2015-11-05 | 15.736 |
| 2015-11-06 | 15.551 |
| 2015-11-07 | 15.462 |
| 2015-11-08 | 15.381 |
| 2015-11-09 | 15.435 |
| 2015-11-10 | 15.429 |
| 2015-11-11 | 15.424 |
| 2015-11-12 | 15.455 |
| 2015-11-13 | 15.549 |
| 2015-11-14 | 15.525 |
| 2015-11-15 | 15.548 |
| 2015-11-16 | 15.673 |
| 2015-11-17 | 15.817 |
| 2015-11-18 | 15.902 |
| 2015-11-19 | 15.958 |
| 2015-11-20 | 15.902 |
| 2015-11-21 | 15.971 |
| 2015-11-22 | 16.047 |
| 2015-11-23 | 16.027 |
| 2015-11-24 | 16.022 |
| 2015-11-25 | 16.018 |
| 2015-11-26 | 16.046 |
| 2015-11-27 | 16.083 |
| 2015-11-28 | 16.157 |
| 2015-11-29 | 16.214 |
| 2015-11-30 | 16.21 |
| 2015-12-01 | 16.137 |
| 2015-12-02 | 16.22 |
| 2015-12-03 | 16.39 |
| 2015-12-04 | 16.357 |
| 2015-12-05 | 16.423 |
| 2015-12-06 | 16.533 |
| 2015-12-07 | 16.498 |
| 2015-12-08 | 16.55 |
| 2015-12-09 | 16.698 |
| 2015-12-10 | 16.89 |
| 2015-12-11 | 17.287 |
| 2015-12-12 | 17.233 |
| 2015-12-13 | 17.083 |
| 2015-12-14 | 17.366 |
| 2015-12-15 | 17.536 |
| 2015-12-16 | 17.522 |
| 2015-12-17 | 17.527 |
| 2015-12-18 | 17.71 |
| 2015-12-19 | 17.746 |
| 2015-12-20 | 17.866 |
| 2015-12-21 | 17.908 |
| 2015-12-22 | 17.845 |
| 2015-12-23 | 17.843 |
| 2015-12-24 | 17.834 |
| 2015-12-25 | 17.966 |
| 2015-12-26 | 17.966 |
| 2015-12-27 | 18.116 |
| 2015-12-28 | 18.056 |
| 2015-12-29 | 17.961 |
| 2015-12-30 | 18.017 |
| 2015-12-31 | 18.185 |
| 2016-01-01 | 18.299 |
| 2016-01-02 | 18.309 |
| 2016-01-03 | 18.503 |
| 2016-01-04 | 18.619 |
| 2016-01-05 | 18.655 |
| 2016-01-06 | 18.892 |
| 2016-01-07 | 19.262 |
| 2016-01-08 | 19.632 |
| 2016-01-09 | 19.647 |
| 2016-01-10 | 19.384 |
| 2016-01-11 | 19.643 |
| 2016-01-12 | 19.784 |
| 2016-01-13 | 19.909 |
| 2016-01-14 | 20.059 |
| 2016-01-15 | 20.516 |
| 2016-01-16 | 20.599 |
| 2016-01-17 | 20.594 |
| 2016-01-18 | 20.594 |
| 2016-01-19 | 20.881 |
| 2016-01-20 | 21.349 |
| 2016-01-21 | 21.88 |
| 2016-01-22 | 22.236 |
| 2016-01-23 | 22.597 |
| 2016-01-24 | 22.597 |
| 2016-01-25 | 22.679 |
| 2016-01-26 | 22.67 |
| 2016-01-27 | 22.98 |
| 2016-01-28 | 23.297 |
| 2016-01-29 | 23.442 |
| 2016-01-30 | 23.718 |
| 2016-01-31 | 23.718 |
| 2016-02-01 | 23.531 |
| 2016-02-02 | 23.457 |
| 2016-02-03 | 23.502 |
| 2016-02-04 | 23.621 |
| 2016-02-05 | 23.754 |
| 2016-02-06 | 23.693 |
| 2016-02-07 | 23.518 |
| 2016-02-08 | 23.642 |
| 2016-02-09 | 23.78 |
| 2016-02-10 | 23.875 |
| 2016-02-11 | 24.145 |
| 2016-02-12 | 24.153 |
| 2016-02-13 | 24.164 |
| 2016-02-14 | 24.013 |
| 2016-02-15 | 24.013 |
| 2016-02-16 | 24.018 |
| 2016-02-17 | 23.937 |
| 2016-02-18 | 23.727 |
| 2016-02-19 | 23.39 |
| 2016-02-20 | 23.226 |
| 2016-02-21 | 23.272 |
| 2016-02-22 | 23.077 |
| 2016-02-23 | 22.978 |
| 2016-02-24 | 22.814 |
| 2016-02-25 | 22.653 |
| 2016-02-26 | 22.496 |
| 2016-02-27 | 22.5 |
| 2016-02-28 | 22.621 |
| 2016-02-29 | 22.517 |
| 2016-03-01 | 22.288 |
| 2016-03-02 | 22.15 |
| 2016-03-03 | 21.899 |
| 2016-03-04 | 21.67 |
| 2016-03-05 | 21.662 |
| 2016-03-06 | 21.572 |
| 2016-03-07 | 21.36 |
| 2016-03-08 | 21.232 |
| 2016-03-09 | 20.868 |
| 2016-03-10 | 20.463 |
| 2016-03-11 | 19.997 |
| 2016-03-12 | 19.59 |
| 2016-03-13 | 19.284 |
| 2016-03-14 | 19.166 |
| 2016-03-15 | 19.055 |
| 2016-03-16 | 18.87 |
| 2016-03-17 | 18.431 |
| 2016-03-18 | 18.054 |
| 2016-03-19 | 17.883 |
| 2016-03-20 | 17.751 |
| 2016-03-21 | 17.562 |
| 2016-03-22 | 17.408 |
| 2016-03-23 | 17.206 |
| 2016-03-24 | 16.923 |
| 2016-03-25 | 16.742 |
| 2016-03-26 | 16.624 |
| 2016-03-27 | 16.456 |
| 2016-03-28 | 16.395 |
| 2016-03-29 | 16.272 |
| 2016-03-30 | 15.94 |
| 2016-03-31 | 15.761 |
| 2016-04-01 | 15.571 |
| 2016-04-02 | 15.515 |
| 2016-04-03 | 15.444 |
| 2016-04-04 | 15.378 |
| 2016-04-05 | 15.38 |
| 2016-04-06 | 15.224 |
| 2016-04-07 | 15.105 |
| 2016-04-08 | 14.963 |
| 2016-04-09 | 14.808 |
| 2016-04-10 | 14.719 |
| 2016-04-11 | 14.796 |
| 2016-04-12 | 14.799 |
| 2016-04-13 | 14.652 |
| 2016-04-14 | 14.504 |
| 2016-04-15 | 14.439 |
| 2016-04-16 | 14.438 |
| 2016-04-17 | 14.461 |
| 2016-04-18 | 14.405 |
| 2016-04-19 | 14.35 |
| 2016-04-20 | 14.325 |
| 2016-04-21 | 14.315 |
| 2016-04-22 | 14.233 |
| 2016-04-23 | 14.208 |
| 2016-04-24 | 14.208 |
| 2016-04-25 | 14.201 |
| 2016-04-26 | 14.19 |
| 2016-04-27 | 14.124 |
| 2016-04-28 | 14.187 |
| 2016-04-29 | 14.285 |
| 2016-04-30 | 14.3 |
| 2016-05-01 | 14.361 |
| 2016-05-02 | 14.376 |
| 2016-05-03 | 14.431 |
| 2016-05-04 | 14.519 |
| 2016-05-05 | 14.541 |
| 2016-05-06 | 14.57 |
| 2016-05-07 | 14.494 |
| 2016-05-08 | 14.451 |
| 2016-05-09 | 14.457 |
| 2016-05-10 | 14.419 |
| 2016-05-11 | 14.348 |
| 2016-05-12 | 14.328 |
| 2016-05-13 | 14.382 |
| 2016-05-14 | 14.414 |
| 2016-05-15 | 14.454 |
| 2016-05-16 | 14.464 |
| 2016-05-17 | 14.515 |
| 2016-05-18 | 14.633 |
| 2016-05-19 | 14.773 |
| 2016-05-20 | 14.86 |
| 2016-05-21 | 14.904 |
| 2016-05-22 | 14.988 |
| 2016-05-23 | 15.028 |
| 2016-05-24 | 15 |
| 2016-05-25 | 14.992 |
| 2016-05-26 | 14.968 |
| 2016-05-27 | 14.938 |
| 2016-05-28 | 14.925 |
| 2016-05-29 | 14.886 |
| 2016-05-30 | 14.886 |
| 2016-05-31 | 14.853 |
| 2016-06-01 | 14.83 |
| 2016-06-02 | 14.736 |
| 2016-06-03 | 14.613 |
| 2016-06-04 | 14.548 |
| 2016-06-05 | 14.539 |
| 2016-06-06 | 14.495 |
| 2016-06-07 | 14.474 |
| 2016-06-08 | 14.45 |
| 2016-06-09 | 14.499 |
| 2016-06-10 | 14.61 |
| 2016-06-11 | 14.62 |
| 2016-06-12 | 14.598 |
| 2016-06-13 | 14.917 |
| 2016-06-14 | 15.182 |
| 2016-06-15 | 15.442 |
| 2016-06-16 | 15.623 |
| 2016-06-17 | 15.788 |
| 2016-06-18 | 15.761 |
| 2016-06-19 | 15.791 |
| 2016-06-20 | 15.92 |
| 2016-06-21 | 16.041 |
| 2016-06-22 | 16.296 |
| 2016-06-23 | 16.431 |
| 2016-06-24 | 16.996 |
| 2016-06-25 | 17.174 |
| 2016-06-26 | 17.387 |
| 2016-06-27 | 17.711 |
| 2016-06-28 | 17.76 |
| 2016-06-29 | 17.709 |
| 2016-06-30 | 17.775 |
| 2016-07-01 | 17.8 |
| 2016-07-02 | 17.999 |
| 2016-07-03 | 18.226 |
| 2016-07-04 | 18.226 |
| 2016-07-05 | 18.1 |
| 2016-07-06 | 18.162 |
| 2016-07-07 | 18.196 |
| 2016-07-08 | 18.154 |
| 2016-07-09 | 18.329 |
| 2016-07-10 | 18.398 |
| 2016-07-11 | 18.155 |
| 2016-07-12 | 17.936 |
| 2016-07-13 | 17.558 |
| 2016-07-14 | 17.192 |
| 2016-07-15 | 16.837 |
| 2016-07-16 | 16.71 |
| 2016-07-17 | 16.568 |
| 2016-07-18 | 16.362 |
| 2016-07-19 | 16.152 |
| 2016-07-20 | 15.838 |
| 2016-07-21 | 15.565 |
| 2016-07-22 | 15.129 |
| 2016-07-23 | 15.023 |
| 2016-07-24 | 14.458 |
| 2016-07-25 | 14.378 |
| 2016-07-26 | 14.315 |
| 2016-07-27 | 13.79 |
| 2016-07-28 | 13.503 |
| 2016-07-29 | 13.276 |
| 2016-07-30 | 13.158 |
| 2016-07-31 | 13.074 |
| 2016-08-01 | 13.042 |
| 2016-08-02 | 13.058 |
| 2016-08-03 | 13.049 |
| 2016-08-04 | 12.905 |
| 2016-08-05 | 12.743 |
| 2016-08-06 | 12.647 |
| 2016-08-07 | 12.619 |
| 2016-08-08 | 12.566 |
| 2016-08-09 | 12.525 |
| 2016-08-10 | 12.457 |
| 2016-08-11 | 12.372 |
| 2016-08-12 | 12.304 |
| 2016-08-13 | 12.28 |
| 2016-08-14 | 12.26 |
| 2016-08-15 | 12.239 |
| 2016-08-16 | 12.257 |
| 2016-08-17 | 12.245 |
| 2016-08-18 | 12.221 |
| 2016-08-19 | 12.201 |
| 2016-08-20 | 12.176 |
| 2016-08-21 | 12.184 |
| 2016-08-22 | 12.188 |
| 2016-08-23 | 12.196 |
| 2016-08-24 | 12.223 |
| 2016-08-25 | 12.249 |
| 2016-08-26 | 12.286 |
| 2016-08-27 | 12.266 |
| 2016-08-28 | 12.286 |
| 2016-08-29 | 12.317 |
| 2016-08-30 | 12.353 |
| 2016-08-31 | 12.398 |
| 2016-09-01 | 12.403 |
| 2016-09-02 | 12.363 |
| 2016-09-03 | 12.36 |
| 2016-09-04 | 12.408 |
| 2016-09-05 | 12.408 |
| 2016-09-06 | 12.39 |
| 2016-09-07 | 12.411 |
| 2016-09-08 | 12.451 |
| 2016-09-09 | 12.711 |
| 2016-09-10 | 12.762 |
| 2016-09-11 | 12.826 |
| 2016-09-12 | 12.943 |
| 2016-09-13 | 13.177 |
| 2016-09-14 | 13.478 |
| 2016-09-15 | 13.652 |
| 2016-09-16 | 13.804 |
| 2016-09-17 | 13.922 |
| 2016-09-18 | 14.058 |
| 2016-09-19 | 14.132 |
| 2016-09-20 | 14.217 |
| 2016-09-21 | 14.266 |
| 2016-09-22 | 14.249 |
| 2016-09-23 | 14.194 |
| 2016-09-24 | 14.222 |
| 2016-09-25 | 14.252 |
| 2016-09-26 | 14.265 |
| 2016-09-27 | 14.209 |
| 2016-09-28 | 14.183 |
| 2016-09-29 | 14.226 |
| 2016-09-30 | 14.22 |
| 2016-10-01 | 14.256 |
| 2016-10-02 | 14.376 |
| 2016-10-03 | 14.336 |
| 2016-10-04 | 14.302 |
| 2016-10-05 | 14.243 |
| 2016-10-06 | 14.28 |
| 2016-10-07 | 14.35 |
| 2016-10-08 | 14.438 |
| 2016-10-09 | 14.284 |
| 2016-10-10 | 14.241 |
| 2016-10-11 | 14.292 |
| 2016-10-12 | 14.326 |
| 2016-10-13 | 14.274 |
| 2016-10-14 | 14.182 |
| 2016-10-15 | 14.081 |
| 2016-10-16 | 14.016 |
| 2016-10-17 | 14.121 |
| 2016-10-18 | 14.174 |
| 2016-10-19 | 14.123 |
| 2016-10-20 | 14.024 |
| 2016-10-21 | 14.026 |
| 2016-10-22 | 14.121 |
| 2016-10-23 | 14.213 |
| 2016-10-24 | 14.156 |
| 2016-10-25 | 14.125 |
| 2016-10-26 | 14.113 |
| 2016-10-27 | 14.215 |
| 2016-10-28 | 14.388 |
| 2016-10-29 | 14.406 |
| 2016-10-30 | 14.462 |
| 2016-10-31 | 14.585 |
| 2016-11-01 | 14.766 |
| 2016-11-02 | 15.027 |
| 2016-11-03 | 15.411 |
| 2016-11-04 | 15.844 |
| 2016-11-05 | 15.987 |
| 2016-11-06 | 16.112 |
| 2016-11-07 | 16.236 |
| 2016-11-08 | 16.35 |
| 2016-11-09 | 16.395 |
| 2016-11-10 | 16.367 |
| 2016-11-11 | 16.288 |
| 2016-11-12 | 16.269 |
| 2016-11-13 | 16.276 |
| 2016-11-14 | 16.191 |
| 2016-11-15 | 16.063 |
| 2016-11-16 | 15.95 |
| 2016-11-17 | 15.862 |
| 2016-11-18 | 15.791 |
| 2016-11-19 | 15.888 |
| 2016-11-20 | 16.016 |
| 2016-11-21 | 15.844 |
| 2016-11-22 | 15.688 |
| 2016-11-23 | 15.661 |
| 2016-11-24 | 15.766 |
| 2016-11-25 | 15.676 |
| 2016-11-26 | 15.692 |
| 2016-11-27 | 15.665 |
| 2016-11-28 | 15.539 |
| 2016-11-29 | 15.414 |
| 2016-11-30 | 15.236 |
| 2016-12-01 | 15.022 |
| 2016-12-02 | 14.775 |
| 2016-12-03 | 14.41 |
| 2016-12-04 | 13.983 |
| 2016-12-05 | 13.891 |
| 2016-12-06 | 13.791 |
| 2016-12-07 | 13.482 |
| 2016-12-08 | 13.191 |
| 2016-12-09 | 13.066 |
| 2016-12-10 | 12.982 |
| 2016-12-11 | 12.92 |
| 2016-12-12 | 12.906 |
| 2016-12-13 | 12.897 |
| 2016-12-14 | 12.836 |
| 2016-12-15 | 12.808 |
| 2016-12-16 | 12.736 |
| 2016-12-17 | 12.705 |
| 2016-12-18 | 12.697 |
| 2016-12-19 | 12.648 |
| 2016-12-20 | 12.591 |
| 2016-12-21 | 12.536 |
| 2016-12-22 | 12.49 |
| 2016-12-23 | 12.442 |
| 2016-12-24 | 12.442 |
| 2016-12-25 | 12.448 |
| 2016-12-26 | 12.448 |
| 2016-12-27 | 12.426 |
| 2016-12-28 | 12.416 |
| 2016-12-29 | 12.439 |
| 2016-12-30 | 12.472 |
| 2016-12-31 | 12.392 |
| 2017-01-01 | 12.302 |
| 2017-01-02 | 12.302 |
| 2017-01-03 | 12.329 |
| 2017-01-04 | 12.314 |
| 2017-01-05 | 12.308 |
| 2017-01-06 | 12.263 |
| 2017-01-07 | 12.244 |
| 2017-01-08 | 12.271 |
| 2017-01-09 | 12.234 |
| 2017-01-10 | 12.196 |
| 2017-01-11 | 12.127 |
| 2017-01-12 | 12.068 |
| 2017-01-13 | 11.97 |
| 2017-01-14 | 11.927 |
| 2017-01-15 | 11.912 |
| 2017-01-16 | 11.912 |
| 2017-01-17 | 11.91 |
| 2017-01-18 | 11.951 |
| 2017-01-19 | 12.021 |
| 2017-01-20 | 12.035 |
| 2017-01-21 | 12.068 |
| 2017-01-22 | 12.105 |
| 2017-01-23 | 12.087 |
| 2017-01-24 | 12.033 |
| 2017-01-25 | 11.972 |
| 2017-01-26 | 11.904 |
| 2017-01-27 | 11.785 |
| 2017-01-28 | 11.702 |
| 2017-01-29 | 11.572 |
| 2017-01-30 | 11.588 |
| 2017-01-31 | 11.609 |
| 2017-02-01 | 11.618 |
| 2017-02-02 | 11.574 |
| 2017-02-03 | 11.532 |
| 2017-02-04 | 11.526 |
| 2017-02-05 | 11.536 |
| 2017-02-06 | 11.528 |
| 2017-02-07 | 11.517 |
| 2017-02-08 | 11.511 |
| 2017-02-09 | 11.482 |
| 2017-02-10 | 11.463 |
| 2017-02-11 | 11.459 |
| 2017-02-12 | 11.471 |
| 2017-02-13 | 11.451 |
| 2017-02-14 | 11.417 |
| 2017-02-15 | 11.442 |
| 2017-02-16 | 11.437 |
| 2017-02-17 | 11.392 |
| 2017-02-18 | 11.326 |
| 2017-02-19 | 11.315 |
| 2017-02-20 | 11.315 |
| 2017-02-21 | 11.328 |
| 2017-02-22 | 11.326 |
| 2017-02-23 | 11.357 |
| 2017-02-24 | 11.388 |
| 2017-02-25 | 11.426 |
| 2017-02-26 | 11.471 |
| 2017-02-27 | 11.502 |
| 2017-02-28 | 11.569 |
| 2017-03-01 | 11.6 |
| 2017-03-02 | 11.592 |
| 2017-03-03 | 11.551 |
| 2017-03-04 | 11.532 |
| 2017-03-05 | 11.562 |
| 2017-03-06 | 11.546 |
| 2017-03-07 | 11.541 |
| 2017-03-08 | 11.565 |
| 2017-03-09 | 11.613 |
| 2017-03-10 | 11.623 |
| 2017-03-11 | 11.66 |
| 2017-03-12 | 11.703 |
| 2017-03-13 | 11.685 |
| 2017-03-14 | 11.714 |
| 2017-03-15 | 11.741 |
| 2017-03-16 | 11.763 |
| 2017-03-17 | 11.73 |
| 2017-03-18 | 11.729 |
| 2017-03-19 | 11.742 |
| 2017-03-20 | 11.722 |
| 2017-03-21 | 11.757 |
| 2017-03-22 | 11.805 |
| 2017-03-23 | 11.875 |
| 2017-03-24 | 11.931 |
| 2017-03-25 | 11.941 |
| 2017-03-26 | 11.965 |
| 2017-03-27 | 11.99 |
| 2017-03-28 | 11.97 |
| 2017-03-29 | 11.939 |
| 2017-03-30 | 11.876 |
| 2017-03-31 | 11.869 |
| 2017-04-01 | 11.871 |
| 2017-04-02 | 11.917 |
| 2017-04-03 | 11.939 |
| 2017-04-04 | 11.932 |
| 2017-04-05 | 12.007 |
| 2017-04-06 | 12.05 |
| 2017-04-07 | 12.096 |
| 2017-04-08 | 12.086 |
| 2017-04-09 | 12.107 |
| 2017-04-10 | 12.2 |
| 2017-04-11 | 12.33 |
| 2017-04-12 | 12.531 |
| 2017-04-13 | 12.698 |
| 2017-04-14 | 12.749 |
| 2017-04-15 | 12.826 |
| 2017-04-16 | 12.907 |
| 2017-04-17 | 12.995 |
| 2017-04-18 | 13.062 |
| 2017-04-19 | 13.233 |
| 2017-04-20 | 13.313 |
| 2017-04-21 | 13.4 |
| 2017-04-22 | 13.414 |
| 2017-04-23 | 13.438 |
| 2017-04-24 | 13.308 |
| 2017-04-25 | 13.187 |
| 2017-04-26 | 13.108 |
| 2017-04-27 | 13.052 |
| 2017-04-28 | 13.024 |
| 2017-04-29 | 13.098 |
| 2017-04-30 | 13.136 |
| 2017-05-01 | 12.985 |
| 2017-05-02 | 12.871 |
| 2017-05-03 | 12.79 |
| 2017-05-04 | 12.727 |
| 2017-05-05 | 12.616 |
| 2017-05-06 | 12.628 |
| 2017-05-07 | 12.615 |
| 2017-05-08 | 12.472 |
| 2017-05-09 | 12.353 |
| 2017-05-10 | 12.17 |
| 2017-05-11 | 11.957 |
| 2017-05-12 | 11.701 |
| 2017-05-13 | 11.488 |
| 2017-05-14 | 11.488 |
| 2017-05-15 | 11.438 |
| 2017-05-16 | 11.402 |
| 2017-05-17 | 11.444 |
| 2017-05-18 | 11.455 |
| 2017-05-19 | 11.324 |
| 2017-05-20 | 11.189 |
| 2017-05-21 | 11.017 |
| 2017-05-22 | 11.013 |
| 2017-05-23 | 11 |
| 2017-05-24 | 10.962 |
| 2017-05-25 | 10.927 |
| 2017-05-26 | 10.88 |
| 2017-05-27 | 10.905 |
| 2017-05-28 | 10.909 |
| 2017-05-29 | 10.909 |
| 2017-05-30 | 10.884 |
| 2017-05-31 | 10.898 |
| 2017-06-01 | 10.865 |
| 2017-06-02 | 10.82 |
| 2017-06-03 | 10.839 |
| 2017-06-04 | 10.853 |
| 2017-06-05 | 10.814 |
| 2017-06-06 | 10.796 |
| 2017-06-07 | 10.826 |
| 2017-06-08 | 10.835 |
| 2017-06-09 | 10.859 |
| 2017-06-10 | 10.871 |
| 2017-06-11 | 10.896 |
| 2017-06-12 | 10.924 |
| 2017-06-13 | 10.9 |
| 2017-06-14 | 10.911 |
| 2017-06-15 | 10.923 |
| 2017-06-16 | 10.675 |
| 2017-06-17 | 10.475 |
| 2017-06-18 | 10.393 |
| 2017-06-19 | 10.392 |
| 2017-06-20 | 10.414 |
| 2017-06-21 | 10.406 |
| 2017-06-22 | 10.394 |
| 2017-06-23 | 10.394 |
| 2017-06-24 | 10.414 |
| 2017-06-25 | 10.446 |
| 2017-06-26 | 10.419 |
| 2017-06-27 | 10.45 |
| 2017-06-28 | 10.43 |
| 2017-06-29 | 10.479 |
| 2017-06-30 | 10.514 |
| 2017-07-01 | 10.543 |
| 2017-07-02 | 10.583 |
| 2017-07-03 | 10.613 |
| 2017-07-04 | 10.613 |
| 2017-07-05 | 10.661 |
| 2017-07-06 | 10.76 |
| 2017-07-07 | 10.799 |
| 2017-07-08 | 10.83 |
| 2017-07-09 | 10.837 |
| 2017-07-10 | 10.851 |
| 2017-07-11 | 10.853 |
| 2017-07-12 | 10.798 |
| 2017-07-13 | 10.773 |
| 2017-07-14 | 10.719 |
| 2017-07-15 | 10.71 |
| 2017-07-16 | 10.727 |
| 2017-07-17 | 10.682 |
| 2017-07-18 | 10.644 |
| 2017-07-19 | 10.617 |
| 2017-07-20 | 10.556 |
| 2017-07-21 | 10.49 |
| 2017-07-22 | 10.49 |
| 2017-07-23 | 10.515 |
| 2017-07-24 | 10.461 |
| 2017-07-25 | 10.411 |
| 2017-07-26 | 10.397 |
| 2017-07-27 | 10.352 |
| 2017-07-28 | 10.364 |
| 2017-07-29 | 10.311 |
| 2017-07-30 | 10.265 |
| 2017-07-31 | 10.264 |
| 2017-08-01 | 10.256 |
| 2017-08-02 | 10.211 |
| 2017-08-03 | 10.222 |
| 2017-08-04 | 10.175 |
| 2017-08-05 | 10.062 |
| 2017-08-06 | 10.005 |
| 2017-08-07 | 10.002 |
| 2017-08-08 | 10.045 |
| 2017-08-09 | 10.045 |
| 2017-08-10 | 10.28 |
| 2017-08-11 | 10.516 |
| 2017-08-12 | 10.546 |
| 2017-08-13 | 10.598 |
| 2017-08-14 | 10.68 |
| 2017-08-15 | 10.742 |
| 2017-08-16 | 10.829 |
| 2017-08-17 | 11.086 |
| 2017-08-18 | 11.29 |
| 2017-08-19 | 11.371 |
| 2017-08-20 | 11.471 |
| 2017-08-21 | 11.553 |
| 2017-08-22 | 11.544 |
| 2017-08-23 | 11.672 |
| 2017-08-24 | 11.8 |
| 2017-08-25 | 11.876 |
| 2017-08-26 | 11.96 |
| 2017-08-27 | 12.044 |
| 2017-08-28 | 12.009 |
| 2017-08-29 | 11.995 |
| 2017-08-30 | 12.039 |
| 2017-08-31 | 12.061 |
| 2017-09-01 | 12.055 |
| 2017-09-02 | 12.131 |
| 2017-09-03 | 12.236 |
| 2017-09-04 | 12.236 |
| 2017-09-05 | 12.236 |
| 2017-09-06 | 12.317 |
| 2017-09-07 | 12.345 |
| 2017-09-08 | 12.393 |
| 2017-09-09 | 12.211 |
| 2017-09-10 | 12.037 |
| 2017-09-11 | 11.972 |
| 2017-09-12 | 11.906 |
| 2017-09-13 | 11.819 |
| 2017-09-14 | 11.742 |
| 2017-09-15 | 11.668 |
| 2017-09-16 | 11.474 |
| 2017-09-17 | 11.327 |
| 2017-09-18 | 11.268 |
| 2017-09-19 | 11.216 |
| 2017-09-20 | 11.054 |
| 2017-09-21 | 10.974 |
| 2017-09-22 | 10.847 |
| 2017-09-23 | 10.778 |
| 2017-09-24 | 10.752 |
| 2017-09-25 | 10.724 |
| 2017-09-26 | 10.698 |
| 2017-09-27 | 10.629 |
| 2017-09-28 | 10.527 |
| 2017-09-29 | 10.445 |
| 2017-09-30 | 10.438 |
| 2017-10-01 | 10.454 |
| 2017-10-02 | 10.404 |
| 2017-10-03 | 10.361 |
| 2017-10-04 | 10.328 |
| 2017-10-05 | 10.19 |
| 2017-10-06 | 10.1 |
| 2017-10-07 | 10.031 |
| 2017-10-08 | 9.926 |
| 2017-10-09 | 9.946 |
| 2017-10-10 | 9.952 |
| 2017-10-11 | 9.912 |
| 2017-10-12 | 9.881 |
| 2017-10-13 | 9.841 |
| 2017-10-14 | 9.812 |
| 2017-10-15 | 9.795 |
| 2017-10-16 | 9.8 |
| 2017-10-17 | 9.823 |
| 2017-10-18 | 9.82 |
| 2017-10-19 | 9.814 |
| 2017-10-20 | 9.822 |
| 2017-10-21 | 9.83 |
| 2017-10-22 | 9.842 |
| 2017-10-23 | 9.9 |
| 2017-10-24 | 9.957 |
| 2017-10-25 | 10.004 |
| 2017-10-26 | 10.055 |
| 2017-10-27 | 10.052 |
| 2017-10-28 | 10.076 |
| 2017-10-29 | 10.104 |
| 2017-10-30 | 10.123 |
| 2017-10-31 | 10.125 |
| 2017-11-01 | 10.16 |
| 2017-11-02 | 10.179 |
| 2017-11-03 | 10.156 |
| 2017-11-04 | 10.202 |
| 2017-11-05 | 10.23 |
| 2017-11-06 | 10.19 |
| 2017-11-07 | 10.177 |
| 2017-11-08 | 10.152 |
| 2017-11-09 | 10.171 |
| 2017-11-10 | 10.236 |
| 2017-11-11 | 10.252 |
| 2017-11-12 | 10.284 |
| 2017-11-13 | 10.342 |
| 2017-11-14 | 10.399 |
| 2017-11-15 | 10.545 |
| 2017-11-16 | 10.611 |
| 2017-11-17 | 10.673 |
| 2017-11-18 | 10.702 |
| 2017-11-19 | 10.739 |
| 2017-11-20 | 10.735 |
| 2017-11-21 | 10.689 |
| 2017-11-22 | 10.635 |
| 2017-11-23 | 10.61 |
| 2017-11-24 | 10.536 |
| 2017-11-25 | 10.497 |
| 2017-11-26 | 10.534 |
| 2017-11-27 | 10.501 |
| 2017-11-28 | 10.479 |
| 2017-11-29 | 10.488 |
| 2017-11-30 | 10.54 |
| 2017-12-01 | 10.599 |
| 2017-12-02 | 10.632 |
| 2017-12-03 | 10.711 |
| 2017-12-04 | 10.76 |
| 2017-12-05 | 10.787 |
| 2017-12-06 | 10.864 |
| 2017-12-07 | 10.877 |
| 2017-12-08 | 10.867 |
| 2017-12-09 | 10.886 |
| 2017-12-10 | 10.864 |
| 2017-12-11 | 10.788 |
| 2017-12-12 | 10.747 |
| 2017-12-13 | 10.684 |
| 2017-12-14 | 10.631 |
| 2017-12-15 | 10.455 |
| 2017-12-16 | 10.39 |
| 2017-12-17 | 10.335 |
| 2017-12-18 | 10.295 |
| 2017-12-19 | 10.282 |
| 2017-12-20 | 10.238 |
| 2017-12-21 | 10.232 |
| 2017-12-22 | 10.233 |
| 2017-12-23 | 10.233 |
| 2017-12-24 | 10.262 |
| 2017-12-25 | 10.262 |
| 2017-12-26 | 10.261 |
| 2017-12-27 | 10.29 |
| 2017-12-28 | 10.297 |
| 2017-12-29 | 10.313 |
| 2017-12-30 | 10.264 |
| 2017-12-31 | 10.203 |
| 2018-01-01 | 10.203 |
| 2018-01-02 | 10.182 |
| 2018-01-03 | 10.055 |
| 2018-01-04 | 9.95 |
| 2018-01-05 | 9.86 |
| 2018-01-06 | 9.844 |
| 2018-01-07 | 9.858 |
| 2018-01-08 | 9.841 |
| 2018-01-09 | 9.853 |
| 2018-01-10 | 9.877 |
| 2018-01-11 | 9.875 |
| 2018-01-12 | 9.873 |
| 2018-01-13 | 9.841 |
| 2018-01-14 | 9.864 |
| 2018-01-15 | 9.864 |
| 2018-01-16 | 9.959 |
| 2018-01-17 | 10.084 |
| 2018-01-18 | 10.199 |
| 2018-01-19 | 10.281 |
| 2018-01-20 | 10.318 |
| 2018-01-21 | 10.342 |
| 2018-01-22 | 10.381 |
| 2018-01-23 | 10.418 |
| 2018-01-24 | 10.471 |
| 2018-01-25 | 10.538 |
| 2018-01-26 | 10.568 |
| 2018-01-27 | 10.588 |
| 2018-01-28 | 10.563 |
| 2018-01-29 | 10.736 |
| 2018-01-30 | 10.939 |
| 2018-01-31 | 11.062 |
| 2018-02-01 | 11.239 |
| 2018-02-02 | 11.627 |
| 2018-02-03 | 11.748 |
| 2018-02-04 | 11.881 |
| 2018-02-05 | 13.152 |
| 2018-02-06 | 13.954 |
| 2018-02-07 | 14.821 |
| 2018-02-08 | 15.934 |
| 2018-02-09 | 16.85 |
| 2018-02-10 | 17.199 |
| 2018-02-11 | 17.569 |
| 2018-02-12 | 17.972 |
| 2018-02-13 | 18.305 |
| 2018-02-14 | 18.348 |
| 2018-02-15 | 18.688 |
| 2018-02-16 | 19.031 |
| 2018-02-17 | 19.355 |
| 2018-02-18 | 19.759 |
| 2018-02-19 | 19.759 |
| 2018-02-20 | 19.8 |
| 2018-02-21 | 20.228 |
| 2018-02-22 | 20.59 |
| 2018-02-23 | 20.83 |
| 2018-02-24 | 21.292 |
| 2018-02-25 | 21.829 |
| 2018-02-26 | 21.528 |
| 2018-02-27 | 21.388 |
| 2018-02-28 | 21.674 |
| 2018-03-01 | 22.04 |
| 2018-03-02 | 22.328 |
| 2018-03-03 | 22.771 |
| 2018-03-04 | 23.058 |
| 2018-03-05 | 22.842 |
| 2018-03-06 | 22.629 |
| 2018-03-07 | 21.697 |
| 2018-03-08 | 21.057 |
| 2018-03-09 | 20.434 |
| 2018-03-10 | 19.783 |
| 2018-03-11 | 19.294 |
| 2018-03-12 | 19.118 |
| 2018-03-13 | 18.987 |
| 2018-03-14 | 18.588 |
| 2018-03-15 | 18.189 |
| 2018-03-16 | 18.024 |
| 2018-03-17 | 17.968 |
| 2018-03-18 | 17.89 |
| 2018-03-19 | 17.946 |
| 2018-03-20 | 17.959 |
| 2018-03-21 | 17.954 |
| 2018-03-22 | 18.079 |
| 2018-03-23 | 18.299 |
| 2018-03-24 | 18.279 |
| 2018-03-25 | 18.368 |
| 2018-03-26 | 18.495 |
| 2018-03-27 | 18.677 |
| 2018-03-28 | 18.999 |
| 2018-03-29 | 19.061 |
| 2018-03-30 | 19.024 |
| 2018-03-31 | 18.851 |
| 2018-04-01 | 18.813 |
| 2018-04-02 | 19.053 |
| 2018-04-03 | 19.15 |
| 2018-04-04 | 19.214 |
| 2018-04-05 | 19.241 |
| 2018-04-06 | 19.419 |
| 2018-04-07 | 19.563 |
| 2018-04-08 | 19.822 |
| 2018-04-09 | 19.92 |
| 2018-04-10 | 19.946 |
| 2018-04-11 | 20.158 |
| 2018-04-12 | 20.26 |
| 2018-04-13 | 20.269 |
| 2018-04-14 | 20.452 |
| 2018-04-15 | 20.697 |
| 2018-04-16 | 20.491 |
| 2018-04-17 | 20.241 |
| 2018-04-18 | 20.078 |
| 2018-04-19 | 19.971 |
| 2018-04-20 | 19.925 |
| 2018-04-21 | 19.754 |
| 2018-04-22 | 19.485 |
| 2018-04-23 | 19.328 |
| 2018-04-24 | 19.265 |
| 2018-04-25 | 19.113 |
| 2018-04-26 | 18.815 |
| 2018-04-27 | 18.46 |
| 2018-04-28 | 18.384 |
| 2018-04-29 | 18.384 |
| 2018-04-30 | 18.268 |
| 2018-05-01 | 18.141 |
| 2018-05-02 | 17.794 |
| 2018-05-03 | 17.557 |
| 2018-05-04 | 17.317 |
| 2018-05-05 | 17.24 |
| 2018-05-06 | 17.027 |
| 2018-05-07 | 16.919 |
| 2018-05-08 | 16.818 |
| 2018-05-09 | 16.439 |
| 2018-05-10 | 16.11 |
| 2018-05-11 | 15.765 |
| 2018-05-12 | 15.635 |
| 2018-05-13 | 15.546 |
| 2018-05-14 | 15.421 |
| 2018-05-15 | 15.385 |
| 2018-05-16 | 15.243 |
| 2018-05-17 | 15.16 |
| 2018-05-18 | 15.061 |
| 2018-05-19 | 15.018 |
| 2018-05-20 | 14.925 |
| 2018-05-21 | 14.837 |
| 2018-05-22 | 14.764 |
| 2018-05-23 | 14.593 |
| 2018-05-24 | 14.343 |
| 2018-05-25 | 14.133 |
| 2018-05-26 | 14.033 |
| 2018-05-27 | 13.964 |
| 2018-05-28 | 13.964 |
| 2018-05-29 | 14.11 |
| 2018-05-30 | 14.062 |
| 2018-05-31 | 14.06 |
| 2018-06-01 | 13.94 |
| 2018-06-02 | 13.842 |
| 2018-06-03 | 13.793 |
| 2018-06-04 | 13.74 |
| 2018-06-05 | 13.677 |
| 2018-06-06 | 13.529 |
| 2018-06-07 | 13.406 |
| 2018-06-08 | 13.347 |
| 2018-06-09 | 13.353 |
| 2018-06-10 | 13.389 |
| 2018-06-11 | 13.338 |
| 2018-06-12 | 13.29 |
| 2018-06-13 | 13.29 |
| 2018-06-14 | 13.171 |
| 2018-06-15 | 13.102 |
| 2018-06-16 | 13.086 |
| 2018-06-17 | 13.068 |
| 2018-06-18 | 13.03 |
| 2018-06-19 | 13.046 |
| 2018-06-20 | 13.032 |
| 2018-06-21 | 13.1 |
| 2018-06-22 | 13.156 |
| 2018-06-23 | 13.187 |
| 2018-06-24 | 13.186 |
| 2018-06-25 | 13.393 |
| 2018-06-26 | 13.513 |
| 2018-06-27 | 13.713 |
| 2018-06-28 | 13.705 |
| 2018-06-29 | 13.758 |
| 2018-06-30 | 13.678 |
| 2018-07-01 | 13.689 |
| 2018-07-02 | 13.78 |
| 2018-07-03 | 13.887 |
| 2018-07-04 | 13.942 |
| 2018-07-05 | 14.064 |
| 2018-07-06 | 14.147 |
| 2018-07-07 | 14.247 |
| 2018-07-08 | 14.356 |
| 2018-07-09 | 14.273 |
| 2018-07-10 | 14.195 |
| 2018-07-11 | 14.256 |
| 2018-07-12 | 14.268 |
| 2018-07-13 | 14.231 |
| 2018-07-14 | 14.337 |
| 2018-07-15 | 14.461 |
| 2018-07-16 | 14.379 |
| 2018-07-17 | 14.269 |
| 2018-07-18 | 14.259 |
| 2018-07-19 | 14.236 |
| 2018-07-20 | 14.24 |
| 2018-07-21 | 14.22 |
| 2018-07-22 | 14.243 |
| 2018-07-23 | 14.162 |
| 2018-07-24 | 14.079 |
| 2018-07-25 | 13.839 |
| 2018-07-26 | 13.659 |
| 2018-07-27 | 13.426 |
| 2018-07-28 | 13.255 |
| 2018-07-29 | 13.106 |
| 2018-07-30 | 13.164 |
| 2018-07-31 | 13.148 |
| 2018-08-01 | 13.031 |
| 2018-08-02 | 12.843 |
| 2018-08-03 | 12.788 |
| 2018-08-04 | 12.684 |
| 2018-08-05 | 12.65 |
| 2018-08-06 | 12.584 |
| 2018-08-07 | 12.509 |
| 2018-08-08 | 12.425 |
| 2018-08-09 | 12.363 |
| 2018-08-10 | 12.342 |
| 2018-08-11 | 12.33 |
| 2018-08-12 | 12.338 |
| 2018-08-13 | 12.454 |
| 2018-08-14 | 12.493 |
| 2018-08-15 | 12.575 |
| 2018-08-16 | 12.639 |
| 2018-08-17 | 12.663 |
| 2018-08-18 | 12.653 |
| 2018-08-19 | 12.643 |
| 2018-08-20 | 12.636 |
| 2018-08-21 | 12.646 |
| 2018-08-22 | 12.629 |
| 2018-08-23 | 12.629 |
| 2018-08-24 | 12.615 |
| 2018-08-25 | 12.638 |
| 2018-08-26 | 12.618 |
| 2018-08-27 | 12.597 |
| 2018-08-28 | 12.592 |
| 2018-08-29 | 12.501 |
| 2018-08-30 | 12.533 |
| 2018-08-31 | 12.52 |
| 2018-09-01 | 12.535 |
| 2018-09-02 | 12.58 |
| 2018-09-03 | 12.58 |
| 2018-09-04 | 12.608 |
| 2018-09-05 | 12.733 |
| 2018-09-06 | 12.91 |
| 2018-09-07 | 13.102 |
| 2018-09-08 | 13.194 |
| 2018-09-09 | 13.196 |
| 2018-09-10 | 13.244 |
| 2018-09-11 | 13.243 |
| 2018-09-12 | 13.165 |
| 2018-09-13 | 13.12 |
| 2018-09-14 | 12.998 |
| 2018-09-15 | 12.975 |
| 2018-09-16 | 12.993 |
| 2018-09-17 | 13.027 |
| 2018-09-18 | 13.016 |
| 2018-09-19 | 12.98 |
| 2018-09-20 | 12.93 |
| 2018-09-21 | 12.903 |
| 2018-09-22 | 12.927 |
| 2018-09-23 | 12.977 |
| 2018-09-24 | 12.938 |
| 2018-09-25 | 12.913 |
| 2018-09-26 | 12.948 |
| 2018-09-27 | 12.944 |
| 2018-09-28 | 12.938 |
| 2018-09-29 | 12.908 |
| 2018-09-30 | 12.911 |
| 2018-10-01 | 12.865 |
| 2018-10-02 | 12.826 |
| 2018-10-03 | 12.771 |
| 2018-10-04 | 12.819 |
| 2018-10-05 | 12.86 |
| 2018-10-06 | 12.775 |
| 2018-10-07 | 12.67 |
| 2018-10-08 | 12.814 |
| 2018-10-09 | 12.956 |
| 2018-10-10 | 13.356 |
| 2018-10-11 | 13.891 |
| 2018-10-12 | 14.262 |
| 2018-10-13 | 14.352 |
| 2018-10-14 | 14.467 |
| 2018-10-15 | 14.792 |
| 2018-10-16 | 14.92 |
| 2018-10-17 | 15.09 |
| 2018-10-18 | 15.42 |
| 2018-10-19 | 15.79 |
| 2018-10-20 | 15.98 |
| 2018-10-21 | 16.195 |
| 2018-10-22 | 16.359 |
| 2018-10-23 | 16.557 |
| 2018-10-24 | 17.149 |
| 2018-10-25 | 17.685 |
| 2018-10-26 | 18.198 |
| 2018-10-27 | 18.473 |
| 2018-10-28 | 18.791 |
| 2018-10-29 | 19.072 |
| 2018-10-30 | 19.267 |
| 2018-10-31 | 19.686 |
| 2018-11-01 | 20.018 |
| 2018-11-02 | 20.377 |
| 2018-11-03 | 20.67 |
| 2018-11-04 | 20.963 |
| 2018-11-05 | 20.915 |
| 2018-11-06 | 20.869 |
| 2018-11-07 | 20.9 |
| 2018-11-08 | 20.935 |
| 2018-11-09 | 20.68 |
| 2018-11-10 | 20.475 |
| 2018-11-11 | 20.434 |
| 2018-11-12 | 20.434 |
| 2018-11-13 | 20.415 |
| 2018-11-14 | 20.413 |
| 2018-11-15 | 20.52 |
| 2018-11-16 | 20.554 |
| 2018-11-17 | 20.578 |
| 2018-11-18 | 20.612 |
| 2018-11-19 | 20.588 |
| 2018-11-20 | 20.674 |
| 2018-11-21 | 20.726 |
| 2018-11-22 | 20.727 |
| 2018-11-23 | 20.55 |
| 2018-11-24 | 20.367 |
| 2018-11-25 | 20.167 |
| 2018-11-26 | 20.104 |
| 2018-11-27 | 20.052 |
| 2018-11-28 | 19.757 |
| 2018-11-29 | 19.54 |
| 2018-11-30 | 19.389 |
| 2018-12-01 | 19.391 |
| 2018-12-02 | 19.385 |
| 2018-12-03 | 19.238 |
| 2018-12-04 | 19.31 |
| 2018-12-05 | 19.277 |
| 2018-12-06 | 19.341 |
| 2018-12-07 | 19.685 |
| 2018-12-08 | 19.841 |
| 2018-12-09 | 19.978 |
| 2018-12-10 | 20.118 |
| 2018-12-11 | 20.2 |
| 2018-12-12 | 20.251 |
| 2018-12-13 | 20.282 |
| 2018-12-14 | 20.301 |
| 2018-12-15 | 20.318 |
| 2018-12-16 | 20.439 |
| 2018-12-17 | 20.654 |
| 2018-12-18 | 20.9 |
| 2018-12-19 | 21.174 |
| 2018-12-20 | 21.469 |
| 2018-12-21 | 21.935 |
| 2018-12-22 | 21.935 |
| 2018-12-23 | 21.957 |
| 2018-12-24 | 22.662 |
| 2018-12-25 | 22.662 |
| 2018-12-26 | 23.238 |
| 2018-12-27 | 23.785 |
| 2018-12-28 | 24.277 |
| 2018-12-29 | 24.566 |
| 2018-12-30 | 24.927 |
| 2018-12-31 | 24.953 |
| 2019-01-01 | 24.953 |
| 2019-01-02 | 25.31 |
| 2019-01-03 | 25.558 |
| 2019-01-04 | 25.349 |
| 2019-01-05 | 25.568 |
| 2019-01-06 | 25.698 |
| 2019-01-07 | 25.472 |
| 2019-01-08 | 25.222 |
| 2019-01-09 | 25.088 |
| 2019-01-10 | 24.975 |
| 2019-01-11 | 24.812 |
| 2019-01-12 | 25.031 |
| 2019-01-13 | 25.22 |
| 2019-01-14 | 24.896 |
| 2019-01-15 | 24.582 |
| 2019-01-16 | 24.308 |
| 2019-01-17 | 23.932 |
| 2019-01-18 | 23.543 |
| 2019-01-19 | 23.288 |
| 2019-01-20 | 22.909 |
| 2019-01-21 | 22.909 |
| 2019-01-22 | 22.798 |
| 2019-01-23 | 21.927 |
| 2019-01-24 | 21.775 |
| 2019-01-25 | 21.126 |
| 2019-01-26 | 20.661 |
| 2019-01-27 | 20.234 |
| 2019-01-28 | 20.162 |
| 2019-01-29 | 20.11 |
| 2019-01-30 | 19.722 |
| 2019-01-31 | 19.572 |
| 2019-02-01 | 19.235 |
| 2019-02-02 | 18.925 |
| 2019-02-03 | 18.795 |
| 2019-02-04 | 18.642 |
| 2019-02-05 | 18.496 |
| 2019-02-06 | 18.209 |
| 2019-02-07 | 18.014 |
| 2019-02-08 | 17.811 |
| 2019-02-09 | 17.727 |
| 2019-02-10 | 17.702 |
| 2019-02-11 | 17.616 |
| 2019-02-12 | 17.511 |
| 2019-02-13 | 17.349 |
| 2019-02-14 | 17.235 |
| 2019-02-15 | 17.039 |
| 2019-02-16 | 16.988 |
| 2019-02-17 | 16.945 |
| 2019-02-18 | 16.945 |
| 2019-02-19 | 16.842 |
| 2019-02-20 | 16.707 |
| 2019-02-21 | 16.405 |
| 2019-02-22 | 16.119 |
| 2019-02-23 | 15.98 |
| 2019-02-24 | 15.905 |
| 2019-02-25 | 15.852 |
| 2019-02-26 | 15.82 |
| 2019-02-27 | 15.621 |
| 2019-02-28 | 15.414 |
| 2019-03-01 | 15.219 |
| 2019-03-02 | 15.151 |
| 2019-03-03 | 15.099 |
| 2019-03-04 | 15.076 |
| 2019-03-05 | 15.06 |
| 2019-03-06 | 15.06 |
| 2019-03-07 | 15.109 |
| 2019-03-08 | 15.141 |
| 2019-03-09 | 15.079 |
| 2019-03-10 | 15.046 |
| 2019-03-11 | 15.01 |
| 2019-03-12 | 14.951 |
| 2019-03-13 | 14.829 |
| 2019-03-14 | 14.737 |
| 2019-03-15 | 14.605 |
| 2019-03-16 | 14.525 |
| 2019-03-17 | 14.504 |
| 2019-03-18 | 14.434 |
| 2019-03-19 | 14.392 |
| 2019-03-20 | 14.37 |
| 2019-03-21 | 14.314 |
| 2019-03-22 | 14.425 |
| 2019-03-23 | 14.424 |
| 2019-03-24 | 14.47 |
| 2019-03-25 | 14.558 |
| 2019-03-26 | 14.564 |
| 2019-03-27 | 14.577 |
| 2019-03-28 | 14.544 |
| 2019-03-29 | 14.499 |
| 2019-03-30 | 14.485 |
| 2019-03-31 | 14.531 |
| 2019-04-01 | 14.477 |
| 2019-04-02 | 14.426 |
| 2019-04-03 | 14.386 |
| 2019-04-04 | 14.333 |
| 2019-04-05 | 14.2 |
| 2019-04-06 | 14.087 |
| 2019-04-07 | 13.988 |
| 2019-04-08 | 13.95 |
| 2019-04-09 | 13.965 |
| 2019-04-10 | 13.918 |
| 2019-04-11 | 13.884 |
| 2019-04-12 | 13.82 |
| 2019-04-13 | 13.836 |
| 2019-04-14 | 13.884 |
| 2019-04-15 | 13.809 |
| 2019-04-16 | 13.735 |
| 2019-04-17 | 13.712 |
| 2019-04-18 | 13.645 |
| 2019-04-19 | 13.633 |
| 2019-04-20 | 13.633 |
| 2019-04-21 | 13.483 |
| 2019-04-22 | 13.43 |
| 2019-04-23 | 13.375 |
| 2019-04-24 | 13.223 |
| 2019-04-25 | 13.155 |
| 2019-04-26 | 13.04 |
| 2019-04-27 | 12.971 |
| 2019-04-28 | 12.932 |
| 2019-04-29 | 12.94 |
| 2019-04-30 | 12.949 |
| 2019-05-01 | 13.016 |
| 2019-05-02 | 13.066 |
| 2019-05-03 | 13.025 |
| 2019-05-04 | 12.997 |
| 2019-05-05 | 13.006 |
| 2019-05-06 | 13.128 |
| 2019-05-07 | 13.423 |
| 2019-05-08 | 13.719 |
| 2019-05-09 | 13.949 |
| 2019-05-10 | 14.079 |
| 2019-05-11 | 14.132 |
| 2019-05-12 | 14.244 |
| 2019-05-13 | 14.559 |
| 2019-05-14 | 14.726 |
| 2019-05-15 | 14.922 |
| 2019-05-16 | 15.07 |
| 2019-05-17 | 15.23 |
| 2019-05-18 | 15.387 |
| 2019-05-19 | 15.387 |
| 2019-05-20 | 15.431 |
| 2019-05-21 | 15.409 |
| 2019-05-22 | 15.515 |
| 2019-05-23 | 15.726 |
| 2019-05-24 | 15.849 |
| 2019-05-25 | 15.973 |
| 2019-05-26 | 16.135 |
| 2019-05-27 | 16.135 |
| 2019-05-28 | 16.2 |
| 2019-05-29 | 16.428 |
| 2019-05-30 | 16.627 |
| 2019-05-31 | 16.813 |
| 2019-06-01 | 16.933 |
| 2019-06-02 | 17.147 |
| 2019-06-03 | 17.232 |
| 2019-06-04 | 17.22 |
| 2019-06-05 | 17.251 |
| 2019-06-06 | 17.09 |
| 2019-06-07 | 16.942 |
| 2019-06-08 | 16.834 |
| 2019-06-09 | 16.876 |
| 2019-06-10 | 16.829 |
| 2019-06-11 | 16.789 |
| 2019-06-12 | 16.568 |
| 2019-06-13 | 16.461 |
| 2019-06-14 | 16.406 |
| 2019-06-15 | 16.462 |
| 2019-06-16 | 16.488 |
| 2019-06-17 | 16.432 |
| 2019-06-18 | 16.37 |
| 2019-06-19 | 16.276 |
| 2019-06-20 | 16.267 |
| 2019-06-21 | 16.298 |
| 2019-06-22 | 16.266 |
| 2019-06-23 | 16.288 |
| 2019-06-24 | 16.237 |
| 2019-06-25 | 16.239 |
| 2019-06-26 | 16.238 |
| 2019-06-27 | 16.161 |
| 2019-06-28 | 16.033 |
| 2019-06-29 | 15.973 |
| 2019-06-30 | 15.836 |
| 2019-07-01 | 15.751 |
| 2019-07-02 | 15.623 |
| 2019-07-03 | 15.337 |
| 2019-07-04 | 15.26 |
| 2019-07-05 | 15.126 |
| 2019-07-06 | 15.086 |
| 2019-07-07 | 15.022 |
| 2019-07-08 | 14.968 |
| 2019-07-09 | 14.927 |
| 2019-07-10 | 14.788 |
| 2019-07-11 | 14.642 |
| 2019-07-12 | 14.475 |
| 2019-07-13 | 14.408 |
| 2019-07-14 | 14.362 |
| 2019-07-15 | 14.278 |
| 2019-07-16 | 14.21 |
| 2019-07-17 | 14.144 |
| 2019-07-18 | 14.067 |
| 2019-07-19 | 14.073 |
| 2019-07-20 | 14.039 |
| 2019-07-21 | 13.967 |
| 2019-07-22 | 13.946 |
| 2019-07-23 | 13.882 |
| 2019-07-24 | 13.73 |
| 2019-07-25 | 13.561 |
| 2019-07-26 | 13.369 |
| 2019-07-27 | 13.246 |
| 2019-07-28 | 13.149 |
| 2019-07-29 | 13.134 |
| 2019-07-30 | 13.172 |
| 2019-07-31 | 13.27 |
| 2019-08-01 | 13.505 |
| 2019-08-02 | 13.745 |
| 2019-08-03 | 13.745 |
| 2019-08-04 | 13.769 |
| 2019-08-05 | 14.284 |
| 2019-08-06 | 14.551 |
| 2019-08-07 | 14.803 |
| 2019-08-08 | 14.931 |
| 2019-08-09 | 15.155 |
| 2019-08-10 | 15.261 |
| 2019-08-11 | 15.405 |
| 2019-08-12 | 15.676 |
| 2019-08-13 | 15.76 |
| 2019-08-14 | 16.188 |
| 2019-08-15 | 16.566 |
| 2019-08-16 | 16.77 |
| 2019-08-17 | 16.925 |
| 2019-08-18 | 17.048 |
| 2019-08-19 | 17.04 |
| 2019-08-20 | 17.061 |
| 2019-08-21 | 17.165 |
| 2019-08-22 | 17.35 |
| 2019-08-23 | 17.704 |
| 2019-08-24 | 17.94 |
| 2019-08-25 | 18.23 |
| 2019-08-26 | 18.281 |
| 2019-08-27 | 18.374 |
| 2019-08-28 | 18.67 |
| 2019-08-29 | 18.849 |
| 2019-08-30 | 18.979 |
| 2019-08-31 | 19.032 |
| 2019-09-01 | 19.103 |
| 2019-09-02 | 19.103 |
| 2019-09-03 | 19.13 |
| 2019-09-04 | 18.784 |
| 2019-09-05 | 18.598 |
| 2019-09-06 | 18.384 |
| 2019-09-07 | 18.458 |
| 2019-09-08 | 18.484 |
| 2019-09-09 | 18.323 |
| 2019-09-10 | 18.174 |
| 2019-09-11 | 17.866 |
| 2019-09-12 | 17.709 |
| 2019-09-13 | 17.31 |
| 2019-09-14 | 17.117 |
| 2019-09-15 | 17.046 |
| 2019-09-16 | 16.927 |
| 2019-09-17 | 16.809 |
| 2019-09-18 | 16.669 |
| 2019-09-19 | 16.505 |
| 2019-09-20 | 16.482 |
| 2019-09-21 | 16.472 |
| 2019-09-22 | 16.293 |
| 2019-09-23 | 16.224 |
| 2019-09-24 | 16.263 |
| 2019-09-25 | 16.103 |
| 2019-09-26 | 15.901 |
| 2019-09-27 | 15.8 |
| 2019-09-28 | 15.696 |
| 2019-09-29 | 15.523 |
| 2019-09-30 | 15.559 |
| 2019-10-01 | 15.702 |
| 2019-10-02 | 15.923 |
| 2019-10-03 | 15.898 |
| 2019-10-04 | 15.885 |
| 2019-10-05 | 15.867 |
| 2019-10-06 | 15.91 |
| 2019-10-07 | 16.003 |
| 2019-10-08 | 16.197 |
| 2019-10-09 | 16.35 |
| 2019-10-10 | 16.458 |
| 2019-10-11 | 16.502 |
| 2019-10-12 | 16.611 |
| 2019-10-13 | 16.754 |
| 2019-10-14 | 16.65 |
| 2019-10-15 | 16.509 |
| 2019-10-16 | 16.464 |
| 2019-10-17 | 16.435 |
| 2019-10-18 | 16.448 |
| 2019-10-19 | 16.562 |
| 2019-10-20 | 16.624 |
| 2019-10-21 | 16.5 |
| 2019-10-22 | 16.407 |
| 2019-10-23 | 16.366 |
| 2019-10-24 | 16.214 |
| 2019-10-25 | 16.064 |
| 2019-10-26 | 16.063 |
| 2019-10-27 | 16.005 |
| 2019-10-28 | 15.868 |
| 2019-10-29 | 15.746 |
| 2019-10-30 | 15.569 |
| 2019-10-31 | 15.326 |
| 2019-11-01 | 14.95 |
| 2019-11-02 | 14.752 |
| 2019-11-03 | 14.638 |
| 2019-11-04 | 14.551 |
| 2019-11-05 | 14.485 |
| 2019-11-06 | 14.247 |
| 2019-11-07 | 13.904 |
| 2019-11-08 | 13.605 |
| 2019-11-09 | 13.417 |
| 2019-11-10 | 13.308 |
| 2019-11-11 | 13.279 |
| 2019-11-12 | 13.252 |
| 2019-11-13 | 13.18 |
| 2019-11-14 | 13.158 |
| 2019-11-15 | 13.084 |
| 2019-11-16 | 13.05 |
| 2019-11-17 | 12.99 |
| 2019-11-18 | 12.965 |
| 2019-11-19 | 12.96 |
| 2019-11-20 | 12.905 |
| 2019-11-21 | 12.845 |
| 2019-11-22 | 12.769 |
| 2019-11-23 | 12.724 |
| 2019-11-24 | 12.728 |
| 2019-11-25 | 12.687 |
| 2019-11-26 | 12.635 |
| 2019-11-27 | 12.573 |
| 2019-11-28 | 12.543 |
| 2019-11-29 | 12.557 |
| 2019-11-30 | 12.524 |
| 2019-12-01 | 12.535 |
| 2019-12-02 | 12.654 |
| 2019-12-03 | 12.811 |
| 2019-12-04 | 12.905 |
| 2019-12-05 | 12.973 |
| 2019-12-06 | 13.02 |
| 2019-12-07 | 13.035 |
| 2019-12-08 | 13.086 |
| 2019-12-09 | 13.224 |
| 2019-12-10 | 13.341 |
| 2019-12-11 | 13.451 |
| 2019-12-12 | 13.511 |
| 2019-12-13 | 13.493 |
| 2019-12-14 | 13.516 |
| 2019-12-15 | 13.593 |
| 2019-12-16 | 13.52 |
| 2019-12-17 | 13.461 |
| 2019-12-18 | 13.467 |
| 2019-12-19 | 13.45 |
| 2019-12-20 | 13.437 |
| 2019-12-21 | 13.452 |
| 2019-12-22 | 13.511 |
| 2019-12-23 | 13.466 |
| 2019-12-24 | 13.428 |
| 2019-12-25 | 13.506 |
| 2019-12-26 | 13.562 |
| 2019-12-27 | 13.646 |
| 2019-12-28 | 13.646 |
| 2019-12-29 | 13.699 |
| 2019-12-30 | 13.756 |
| 2019-12-31 | 13.757 |
| 2020-01-01 | 13.699 |
| 2020-01-02 | 13.524 |
| 2020-01-03 | 13.485 |
| 2020-01-04 | 13.431 |
| 2020-01-05 | 13.421 |
| 2020-01-06 | 13.443 |
| 2020-01-07 | 13.461 |
| 2020-01-08 | 13.34 |
| 2020-01-09 | 13.183 |
| 2020-01-10 | 13.061 |
| 2020-01-11 | 13.015 |
| 2020-01-12 | 13.037 |
| 2020-01-13 | 12.999 |
| 2020-01-14 | 12.968 |
| 2020-01-15 | 12.982 |
| 2020-01-16 | 12.984 |
| 2020-01-17 | 12.96 |
| 2020-01-18 | 12.984 |
| 2020-01-19 | 13.011 |
| 2020-01-20 | 13.011 |
| 2020-01-21 | 13.002 |
| 2020-01-22 | 13.018 |
| 2020-01-23 | 13.034 |
| 2020-01-24 | 13.11 |
| 2020-01-25 | 13.135 |
| 2020-01-26 | 13.118 |
| 2020-01-27 | 13.387 |
| 2020-01-28 | 13.532 |
| 2020-01-29 | 13.61 |
| 2020-01-30 | 13.696 |
| 2020-01-31 | 13.941 |
| 2020-02-01 | 14.014 |
| 2020-02-02 | 14.014 |
| 2020-02-03 | 14.212 |
| 2020-02-04 | 14.3 |
| 2020-02-05 | 14.361 |
| 2020-02-06 | 14.417 |
| 2020-02-07 | 14.513 |
| 2020-02-08 | 14.612 |
| 2020-02-09 | 14.72 |
| 2020-02-10 | 14.736 |
| 2020-02-11 | 14.757 |
| 2020-02-12 | 14.825 |
| 2020-02-13 | 14.909 |
| 2020-02-14 | 14.969 |
| 2020-02-15 | 15.101 |
| 2020-02-16 | 15.259 |
| 2020-02-17 | 15.259 |
| 2020-02-18 | 15.238 |
| 2020-02-19 | 15.197 |
| 2020-02-20 | 15.326 |
| 2020-02-21 | 15.524 |
| 2020-02-22 | 15.652 |
| 2020-02-23 | 15.709 |
| 2020-02-24 | 16.175 |
| 2020-02-25 | 16.731 |
| 2020-02-26 | 17.175 |
| 2020-02-27 | 18.265 |
| 2020-02-28 | 19.394 |
| 2020-02-29 | 19.59 |
| 2020-03-01 | 19.629 |
| 2020-03-02 | 20.319 |
| 2020-03-03 | 21.104 |
| 2020-03-04 | 21.772 |
| 2020-03-05 | 22.894 |
| 2020-03-06 | 24.17 |
| 2020-03-07 | 24.63 |
| 2020-03-08 | 25.113 |
| 2020-03-09 | 26.58 |
| 2020-03-10 | 27.567 |
| 2020-03-11 | 29.417 |
| 2020-03-12 | 32.288 |
| 2020-03-13 | 34.388 |
| 2020-03-14 | 35.4 |
| 2020-03-15 | 36.543 |
| 2020-03-16 | 38.85 |
| 2020-03-17 | 40.615 |
| 2020-03-18 | 42.244 |
| 2020-03-19 | 44.842 |
| 2020-03-20 | 47.19 |
| 2020-03-21 | 48.697 |
| 2020-03-22 | 50.278 |
| 2020-03-23 | 50.816 |
| 2020-03-24 | 51.31 |
| 2020-03-25 | 53.079 |
| 2020-03-26 | 54.585 |
| 2020-03-27 | 56.312 |
| 2020-03-28 | 57.129 |
| 2020-03-29 | 57.979 |
| 2020-03-30 | 57.937 |
| 2020-03-31 | 57.737 |
| 2020-04-01 | 58.811 |
| 2020-04-02 | 59.452 |
| 2020-04-03 | 60.125 |
| 2020-04-04 | 61.101 |
| 2020-04-05 | 62.059 |
| 2020-04-06 | 61.259 |
| 2020-04-07 | 60.597 |
| 2020-04-08 | 60.092 |
| 2020-04-09 | 59.836 |
| 2020-04-10 | 60.119 |
| 2020-04-11 | 59.351 |
| 2020-04-12 | 59.431 |
| 2020-04-13 | 58.518 |
| 2020-04-14 | 57.53 |
| 2020-04-15 | 55.537 |
| 2020-04-16 | 53.832 |
| 2020-04-17 | 52.008 |
| 2020-04-18 | 51.008 |
| 2020-04-19 | 50.217 |
| 2020-04-20 | 49.898 |
| 2020-04-21 | 49.684 |
| 2020-04-22 | 48.75 |
| 2020-04-23 | 47.784 |
| 2020-04-24 | 46.45 |
| 2020-04-25 | 45.723 |
| 2020-04-26 | 44.679 |
| 2020-04-27 | 44.11 |
| 2020-04-28 | 43.608 |
| 2020-04-29 | 42.377 |
| 2020-04-30 | 41.454 |
| 2020-05-01 | 40.508 |
| 2020-05-02 | 39.988 |
| 2020-05-03 | 39.629 |
| 2020-05-04 | 39.446 |
| 2020-05-05 | 39.168 |
| 2020-05-06 | 38.639 |
| 2020-05-07 | 37.912 |
| 2020-05-08 | 37.18 |
| 2020-05-09 | 36.956 |
| 2020-05-10 | 36.956 |
| 2020-05-11 | 36.509 |
| 2020-05-12 | 36.351 |
| 2020-05-13 | 36.083 |
| 2020-05-14 | 35.849 |
| 2020-05-15 | 35.442 |
| 2020-05-16 | 35.22 |
| 2020-05-17 | 35.074 |
| 2020-05-18 | 34.799 |
| 2020-05-19 | 34.605 |
| 2020-05-20 | 33.885 |
| 2020-05-21 | 33.163 |
| 2020-05-22 | 32.535 |
| 2020-05-23 | 32.113 |
| 2020-05-24 | 31.922 |
| 2020-05-25 | 31.922 |
| 2020-05-26 | 31.736 |
| 2020-05-27 | 31.466 |
| 2020-05-28 | 31.229 |
| 2020-05-29 | 31.052 |
| 2020-05-30 | 30.897 |
| 2020-05-31 | 30.566 |
| 2020-06-01 | 30.449 |
| 2020-06-02 | 30.277 |
| 2020-06-03 | 29.786 |
| 2020-06-04 | 29.415 |
| 2020-06-05 | 28.958 |
| 2020-06-06 | 28.833 |
| 2020-06-07 | 28.878 |
| 2020-06-08 | 28.725 |
| 2020-06-09 | 28.67 |
| 2020-06-10 | 28.67 |
| 2020-06-11 | 29.039 |
| 2020-06-12 | 29.078 |
| 2020-06-13 | 28.901 |
| 2020-06-14 | 28.744 |
| 2020-06-15 | 29.026 |
| 2020-06-16 | 29.248 |
| 2020-06-17 | 29.446 |
| 2020-06-18 | 29.561 |
| 2020-06-19 | 29.9 |
| 2020-06-20 | 29.919 |
| 2020-06-21 | 30.012 |
| 2020-06-22 | 30.099 |
| 2020-06-23 | 30.16 |
| 2020-06-24 | 30.327 |
| 2020-06-25 | 30.519 |
| 2020-06-26 | 30.842 |
| 2020-06-27 | 30.949 |
| 2020-06-28 | 31.121 |
| 2020-06-29 | 31.152 |
| 2020-06-30 | 31.12 |
| 2020-07-01 | 31.137 |
| 2020-07-02 | 31.175 |
| 2020-07-03 | 31.438 |
| 2020-07-04 | 31.719 |
| 2020-07-05 | 32.098 |
| 2020-07-06 | 31.89 |
| 2020-07-07 | 31.773 |
| 2020-07-08 | 31.881 |
| 2020-07-09 | 31.962 |
| 2020-07-10 | 31.949 |
| 2020-07-11 | 31.506 |
| 2020-07-12 | 31.265 |
| 2020-07-13 | 31.312 |
| 2020-07-14 | 31.226 |
| 2020-07-15 | 30.91 |
| 2020-07-16 | 30.64 |
| 2020-07-17 | 30.269 |
| 2020-07-18 | 30.135 |
| 2020-07-19 | 29.873 |
| 2020-07-20 | 29.602 |
| 2020-07-21 | 29.376 |
| 2020-07-22 | 29.021 |
| 2020-07-23 | 28.769 |
| 2020-07-24 | 28.388 |
| 2020-07-25 | 28.197 |
| 2020-07-26 | 27.853 |
| 2020-07-27 | 27.697 |
| 2020-07-28 | 27.59 |
| 2020-07-29 | 27.224 |
| 2020-07-30 | 26.954 |
| 2020-07-31 | 26.756 |
| 2020-08-01 | 26.71 |
| 2020-08-02 | 26.71 |
| 2020-08-03 | 26.594 |
| 2020-08-04 | 26.465 |
| 2020-08-05 | 26.24 |
| 2020-08-06 | 25.932 |
| 2020-08-07 | 25.665 |
| 2020-08-08 | 25.494 |
| 2020-08-09 | 25.404 |
| 2020-08-10 | 25.248 |
| 2020-08-11 | 25.193 |
| 2020-08-12 | 24.742 |
| 2020-08-13 | 24.406 |
| 2020-08-14 | 24.147 |
| 2020-08-15 | 23.963 |
| 2020-08-16 | 23.877 |
| 2020-08-17 | 23.757 |
| 2020-08-18 | 23.655 |
| 2020-08-19 | 23.568 |
| 2020-08-20 | 23.471 |
| 2020-08-21 | 23.39 |
| 2020-08-22 | 23.262 |
| 2020-08-23 | 23.134 |
| 2020-08-24 | 23.097 |
| 2020-08-25 | 23.049 |
| 2020-08-26 | 22.982 |
| 2020-08-27 | 22.938 |
| 2020-08-28 | 22.886 |
| 2020-08-29 | 22.797 |
| 2020-08-30 | 22.714 |
| 2020-08-31 | 22.89 |
| 2020-09-01 | 23.036 |
| 2020-09-02 | 23.14 |
| 2020-09-03 | 23.588 |
| 2020-09-04 | 23.94 |
| 2020-09-05 | 24.002 |
| 2020-09-06 | 24.092 |
| 2020-09-07 | 24.092 |
| 2020-09-08 | 24.442 |
| 2020-09-09 | 24.76 |
| 2020-09-10 | 25.031 |
| 2020-09-11 | 25.25 |
| 2020-09-12 | 25.406 |
| 2020-09-13 | 25.582 |
| 2020-09-14 | 25.596 |
| 2020-09-15 | 25.595 |
| 2020-09-16 | 25.819 |
| 2020-09-17 | 26.054 |
| 2020-09-18 | 26.211 |
| 2020-09-19 | 26.385 |
| 2020-09-20 | 26.588 |
| 2020-09-21 | 26.647 |
| 2020-09-22 | 26.658 |
| 2020-09-23 | 26.953 |
| 2020-09-24 | 27.262 |
| 2020-09-25 | 27.41 |
| 2020-09-26 | 27.557 |
| 2020-09-27 | 27.799 |
| 2020-09-28 | 27.719 |
| 2020-09-29 | 27.65 |
| 2020-09-30 | 27.648 |
| 2020-10-01 | 27.675 |
| 2020-10-02 | 27.726 |
| 2020-10-03 | 27.432 |
| 2020-10-04 | 27.257 |
| 2020-10-05 | 27.292 |
| 2020-10-06 | 27.397 |
| 2020-10-07 | 27.427 |
| 2020-10-08 | 27.195 |
| 2020-10-09 | 27.022 |
| 2020-10-10 | 26.894 |
| 2020-10-11 | 26.895 |
| 2020-10-12 | 26.808 |
| 2020-10-13 | 26.775 |
| 2020-10-14 | 26.8 |
| 2020-10-15 | 26.862 |
| 2020-10-16 | 26.925 |
| 2020-10-17 | 26.947 |
| 2020-10-18 | 27.002 |
| 2020-10-19 | 27.106 |
| 2020-10-20 | 27.208 |
| 2020-10-21 | 27.248 |
| 2020-10-22 | 27.305 |
| 2020-10-23 | 27.258 |
| 2020-10-24 | 27.198 |
| 2020-10-25 | 27.239 |
| 2020-10-26 | 27.488 |
| 2020-10-27 | 27.754 |
| 2020-10-28 | 28.395 |
| 2020-10-29 | 28.909 |
| 2020-10-30 | 29.439 |
| 2020-10-31 | 29.569 |
| 2020-11-01 | 29.666 |
| 2020-11-02 | 30.021 |
| 2020-11-03 | 30.273 |
| 2020-11-04 | 30.346 |
| 2020-11-05 | 30.26 |
| 2020-11-06 | 30.114 |
| 2020-11-07 | 30.293 |
| 2020-11-08 | 30.558 |
| 2020-11-09 | 30.329 |
| 2020-11-10 | 30.077 |
| 2020-11-11 | 30.004 |
| 2020-11-12 | 29.971 |
| 2020-11-13 | 29.821 |
| 2020-11-14 | 29.957 |
| 2020-11-15 | 30.084 |
| 2020-11-16 | 29.72 |
| 2020-11-17 | 29.402 |
| 2020-11-18 | 29.159 |
| 2020-11-19 | 28.875 |
| 2020-11-20 | 28.65 |
| 2020-11-21 | 28.676 |
| 2020-11-22 | 28.733 |
| 2020-11-23 | 28.443 |
| 2020-11-24 | 28.134 |
| 2020-11-25 | 27.625 |
| 2020-11-26 | 27.352 |
| 2020-11-27 | 26.426 |
| 2020-11-28 | 25.868 |
| 2020-11-29 | 25.228 |
| 2020-11-30 | 24.995 |
| 2020-12-01 | 24.794 |
| 2020-12-02 | 24.034 |
| 2020-12-03 | 23.355 |
| 2020-12-04 | 22.937 |
| 2020-12-05 | 22.704 |
| 2020-12-06 | 22.591 |
| 2020-12-07 | 22.526 |
| 2020-12-08 | 22.439 |
| 2020-12-09 | 22.273 |
| 2020-12-10 | 22.164 |
| 2020-12-11 | 22.158 |
| 2020-12-12 | 21.998 |
| 2020-12-13 | 21.94 |
| 2020-12-14 | 22.079 |
| 2020-12-15 | 22.118 |
| 2020-12-16 | 22.12 |
| 2020-12-17 | 22.083 |
| 2020-12-18 | 21.975 |
| 2020-12-19 | 21.918 |
| 2020-12-20 | 21.824 |
| 2020-12-21 | 21.991 |
| 2020-12-22 | 22.098 |
| 2020-12-23 | 22.129 |
| 2020-12-24 | 22.123 |
| 2020-12-25 | 22.167 |
| 2020-12-26 | 22.167 |
| 2020-12-27 | 22.237 |
| 2020-12-28 | 22.21 |
| 2020-12-29 | 22.251 |
| 2020-12-30 | 22.356 |
| 2020-12-31 | 22.45 |
| 2021-01-01 | 22.514 |
| 2021-01-02 | 22.579 |
| 2021-01-03 | 22.679 |
| 2021-01-04 | 22.905 |
| 2021-01-05 | 23.026 |
| 2021-01-06 | 23.215 |
| 2021-01-07 | 23.299 |
| 2021-01-08 | 23.264 |
| 2021-01-09 | 23.303 |
| 2021-01-10 | 23.303 |
| 2021-01-11 | 23.344 |
| 2021-01-12 | 23.343 |
| 2021-01-13 | 23.217 |
| 2021-01-14 | 23.235 |
| 2021-01-15 | 23.327 |
| 2021-01-16 | 23.401 |
| 2021-01-17 | 23.503 |
| 2021-01-18 | 23.503 |
| 2021-01-19 | 23.489 |
| 2021-01-20 | 23.301 |
| 2021-01-21 | 23.147 |
| 2021-01-22 | 23.074 |
| 2021-01-23 | 23.159 |
| 2021-01-24 | 23.159 |
| 2021-01-25 | 23.161 |
| 2021-01-26 | 23.154 |
| 2021-01-27 | 23.929 |
| 2021-01-28 | 24.286 |
| 2021-01-29 | 24.802 |
| 2021-01-30 | 24.91 |
| 2021-01-31 | 24.91 |
| 2021-02-01 | 25.176 |
| 2021-02-02 | 25.195 |
| 2021-02-03 | 25.001 |
| 2021-02-04 | 24.831 |
| 2021-02-05 | 24.631 |
| 2021-02-06 | 24.744 |
| 2021-02-07 | 24.912 |
| 2021-02-08 | 24.729 |
| 2021-02-09 | 24.581 |
| 2021-02-10 | 24.481 |
| 2021-02-11 | 24.382 |
| 2021-02-12 | 24.276 |
| 2021-02-13 | 24.327 |
| 2021-02-14 | 24.326 |
| 2021-02-15 | 24.326 |
| 2021-02-16 | 24.183 |
| 2021-02-17 | 24.055 |
| 2021-02-18 | 24.02 |
| 2021-02-19 | 24.042 |
| 2021-02-20 | 24.178 |
| 2021-02-21 | 24.297 |
| 2021-02-22 | 24.255 |
| 2021-02-23 | 24.2 |
| 2021-02-24 | 24.112 |
| 2021-02-25 | 24.392 |
| 2021-02-26 | 23.951 |
| 2021-02-27 | 23.638 |
| 2021-02-28 | 23.141 |
| 2021-03-01 | 23.151 |
| 2021-03-02 | 23.196 |
| 2021-03-03 | 23.026 |
| 2021-03-04 | 23.17 |
| 2021-03-05 | 23.253 |
| 2021-03-06 | 23.327 |
| 2021-03-07 | 23.456 |
| 2021-03-08 | 23.557 |
| 2021-03-09 | 23.58 |
| 2021-03-10 | 23.642 |
| 2021-03-11 | 23.656 |
| 2021-03-12 | 23.594 |
| 2021-03-13 | 23.711 |
| 2021-03-14 | 23.908 |
| 2021-03-15 | 23.714 |
| 2021-03-16 | 23.527 |
| 2021-03-17 | 23.332 |
| 2021-03-18 | 23.337 |
| 2021-03-19 | 23.312 |
| 2021-03-20 | 23.351 |
| 2021-03-21 | 23.417 |
| 2021-03-22 | 23.2 |
| 2021-03-23 | 23.069 |
| 2021-03-24 | 22.966 |
| 2021-03-25 | 22.816 |
| 2021-03-26 | 22.704 |
| 2021-03-27 | 22.409 |
| 2021-03-28 | 22.132 |
| 2021-03-29 | 22.066 |
| 2021-03-30 | 21.954 |
| 2021-03-31 | 21.775 |
| 2021-04-01 | 21.467 |
| 2021-04-02 | 21.219 |
| 2021-04-03 | 20.851 |
| 2021-04-04 | 20.651 |
| 2021-04-05 | 20.514 |
| 2021-04-06 | 20.4 |
| 2021-04-07 | 20.004 |
| 2021-04-08 | 19.667 |
| 2021-04-09 | 19.388 |
| 2021-04-10 | 19.262 |
| 2021-04-11 | 19.186 |
| 2021-04-12 | 19.072 |
| 2021-04-13 | 18.957 |
| 2021-04-14 | 18.812 |
| 2021-04-15 | 18.659 |
| 2021-04-16 | 18.517 |
| 2021-04-17 | 18.364 |
| 2021-04-18 | 18.228 |
| 2021-04-19 | 18.181 |
| 2021-04-20 | 18.205 |
| 2021-04-21 | 18.139 |
| 2021-04-22 | 18.063 |
| 2021-04-23 | 17.879 |
| 2021-04-24 | 17.782 |
| 2021-04-25 | 17.726 |
| 2021-04-26 | 17.722 |
| 2021-04-27 | 17.714 |
| 2021-04-28 | 17.549 |
| 2021-04-29 | 17.454 |
| 2021-04-30 | 17.416 |
| 2021-05-01 | 17.42 |
| 2021-05-02 | 17.42 |
| 2021-05-03 | 17.463 |
| 2021-05-04 | 17.555 |
| 2021-05-05 | 17.611 |
| 2021-05-06 | 17.623 |
| 2021-05-07 | 17.602 |
| 2021-05-08 | 17.633 |
| 2021-05-09 | 17.68 |
| 2021-05-10 | 17.774 |
| 2021-05-11 | 17.959 |
| 2021-05-12 | 18.445 |
| 2021-05-13 | 18.739 |
| 2021-05-14 | 18.822 |
| 2021-05-15 | 18.929 |
| 2021-05-16 | 19.063 |
| 2021-05-17 | 19.094 |
| 2021-05-18 | 19.196 |
| 2021-05-19 | 19.419 |
| 2021-05-20 | 19.509 |
| 2021-05-21 | 19.63 |
| 2021-05-22 | 19.673 |
| 2021-05-23 | 19.79 |
| 2021-05-24 | 19.724 |
| 2021-05-25 | 19.684 |
| 2021-05-26 | 19.671 |
| 2021-05-27 | 19.634 |
| 2021-05-28 | 19.61 |
| 2021-05-29 | 19.706 |
| 2021-05-30 | 19.76 |
| 2021-05-31 | 19.76 |
| 2021-06-01 | 19.672 |
| 2021-06-02 | 19.632 |
| 2021-06-03 | 19.564 |
| 2021-06-04 | 19.434 |
| 2021-06-05 | 19.486 |
| 2021-06-06 | 19.633 |
| 2021-06-07 | 19.473 |
| 2021-06-08 | 19.358 |
| 2021-06-09 | 19.274 |
| 2021-06-10 | 19 |
| 2021-06-11 | 18.432 |
| 2021-06-12 | 18.197 |
| 2021-06-13 | 18.165 |
| 2021-06-14 | 18.076 |
| 2021-06-15 | 18.026 |
| 2021-06-16 | 17.951 |
| 2021-06-17 | 17.78 |
| 2021-06-18 | 17.71 |
| 2021-06-19 | 17.561 |
| 2021-06-20 | 17.425 |
| 2021-06-21 | 17.448 |
| 2021-06-22 | 17.411 |
| 2021-06-23 | 17.312 |
| 2021-06-24 | 17.175 |
| 2021-06-25 | 17.092 |
| 2021-06-26 | 17.11 |
| 2021-06-27 | 17.128 |
| 2021-06-28 | 17.06 |
| 2021-06-29 | 17.01 |
| 2021-06-30 | 16.957 |
| 2021-07-01 | 16.847 |
| 2021-07-02 | 16.737 |
| 2021-07-03 | 16.675 |
| 2021-07-04 | 16.688 |
| 2021-07-05 | 16.688 |
| 2021-07-06 | 16.676 |
| 2021-07-07 | 16.666 |
| 2021-07-08 | 16.758 |
| 2021-07-09 | 16.676 |
| 2021-07-10 | 16.705 |
| 2021-07-11 | 16.761 |
| 2021-07-12 | 16.731 |
| 2021-07-13 | 16.75 |
| 2021-07-14 | 16.747 |
| 2021-07-15 | 16.746 |
| 2021-07-16 | 16.76 |
| 2021-07-17 | 16.711 |
| 2021-07-18 | 16.501 |
| 2021-07-19 | 16.801 |
| 2021-07-20 | 16.94 |
| 2021-07-21 | 16.941 |
| 2021-07-22 | 16.99 |
| 2021-07-23 | 17.032 |
| 2021-07-24 | 17.086 |
| 2021-07-25 | 17.163 |
| 2021-07-26 | 17.184 |
| 2021-07-27 | 17.287 |
| 2021-07-28 | 17.409 |
| 2021-07-29 | 17.489 |
| 2021-07-30 | 17.603 |
| 2021-07-31 | 17.71 |
| 2021-08-01 | 17.848 |
| 2021-08-02 | 17.929 |
| 2021-08-03 | 17.934 |
| 2021-08-04 | 17.936 |
| 2021-08-05 | 17.974 |
| 2021-08-06 | 17.972 |
| 2021-08-07 | 17.923 |
| 2021-08-08 | 18.01 |
| 2021-08-09 | 17.949 |
| 2021-08-10 | 17.896 |
| 2021-08-11 | 17.891 |
| 2021-08-12 | 17.821 |
| 2021-08-13 | 17.781 |
| 2021-08-14 | 17.818 |
| 2021-08-15 | 17.786 |
| 2021-08-16 | 17.707 |
| 2021-08-17 | 17.716 |
| 2021-08-18 | 17.674 |
| 2021-08-19 | 17.762 |
| 2021-08-20 | 17.792 |
| 2021-08-21 | 17.797 |
| 2021-08-22 | 17.827 |
| 2021-08-23 | 17.794 |
| 2021-08-24 | 17.768 |
| 2021-08-25 | 17.732 |
| 2021-08-26 | 17.709 |
| 2021-08-27 | 17.621 |
| 2021-08-28 | 17.618 |
| 2021-08-29 | 17.586 |
| 2021-08-30 | 17.52 |
| 2021-08-31 | 17.473 |
| 2021-09-01 | 17.32 |
| 2021-09-02 | 17.246 |
| 2021-09-03 | 17.175 |
| 2021-09-04 | 17.17 |
| 2021-09-05 | 17.222 |
| 2021-09-06 | 17.222 |
| 2021-09-07 | 17.265 |
| 2021-09-08 | 17.324 |
| 2021-09-09 | 17.42 |
| 2021-09-10 | 17.653 |
| 2021-09-11 | 17.756 |
| 2021-09-12 | 17.877 |
| 2021-09-13 | 17.952 |
| 2021-09-14 | 18.024 |
| 2021-09-15 | 18.122 |
| 2021-09-16 | 18.159 |
| 2021-09-17 | 18.123 |
| 2021-09-18 | 17.946 |
| 2021-09-19 | 17.913 |
| 2021-09-20 | 18.303 |
| 2021-09-21 | 18.591 |
| 2021-09-22 | 18.769 |
| 2021-09-23 | 18.836 |
| 2021-09-24 | 18.881 |
| 2021-09-25 | 18.884 |
| 2021-09-26 | 19.015 |
| 2021-09-27 | 19.002 |
| 2021-09-28 | 19.204 |
| 2021-09-29 | 19.508 |
| 2021-09-30 | 19.825 |
| 2021-10-01 | 20.065 |
| 2021-10-02 | 20.248 |
| 2021-10-03 | 20.449 |
| 2021-10-04 | 20.575 |
| 2021-10-05 | 20.61 |
| 2021-10-06 | 20.627 |
| 2021-10-07 | 20.691 |
| 2021-10-08 | 20.728 |
| 2021-10-09 | 20.82 |
| 2021-10-10 | 20.813 |
| 2021-10-11 | 20.774 |
| 2021-10-12 | 20.732 |
| 2021-10-13 | 20.699 |
| 2021-10-14 | 20.581 |
| 2021-10-15 | 20.495 |
| 2021-10-16 | 20.581 |
| 2021-10-17 | 20.57 |
| 2021-10-18 | 20.367 |
| 2021-10-19 | 20.155 |
| 2021-10-20 | 19.69 |
| 2021-10-21 | 19.265 |
| 2021-10-22 | 19.018 |
| 2021-10-23 | 19.037 |
| 2021-10-24 | 19.101 |
| 2021-10-25 | 18.917 |
| 2021-10-26 | 18.784 |
| 2021-10-27 | 18.703 |
| 2021-10-28 | 18.397 |
| 2021-10-29 | 18.111 |
| 2021-10-30 | 17.871 |
| 2021-10-31 | 17.708 |
| 2021-11-01 | 17.646 |
| 2021-11-02 | 17.572 |
| 2021-11-03 | 17.215 |
| 2021-11-04 | 16.949 |
| 2021-11-05 | 16.743 |
| 2021-11-06 | 16.61 |
| 2021-11-07 | 16.502 |
| 2021-11-08 | 16.536 |
| 2021-11-09 | 16.593 |
| 2021-11-10 | 16.535 |
| 2021-11-11 | 16.435 |
| 2021-11-12 | 16.329 |
| 2021-11-13 | 16.303 |
| 2021-11-14 | 16.304 |
| 2021-11-15 | 16.312 |
| 2021-11-16 | 16.315 |
| 2021-11-17 | 16.351 |
| 2021-11-18 | 16.437 |
| 2021-11-19 | 16.547 |
| 2021-11-20 | 16.62 |
| 2021-11-21 | 16.68 |
| 2021-11-22 | 16.799 |
| 2021-11-23 | 16.916 |
| 2021-11-24 | 17.068 |
| 2021-11-25 | 17.12 |
| 2021-11-26 | 17.674 |
| 2021-11-27 | 17.731 |
| 2021-11-28 | 17.808 |
| 2021-11-29 | 18.066 |
| 2021-11-30 | 18.5 |
| 2021-12-01 | 19.201 |
| 2021-12-02 | 19.769 |
| 2021-12-03 | 20.51 |
| 2021-12-04 | 20.764 |
| 2021-12-05 | 20.989 |
| 2021-12-06 | 21.298 |
| 2021-12-07 | 21.327 |
| 2021-12-08 | 21.454 |
| 2021-12-09 | 21.635 |
| 2021-12-10 | 21.633 |
| 2021-12-11 | 21.832 |
| 2021-12-12 | 22.124 |
| 2021-12-13 | 22.033 |
| 2021-12-14 | 22.026 |
| 2021-12-15 | 22.16 |
| 2021-12-16 | 22.36 |
| 2021-12-17 | 22.572 |
| 2021-12-18 | 22.821 |
| 2021-12-19 | 23.079 |
| 2021-12-20 | 23.069 |
| 2021-12-21 | 22.971 |
| 2021-12-22 | 22.945 |
| 2021-12-23 | 22.878 |
| 2021-12-24 | 23.092 |
| 2021-12-25 | 23.092 |
| 2021-12-26 | 22.802 |
| 2021-12-27 | 22.546 |
| 2021-12-28 | 22.307 |
| 2021-12-29 | 22.021 |
| 2021-12-30 | 21.551 |
| 2021-12-31 | 20.89 |
| 2022-01-01 | 20.536 |
| 2022-01-02 | 20.003 |
| 2022-01-03 | 19.833 |
| 2022-01-04 | 19.694 |
| 2022-01-05 | 19.339 |
| 2022-01-06 | 19.23 |
| 2022-01-07 | 19.176 |
| 2022-01-08 | 19.056 |
| 2022-01-09 | 19.075 |
| 2022-01-10 | 19.092 |
| 2022-01-11 | 19.059 |
| 2022-01-12 | 18.931 |
| 2022-01-13 | 18.856 |
| 2022-01-14 | 18.851 |
| 2022-01-15 | 18.765 |
| 2022-01-16 | 18.617 |
| 2022-01-17 | 18.617 |
| 2022-01-18 | 18.826 |
| 2022-01-19 | 18.875 |
| 2022-01-20 | 19.104 |
| 2022-01-21 | 19.615 |
| 2022-01-22 | 19.702 |
| 2022-01-23 | 19.702 |
| 2022-01-24 | 20.212 |
| 2022-01-25 | 20.733 |
| 2022-01-26 | 21.413 |
| 2022-01-27 | 22.03 |
| 2022-01-28 | 22.54 |
| 2022-01-29 | 22.801 |
| 2022-01-30 | 23.094 |
| 2022-01-31 | 23.181 |
| 2022-02-01 | 23.123 |
| 2022-02-02 | 23.384 |
| 2022-02-03 | 23.739 |
| 2022-02-04 | 23.905 |
| 2022-02-05 | 24.12 |
| 2022-02-06 | 24.402 |
| 2022-02-07 | 24.324 |
| 2022-02-08 | 24.187 |
| 2022-02-09 | 24.214 |
| 2022-02-10 | 24.476 |
| 2022-02-11 | 24.94 |
| 2022-02-12 | 25.171 |
| 2022-02-13 | 25.486 |
| 2022-02-14 | 25.628 |
| 2022-02-15 | 25.631 |
| 2022-02-16 | 25.57 |
| 2022-02-17 | 25.812 |
| 2022-02-18 | 25.99 |
| 2022-02-19 | 26.009 |
| 2022-02-20 | 25.867 |
| 2022-02-21 | 25.867 |
| 2022-02-22 | 26.007 |
| 2022-02-23 | 26.06 |
| 2022-02-24 | 26.02 |
| 2022-02-25 | 25.812 |
| 2022-02-26 | 25.578 |
| 2022-02-27 | 25.468 |
| 2022-02-28 | 25.702 |
| 2022-03-01 | 26.065 |
| 2022-03-02 | 26.347 |
| 2022-03-03 | 26.752 |
| 2022-03-04 | 27.223 |
| 2022-03-07 | 27.8 |
| 2022-03-08 | 28.367 |
| 2022-03-09 | 28.552 |
| 2022-03-10 | 28.625 |
| 2022-03-11 | 28.968 |
| 2022-03-14 | 29.417 |
| 2022-03-15 | 29.847 |
| 2022-03-16 | 29.967 |
| 2022-03-17 | 29.893 |
| 2022-03-18 | 29.642 |
| 2022-03-21 | 29.398 |
| 2022-03-22 | 29.194 |